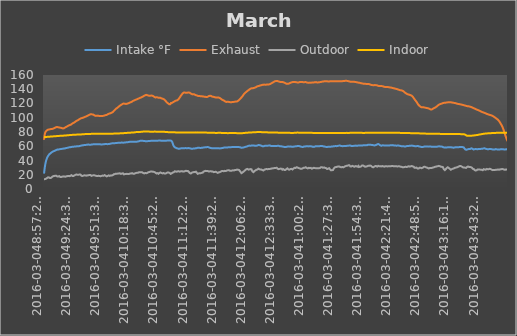
| Category | Intake °F | Exhaust | Outdoor | Indoor |
|---|---|---|---|---|
| 2016-03-048:57:28 AM | 21.65 | 69.125 | 13.775 | 72.838 |
| 2016-03-048:57:32 AM | 22.55 | 70.138 | 13.775 | 72.838 |
| 2016-03-048:57:36 AM | 23.45 | 71.038 | 13.775 | 72.838 |
| 2016-03-048:57:40 AM | 24.238 | 71.938 | 13.775 | 72.838 |
| 2016-03-048:57:44 AM | 25.138 | 72.838 | 13.775 | 72.838 |
| 2016-03-048:57:48 AM | 25.925 | 73.625 | 13.775 | 72.838 |
| 2016-03-048:57:52 AM | 26.825 | 74.3 | 13.888 | 72.838 |
| 2016-03-048:57:56 AM | 27.612 | 74.975 | 13.888 | 72.838 |
| 2016-03-048:58:00 AM | 28.4 | 75.538 | 13.888 | 72.838 |
| 2016-03-048:58:04 AM | 29.188 | 76.1 | 13.775 | 72.838 |
| 2016-03-048:58:08 AM | 29.862 | 76.662 | 13.775 | 72.838 |
| 2016-03-048:58:12 AM | 30.65 | 77.112 | 13.888 | 72.838 |
| 2016-03-048:58:16 AM | 31.325 | 77.562 | 13.888 | 72.838 |
| 2016-03-048:58:21 AM | 32 | 77.9 | 13.888 | 72.838 |
| 2016-03-048:58:25 AM | 32.562 | 78.35 | 13.888 | 72.838 |
| 2016-03-048:58:29 AM | 33.238 | 78.688 | 13.888 | 72.838 |
| 2016-03-048:58:33 AM | 33.8 | 79.025 | 13.888 | 72.95 |
| 2016-03-048:58:37 AM | 34.362 | 79.362 | 13.888 | 72.95 |
| 2016-03-048:58:41 AM | 34.925 | 79.588 | 13.888 | 72.95 |
| 2016-03-048:58:45 AM | 35.488 | 79.812 | 13.888 | 72.95 |
| 2016-03-048:58:49 AM | 36.05 | 80.038 | 14 | 72.95 |
| 2016-03-048:58:53 AM | 36.5 | 80.15 | 14 | 72.95 |
| 2016-03-048:58:57 AM | 36.95 | 80.375 | 14.112 | 72.95 |
| 2016-03-048:59:01 AM | 37.4 | 80.6 | 14.112 | 72.95 |
| 2016-03-048:59:05 AM | 37.85 | 80.712 | 14.225 | 72.95 |
| 2016-03-048:59:09 AM | 38.3 | 80.938 | 14.225 | 72.95 |
| 2016-03-048:59:13 AM | 38.638 | 81.05 | 14.338 | 72.95 |
| 2016-03-048:59:17 AM | 39.088 | 81.162 | 14.45 | 72.95 |
| 2016-03-048:59:21 AM | 39.425 | 81.275 | 14.45 | 72.95 |
| 2016-03-048:59:25 AM | 39.762 | 81.388 | 14.562 | 72.95 |
| 2016-03-048:59:29 AM | 40.1 | 81.5 | 14.675 | 72.95 |
| 2016-03-048:59:33 AM | 40.55 | 81.5 | 14.788 | 72.95 |
| 2016-03-048:59:37 AM | 40.775 | 81.612 | 14.9 | 72.95 |
| 2016-03-048:59:42 AM | 41.112 | 81.725 | 15.012 | 72.95 |
| 2016-03-048:59:46 AM | 41.45 | 81.725 | 15.012 | 72.95 |
| 2016-03-048:59:50 AM | 41.675 | 81.838 | 15.125 | 73.062 |
| 2016-03-048:59:54 AM | 42.012 | 81.95 | 15.237 | 73.062 |
| 2016-03-048:59:58 AM | 42.35 | 82.062 | 15.237 | 73.062 |
| 2016-03-049:00:02 AM | 42.575 | 82.175 | 15.35 | 73.062 |
| 2016-03-049:00:06 AM | 42.912 | 82.288 | 15.237 | 73.062 |
| 2016-03-049:00:10 AM | 43.138 | 82.288 | 15.35 | 73.175 |
| 2016-03-049:00:14 AM | 43.362 | 82.4 | 15.35 | 73.062 |
| 2016-03-049:00:18 AM | 43.588 | 82.512 | 15.462 | 73.175 |
| 2016-03-049:00:22 AM | 43.925 | 82.512 | 15.575 | 73.175 |
| 2016-03-049:00:26 AM | 44.15 | 82.625 | 15.688 | 73.175 |
| 2016-03-049:00:30 AM | 44.375 | 82.625 | 15.8 | 73.175 |
| 2016-03-049:00:34 AM | 44.488 | 82.738 | 15.912 | 73.175 |
| 2016-03-049:00:38 AM | 44.712 | 82.85 | 15.912 | 73.175 |
| 2016-03-049:00:42 AM | 44.938 | 82.85 | 15.912 | 73.175 |
| 2016-03-049:00:46 AM | 45.162 | 82.962 | 16.025 | 73.175 |
| 2016-03-049:00:51 AM | 45.388 | 82.962 | 16.138 | 73.175 |
| 2016-03-049:00:55 AM | 45.5 | 83.075 | 16.25 | 73.175 |
| 2016-03-049:00:59 AM | 45.725 | 83.075 | 16.25 | 73.175 |
| 2016-03-049:01:03 AM | 45.95 | 83.188 | 16.362 | 73.175 |
| 2016-03-049:01:07 AM | 46.062 | 83.188 | 16.475 | 73.175 |
| 2016-03-049:01:11 AM | 46.175 | 83.188 | 16.475 | 73.288 |
| 2016-03-049:01:15 AM | 46.288 | 83.188 | 16.362 | 73.288 |
| 2016-03-049:01:19 AM | 46.512 | 83.188 | 16.25 | 73.288 |
| 2016-03-049:01:23 AM | 46.625 | 83.3 | 16.25 | 73.288 |
| 2016-03-049:01:27 AM | 46.85 | 83.3 | 16.25 | 73.288 |
| 2016-03-049:01:31 AM | 46.962 | 83.3 | 16.25 | 73.288 |
| 2016-03-049:01:35 AM | 47.075 | 83.412 | 16.25 | 73.288 |
| 2016-03-049:01:39 AM | 47.3 | 83.412 | 16.25 | 73.288 |
| 2016-03-049:01:43 AM | 47.412 | 83.412 | 16.362 | 73.288 |
| 2016-03-049:01:47 AM | 47.525 | 83.525 | 16.362 | 73.288 |
| 2016-03-049:01:51 AM | 47.638 | 83.525 | 16.362 | 73.288 |
| 2016-03-049:01:56 AM | 47.862 | 83.525 | 16.362 | 73.288 |
| 2016-03-049:02:00 AM | 47.975 | 83.638 | 16.25 | 73.288 |
| 2016-03-049:02:04 AM | 48.2 | 83.638 | 16.138 | 73.288 |
| 2016-03-049:02:08 AM | 48.2 | 83.638 | 16.025 | 73.4 |
| 2016-03-049:02:12 AM | 48.312 | 83.75 | 16.138 | 73.288 |
| 2016-03-049:02:16 AM | 48.538 | 83.75 | 16.138 | 73.4 |
| 2016-03-049:02:20 AM | 48.538 | 83.75 | 16.138 | 73.4 |
| 2016-03-049:02:24 AM | 48.762 | 83.75 | 16.138 | 73.4 |
| 2016-03-049:02:28 AM | 48.875 | 83.862 | 16.138 | 73.4 |
| 2016-03-049:02:32 AM | 48.875 | 83.862 | 16.25 | 73.4 |
| 2016-03-049:02:36 AM | 48.988 | 83.75 | 16.25 | 73.4 |
| 2016-03-049:02:40 AM | 49.1 | 83.75 | 16.25 | 73.4 |
| 2016-03-049:02:44 AM | 49.1 | 83.75 | 16.138 | 73.4 |
| 2016-03-049:02:48 AM | 49.212 | 83.75 | 16.138 | 73.512 |
| 2016-03-049:02:53 AM | 49.325 | 83.862 | 15.912 | 73.4 |
| 2016-03-049:02:57 AM | 49.438 | 83.862 | 15.8 | 73.512 |
| 2016-03-049:03:01 AM | 49.438 | 83.862 | 15.575 | 73.512 |
| 2016-03-049:03:05 AM | 49.662 | 83.862 | 15.462 | 73.512 |
| 2016-03-049:03:09 AM | 49.662 | 83.975 | 15.35 | 73.512 |
| 2016-03-049:03:13 AM | 49.775 | 83.975 | 15.237 | 73.512 |
| 2016-03-049:03:17 AM | 49.888 | 83.975 | 15.237 | 73.512 |
| 2016-03-049:03:21 AM | 49.888 | 84.088 | 15.125 | 73.512 |
| 2016-03-049:03:25 AM | 50 | 84.088 | 15.237 | 73.512 |
| 2016-03-049:03:29 AM | 50.112 | 84.088 | 15.125 | 73.512 |
| 2016-03-049:03:33 AM | 50.112 | 83.975 | 15.237 | 73.512 |
| 2016-03-049:03:37 AM | 50.225 | 83.975 | 15.35 | 73.512 |
| 2016-03-049:03:41 AM | 50.338 | 84.088 | 15.35 | 73.512 |
| 2016-03-049:03:45 AM | 50.45 | 84.088 | 15.462 | 73.625 |
| 2016-03-049:03:49 AM | 50.562 | 84.088 | 15.462 | 73.512 |
| 2016-03-049:03:54 AM | 50.675 | 83.975 | 15.575 | 73.512 |
| 2016-03-049:03:58 AM | 50.675 | 84.088 | 15.688 | 73.512 |
| 2016-03-049:04:02 AM | 50.9 | 83.975 | 15.688 | 73.512 |
| 2016-03-049:04:06 AM | 51.012 | 84.088 | 15.8 | 73.625 |
| 2016-03-049:04:10 AM | 51.012 | 84.088 | 15.8 | 73.625 |
| 2016-03-049:04:14 AM | 51.125 | 84.088 | 15.912 | 73.625 |
| 2016-03-049:04:18 AM | 51.238 | 84.088 | 16.025 | 73.625 |
| 2016-03-049:04:22 AM | 51.238 | 84.088 | 16.138 | 73.625 |
| 2016-03-049:04:26 AM | 51.35 | 84.2 | 16.25 | 73.625 |
| 2016-03-049:04:30 AM | 51.462 | 84.2 | 16.362 | 73.738 |
| 2016-03-049:04:34 AM | 51.462 | 84.2 | 16.588 | 73.625 |
| 2016-03-049:04:38 AM | 51.575 | 84.2 | 16.7 | 73.738 |
| 2016-03-049:04:42 AM | 51.688 | 84.2 | 16.812 | 73.738 |
| 2016-03-049:04:46 AM | 51.8 | 84.2 | 16.925 | 73.738 |
| 2016-03-049:04:51 AM | 51.8 | 84.2 | 16.925 | 73.738 |
| 2016-03-049:04:55 AM | 51.912 | 84.2 | 17.037 | 73.738 |
| 2016-03-049:04:59 AM | 51.912 | 84.2 | 17.037 | 73.738 |
| 2016-03-049:05:03 AM | 52.025 | 84.312 | 17.037 | 73.738 |
| 2016-03-049:05:07 AM | 52.025 | 84.312 | 17.15 | 73.738 |
| 2016-03-049:05:11 AM | 52.138 | 84.312 | 17.262 | 73.738 |
| 2016-03-049:05:15 AM | 52.25 | 84.312 | 17.375 | 73.738 |
| 2016-03-049:05:19 AM | 52.25 | 84.425 | 17.488 | 73.85 |
| 2016-03-049:05:23 AM | 52.362 | 84.538 | 17.488 | 73.738 |
| 2016-03-049:05:27 AM | 52.362 | 84.538 | 17.6 | 73.738 |
| 2016-03-049:05:31 AM | 52.362 | 84.538 | 17.712 | 73.85 |
| 2016-03-049:05:35 AM | 52.475 | 84.538 | 17.712 | 73.85 |
| 2016-03-049:05:39 AM | 52.588 | 84.538 | 17.712 | 73.85 |
| 2016-03-049:05:43 AM | 52.588 | 84.65 | 17.825 | 73.85 |
| 2016-03-049:05:47 AM | 52.588 | 84.65 | 17.938 | 73.85 |
| 2016-03-049:05:51 AM | 52.7 | 84.65 | 17.938 | 73.85 |
| 2016-03-049:05:55 AM | 52.7 | 84.762 | 17.938 | 73.85 |
| 2016-03-049:05:59 AM | 52.812 | 84.762 | 18.05 | 73.85 |
| 2016-03-049:06:04 AM | 52.812 | 84.762 | 18.05 | 73.85 |
| 2016-03-049:06:08 AM | 52.925 | 84.762 | 18.05 | 73.85 |
| 2016-03-049:06:12 AM | 52.925 | 84.762 | 18.162 | 73.85 |
| 2016-03-049:06:16 AM | 52.925 | 84.875 | 18.162 | 73.962 |
| 2016-03-049:06:20 AM | 53.038 | 84.875 | 18.162 | 73.85 |
| 2016-03-049:06:24 AM | 53.15 | 84.875 | 18.162 | 73.962 |
| 2016-03-049:06:28 AM | 53.15 | 84.988 | 18.275 | 73.962 |
| 2016-03-049:06:32 AM | 53.15 | 84.988 | 18.05 | 73.962 |
| 2016-03-049:06:36 AM | 53.15 | 85.1 | 18.05 | 73.962 |
| 2016-03-049:06:40 AM | 53.15 | 85.1 | 18.05 | 73.962 |
| 2016-03-049:06:44 AM | 53.262 | 85.212 | 18.05 | 73.962 |
| 2016-03-049:06:48 AM | 53.262 | 85.212 | 18.05 | 73.962 |
| 2016-03-049:06:52 AM | 53.262 | 85.325 | 18.05 | 73.962 |
| 2016-03-049:06:56 AM | 53.262 | 85.325 | 18.162 | 73.962 |
| 2016-03-049:07:01 AM | 53.375 | 85.212 | 18.162 | 73.962 |
| 2016-03-049:07:05 AM | 53.375 | 85.212 | 18.275 | 73.962 |
| 2016-03-049:07:09 AM | 53.488 | 85.325 | 18.388 | 74.075 |
| 2016-03-049:07:13 AM | 53.488 | 85.438 | 18.388 | 73.962 |
| 2016-03-049:07:17 AM | 53.488 | 85.55 | 18.388 | 73.962 |
| 2016-03-049:07:21 AM | 53.6 | 85.55 | 18.388 | 73.962 |
| 2016-03-049:07:25 AM | 53.6 | 85.662 | 18.5 | 74.075 |
| 2016-03-049:07:29 AM | 53.6 | 85.662 | 18.388 | 73.962 |
| 2016-03-049:07:33 AM | 53.712 | 85.775 | 18.388 | 74.075 |
| 2016-03-049:07:37 AM | 53.712 | 85.888 | 18.5 | 74.075 |
| 2016-03-049:07:41 AM | 53.825 | 85.888 | 18.612 | 74.075 |
| 2016-03-049:07:45 AM | 53.938 | 86 | 18.725 | 74.075 |
| 2016-03-049:07:49 AM | 53.938 | 86 | 18.725 | 74.075 |
| 2016-03-049:07:53 AM | 53.938 | 86.112 | 18.725 | 74.075 |
| 2016-03-049:07:57 AM | 54.05 | 86.112 | 18.725 | 74.188 |
| 2016-03-049:08:02 AM | 54.05 | 86.225 | 18.838 | 74.075 |
| 2016-03-049:08:06 AM | 54.162 | 86.225 | 18.725 | 74.075 |
| 2016-03-049:08:10 AM | 54.162 | 86.338 | 18.725 | 74.075 |
| 2016-03-049:08:14 AM | 54.275 | 86.45 | 18.725 | 74.188 |
| 2016-03-049:08:18 AM | 54.275 | 86.338 | 18.725 | 74.188 |
| 2016-03-049:08:22 AM | 54.275 | 86.45 | 18.725 | 74.188 |
| 2016-03-049:08:26 AM | 54.388 | 86.562 | 18.838 | 74.188 |
| 2016-03-049:08:30 AM | 54.388 | 86.562 | 18.838 | 74.188 |
| 2016-03-049:08:34 AM | 54.5 | 86.562 | 18.838 | 74.188 |
| 2016-03-049:08:38 AM | 54.612 | 86.675 | 18.838 | 74.188 |
| 2016-03-049:08:42 AM | 54.5 | 86.675 | 18.725 | 74.188 |
| 2016-03-049:08:46 AM | 54.612 | 86.675 | 18.612 | 74.188 |
| 2016-03-049:08:50 AM | 54.612 | 86.788 | 18.612 | 74.188 |
| 2016-03-049:08:54 AM | 54.725 | 86.9 | 18.5 | 74.3 |
| 2016-03-049:08:59 AM | 54.725 | 86.9 | 18.388 | 74.3 |
| 2016-03-049:09:03 AM | 54.838 | 86.9 | 18.275 | 74.3 |
| 2016-03-049:09:07 AM | 54.95 | 87.012 | 18.275 | 74.3 |
| 2016-03-049:09:11 AM | 54.95 | 87.012 | 18.275 | 74.3 |
| 2016-03-049:09:15 AM | 54.95 | 87.012 | 18.275 | 74.3 |
| 2016-03-049:09:19 AM | 55.062 | 87.012 | 18.162 | 74.3 |
| 2016-03-049:09:23 AM | 55.062 | 87.125 | 18.05 | 74.3 |
| 2016-03-049:09:27 AM | 55.175 | 87.012 | 17.938 | 74.3 |
| 2016-03-049:09:31 AM | 55.175 | 87.012 | 17.712 | 74.3 |
| 2016-03-049:09:35 AM | 55.175 | 87.012 | 17.6 | 74.3 |
| 2016-03-049:09:39 AM | 55.288 | 87.012 | 17.6 | 74.3 |
| 2016-03-049:09:43 AM | 55.288 | 87.012 | 17.6 | 74.3 |
| 2016-03-049:09:47 AM | 55.4 | 87.012 | 17.6 | 74.3 |
| 2016-03-049:09:51 AM | 55.4 | 87.012 | 17.6 | 74.3 |
| 2016-03-049:09:55 AM | 55.4 | 87.012 | 17.712 | 74.3 |
| 2016-03-049:09:59 AM | 55.4 | 87.012 | 17.6 | 74.3 |
| 2016-03-049:10:03 AM | 55.4 | 87.012 | 17.375 | 74.3 |
| 2016-03-049:10:07 AM | 55.4 | 86.9 | 17.375 | 74.3 |
| 2016-03-049:10:12 AM | 55.4 | 86.9 | 17.375 | 74.3 |
| 2016-03-049:10:16 AM | 55.512 | 86.788 | 17.488 | 74.3 |
| 2016-03-049:10:20 AM | 55.512 | 86.788 | 17.488 | 74.3 |
| 2016-03-049:10:24 AM | 55.512 | 86.788 | 17.6 | 74.412 |
| 2016-03-049:10:28 AM | 55.512 | 86.675 | 17.6 | 74.412 |
| 2016-03-049:10:32 AM | 55.512 | 86.675 | 17.712 | 74.412 |
| 2016-03-049:10:36 AM | 55.512 | 86.562 | 17.712 | 74.412 |
| 2016-03-049:10:40 AM | 55.625 | 86.562 | 17.712 | 74.412 |
| 2016-03-049:10:44 AM | 55.512 | 86.45 | 17.6 | 74.412 |
| 2016-03-049:10:48 AM | 55.512 | 86.45 | 17.6 | 74.412 |
| 2016-03-049:10:52 AM | 55.512 | 86.45 | 17.488 | 74.412 |
| 2016-03-049:10:56 AM | 55.512 | 86.45 | 17.488 | 74.525 |
| 2016-03-049:11:00 AM | 55.512 | 86.45 | 17.488 | 74.412 |
| 2016-03-049:11:04 AM | 55.512 | 86.338 | 17.488 | 74.412 |
| 2016-03-049:11:08 AM | 55.512 | 86.338 | 17.488 | 74.525 |
| 2016-03-049:11:13 AM | 55.512 | 86.338 | 17.488 | 74.525 |
| 2016-03-049:11:17 AM | 55.512 | 86.338 | 17.488 | 74.525 |
| 2016-03-049:11:21 AM | 55.625 | 86.338 | 17.6 | 74.525 |
| 2016-03-049:11:25 AM | 55.625 | 86.338 | 17.712 | 74.525 |
| 2016-03-049:11:29 AM | 55.625 | 86.338 | 17.712 | 74.525 |
| 2016-03-049:11:33 AM | 55.738 | 86.338 | 17.825 | 74.525 |
| 2016-03-049:11:37 AM | 55.738 | 86.338 | 17.938 | 74.525 |
| 2016-03-049:11:41 AM | 55.738 | 86.338 | 18.05 | 74.525 |
| 2016-03-049:11:45 AM | 55.738 | 86.225 | 17.938 | 74.525 |
| 2016-03-049:11:49 AM | 55.738 | 86.225 | 17.712 | 74.525 |
| 2016-03-049:11:53 AM | 55.738 | 86.225 | 17.6 | 74.525 |
| 2016-03-049:11:57 AM | 55.738 | 86.225 | 17.488 | 74.525 |
| 2016-03-049:12:01 AM | 55.738 | 86.225 | 17.375 | 74.525 |
| 2016-03-049:12:05 AM | 55.85 | 86.225 | 17.375 | 74.525 |
| 2016-03-049:12:09 AM | 55.85 | 86.112 | 17.375 | 74.638 |
| 2016-03-049:12:14 AM | 55.85 | 86.112 | 17.262 | 74.638 |
| 2016-03-049:12:18 AM | 55.85 | 86.112 | 17.15 | 74.638 |
| 2016-03-049:12:22 AM | 55.85 | 86.225 | 17.037 | 74.638 |
| 2016-03-049:12:26 AM | 55.85 | 86.225 | 17.037 | 74.638 |
| 2016-03-049:12:30 AM | 55.85 | 86.112 | 17.037 | 74.638 |
| 2016-03-049:12:34 AM | 55.85 | 86.112 | 16.925 | 74.638 |
| 2016-03-049:12:38 AM | 55.962 | 86.112 | 16.812 | 74.638 |
| 2016-03-049:12:42 AM | 55.962 | 86.112 | 16.7 | 74.638 |
| 2016-03-049:12:46 AM | 55.962 | 86.112 | 16.7 | 74.638 |
| 2016-03-049:12:50 AM | 55.962 | 86.112 | 16.7 | 74.638 |
| 2016-03-049:12:54 AM | 56.075 | 86.112 | 16.7 | 74.638 |
| 2016-03-049:12:58 AM | 56.075 | 86 | 16.7 | 74.638 |
| 2016-03-049:13:02 AM | 56.075 | 86 | 16.812 | 74.638 |
| 2016-03-049:13:06 AM | 56.188 | 86 | 16.812 | 74.638 |
| 2016-03-049:13:11 AM | 56.188 | 86 | 16.812 | 74.75 |
| 2016-03-049:13:15 AM | 56.188 | 85.888 | 16.925 | 74.75 |
| 2016-03-049:13:19 AM | 56.188 | 85.888 | 16.925 | 74.75 |
| 2016-03-049:13:23 AM | 56.188 | 85.888 | 16.925 | 74.75 |
| 2016-03-049:13:27 AM | 56.188 | 85.888 | 17.037 | 74.75 |
| 2016-03-049:13:31 AM | 56.188 | 85.888 | 16.925 | 74.75 |
| 2016-03-049:13:35 AM | 56.3 | 85.775 | 16.925 | 74.75 |
| 2016-03-049:13:39 AM | 56.3 | 85.775 | 16.812 | 74.75 |
| 2016-03-049:13:43 AM | 56.3 | 85.775 | 16.812 | 74.75 |
| 2016-03-049:13:47 AM | 56.3 | 85.662 | 16.7 | 74.75 |
| 2016-03-049:13:51 AM | 56.3 | 85.55 | 16.812 | 74.75 |
| 2016-03-049:13:55 AM | 56.3 | 85.55 | 16.812 | 74.75 |
| 2016-03-049:13:59 AM | 56.3 | 85.55 | 16.925 | 74.862 |
| 2016-03-049:14:03 AM | 56.3 | 85.438 | 17.037 | 74.75 |
| 2016-03-049:14:07 AM | 56.412 | 85.438 | 17.15 | 74.862 |
| 2016-03-049:14:11 AM | 56.412 | 85.438 | 17.262 | 74.862 |
| 2016-03-049:14:16 AM | 56.412 | 85.325 | 17.15 | 74.75 |
| 2016-03-049:14:20 AM | 56.412 | 85.325 | 17.262 | 74.75 |
| 2016-03-049:14:24 AM | 56.412 | 85.325 | 17.262 | 74.75 |
| 2016-03-049:14:28 AM | 56.412 | 85.212 | 17.262 | 74.75 |
| 2016-03-049:14:32 AM | 56.412 | 85.212 | 17.375 | 74.862 |
| 2016-03-049:14:36 AM | 56.412 | 85.1 | 17.488 | 74.75 |
| 2016-03-049:14:40 AM | 56.412 | 85.1 | 17.488 | 74.862 |
| 2016-03-049:14:44 AM | 56.412 | 84.988 | 17.6 | 74.862 |
| 2016-03-049:14:48 AM | 56.412 | 84.988 | 17.6 | 74.862 |
| 2016-03-049:14:52 AM | 56.412 | 84.988 | 17.6 | 74.862 |
| 2016-03-049:14:56 AM | 56.412 | 84.875 | 17.6 | 74.862 |
| 2016-03-049:15:00 AM | 56.525 | 84.988 | 17.6 | 74.862 |
| 2016-03-049:15:04 AM | 56.525 | 84.988 | 17.6 | 74.862 |
| 2016-03-049:15:08 AM | 56.525 | 84.988 | 17.488 | 74.862 |
| 2016-03-049:15:12 AM | 56.525 | 84.988 | 17.6 | 74.862 |
| 2016-03-049:15:16 AM | 56.525 | 84.988 | 17.6 | 74.862 |
| 2016-03-049:15:21 AM | 56.525 | 85.1 | 17.6 | 74.862 |
| 2016-03-049:15:25 AM | 56.638 | 84.988 | 17.6 | 74.862 |
| 2016-03-049:15:29 AM | 56.638 | 84.988 | 17.712 | 74.862 |
| 2016-03-049:15:33 AM | 56.638 | 85.1 | 17.825 | 74.862 |
| 2016-03-049:15:37 AM | 56.638 | 84.988 | 17.825 | 74.862 |
| 2016-03-049:15:41 AM | 56.638 | 85.1 | 17.712 | 74.862 |
| 2016-03-049:15:45 AM | 56.75 | 85.212 | 17.6 | 74.862 |
| 2016-03-049:15:49 AM | 56.75 | 85.1 | 17.712 | 74.862 |
| 2016-03-049:15:53 AM | 56.75 | 85.212 | 17.6 | 74.862 |
| 2016-03-049:15:57 AM | 56.75 | 85.212 | 17.488 | 74.862 |
| 2016-03-049:16:01 AM | 56.75 | 85.325 | 17.375 | 74.975 |
| 2016-03-049:16:05 AM | 56.75 | 85.325 | 17.375 | 74.975 |
| 2016-03-049:16:09 AM | 56.75 | 85.325 | 17.375 | 74.975 |
| 2016-03-049:16:13 AM | 56.75 | 85.438 | 17.488 | 74.975 |
| 2016-03-049:16:17 AM | 56.75 | 85.55 | 17.488 | 74.975 |
| 2016-03-049:16:21 AM | 56.75 | 85.55 | 17.488 | 75.088 |
| 2016-03-049:16:25 AM | 56.862 | 85.662 | 17.488 | 75.088 |
| 2016-03-049:16:29 AM | 56.862 | 85.662 | 17.375 | 75.088 |
| 2016-03-049:16:34 AM | 56.862 | 85.775 | 17.262 | 75.088 |
| 2016-03-049:16:38 AM | 56.862 | 85.775 | 17.15 | 75.088 |
| 2016-03-049:16:42 AM | 56.862 | 85.775 | 17.15 | 75.088 |
| 2016-03-049:16:46 AM | 56.862 | 85.888 | 17.037 | 75.088 |
| 2016-03-049:16:50 AM | 56.975 | 86 | 17.15 | 75.088 |
| 2016-03-049:16:54 AM | 56.975 | 86.112 | 17.037 | 75.088 |
| 2016-03-049:16:58 AM | 57.088 | 86.112 | 16.925 | 75.088 |
| 2016-03-049:17:02 AM | 57.088 | 86.225 | 17.037 | 75.2 |
| 2016-03-049:17:06 AM | 57.088 | 86.225 | 17.037 | 75.2 |
| 2016-03-049:17:10 AM | 57.088 | 86.338 | 17.037 | 75.2 |
| 2016-03-049:17:14 AM | 57.2 | 86.338 | 17.037 | 75.2 |
| 2016-03-049:17:18 AM | 57.2 | 86.338 | 17.15 | 75.2 |
| 2016-03-049:17:22 AM | 57.2 | 86.45 | 17.262 | 75.2 |
| 2016-03-049:17:26 AM | 57.312 | 86.562 | 17.262 | 75.2 |
| 2016-03-049:17:30 AM | 57.312 | 86.562 | 17.262 | 75.2 |
| 2016-03-049:17:34 AM | 57.312 | 86.675 | 17.15 | 75.2 |
| 2016-03-049:17:38 AM | 57.312 | 86.675 | 17.15 | 75.2 |
| 2016-03-049:17:42 AM | 57.312 | 86.788 | 17.15 | 75.2 |
| 2016-03-049:17:47 AM | 57.312 | 86.788 | 17.262 | 75.2 |
| 2016-03-049:17:51 AM | 57.425 | 86.9 | 17.262 | 75.2 |
| 2016-03-049:17:55 AM | 57.312 | 87.012 | 17.262 | 75.2 |
| 2016-03-049:17:59 AM | 57.425 | 87.012 | 17.262 | 75.2 |
| 2016-03-049:18:03 AM | 57.425 | 87.125 | 17.375 | 75.2 |
| 2016-03-049:18:07 AM | 57.425 | 87.125 | 17.488 | 75.2 |
| 2016-03-049:18:11 AM | 57.538 | 87.125 | 17.6 | 75.2 |
| 2016-03-049:18:15 AM | 57.538 | 87.238 | 17.712 | 75.2 |
| 2016-03-049:18:19 AM | 57.538 | 87.238 | 17.825 | 75.2 |
| 2016-03-049:18:23 AM | 57.538 | 87.35 | 17.938 | 75.2 |
| 2016-03-049:18:27 AM | 57.65 | 87.462 | 17.938 | 75.2 |
| 2016-03-049:18:31 AM | 57.65 | 87.575 | 17.938 | 75.2 |
| 2016-03-049:18:35 AM | 57.65 | 87.575 | 18.05 | 75.312 |
| 2016-03-049:18:39 AM | 57.65 | 87.575 | 17.938 | 75.2 |
| 2016-03-049:18:43 AM | 57.65 | 87.575 | 17.938 | 75.2 |
| 2016-03-049:18:47 AM | 57.65 | 87.688 | 17.938 | 75.312 |
| 2016-03-049:18:51 AM | 57.762 | 87.8 | 18.05 | 75.2 |
| 2016-03-049:18:56 AM | 57.762 | 87.8 | 17.938 | 75.312 |
| 2016-03-049:19:00 AM | 57.762 | 87.912 | 17.938 | 75.312 |
| 2016-03-049:19:04 AM | 57.762 | 87.912 | 17.938 | 75.312 |
| 2016-03-049:19:08 AM | 57.762 | 87.912 | 17.938 | 75.312 |
| 2016-03-049:19:12 AM | 57.762 | 88.025 | 17.938 | 75.312 |
| 2016-03-049:19:16 AM | 57.762 | 88.025 | 18.05 | 75.425 |
| 2016-03-049:19:20 AM | 57.875 | 88.138 | 17.938 | 75.425 |
| 2016-03-049:19:24 AM | 57.875 | 88.25 | 18.162 | 75.425 |
| 2016-03-049:19:28 AM | 57.875 | 88.25 | 18.05 | 75.425 |
| 2016-03-049:19:32 AM | 57.875 | 88.362 | 18.05 | 75.425 |
| 2016-03-049:19:36 AM | 57.875 | 88.475 | 17.938 | 75.425 |
| 2016-03-049:19:40 AM | 57.988 | 88.475 | 17.938 | 75.425 |
| 2016-03-049:19:44 AM | 57.988 | 88.475 | 17.938 | 75.425 |
| 2016-03-049:19:48 AM | 57.988 | 88.588 | 17.825 | 75.425 |
| 2016-03-049:19:52 AM | 57.988 | 88.588 | 17.938 | 75.425 |
| 2016-03-049:19:56 AM | 58.1 | 88.7 | 17.938 | 75.425 |
| 2016-03-049:20:00 AM | 58.1 | 88.7 | 18.05 | 75.425 |
| 2016-03-049:20:05 AM | 58.1 | 88.7 | 18.162 | 75.425 |
| 2016-03-049:20:09 AM | 58.1 | 88.7 | 18.275 | 75.425 |
| 2016-03-049:20:13 AM | 58.212 | 88.812 | 18.388 | 75.425 |
| 2016-03-049:20:17 AM | 58.212 | 88.925 | 18.5 | 75.425 |
| 2016-03-049:20:21 AM | 58.212 | 89.038 | 18.612 | 75.425 |
| 2016-03-049:20:25 AM | 58.212 | 89.038 | 18.612 | 75.538 |
| 2016-03-049:20:29 AM | 58.325 | 89.15 | 18.725 | 75.538 |
| 2016-03-049:20:33 AM | 58.325 | 89.15 | 18.838 | 75.538 |
| 2016-03-049:20:37 AM | 58.325 | 89.262 | 18.838 | 75.538 |
| 2016-03-049:20:41 AM | 58.438 | 89.375 | 18.725 | 75.538 |
| 2016-03-049:20:45 AM | 58.438 | 89.375 | 18.612 | 75.538 |
| 2016-03-049:20:49 AM | 58.438 | 89.375 | 18.5 | 75.538 |
| 2016-03-049:20:53 AM | 58.438 | 89.375 | 18.388 | 75.538 |
| 2016-03-049:20:57 AM | 58.55 | 89.488 | 18.275 | 75.65 |
| 2016-03-049:21:01 AM | 58.55 | 89.6 | 18.275 | 75.538 |
| 2016-03-049:21:05 AM | 58.55 | 89.712 | 18.05 | 75.65 |
| 2016-03-049:21:09 AM | 58.55 | 89.712 | 18.05 | 75.65 |
| 2016-03-049:21:13 AM | 58.55 | 89.712 | 17.938 | 75.65 |
| 2016-03-049:21:17 AM | 58.55 | 89.825 | 18.05 | 75.65 |
| 2016-03-049:21:21 AM | 58.55 | 89.825 | 18.05 | 75.65 |
| 2016-03-049:21:25 AM | 58.662 | 89.825 | 18.162 | 75.65 |
| 2016-03-049:21:30 AM | 58.662 | 89.825 | 18.275 | 75.65 |
| 2016-03-049:21:34 AM | 58.662 | 89.825 | 18.275 | 75.65 |
| 2016-03-049:21:38 AM | 58.662 | 89.825 | 18.275 | 75.65 |
| 2016-03-049:21:42 AM | 58.662 | 89.938 | 18.275 | 75.65 |
| 2016-03-049:21:46 AM | 58.662 | 89.938 | 18.388 | 75.65 |
| 2016-03-049:21:50 AM | 58.662 | 89.938 | 18.388 | 75.65 |
| 2016-03-049:21:54 AM | 58.662 | 90.05 | 18.275 | 75.65 |
| 2016-03-049:21:58 AM | 58.662 | 90.05 | 18.388 | 75.762 |
| 2016-03-049:22:02 AM | 58.775 | 90.05 | 18.388 | 75.762 |
| 2016-03-049:22:06 AM | 58.775 | 90.05 | 18.5 | 75.762 |
| 2016-03-049:22:10 AM | 58.775 | 90.05 | 18.5 | 75.762 |
| 2016-03-049:22:14 AM | 58.775 | 90.05 | 18.612 | 75.762 |
| 2016-03-049:22:18 AM | 58.775 | 90.163 | 18.725 | 75.762 |
| 2016-03-049:22:22 AM | 58.775 | 90.163 | 18.838 | 75.875 |
| 2016-03-049:22:26 AM | 58.775 | 90.275 | 18.838 | 75.875 |
| 2016-03-049:22:30 AM | 58.775 | 90.275 | 18.838 | 75.875 |
| 2016-03-049:22:34 AM | 58.775 | 90.5 | 18.95 | 75.762 |
| 2016-03-049:22:39 AM | 58.888 | 90.5 | 19.062 | 75.875 |
| 2016-03-049:22:43 AM | 58.888 | 90.5 | 19.175 | 75.875 |
| 2016-03-049:22:47 AM | 58.888 | 90.5 | 19.175 | 75.875 |
| 2016-03-049:22:51 AM | 58.888 | 90.5 | 19.175 | 75.875 |
| 2016-03-049:22:55 AM | 58.888 | 90.612 | 19.288 | 75.875 |
| 2016-03-049:22:59 AM | 59 | 90.725 | 19.4 | 75.875 |
| 2016-03-049:23:03 AM | 59 | 90.95 | 19.4 | 75.875 |
| 2016-03-049:23:07 AM | 59 | 91.062 | 19.4 | 75.875 |
| 2016-03-049:23:11 AM | 59 | 91.175 | 19.288 | 75.988 |
| 2016-03-049:23:15 AM | 59 | 91.288 | 19.175 | 75.988 |
| 2016-03-049:23:19 AM | 59.112 | 91.4 | 19.062 | 75.988 |
| 2016-03-049:23:23 AM | 59.112 | 91.512 | 18.838 | 75.988 |
| 2016-03-049:23:27 AM | 59.112 | 91.625 | 18.838 | 75.988 |
| 2016-03-049:23:31 AM | 59.112 | 91.738 | 18.725 | 75.988 |
| 2016-03-049:23:35 AM | 59.112 | 91.738 | 18.612 | 75.988 |
| 2016-03-049:23:39 AM | 59.112 | 91.738 | 18.388 | 75.988 |
| 2016-03-049:23:43 AM | 59.112 | 91.85 | 18.388 | 75.988 |
| 2016-03-049:23:48 AM | 59.112 | 91.85 | 18.275 | 75.988 |
| 2016-03-049:23:52 AM | 59.112 | 91.962 | 18.275 | 75.988 |
| 2016-03-049:23:56 AM | 59.112 | 91.962 | 18.275 | 75.988 |
| 2016-03-049:24:00 AM | 59.112 | 91.962 | 18.275 | 75.988 |
| 2016-03-049:24:04 AM | 59.112 | 91.962 | 18.275 | 75.988 |
| 2016-03-049:24:08 AM | 59.112 | 92.075 | 18.388 | 75.988 |
| 2016-03-049:24:12 AM | 59.112 | 92.075 | 18.5 | 75.988 |
| 2016-03-049:24:16 AM | 59.225 | 92.188 | 18.5 | 76.1 |
| 2016-03-049:24:20 AM | 59.225 | 92.3 | 18.5 | 76.1 |
| 2016-03-049:24:24 AM | 59.225 | 92.3 | 18.5 | 75.988 |
| 2016-03-049:24:28 AM | 59.225 | 92.413 | 18.5 | 76.1 |
| 2016-03-049:24:32 AM | 59.225 | 92.413 | 18.5 | 76.1 |
| 2016-03-049:24:36 AM | 59.225 | 92.525 | 18.612 | 76.1 |
| 2016-03-049:24:40 AM | 59.225 | 92.525 | 18.5 | 76.1 |
| 2016-03-049:24:44 AM | 59.338 | 92.638 | 18.5 | 76.1 |
| 2016-03-049:24:48 AM | 59.338 | 92.638 | 18.5 | 76.1 |
| 2016-03-049:24:52 AM | 59.338 | 92.75 | 18.388 | 76.1 |
| 2016-03-049:24:56 AM | 59.338 | 92.75 | 18.275 | 76.1 |
| 2016-03-049:25:01 AM | 59.338 | 92.75 | 18.275 | 76.1 |
| 2016-03-049:25:05 AM | 59.338 | 92.862 | 18.388 | 76.1 |
| 2016-03-049:25:09 AM | 59.338 | 92.862 | 18.388 | 76.1 |
| 2016-03-049:25:13 AM | 59.45 | 92.862 | 18.5 | 76.1 |
| 2016-03-049:25:17 AM | 59.45 | 92.975 | 18.5 | 76.1 |
| 2016-03-049:25:21 AM | 59.45 | 92.975 | 18.5 | 76.212 |
| 2016-03-049:25:25 AM | 59.45 | 93.088 | 18.612 | 76.212 |
| 2016-03-049:25:29 AM | 59.45 | 93.088 | 18.612 | 76.212 |
| 2016-03-049:25:33 AM | 59.45 | 93.2 | 18.725 | 76.212 |
| 2016-03-049:25:37 AM | 59.45 | 93.2 | 18.838 | 76.212 |
| 2016-03-049:25:41 AM | 59.45 | 93.312 | 18.95 | 76.212 |
| 2016-03-049:25:45 AM | 59.562 | 93.425 | 18.95 | 76.212 |
| 2016-03-049:25:49 AM | 59.45 | 93.538 | 19.062 | 76.212 |
| 2016-03-049:25:53 AM | 59.45 | 93.538 | 19.175 | 76.212 |
| 2016-03-049:25:57 AM | 59.562 | 93.65 | 19.175 | 76.212 |
| 2016-03-049:26:01 AM | 59.562 | 93.762 | 19.288 | 76.212 |
| 2016-03-049:26:05 AM | 59.562 | 93.875 | 19.288 | 76.212 |
| 2016-03-049:26:10 AM | 59.562 | 93.875 | 19.288 | 76.212 |
| 2016-03-049:26:14 AM | 59.562 | 93.988 | 19.288 | 76.325 |
| 2016-03-049:26:18 AM | 59.562 | 94.1 | 19.288 | 76.212 |
| 2016-03-049:26:22 AM | 59.562 | 94.1 | 19.4 | 76.212 |
| 2016-03-049:26:26 AM | 59.675 | 94.212 | 19.512 | 76.212 |
| 2016-03-049:26:30 AM | 59.675 | 94.325 | 19.512 | 76.212 |
| 2016-03-049:26:34 AM | 59.562 | 94.438 | 19.625 | 76.212 |
| 2016-03-049:26:38 AM | 59.675 | 94.438 | 19.738 | 76.212 |
| 2016-03-049:26:42 AM | 59.675 | 94.55 | 19.85 | 76.212 |
| 2016-03-049:26:46 AM | 59.675 | 94.55 | 19.85 | 76.325 |
| 2016-03-049:26:50 AM | 59.675 | 94.663 | 19.962 | 76.212 |
| 2016-03-049:26:54 AM | 59.675 | 94.775 | 19.962 | 76.325 |
| 2016-03-049:26:58 AM | 59.675 | 94.775 | 20.075 | 76.325 |
| 2016-03-049:27:02 AM | 59.675 | 95 | 19.962 | 76.325 |
| 2016-03-049:27:06 AM | 59.675 | 95 | 19.962 | 76.325 |
| 2016-03-049:27:11 AM | 59.675 | 95 | 19.962 | 76.325 |
| 2016-03-049:27:15 AM | 59.675 | 95.112 | 20.075 | 76.325 |
| 2016-03-049:27:19 AM | 59.788 | 95.225 | 20.075 | 76.325 |
| 2016-03-049:27:23 AM | 59.788 | 95.338 | 20.075 | 76.325 |
| 2016-03-049:27:27 AM | 59.788 | 95.338 | 20.075 | 76.325 |
| 2016-03-049:27:31 AM | 59.788 | 95.45 | 20.075 | 76.325 |
| 2016-03-049:27:35 AM | 59.788 | 95.562 | 20.075 | 76.325 |
| 2016-03-049:27:39 AM | 59.9 | 95.562 | 20.188 | 76.325 |
| 2016-03-049:27:43 AM | 59.9 | 95.675 | 20.188 | 76.325 |
| 2016-03-049:27:47 AM | 59.9 | 95.788 | 20.3 | 76.325 |
| 2016-03-049:27:51 AM | 59.9 | 95.788 | 20.188 | 76.325 |
| 2016-03-049:27:55 AM | 59.9 | 95.9 | 20.075 | 76.325 |
| 2016-03-049:27:59 AM | 59.9 | 95.9 | 19.962 | 76.438 |
| 2016-03-049:28:03 AM | 60.012 | 96.012 | 19.962 | 76.325 |
| 2016-03-049:28:07 AM | 60.012 | 96.012 | 19.962 | 76.325 |
| 2016-03-049:28:11 AM | 60.012 | 96.012 | 20.075 | 76.325 |
| 2016-03-049:28:15 AM | 60.012 | 96.125 | 20.188 | 76.325 |
| 2016-03-049:28:19 AM | 60.012 | 96.125 | 20.3 | 76.325 |
| 2016-03-049:28:23 AM | 60.012 | 96.125 | 20.412 | 76.325 |
| 2016-03-049:28:27 AM | 60.012 | 96.238 | 20.3 | 76.325 |
| 2016-03-049:28:31 AM | 60.012 | 96.238 | 20.3 | 76.325 |
| 2016-03-049:28:35 AM | 60.012 | 96.35 | 20.075 | 76.325 |
| 2016-03-049:28:39 AM | 60.012 | 96.35 | 19.962 | 76.325 |
| 2016-03-049:28:43 AM | 60.125 | 96.462 | 19.85 | 76.325 |
| 2016-03-049:28:47 AM | 60.012 | 96.462 | 19.85 | 76.325 |
| 2016-03-049:28:51 AM | 60.012 | 96.575 | 19.738 | 76.325 |
| 2016-03-049:28:55 AM | 60.012 | 96.575 | 19.738 | 76.325 |
| 2016-03-049:28:59 AM | 60.012 | 96.575 | 19.738 | 76.325 |
| 2016-03-049:29:03 AM | 60.012 | 96.688 | 19.85 | 76.325 |
| 2016-03-049:29:07 AM | 60.012 | 96.688 | 19.85 | 76.325 |
| 2016-03-049:29:11 AM | 59.9 | 96.8 | 19.85 | 76.325 |
| 2016-03-049:29:16 AM | 59.9 | 96.8 | 19.962 | 76.325 |
| 2016-03-049:29:20 AM | 60.012 | 96.8 | 19.962 | 76.438 |
| 2016-03-049:29:24 AM | 59.9 | 96.913 | 19.962 | 76.325 |
| 2016-03-049:29:28 AM | 59.9 | 96.913 | 19.962 | 76.325 |
| 2016-03-049:29:32 AM | 60.012 | 97.025 | 19.962 | 76.438 |
| 2016-03-049:29:36 AM | 59.9 | 97.025 | 20.075 | 76.438 |
| 2016-03-049:29:40 AM | 59.9 | 97.138 | 20.075 | 76.438 |
| 2016-03-049:29:44 AM | 59.9 | 97.25 | 20.188 | 76.438 |
| 2016-03-049:29:48 AM | 59.9 | 97.362 | 20.188 | 76.438 |
| 2016-03-049:29:52 AM | 60.012 | 97.362 | 20.3 | 76.438 |
| 2016-03-049:29:56 AM | 60.012 | 97.475 | 20.3 | 76.438 |
| 2016-03-049:30:00 AM | 60.012 | 97.588 | 20.3 | 76.438 |
| 2016-03-049:30:04 AM | 60.125 | 97.7 | 20.412 | 76.55 |
| 2016-03-049:30:08 AM | 60.125 | 97.7 | 20.412 | 76.438 |
| 2016-03-049:30:12 AM | 60.125 | 97.812 | 20.412 | 76.55 |
| 2016-03-049:30:16 AM | 60.125 | 97.812 | 20.3 | 76.55 |
| 2016-03-049:30:20 AM | 60.238 | 97.925 | 20.3 | 76.55 |
| 2016-03-049:30:24 AM | 60.238 | 97.925 | 20.412 | 76.438 |
| 2016-03-049:30:28 AM | 60.238 | 98.038 | 20.412 | 76.438 |
| 2016-03-049:30:32 AM | 60.238 | 98.038 | 20.3 | 76.438 |
| 2016-03-049:30:36 AM | 60.238 | 98.15 | 20.3 | 76.438 |
| 2016-03-049:30:40 AM | 60.35 | 98.262 | 20.188 | 76.438 |
| 2016-03-049:30:44 AM | 60.35 | 98.262 | 20.075 | 76.438 |
| 2016-03-049:30:48 AM | 60.35 | 98.375 | 20.075 | 76.438 |
| 2016-03-049:30:52 AM | 60.462 | 98.375 | 20.075 | 76.55 |
| 2016-03-049:30:56 AM | 60.462 | 98.488 | 20.188 | 76.438 |
| 2016-03-049:31:00 AM | 60.462 | 98.6 | 20.188 | 76.438 |
| 2016-03-049:31:04 AM | 60.575 | 98.6 | 20.3 | 76.438 |
| 2016-03-049:31:08 AM | 60.575 | 98.712 | 20.3 | 76.438 |
| 2016-03-049:31:12 AM | 60.575 | 98.712 | 20.3 | 76.55 |
| 2016-03-049:31:16 AM | 60.575 | 98.825 | 20.3 | 76.55 |
| 2016-03-049:31:21 AM | 60.575 | 98.825 | 20.3 | 76.55 |
| 2016-03-049:31:25 AM | 60.688 | 98.938 | 20.3 | 76.55 |
| 2016-03-049:31:29 AM | 60.8 | 99.05 | 20.3 | 76.55 |
| 2016-03-049:31:33 AM | 60.688 | 98.938 | 20.188 | 76.55 |
| 2016-03-049:31:37 AM | 60.8 | 99.05 | 20.3 | 76.55 |
| 2016-03-049:31:41 AM | 60.8 | 99.05 | 20.3 | 76.55 |
| 2016-03-049:31:45 AM | 60.8 | 99.163 | 20.188 | 76.55 |
| 2016-03-049:31:49 AM | 60.8 | 99.163 | 20.075 | 76.55 |
| 2016-03-049:31:53 AM | 60.8 | 99.163 | 19.85 | 76.55 |
| 2016-03-049:31:57 AM | 60.912 | 99.275 | 19.625 | 76.55 |
| 2016-03-049:32:01 AM | 60.912 | 99.388 | 19.4 | 76.55 |
| 2016-03-049:32:05 AM | 60.912 | 99.388 | 19.062 | 76.662 |
| 2016-03-049:32:09 AM | 61.025 | 99.388 | 18.725 | 76.662 |
| 2016-03-049:32:13 AM | 61.025 | 99.5 | 18.5 | 76.662 |
| 2016-03-049:32:17 AM | 61.025 | 99.5 | 18.275 | 76.662 |
| 2016-03-049:32:21 AM | 61.025 | 99.5 | 18.162 | 76.662 |
| 2016-03-049:32:25 AM | 61.138 | 99.5 | 18.05 | 76.662 |
| 2016-03-049:32:29 AM | 61.138 | 99.612 | 18.05 | 76.662 |
| 2016-03-049:32:33 AM | 61.138 | 99.612 | 18.162 | 76.662 |
| 2016-03-049:32:37 AM | 61.138 | 99.612 | 18.162 | 76.662 |
| 2016-03-049:32:41 AM | 61.138 | 99.612 | 18.162 | 76.775 |
| 2016-03-049:32:45 AM | 61.138 | 99.612 | 18.162 | 76.662 |
| 2016-03-049:32:49 AM | 61.138 | 99.725 | 18.05 | 76.662 |
| 2016-03-049:32:53 AM | 61.138 | 99.725 | 18.05 | 76.775 |
| 2016-03-049:32:57 AM | 61.25 | 99.725 | 18.162 | 76.662 |
| 2016-03-049:33:01 AM | 61.25 | 99.725 | 18.162 | 76.662 |
| 2016-03-049:33:05 AM | 61.138 | 99.725 | 18.275 | 76.775 |
| 2016-03-049:33:09 AM | 61.138 | 99.725 | 18.388 | 76.662 |
| 2016-03-049:33:13 AM | 61.25 | 99.725 | 18.5 | 76.775 |
| 2016-03-049:33:17 AM | 61.25 | 99.725 | 18.5 | 76.775 |
| 2016-03-049:33:21 AM | 61.25 | 99.725 | 18.612 | 76.775 |
| 2016-03-049:33:25 AM | 61.25 | 99.725 | 18.5 | 76.775 |
| 2016-03-049:33:29 AM | 61.25 | 99.725 | 18.5 | 76.888 |
| 2016-03-049:33:33 AM | 61.363 | 99.838 | 18.5 | 76.888 |
| 2016-03-049:33:38 AM | 61.363 | 99.838 | 18.5 | 76.888 |
| 2016-03-049:33:42 AM | 61.363 | 99.95 | 18.612 | 76.775 |
| 2016-03-049:33:46 AM | 61.363 | 100.062 | 18.612 | 76.775 |
| 2016-03-049:33:50 AM | 61.475 | 100.062 | 18.725 | 76.775 |
| 2016-03-049:33:54 AM | 61.363 | 100.062 | 18.725 | 76.775 |
| 2016-03-049:33:58 AM | 61.475 | 100.175 | 18.725 | 76.888 |
| 2016-03-049:34:02 AM | 61.475 | 100.175 | 18.725 | 76.888 |
| 2016-03-049:34:06 AM | 61.475 | 100.288 | 18.725 | 76.888 |
| 2016-03-049:34:10 AM | 61.475 | 100.288 | 18.838 | 76.888 |
| 2016-03-049:34:14 AM | 61.475 | 100.288 | 18.838 | 76.888 |
| 2016-03-049:34:18 AM | 61.475 | 100.288 | 19.062 | 76.888 |
| 2016-03-049:34:22 AM | 61.475 | 100.4 | 19.062 | 76.888 |
| 2016-03-049:34:26 AM | 61.475 | 100.4 | 19.062 | 76.888 |
| 2016-03-049:34:30 AM | 61.475 | 100.4 | 19.062 | 76.888 |
| 2016-03-049:34:34 AM | 61.588 | 100.4 | 19.062 | 76.888 |
| 2016-03-049:34:38 AM | 61.588 | 100.512 | 18.95 | 76.888 |
| 2016-03-049:34:42 AM | 61.588 | 100.512 | 18.95 | 77 |
| 2016-03-049:34:46 AM | 61.588 | 100.625 | 19.062 | 77 |
| 2016-03-049:34:50 AM | 61.588 | 100.738 | 19.062 | 77 |
| 2016-03-049:34:54 AM | 61.588 | 100.738 | 19.062 | 77 |
| 2016-03-049:34:58 AM | 61.588 | 100.738 | 19.175 | 77 |
| 2016-03-049:35:02 AM | 61.7 | 100.85 | 19.175 | 77 |
| 2016-03-049:35:06 AM | 61.7 | 100.962 | 19.175 | 77 |
| 2016-03-049:35:10 AM | 61.7 | 100.962 | 19.175 | 77 |
| 2016-03-049:35:14 AM | 61.7 | 100.962 | 19.288 | 77 |
| 2016-03-049:35:18 AM | 61.7 | 100.962 | 19.288 | 77 |
| 2016-03-049:35:22 AM | 61.7 | 101.075 | 19.4 | 77 |
| 2016-03-049:35:26 AM | 61.7 | 101.188 | 19.4 | 77 |
| 2016-03-049:35:30 AM | 61.812 | 101.188 | 19.4 | 77 |
| 2016-03-049:35:34 AM | 61.812 | 101.188 | 19.288 | 77 |
| 2016-03-049:35:38 AM | 61.812 | 101.3 | 19.288 | 77 |
| 2016-03-049:35:42 AM | 61.812 | 101.3 | 19.175 | 77 |
| 2016-03-049:35:46 AM | 61.812 | 101.3 | 19.175 | 77 |
| 2016-03-049:35:50 AM | 61.812 | 101.413 | 19.175 | 77 |
| 2016-03-049:35:54 AM | 61.812 | 101.413 | 19.062 | 77 |
| 2016-03-049:35:59 AM | 61.812 | 101.525 | 18.95 | 77 |
| 2016-03-049:36:03 AM | 61.925 | 101.525 | 18.838 | 77 |
| 2016-03-049:36:07 AM | 61.925 | 101.638 | 18.725 | 77.112 |
| 2016-03-049:36:11 AM | 61.925 | 101.638 | 18.612 | 77 |
| 2016-03-049:36:15 AM | 61.925 | 101.638 | 18.5 | 77.112 |
| 2016-03-049:36:19 AM | 61.925 | 101.75 | 18.5 | 77.112 |
| 2016-03-049:36:23 AM | 61.925 | 101.75 | 18.5 | 77.112 |
| 2016-03-049:36:27 AM | 61.925 | 101.75 | 18.5 | 77.112 |
| 2016-03-049:36:31 AM | 61.925 | 101.862 | 18.5 | 77.112 |
| 2016-03-049:36:35 AM | 61.925 | 101.862 | 18.5 | 77.112 |
| 2016-03-049:36:39 AM | 61.925 | 101.862 | 18.612 | 77.112 |
| 2016-03-049:36:43 AM | 62.038 | 101.975 | 18.612 | 77.112 |
| 2016-03-049:36:47 AM | 61.925 | 101.975 | 18.612 | 77.112 |
| 2016-03-049:36:51 AM | 61.925 | 101.975 | 18.725 | 77.112 |
| 2016-03-049:36:55 AM | 61.925 | 102.088 | 18.725 | 77.112 |
| 2016-03-049:36:59 AM | 62.038 | 102.088 | 18.725 | 77.112 |
| 2016-03-049:37:03 AM | 62.038 | 102.088 | 18.838 | 77.112 |
| 2016-03-049:37:07 AM | 62.038 | 102.2 | 18.838 | 77.112 |
| 2016-03-049:37:11 AM | 62.038 | 102.2 | 18.95 | 77.112 |
| 2016-03-049:37:15 AM | 62.038 | 102.312 | 19.062 | 77.112 |
| 2016-03-049:37:19 AM | 62.038 | 102.425 | 19.062 | 77.112 |
| 2016-03-049:37:23 AM | 62.038 | 102.538 | 19.062 | 77.225 |
| 2016-03-049:37:27 AM | 62.15 | 102.538 | 19.062 | 77.112 |
| 2016-03-049:37:31 AM | 62.15 | 102.65 | 19.062 | 77.225 |
| 2016-03-049:37:35 AM | 62.15 | 102.65 | 18.95 | 77.225 |
| 2016-03-049:37:39 AM | 62.15 | 102.65 | 19.062 | 77.225 |
| 2016-03-049:37:43 AM | 62.15 | 102.762 | 19.062 | 77.225 |
| 2016-03-049:37:47 AM | 62.262 | 102.762 | 19.062 | 77.225 |
| 2016-03-049:37:51 AM | 62.15 | 102.875 | 19.175 | 77.225 |
| 2016-03-049:37:55 AM | 62.262 | 102.875 | 19.175 | 77.225 |
| 2016-03-049:37:59 AM | 62.262 | 102.988 | 19.175 | 77.225 |
| 2016-03-049:38:03 AM | 62.262 | 102.988 | 19.062 | 77.225 |
| 2016-03-049:38:07 AM | 62.262 | 103.1 | 19.062 | 77.225 |
| 2016-03-049:38:11 AM | 62.262 | 103.1 | 19.062 | 77.225 |
| 2016-03-049:38:15 AM | 62.375 | 103.212 | 19.175 | 77.225 |
| 2016-03-049:38:20 AM | 62.262 | 103.212 | 19.175 | 77.225 |
| 2016-03-049:38:24 AM | 62.375 | 103.212 | 19.288 | 77.225 |
| 2016-03-049:38:28 AM | 62.375 | 103.325 | 19.288 | 77.225 |
| 2016-03-049:38:32 AM | 62.375 | 103.438 | 19.4 | 77.225 |
| 2016-03-049:38:36 AM | 62.375 | 103.438 | 19.4 | 77.225 |
| 2016-03-049:38:40 AM | 62.375 | 103.438 | 19.4 | 77.225 |
| 2016-03-049:38:44 AM | 62.375 | 103.438 | 19.288 | 77.225 |
| 2016-03-049:38:48 AM | 62.375 | 103.55 | 19.175 | 77.225 |
| 2016-03-049:38:52 AM | 62.375 | 103.55 | 19.175 | 77.225 |
| 2016-03-049:38:56 AM | 62.375 | 103.55 | 19.175 | 77.225 |
| 2016-03-049:39:00 AM | 62.375 | 103.663 | 19.175 | 77.225 |
| 2016-03-049:39:04 AM | 62.375 | 103.663 | 19.288 | 77.225 |
| 2016-03-049:39:08 AM | 62.375 | 103.775 | 19.288 | 77.338 |
| 2016-03-049:39:12 AM | 62.375 | 103.775 | 19.288 | 77.338 |
| 2016-03-049:39:16 AM | 62.375 | 103.888 | 19.4 | 77.338 |
| 2016-03-049:39:20 AM | 62.262 | 103.888 | 19.512 | 77.338 |
| 2016-03-049:39:24 AM | 62.262 | 104 | 19.512 | 77.338 |
| 2016-03-049:39:28 AM | 62.262 | 104 | 19.625 | 77.338 |
| 2016-03-049:39:32 AM | 62.262 | 104.112 | 19.625 | 77.338 |
| 2016-03-049:39:36 AM | 62.262 | 104.112 | 19.738 | 77.338 |
| 2016-03-049:39:40 AM | 62.262 | 104.225 | 19.625 | 77.338 |
| 2016-03-049:39:44 AM | 62.262 | 104.338 | 19.625 | 77.338 |
| 2016-03-049:39:48 AM | 62.262 | 104.338 | 19.512 | 77.338 |
| 2016-03-049:39:52 AM | 62.262 | 104.338 | 19.625 | 77.338 |
| 2016-03-049:39:56 AM | 62.262 | 104.45 | 19.625 | 77.338 |
| 2016-03-049:40:00 AM | 62.262 | 104.45 | 19.738 | 77.338 |
| 2016-03-049:40:04 AM | 62.262 | 104.562 | 19.738 | 77.338 |
| 2016-03-049:40:08 AM | 62.262 | 104.675 | 19.738 | 77.338 |
| 2016-03-049:40:12 AM | 62.262 | 104.675 | 19.738 | 77.338 |
| 2016-03-049:40:16 AM | 62.262 | 104.562 | 19.738 | 77.338 |
| 2016-03-049:40:20 AM | 62.262 | 104.675 | 19.85 | 77.338 |
| 2016-03-049:40:24 AM | 62.262 | 104.675 | 19.85 | 77.338 |
| 2016-03-049:40:28 AM | 62.262 | 104.675 | 19.962 | 77.338 |
| 2016-03-049:40:32 AM | 62.262 | 104.788 | 19.85 | 77.338 |
| 2016-03-049:40:37 AM | 62.262 | 104.788 | 19.738 | 77.338 |
| 2016-03-049:40:41 AM | 62.262 | 104.9 | 19.625 | 77.338 |
| 2016-03-049:40:45 AM | 62.262 | 104.788 | 19.512 | 77.338 |
| 2016-03-049:40:49 AM | 62.262 | 104.9 | 19.512 | 77.338 |
| 2016-03-049:40:53 AM | 62.262 | 104.9 | 19.512 | 77.338 |
| 2016-03-049:40:57 AM | 62.262 | 104.788 | 19.512 | 77.338 |
| 2016-03-049:41:01 AM | 62.262 | 104.788 | 19.512 | 77.338 |
| 2016-03-049:41:05 AM | 62.262 | 104.788 | 19.4 | 77.338 |
| 2016-03-049:41:09 AM | 62.262 | 104.788 | 19.175 | 77.338 |
| 2016-03-049:41:13 AM | 62.262 | 104.788 | 18.838 | 77.338 |
| 2016-03-049:41:17 AM | 62.262 | 104.788 | 18.725 | 77.338 |
| 2016-03-049:41:21 AM | 62.262 | 104.788 | 18.725 | 77.338 |
| 2016-03-049:41:25 AM | 62.262 | 104.9 | 18.725 | 77.45 |
| 2016-03-049:41:29 AM | 62.262 | 104.788 | 18.612 | 77.338 |
| 2016-03-049:41:33 AM | 62.262 | 104.788 | 18.5 | 77.338 |
| 2016-03-049:41:37 AM | 62.262 | 104.788 | 18.612 | 77.338 |
| 2016-03-049:41:41 AM | 62.262 | 104.788 | 18.5 | 77.45 |
| 2016-03-049:41:45 AM | 62.375 | 104.675 | 18.612 | 77.45 |
| 2016-03-049:41:49 AM | 62.375 | 104.675 | 18.725 | 77.338 |
| 2016-03-049:41:53 AM | 62.375 | 104.675 | 18.725 | 77.45 |
| 2016-03-049:41:57 AM | 62.375 | 104.675 | 18.838 | 77.45 |
| 2016-03-049:42:01 AM | 62.375 | 104.675 | 18.838 | 77.338 |
| 2016-03-049:42:05 AM | 62.375 | 104.675 | 18.838 | 77.45 |
| 2016-03-049:42:09 AM | 62.488 | 104.675 | 18.725 | 77.45 |
| 2016-03-049:42:13 AM | 62.488 | 104.675 | 18.838 | 77.45 |
| 2016-03-049:42:17 AM | 62.488 | 104.675 | 18.838 | 77.45 |
| 2016-03-049:42:21 AM | 62.488 | 104.675 | 18.95 | 77.45 |
| 2016-03-049:42:25 AM | 62.6 | 104.675 | 18.95 | 77.45 |
| 2016-03-049:42:29 AM | 62.6 | 104.675 | 19.062 | 77.45 |
| 2016-03-049:42:33 AM | 62.6 | 104.675 | 19.175 | 77.45 |
| 2016-03-049:42:37 AM | 62.6 | 104.562 | 19.175 | 77.45 |
| 2016-03-049:42:41 AM | 62.6 | 104.562 | 19.288 | 77.45 |
| 2016-03-049:42:45 AM | 62.712 | 104.562 | 19.288 | 77.45 |
| 2016-03-049:42:49 AM | 62.712 | 104.562 | 19.288 | 77.45 |
| 2016-03-049:42:53 AM | 62.712 | 104.562 | 19.4 | 77.45 |
| 2016-03-049:42:57 AM | 62.712 | 104.562 | 19.288 | 77.45 |
| 2016-03-049:43:01 AM | 62.712 | 104.562 | 19.288 | 77.45 |
| 2016-03-049:43:06 AM | 62.712 | 104.45 | 19.175 | 77.45 |
| 2016-03-049:43:10 AM | 62.712 | 104.45 | 19.175 | 77.45 |
| 2016-03-049:43:14 AM | 62.712 | 104.45 | 19.062 | 77.45 |
| 2016-03-049:43:18 AM | 62.825 | 104.338 | 19.175 | 77.45 |
| 2016-03-049:43:22 AM | 62.712 | 104.338 | 19.175 | 77.45 |
| 2016-03-049:43:26 AM | 62.712 | 104.338 | 19.175 | 77.45 |
| 2016-03-049:43:30 AM | 62.825 | 104.225 | 19.175 | 77.45 |
| 2016-03-049:43:34 AM | 62.712 | 104.112 | 19.175 | 77.45 |
| 2016-03-049:43:38 AM | 62.825 | 104.112 | 19.175 | 77.45 |
| 2016-03-049:43:42 AM | 62.825 | 104.112 | 19.062 | 77.45 |
| 2016-03-049:43:46 AM | 62.825 | 104 | 18.95 | 77.45 |
| 2016-03-049:43:50 AM | 62.825 | 104 | 19.062 | 77.45 |
| 2016-03-049:43:54 AM | 62.825 | 103.888 | 18.95 | 77.45 |
| 2016-03-049:43:58 AM | 62.825 | 103.888 | 18.838 | 77.45 |
| 2016-03-049:44:02 AM | 62.825 | 103.775 | 18.95 | 77.45 |
| 2016-03-049:44:06 AM | 62.825 | 103.663 | 18.95 | 77.45 |
| 2016-03-049:44:10 AM | 62.938 | 103.55 | 18.95 | 77.45 |
| 2016-03-049:44:14 AM | 62.938 | 103.55 | 19.062 | 77.45 |
| 2016-03-049:44:18 AM | 62.938 | 103.438 | 19.062 | 77.45 |
| 2016-03-049:44:22 AM | 62.938 | 103.325 | 19.175 | 77.45 |
| 2016-03-049:44:26 AM | 62.938 | 103.325 | 19.175 | 77.45 |
| 2016-03-049:44:30 AM | 62.938 | 103.212 | 19.062 | 77.45 |
| 2016-03-049:44:34 AM | 63.05 | 103.1 | 19.062 | 77.45 |
| 2016-03-049:44:38 AM | 62.938 | 102.988 | 19.175 | 77.45 |
| 2016-03-049:44:42 AM | 62.938 | 102.988 | 19.175 | 77.45 |
| 2016-03-049:44:46 AM | 62.938 | 102.875 | 19.062 | 77.45 |
| 2016-03-049:44:50 AM | 62.938 | 102.875 | 18.95 | 77.45 |
| 2016-03-049:44:54 AM | 62.938 | 102.762 | 18.95 | 77.45 |
| 2016-03-049:44:58 AM | 62.938 | 102.762 | 18.95 | 77.45 |
| 2016-03-049:45:02 AM | 62.938 | 102.762 | 18.95 | 77.45 |
| 2016-03-049:45:06 AM | 62.938 | 102.762 | 18.95 | 77.45 |
| 2016-03-049:45:10 AM | 62.938 | 102.65 | 18.838 | 77.45 |
| 2016-03-049:45:14 AM | 62.938 | 102.65 | 18.725 | 77.45 |
| 2016-03-049:45:18 AM | 62.938 | 102.65 | 18.725 | 77.45 |
| 2016-03-049:45:22 AM | 62.938 | 102.65 | 18.612 | 77.45 |
| 2016-03-049:45:26 AM | 62.938 | 102.65 | 18.725 | 77.45 |
| 2016-03-049:45:31 AM | 62.938 | 102.65 | 18.725 | 77.45 |
| 2016-03-049:45:35 AM | 62.938 | 102.65 | 18.725 | 77.45 |
| 2016-03-049:45:39 AM | 62.938 | 102.65 | 18.838 | 77.45 |
| 2016-03-049:45:43 AM | 62.938 | 102.65 | 18.725 | 77.45 |
| 2016-03-049:45:47 AM | 62.938 | 102.762 | 18.725 | 77.45 |
| 2016-03-049:45:51 AM | 62.938 | 102.762 | 18.612 | 77.45 |
| 2016-03-049:45:55 AM | 62.938 | 102.762 | 18.5 | 77.45 |
| 2016-03-049:45:59 AM | 62.938 | 102.762 | 18.5 | 77.45 |
| 2016-03-049:46:03 AM | 62.938 | 102.762 | 18.388 | 77.45 |
| 2016-03-049:46:07 AM | 62.938 | 102.762 | 18.388 | 77.45 |
| 2016-03-049:46:11 AM | 62.938 | 102.875 | 18.275 | 77.45 |
| 2016-03-049:46:15 AM | 62.938 | 102.875 | 18.388 | 77.45 |
| 2016-03-049:46:19 AM | 62.938 | 102.875 | 18.388 | 77.45 |
| 2016-03-049:46:23 AM | 63.05 | 102.988 | 18.5 | 77.45 |
| 2016-03-049:46:27 AM | 62.938 | 102.988 | 18.5 | 77.45 |
| 2016-03-049:46:31 AM | 62.938 | 102.988 | 18.5 | 77.45 |
| 2016-03-049:46:35 AM | 62.938 | 103.1 | 18.5 | 77.45 |
| 2016-03-049:46:39 AM | 62.938 | 103.1 | 18.388 | 77.45 |
| 2016-03-049:46:43 AM | 62.938 | 103.1 | 18.5 | 77.45 |
| 2016-03-049:46:47 AM | 62.938 | 103.1 | 18.5 | 77.45 |
| 2016-03-049:46:51 AM | 62.938 | 102.988 | 18.5 | 77.45 |
| 2016-03-049:46:55 AM | 62.938 | 103.1 | 18.275 | 77.45 |
| 2016-03-049:46:59 AM | 62.938 | 103.1 | 18.162 | 77.45 |
| 2016-03-049:47:03 AM | 62.938 | 102.988 | 18.162 | 77.45 |
| 2016-03-049:47:07 AM | 62.825 | 102.988 | 18.162 | 77.45 |
| 2016-03-049:47:11 AM | 62.938 | 102.988 | 18.275 | 77.562 |
| 2016-03-049:47:15 AM | 62.938 | 102.988 | 18.275 | 77.45 |
| 2016-03-049:47:19 AM | 62.825 | 102.988 | 18.275 | 77.45 |
| 2016-03-049:47:23 AM | 62.825 | 102.988 | 18.388 | 77.45 |
| 2016-03-049:47:27 AM | 62.825 | 102.988 | 18.388 | 77.45 |
| 2016-03-049:47:31 AM | 62.825 | 102.988 | 18.388 | 77.562 |
| 2016-03-049:47:35 AM | 62.938 | 102.988 | 18.388 | 77.562 |
| 2016-03-049:47:39 AM | 62.825 | 102.988 | 18.388 | 77.45 |
| 2016-03-049:47:43 AM | 62.938 | 102.875 | 18.388 | 77.45 |
| 2016-03-049:47:47 AM | 62.825 | 102.875 | 18.388 | 77.45 |
| 2016-03-049:47:51 AM | 62.825 | 102.875 | 18.388 | 77.45 |
| 2016-03-049:47:55 AM | 62.825 | 102.875 | 18.388 | 77.562 |
| 2016-03-049:47:59 AM | 62.825 | 102.875 | 18.388 | 77.562 |
| 2016-03-049:48:04 AM | 62.825 | 102.762 | 18.5 | 77.562 |
| 2016-03-049:48:08 AM | 62.825 | 102.762 | 18.5 | 77.562 |
| 2016-03-049:48:12 AM | 62.825 | 102.65 | 18.5 | 77.562 |
| 2016-03-049:48:16 AM | 62.825 | 102.65 | 18.612 | 77.562 |
| 2016-03-049:48:20 AM | 62.825 | 102.65 | 18.612 | 77.562 |
| 2016-03-049:48:24 AM | 62.825 | 102.65 | 18.612 | 77.562 |
| 2016-03-049:48:28 AM | 62.825 | 102.538 | 18.725 | 77.562 |
| 2016-03-049:48:32 AM | 62.825 | 102.65 | 18.725 | 77.562 |
| 2016-03-049:48:36 AM | 62.825 | 102.538 | 18.725 | 77.562 |
| 2016-03-049:48:40 AM | 62.825 | 102.538 | 18.725 | 77.562 |
| 2016-03-049:48:44 AM | 62.825 | 102.538 | 18.725 | 77.562 |
| 2016-03-049:48:48 AM | 62.712 | 102.538 | 18.612 | 77.562 |
| 2016-03-049:48:52 AM | 62.825 | 102.538 | 18.5 | 77.562 |
| 2016-03-049:48:56 AM | 62.712 | 102.538 | 18.5 | 77.562 |
| 2016-03-049:49:00 AM | 62.712 | 102.425 | 18.388 | 77.562 |
| 2016-03-049:49:04 AM | 62.712 | 102.425 | 18.275 | 77.562 |
| 2016-03-049:49:08 AM | 62.712 | 102.425 | 18.162 | 77.562 |
| 2016-03-049:49:12 AM | 62.712 | 102.425 | 17.938 | 77.562 |
| 2016-03-049:49:16 AM | 62.712 | 102.425 | 17.825 | 77.562 |
| 2016-03-049:49:20 AM | 62.712 | 102.425 | 17.712 | 77.562 |
| 2016-03-049:49:24 AM | 62.712 | 102.312 | 17.712 | 77.562 |
| 2016-03-049:49:28 AM | 62.712 | 102.312 | 17.6 | 77.562 |
| 2016-03-049:49:32 AM | 62.712 | 102.312 | 17.6 | 77.562 |
| 2016-03-049:49:36 AM | 62.712 | 102.312 | 17.6 | 77.562 |
| 2016-03-049:49:40 AM | 62.712 | 102.312 | 17.6 | 77.562 |
| 2016-03-049:49:44 AM | 62.712 | 102.312 | 17.712 | 77.562 |
| 2016-03-049:49:48 AM | 62.712 | 102.312 | 17.712 | 77.562 |
| 2016-03-049:49:52 AM | 62.712 | 102.312 | 17.825 | 77.562 |
| 2016-03-049:49:56 AM | 62.712 | 102.2 | 17.825 | 77.562 |
| 2016-03-049:50:00 AM | 62.6 | 102.312 | 17.938 | 77.562 |
| 2016-03-049:50:04 AM | 62.712 | 102.312 | 18.05 | 77.562 |
| 2016-03-049:50:08 AM | 62.6 | 102.312 | 18.05 | 77.562 |
| 2016-03-049:50:12 AM | 62.6 | 102.312 | 18.162 | 77.562 |
| 2016-03-049:50:16 AM | 62.6 | 102.312 | 18.162 | 77.562 |
| 2016-03-049:50:20 AM | 62.6 | 102.312 | 18.05 | 77.675 |
| 2016-03-049:50:24 AM | 62.488 | 102.312 | 18.162 | 77.562 |
| 2016-03-049:50:29 AM | 62.488 | 102.312 | 18.05 | 77.562 |
| 2016-03-049:50:33 AM | 62.6 | 102.312 | 18.05 | 77.562 |
| 2016-03-049:50:37 AM | 62.488 | 102.312 | 18.05 | 77.562 |
| 2016-03-049:50:41 AM | 62.488 | 102.312 | 18.162 | 77.562 |
| 2016-03-049:50:45 AM | 62.488 | 102.312 | 18.162 | 77.562 |
| 2016-03-049:50:49 AM | 62.6 | 102.312 | 18.162 | 77.562 |
| 2016-03-049:50:53 AM | 62.488 | 102.312 | 18.275 | 77.562 |
| 2016-03-049:50:57 AM | 62.488 | 102.312 | 18.388 | 77.562 |
| 2016-03-049:51:01 AM | 62.488 | 102.312 | 18.388 | 77.562 |
| 2016-03-049:51:05 AM | 62.488 | 102.312 | 18.5 | 77.562 |
| 2016-03-049:51:09 AM | 62.488 | 102.312 | 18.612 | 77.562 |
| 2016-03-049:51:13 AM | 62.6 | 102.312 | 18.725 | 77.562 |
| 2016-03-049:51:17 AM | 62.488 | 102.312 | 18.725 | 77.562 |
| 2016-03-049:51:21 AM | 62.6 | 102.312 | 18.838 | 77.562 |
| 2016-03-049:51:25 AM | 62.6 | 102.312 | 18.725 | 77.562 |
| 2016-03-049:51:29 AM | 62.6 | 102.312 | 18.612 | 77.562 |
| 2016-03-049:51:33 AM | 62.6 | 102.425 | 18.5 | 77.562 |
| 2016-03-049:51:37 AM | 62.6 | 102.312 | 18.612 | 77.562 |
| 2016-03-049:51:41 AM | 62.6 | 102.425 | 18.612 | 77.562 |
| 2016-03-049:51:45 AM | 62.6 | 102.425 | 18.725 | 77.562 |
| 2016-03-049:51:49 AM | 62.6 | 102.425 | 18.838 | 77.562 |
| 2016-03-049:51:53 AM | 62.712 | 102.538 | 18.838 | 77.562 |
| 2016-03-049:51:57 AM | 62.6 | 102.538 | 18.95 | 77.45 |
| 2016-03-049:52:01 AM | 62.712 | 102.538 | 18.95 | 77.45 |
| 2016-03-049:52:05 AM | 62.712 | 102.425 | 18.725 | 77.45 |
| 2016-03-049:52:09 AM | 62.712 | 102.538 | 18.725 | 77.562 |
| 2016-03-049:52:13 AM | 62.712 | 102.538 | 18.612 | 77.562 |
| 2016-03-049:52:17 AM | 62.712 | 102.538 | 18.725 | 77.562 |
| 2016-03-049:52:21 AM | 62.712 | 102.538 | 18.612 | 77.45 |
| 2016-03-049:52:25 AM | 62.825 | 102.538 | 18.612 | 77.45 |
| 2016-03-049:52:29 AM | 62.712 | 102.65 | 18.612 | 77.562 |
| 2016-03-049:52:33 AM | 62.825 | 102.65 | 18.612 | 77.45 |
| 2016-03-049:52:37 AM | 62.825 | 102.65 | 18.612 | 77.562 |
| 2016-03-049:52:41 AM | 62.825 | 102.65 | 18.612 | 77.562 |
| 2016-03-049:52:46 AM | 62.825 | 102.65 | 18.612 | 77.562 |
| 2016-03-049:52:50 AM | 62.825 | 102.762 | 18.612 | 77.562 |
| 2016-03-049:52:54 AM | 62.938 | 102.875 | 18.725 | 77.562 |
| 2016-03-049:52:58 AM | 62.938 | 102.875 | 18.612 | 77.562 |
| 2016-03-049:53:02 AM | 62.825 | 102.875 | 18.612 | 77.562 |
| 2016-03-049:53:06 AM | 62.938 | 102.875 | 18.612 | 77.562 |
| 2016-03-049:53:10 AM | 62.938 | 102.875 | 18.612 | 77.562 |
| 2016-03-049:53:14 AM | 62.938 | 102.988 | 18.725 | 77.562 |
| 2016-03-049:53:18 AM | 62.938 | 102.988 | 18.725 | 77.562 |
| 2016-03-049:53:22 AM | 62.938 | 102.988 | 18.95 | 77.562 |
| 2016-03-049:53:26 AM | 62.938 | 103.1 | 18.95 | 77.562 |
| 2016-03-049:53:30 AM | 62.938 | 103.1 | 19.062 | 77.562 |
| 2016-03-049:53:34 AM | 63.05 | 103.1 | 19.175 | 77.562 |
| 2016-03-049:53:38 AM | 63.05 | 103.1 | 19.288 | 77.562 |
| 2016-03-049:53:42 AM | 63.05 | 103.212 | 19.4 | 77.562 |
| 2016-03-049:53:46 AM | 63.05 | 103.212 | 19.512 | 77.562 |
| 2016-03-049:53:50 AM | 63.05 | 103.212 | 19.512 | 77.562 |
| 2016-03-049:53:54 AM | 63.05 | 103.325 | 19.625 | 77.562 |
| 2016-03-049:53:58 AM | 63.05 | 103.325 | 19.625 | 77.562 |
| 2016-03-049:54:02 AM | 63.05 | 103.438 | 19.512 | 77.562 |
| 2016-03-049:54:06 AM | 63.05 | 103.438 | 19.512 | 77.562 |
| 2016-03-049:54:10 AM | 63.05 | 103.55 | 19.4 | 77.562 |
| 2016-03-049:54:14 AM | 63.162 | 103.55 | 19.288 | 77.562 |
| 2016-03-049:54:18 AM | 63.05 | 103.55 | 19.175 | 77.562 |
| 2016-03-049:54:22 AM | 63.05 | 103.55 | 18.95 | 77.562 |
| 2016-03-049:54:26 AM | 63.05 | 103.55 | 18.838 | 77.562 |
| 2016-03-049:54:30 AM | 63.05 | 103.55 | 18.838 | 77.562 |
| 2016-03-049:54:34 AM | 63.05 | 103.663 | 18.612 | 77.562 |
| 2016-03-049:54:38 AM | 63.05 | 103.663 | 18.612 | 77.562 |
| 2016-03-049:54:42 AM | 63.05 | 103.663 | 18.612 | 77.562 |
| 2016-03-049:54:46 AM | 63.05 | 103.775 | 18.612 | 77.562 |
| 2016-03-049:54:50 AM | 63.05 | 103.663 | 18.5 | 77.562 |
| 2016-03-049:54:54 AM | 63.162 | 103.775 | 18.5 | 77.562 |
| 2016-03-049:54:58 AM | 63.05 | 103.663 | 18.612 | 77.562 |
| 2016-03-049:55:02 AM | 63.05 | 103.775 | 18.5 | 77.562 |
| 2016-03-049:55:07 AM | 63.05 | 103.775 | 18.388 | 77.562 |
| 2016-03-049:55:11 AM | 63.162 | 103.775 | 18.388 | 77.562 |
| 2016-03-049:55:15 AM | 63.05 | 103.888 | 18.275 | 77.562 |
| 2016-03-049:55:19 AM | 63.05 | 103.775 | 18.162 | 77.562 |
| 2016-03-049:55:23 AM | 63.05 | 103.888 | 17.938 | 77.675 |
| 2016-03-049:55:27 AM | 63.05 | 103.888 | 17.938 | 77.562 |
| 2016-03-049:55:31 AM | 63.05 | 103.888 | 17.825 | 77.562 |
| 2016-03-049:55:35 AM | 63.05 | 104 | 17.712 | 77.675 |
| 2016-03-049:55:39 AM | 63.05 | 104 | 17.712 | 77.675 |
| 2016-03-049:55:43 AM | 62.938 | 104 | 17.825 | 77.675 |
| 2016-03-049:55:47 AM | 62.938 | 104 | 17.938 | 77.675 |
| 2016-03-049:55:51 AM | 62.938 | 104.112 | 18.05 | 77.562 |
| 2016-03-049:55:55 AM | 62.938 | 104.112 | 18.162 | 77.562 |
| 2016-03-049:55:59 AM | 62.938 | 104.112 | 18.162 | 77.562 |
| 2016-03-049:56:03 AM | 62.938 | 104.225 | 18.275 | 77.562 |
| 2016-03-049:56:07 AM | 62.938 | 104.338 | 18.275 | 77.562 |
| 2016-03-049:56:11 AM | 62.938 | 104.338 | 18.275 | 77.675 |
| 2016-03-049:56:15 AM | 62.938 | 104.338 | 18.275 | 77.562 |
| 2016-03-049:56:19 AM | 62.938 | 104.45 | 18.275 | 77.675 |
| 2016-03-049:56:23 AM | 62.938 | 104.562 | 18.275 | 77.675 |
| 2016-03-049:56:27 AM | 62.938 | 104.562 | 18.388 | 77.675 |
| 2016-03-049:56:31 AM | 62.938 | 104.675 | 18.388 | 77.562 |
| 2016-03-049:56:35 AM | 62.938 | 104.788 | 18.388 | 77.675 |
| 2016-03-049:56:39 AM | 62.938 | 104.788 | 18.5 | 77.675 |
| 2016-03-049:56:43 AM | 62.938 | 104.788 | 18.612 | 77.675 |
| 2016-03-049:56:47 AM | 63.05 | 104.9 | 18.5 | 77.675 |
| 2016-03-049:56:51 AM | 63.05 | 105.012 | 18.612 | 77.675 |
| 2016-03-049:56:55 AM | 63.05 | 105.012 | 18.612 | 77.675 |
| 2016-03-049:56:59 AM | 62.938 | 105.125 | 18.725 | 77.675 |
| 2016-03-049:57:03 AM | 63.05 | 105.125 | 18.725 | 77.675 |
| 2016-03-049:57:08 AM | 63.05 | 105.238 | 18.725 | 77.675 |
| 2016-03-049:57:12 AM | 63.05 | 105.238 | 18.838 | 77.675 |
| 2016-03-049:57:16 AM | 63.05 | 105.462 | 18.838 | 77.675 |
| 2016-03-049:57:20 AM | 63.05 | 105.462 | 18.95 | 77.675 |
| 2016-03-049:57:24 AM | 63.162 | 105.462 | 19.062 | 77.675 |
| 2016-03-049:57:28 AM | 63.162 | 105.575 | 19.062 | 77.675 |
| 2016-03-049:57:32 AM | 63.162 | 105.575 | 19.175 | 77.675 |
| 2016-03-049:57:36 AM | 63.162 | 105.575 | 19.175 | 77.675 |
| 2016-03-049:57:40 AM | 63.162 | 105.688 | 19.175 | 77.675 |
| 2016-03-049:57:44 AM | 63.162 | 105.8 | 19.062 | 77.675 |
| 2016-03-049:57:48 AM | 63.275 | 105.8 | 19.175 | 77.675 |
| 2016-03-049:57:52 AM | 63.275 | 105.8 | 19.062 | 77.675 |
| 2016-03-049:57:56 AM | 63.275 | 105.913 | 19.062 | 77.675 |
| 2016-03-049:58:00 AM | 63.275 | 105.913 | 19.062 | 77.675 |
| 2016-03-049:58:04 AM | 63.275 | 105.913 | 18.838 | 77.675 |
| 2016-03-049:58:08 AM | 63.275 | 105.913 | 18.612 | 77.675 |
| 2016-03-049:58:12 AM | 63.275 | 105.913 | 18.388 | 77.675 |
| 2016-03-049:58:16 AM | 63.275 | 106.025 | 18.275 | 77.675 |
| 2016-03-049:58:20 AM | 63.388 | 106.025 | 18.388 | 77.675 |
| 2016-03-049:58:24 AM | 63.388 | 106.025 | 18.388 | 77.675 |
| 2016-03-049:58:28 AM | 63.388 | 106.025 | 18.388 | 77.675 |
| 2016-03-049:58:32 AM | 63.388 | 106.138 | 18.388 | 77.675 |
| 2016-03-049:58:36 AM | 63.388 | 106.138 | 18.5 | 77.675 |
| 2016-03-049:58:40 AM | 63.388 | 106.138 | 18.612 | 77.675 |
| 2016-03-049:58:44 AM | 63.5 | 106.138 | 18.612 | 77.675 |
| 2016-03-049:58:48 AM | 63.5 | 106.138 | 18.5 | 77.675 |
| 2016-03-049:58:52 AM | 63.5 | 106.138 | 18.5 | 77.675 |
| 2016-03-049:58:56 AM | 63.5 | 106.25 | 18.5 | 77.675 |
| 2016-03-049:59:00 AM | 63.613 | 106.25 | 18.612 | 77.675 |
| 2016-03-049:59:04 AM | 63.613 | 106.362 | 18.725 | 77.675 |
| 2016-03-049:59:08 AM | 63.613 | 106.25 | 18.838 | 77.675 |
| 2016-03-049:59:12 AM | 63.613 | 106.362 | 18.725 | 77.675 |
| 2016-03-049:59:16 AM | 63.725 | 106.475 | 18.838 | 77.675 |
| 2016-03-049:59:20 AM | 63.725 | 106.475 | 18.95 | 77.675 |
| 2016-03-049:59:24 AM | 63.725 | 106.475 | 19.062 | 77.675 |
| 2016-03-049:59:28 AM | 63.725 | 106.588 | 19.175 | 77.675 |
| 2016-03-049:59:32 AM | 63.838 | 106.588 | 19.175 | 77.675 |
| 2016-03-049:59:37 AM | 63.838 | 106.7 | 19.062 | 77.675 |
| 2016-03-049:59:41 AM | 63.838 | 106.7 | 18.95 | 77.675 |
| 2016-03-049:59:45 AM | 63.838 | 106.812 | 18.725 | 77.562 |
| 2016-03-049:59:49 AM | 63.838 | 106.7 | 18.612 | 77.675 |
| 2016-03-049:59:53 AM | 63.838 | 106.812 | 18.612 | 77.675 |
| 2016-03-049:59:57 AM | 63.95 | 106.925 | 18.612 | 77.675 |
| 2016-03-0410:00:01 AM | 63.95 | 106.925 | 18.612 | 77.675 |
| 2016-03-0410:00:05 AM | 63.95 | 106.925 | 18.725 | 77.675 |
| 2016-03-0410:00:09 AM | 63.95 | 107.038 | 18.725 | 77.675 |
| 2016-03-0410:00:13 AM | 63.95 | 107.038 | 18.838 | 77.675 |
| 2016-03-0410:00:17 AM | 64.062 | 107.038 | 18.95 | 77.675 |
| 2016-03-0410:00:21 AM | 64.062 | 107.15 | 18.95 | 77.675 |
| 2016-03-0410:00:25 AM | 64.062 | 107.15 | 19.062 | 77.675 |
| 2016-03-0410:00:29 AM | 64.062 | 107.262 | 19.062 | 77.675 |
| 2016-03-0410:00:33 AM | 64.062 | 107.262 | 19.062 | 77.675 |
| 2016-03-0410:00:37 AM | 64.175 | 107.375 | 19.175 | 77.675 |
| 2016-03-0410:00:41 AM | 64.062 | 107.375 | 19.288 | 77.675 |
| 2016-03-0410:00:45 AM | 64.175 | 107.375 | 19.175 | 77.675 |
| 2016-03-0410:00:49 AM | 64.175 | 107.488 | 19.288 | 77.675 |
| 2016-03-0410:00:53 AM | 64.175 | 107.6 | 19.288 | 77.675 |
| 2016-03-0410:00:57 AM | 64.175 | 107.6 | 19.4 | 77.675 |
| 2016-03-0410:01:01 AM | 64.175 | 107.712 | 19.4 | 77.675 |
| 2016-03-0410:01:05 AM | 64.175 | 107.825 | 19.4 | 77.675 |
| 2016-03-0410:01:09 AM | 64.175 | 107.825 | 19.4 | 77.675 |
| 2016-03-0410:01:13 AM | 64.175 | 107.825 | 19.512 | 77.675 |
| 2016-03-0410:01:17 AM | 64.175 | 107.938 | 19.512 | 77.788 |
| 2016-03-0410:01:21 AM | 64.175 | 108.05 | 19.625 | 77.675 |
| 2016-03-0410:01:25 AM | 64.287 | 108.163 | 19.625 | 77.675 |
| 2016-03-0410:01:29 AM | 64.175 | 108.163 | 19.738 | 77.675 |
| 2016-03-0410:01:33 AM | 64.287 | 108.388 | 19.85 | 77.675 |
| 2016-03-0410:01:37 AM | 64.287 | 108.388 | 20.075 | 77.675 |
| 2016-03-0410:01:41 AM | 64.287 | 108.5 | 20.188 | 77.788 |
| 2016-03-0410:01:45 AM | 64.287 | 108.612 | 20.188 | 77.788 |
| 2016-03-0410:01:49 AM | 64.287 | 108.838 | 20.188 | 77.788 |
| 2016-03-0410:01:53 AM | 64.287 | 108.95 | 20.3 | 77.675 |
| 2016-03-0410:01:57 AM | 64.287 | 109.062 | 20.3 | 77.788 |
| 2016-03-0410:02:01 AM | 64.287 | 109.175 | 20.412 | 77.788 |
| 2016-03-0410:02:06 AM | 64.287 | 109.288 | 20.525 | 77.788 |
| 2016-03-0410:02:10 AM | 64.287 | 109.4 | 20.638 | 77.788 |
| 2016-03-0410:02:14 AM | 64.287 | 109.512 | 20.638 | 77.788 |
| 2016-03-0410:02:18 AM | 64.287 | 109.625 | 20.75 | 77.788 |
| 2016-03-0410:02:22 AM | 64.287 | 109.85 | 20.862 | 77.788 |
| 2016-03-0410:02:26 AM | 64.287 | 109.85 | 20.862 | 77.788 |
| 2016-03-0410:02:30 AM | 64.287 | 110.075 | 20.638 | 77.675 |
| 2016-03-0410:02:34 AM | 64.287 | 110.188 | 20.525 | 77.788 |
| 2016-03-0410:02:38 AM | 64.287 | 110.3 | 20.525 | 77.675 |
| 2016-03-0410:02:42 AM | 64.287 | 110.413 | 20.525 | 77.788 |
| 2016-03-0410:02:46 AM | 64.287 | 110.413 | 20.525 | 77.788 |
| 2016-03-0410:02:50 AM | 64.287 | 110.638 | 20.638 | 77.788 |
| 2016-03-0410:02:54 AM | 64.287 | 110.638 | 20.75 | 77.788 |
| 2016-03-0410:02:58 AM | 64.287 | 110.75 | 20.75 | 77.675 |
| 2016-03-0410:03:02 AM | 64.287 | 110.862 | 20.75 | 77.788 |
| 2016-03-0410:03:06 AM | 64.287 | 110.975 | 20.862 | 77.788 |
| 2016-03-0410:03:10 AM | 64.287 | 111.088 | 20.862 | 77.788 |
| 2016-03-0410:03:14 AM | 64.287 | 111.2 | 20.862 | 77.788 |
| 2016-03-0410:03:18 AM | 64.287 | 111.312 | 20.862 | 77.788 |
| 2016-03-0410:03:22 AM | 64.287 | 111.312 | 20.862 | 77.788 |
| 2016-03-0410:03:26 AM | 64.287 | 111.425 | 20.975 | 77.788 |
| 2016-03-0410:03:30 AM | 64.287 | 111.538 | 20.975 | 77.788 |
| 2016-03-0410:03:34 AM | 64.287 | 111.65 | 21.088 | 77.788 |
| 2016-03-0410:03:38 AM | 64.4 | 111.762 | 21.088 | 77.788 |
| 2016-03-0410:03:42 AM | 64.4 | 111.875 | 21.2 | 77.788 |
| 2016-03-0410:03:46 AM | 64.4 | 111.875 | 21.2 | 77.788 |
| 2016-03-0410:03:50 AM | 64.4 | 111.988 | 21.312 | 77.788 |
| 2016-03-0410:03:54 AM | 64.4 | 112.1 | 21.312 | 77.788 |
| 2016-03-0410:03:58 AM | 64.4 | 112.212 | 21.425 | 77.788 |
| 2016-03-0410:04:02 AM | 64.4 | 112.212 | 21.538 | 77.788 |
| 2016-03-0410:04:06 AM | 64.4 | 112.325 | 21.538 | 77.788 |
| 2016-03-0410:04:10 AM | 64.4 | 112.438 | 21.538 | 77.788 |
| 2016-03-0410:04:14 AM | 64.4 | 112.55 | 21.425 | 77.788 |
| 2016-03-0410:04:18 AM | 64.4 | 112.663 | 21.312 | 77.788 |
| 2016-03-0410:04:22 AM | 64.512 | 112.775 | 21.312 | 77.788 |
| 2016-03-0410:04:26 AM | 64.4 | 112.888 | 21.312 | 77.788 |
| 2016-03-0410:04:30 AM | 64.512 | 112.888 | 21.2 | 77.788 |
| 2016-03-0410:04:35 AM | 64.4 | 113 | 21.2 | 77.9 |
| 2016-03-0410:04:39 AM | 64.512 | 113 | 21.312 | 77.9 |
| 2016-03-0410:04:43 AM | 64.512 | 113 | 21.312 | 77.9 |
| 2016-03-0410:04:47 AM | 64.512 | 113.112 | 21.312 | 77.9 |
| 2016-03-0410:04:51 AM | 64.512 | 113.225 | 21.312 | 77.9 |
| 2016-03-0410:04:55 AM | 64.512 | 113.338 | 21.425 | 77.9 |
| 2016-03-0410:04:59 AM | 64.512 | 113.338 | 21.425 | 77.9 |
| 2016-03-0410:05:03 AM | 64.512 | 113.45 | 21.425 | 77.9 |
| 2016-03-0410:05:07 AM | 64.512 | 113.562 | 21.538 | 77.788 |
| 2016-03-0410:05:11 AM | 64.512 | 113.562 | 21.538 | 77.9 |
| 2016-03-0410:05:15 AM | 64.512 | 113.675 | 21.65 | 77.9 |
| 2016-03-0410:05:19 AM | 64.512 | 113.788 | 21.538 | 77.9 |
| 2016-03-0410:05:23 AM | 64.625 | 113.9 | 21.538 | 77.9 |
| 2016-03-0410:05:27 AM | 64.625 | 113.9 | 21.425 | 77.9 |
| 2016-03-0410:05:31 AM | 64.738 | 114.012 | 21.425 | 77.9 |
| 2016-03-0410:05:35 AM | 64.738 | 114.125 | 21.538 | 77.9 |
| 2016-03-0410:05:39 AM | 64.738 | 114.125 | 21.538 | 77.9 |
| 2016-03-0410:05:43 AM | 64.738 | 114.238 | 21.65 | 77.9 |
| 2016-03-0410:05:47 AM | 64.738 | 114.35 | 21.65 | 77.9 |
| 2016-03-0410:05:51 AM | 64.738 | 114.35 | 21.538 | 77.9 |
| 2016-03-0410:05:55 AM | 64.738 | 114.462 | 21.65 | 77.9 |
| 2016-03-0410:05:59 AM | 64.738 | 114.575 | 21.65 | 77.9 |
| 2016-03-0410:06:03 AM | 64.738 | 114.688 | 21.65 | 78.012 |
| 2016-03-0410:06:07 AM | 64.738 | 114.8 | 21.65 | 77.9 |
| 2016-03-0410:06:11 AM | 64.738 | 114.8 | 21.65 | 78.012 |
| 2016-03-0410:06:15 AM | 64.738 | 114.913 | 21.762 | 78.012 |
| 2016-03-0410:06:19 AM | 64.738 | 115.025 | 21.762 | 77.9 |
| 2016-03-0410:06:23 AM | 64.85 | 115.025 | 21.762 | 78.012 |
| 2016-03-0410:06:27 AM | 64.738 | 115.138 | 21.762 | 77.9 |
| 2016-03-0410:06:31 AM | 64.85 | 115.25 | 21.762 | 78.012 |
| 2016-03-0410:06:35 AM | 64.85 | 115.25 | 21.762 | 78.012 |
| 2016-03-0410:06:39 AM | 64.738 | 115.475 | 21.762 | 78.012 |
| 2016-03-0410:06:43 AM | 64.738 | 115.475 | 21.875 | 78.012 |
| 2016-03-0410:06:47 AM | 64.85 | 115.588 | 21.875 | 78.012 |
| 2016-03-0410:06:51 AM | 64.738 | 115.7 | 21.875 | 78.012 |
| 2016-03-0410:06:55 AM | 64.85 | 115.812 | 21.875 | 78.012 |
| 2016-03-0410:06:59 AM | 64.85 | 115.925 | 21.875 | 78.012 |
| 2016-03-0410:07:04 AM | 64.85 | 116.038 | 21.988 | 78.012 |
| 2016-03-0410:07:08 AM | 64.85 | 116.038 | 21.988 | 78.012 |
| 2016-03-0410:07:12 AM | 64.85 | 116.15 | 21.988 | 78.012 |
| 2016-03-0410:07:16 AM | 64.85 | 116.262 | 21.988 | 78.012 |
| 2016-03-0410:07:20 AM | 64.85 | 116.375 | 21.875 | 78.012 |
| 2016-03-0410:07:24 AM | 64.85 | 116.488 | 21.762 | 78.012 |
| 2016-03-0410:07:28 AM | 64.85 | 116.6 | 21.65 | 78.012 |
| 2016-03-0410:07:32 AM | 64.85 | 116.712 | 21.762 | 78.012 |
| 2016-03-0410:07:36 AM | 64.963 | 116.712 | 21.762 | 78.125 |
| 2016-03-0410:07:40 AM | 64.85 | 116.712 | 21.875 | 78.012 |
| 2016-03-0410:07:44 AM | 64.963 | 116.825 | 21.875 | 78.125 |
| 2016-03-0410:07:48 AM | 64.963 | 116.938 | 21.875 | 78.125 |
| 2016-03-0410:07:52 AM | 64.963 | 116.938 | 21.988 | 78.125 |
| 2016-03-0410:07:56 AM | 64.963 | 117.05 | 21.988 | 78.125 |
| 2016-03-0410:08:00 AM | 64.963 | 117.163 | 21.875 | 78.125 |
| 2016-03-0410:08:04 AM | 64.963 | 117.163 | 21.538 | 78.125 |
| 2016-03-0410:08:08 AM | 64.963 | 117.275 | 21.425 | 78.125 |
| 2016-03-0410:08:12 AM | 64.963 | 117.275 | 21.2 | 78.125 |
| 2016-03-0410:08:16 AM | 64.963 | 117.275 | 21.312 | 78.125 |
| 2016-03-0410:08:20 AM | 64.963 | 117.388 | 21.312 | 78.125 |
| 2016-03-0410:08:24 AM | 64.963 | 117.5 | 21.312 | 78.125 |
| 2016-03-0410:08:28 AM | 64.963 | 117.612 | 21.312 | 78.125 |
| 2016-03-0410:08:32 AM | 65.075 | 117.612 | 21.312 | 78.125 |
| 2016-03-0410:08:36 AM | 65.075 | 117.725 | 21.2 | 78.125 |
| 2016-03-0410:08:40 AM | 65.075 | 117.725 | 21.2 | 78.125 |
| 2016-03-0410:08:44 AM | 65.075 | 117.838 | 21.2 | 78.125 |
| 2016-03-0410:08:48 AM | 65.075 | 117.95 | 21.2 | 78.238 |
| 2016-03-0410:08:52 AM | 65.075 | 117.95 | 21.312 | 78.238 |
| 2016-03-0410:08:56 AM | 65.075 | 117.95 | 21.312 | 78.125 |
| 2016-03-0410:09:00 AM | 65.075 | 118.062 | 21.425 | 78.125 |
| 2016-03-0410:09:04 AM | 65.075 | 118.175 | 21.425 | 78.238 |
| 2016-03-0410:09:08 AM | 65.188 | 118.288 | 21.425 | 78.238 |
| 2016-03-0410:09:12 AM | 65.188 | 118.288 | 21.425 | 78.238 |
| 2016-03-0410:09:16 AM | 65.188 | 118.288 | 21.538 | 78.238 |
| 2016-03-0410:09:20 AM | 65.188 | 118.4 | 21.538 | 78.238 |
| 2016-03-0410:09:24 AM | 65.188 | 118.4 | 21.538 | 78.238 |
| 2016-03-0410:09:28 AM | 65.188 | 118.512 | 21.65 | 78.238 |
| 2016-03-0410:09:32 AM | 65.188 | 118.512 | 21.65 | 78.238 |
| 2016-03-0410:09:36 AM | 65.188 | 118.625 | 21.762 | 78.238 |
| 2016-03-0410:09:40 AM | 65.188 | 118.738 | 21.875 | 78.238 |
| 2016-03-0410:09:45 AM | 65.075 | 118.85 | 21.762 | 78.238 |
| 2016-03-0410:09:49 AM | 65.188 | 118.85 | 21.762 | 78.35 |
| 2016-03-0410:09:53 AM | 65.075 | 118.962 | 21.875 | 78.35 |
| 2016-03-0410:09:57 AM | 65.075 | 118.962 | 21.988 | 78.35 |
| 2016-03-0410:10:01 AM | 65.188 | 119.075 | 21.988 | 78.35 |
| 2016-03-0410:10:05 AM | 65.075 | 119.075 | 21.988 | 78.35 |
| 2016-03-0410:10:09 AM | 65.188 | 119.188 | 22.1 | 78.35 |
| 2016-03-0410:10:13 AM | 65.075 | 119.188 | 22.325 | 78.35 |
| 2016-03-0410:10:17 AM | 65.075 | 119.3 | 22.325 | 78.238 |
| 2016-03-0410:10:21 AM | 65.075 | 119.413 | 22.325 | 78.35 |
| 2016-03-0410:10:25 AM | 65.075 | 119.413 | 22.325 | 78.35 |
| 2016-03-0410:10:29 AM | 65.075 | 119.525 | 22.325 | 78.35 |
| 2016-03-0410:10:33 AM | 65.075 | 119.525 | 22.212 | 78.35 |
| 2016-03-0410:10:37 AM | 65.075 | 119.638 | 22.212 | 78.35 |
| 2016-03-0410:10:41 AM | 65.075 | 119.638 | 21.988 | 78.35 |
| 2016-03-0410:10:45 AM | 65.075 | 119.75 | 21.875 | 78.35 |
| 2016-03-0410:10:49 AM | 65.075 | 119.75 | 21.762 | 78.35 |
| 2016-03-0410:10:53 AM | 65.075 | 119.862 | 21.762 | 78.35 |
| 2016-03-0410:10:57 AM | 65.075 | 119.862 | 21.875 | 78.35 |
| 2016-03-0410:11:01 AM | 65.075 | 119.862 | 21.875 | 78.35 |
| 2016-03-0410:11:05 AM | 65.075 | 119.862 | 21.988 | 78.35 |
| 2016-03-0410:11:09 AM | 65.075 | 119.975 | 21.875 | 78.462 |
| 2016-03-0410:11:13 AM | 65.075 | 119.975 | 21.875 | 78.35 |
| 2016-03-0410:11:17 AM | 65.075 | 119.975 | 21.762 | 78.35 |
| 2016-03-0410:11:21 AM | 65.188 | 119.862 | 21.538 | 78.462 |
| 2016-03-0410:11:25 AM | 65.188 | 119.862 | 21.2 | 78.462 |
| 2016-03-0410:11:29 AM | 65.188 | 119.975 | 20.975 | 78.35 |
| 2016-03-0410:11:33 AM | 65.188 | 119.975 | 20.862 | 78.462 |
| 2016-03-0410:11:37 AM | 65.188 | 119.975 | 20.525 | 78.462 |
| 2016-03-0410:11:41 AM | 65.188 | 119.862 | 20.525 | 78.462 |
| 2016-03-0410:11:45 AM | 65.188 | 119.862 | 20.412 | 78.462 |
| 2016-03-0410:11:49 AM | 65.188 | 119.862 | 20.412 | 78.462 |
| 2016-03-0410:11:53 AM | 65.188 | 119.862 | 20.412 | 78.462 |
| 2016-03-0410:11:57 AM | 65.188 | 119.862 | 20.412 | 78.462 |
| 2016-03-0410:12:01 AM | 65.188 | 119.862 | 20.412 | 78.462 |
| 2016-03-0410:12:05 AM | 65.3 | 119.862 | 20.525 | 78.462 |
| 2016-03-0410:12:09 AM | 65.188 | 119.75 | 20.525 | 78.462 |
| 2016-03-0410:12:13 AM | 65.188 | 119.75 | 20.638 | 78.462 |
| 2016-03-0410:12:17 AM | 65.188 | 119.75 | 20.638 | 78.462 |
| 2016-03-0410:12:21 AM | 65.3 | 119.75 | 20.75 | 78.462 |
| 2016-03-0410:12:26 AM | 65.3 | 119.638 | 20.862 | 78.575 |
| 2016-03-0410:12:30 AM | 65.3 | 119.638 | 20.975 | 78.575 |
| 2016-03-0410:12:34 AM | 65.3 | 119.638 | 20.975 | 78.575 |
| 2016-03-0410:12:38 AM | 65.3 | 119.638 | 21.088 | 78.575 |
| 2016-03-0410:12:42 AM | 65.412 | 119.525 | 21.088 | 78.575 |
| 2016-03-0410:12:46 AM | 65.412 | 119.525 | 21.088 | 78.575 |
| 2016-03-0410:12:50 AM | 65.412 | 119.525 | 20.975 | 78.575 |
| 2016-03-0410:12:54 AM | 65.3 | 119.525 | 20.862 | 78.575 |
| 2016-03-0410:12:58 AM | 65.412 | 119.525 | 20.75 | 78.575 |
| 2016-03-0410:13:02 AM | 65.412 | 119.525 | 20.75 | 78.575 |
| 2016-03-0410:13:06 AM | 65.412 | 119.525 | 20.75 | 78.575 |
| 2016-03-0410:13:10 AM | 65.412 | 119.525 | 20.638 | 78.575 |
| 2016-03-0410:13:14 AM | 65.412 | 119.525 | 20.75 | 78.575 |
| 2016-03-0410:13:18 AM | 65.412 | 119.413 | 20.75 | 78.575 |
| 2016-03-0410:13:22 AM | 65.412 | 119.413 | 20.862 | 78.575 |
| 2016-03-0410:13:26 AM | 65.412 | 119.525 | 20.975 | 78.575 |
| 2016-03-0410:13:30 AM | 65.412 | 119.413 | 20.975 | 78.688 |
| 2016-03-0410:13:34 AM | 65.412 | 119.413 | 20.975 | 78.688 |
| 2016-03-0410:13:38 AM | 65.412 | 119.413 | 20.975 | 78.688 |
| 2016-03-0410:13:42 AM | 65.412 | 119.525 | 21.088 | 78.688 |
| 2016-03-0410:13:46 AM | 65.412 | 119.525 | 21.088 | 78.688 |
| 2016-03-0410:13:50 AM | 65.525 | 119.525 | 21.2 | 78.688 |
| 2016-03-0410:13:54 AM | 65.525 | 119.525 | 21.088 | 78.688 |
| 2016-03-0410:13:58 AM | 65.525 | 119.525 | 21.088 | 78.688 |
| 2016-03-0410:14:02 AM | 65.525 | 119.525 | 21.088 | 78.688 |
| 2016-03-0410:14:06 AM | 65.525 | 119.525 | 21.088 | 78.688 |
| 2016-03-0410:14:10 AM | 65.525 | 119.525 | 21.088 | 78.688 |
| 2016-03-0410:14:14 AM | 65.638 | 119.525 | 21.2 | 78.688 |
| 2016-03-0410:14:19 AM | 65.638 | 119.525 | 21.312 | 78.688 |
| 2016-03-0410:14:23 AM | 65.638 | 119.525 | 21.312 | 78.688 |
| 2016-03-0410:14:27 AM | 65.638 | 119.638 | 21.312 | 78.8 |
| 2016-03-0410:14:31 AM | 65.525 | 119.638 | 21.312 | 78.8 |
| 2016-03-0410:14:35 AM | 65.638 | 119.638 | 21.312 | 78.688 |
| 2016-03-0410:14:39 AM | 65.525 | 119.75 | 21.312 | 78.8 |
| 2016-03-0410:14:43 AM | 65.638 | 119.75 | 21.312 | 78.8 |
| 2016-03-0410:14:47 AM | 65.638 | 119.75 | 21.425 | 78.8 |
| 2016-03-0410:14:51 AM | 65.525 | 119.75 | 21.425 | 78.688 |
| 2016-03-0410:14:55 AM | 65.525 | 119.862 | 21.538 | 78.8 |
| 2016-03-0410:14:59 AM | 65.638 | 119.862 | 21.538 | 78.8 |
| 2016-03-0410:15:03 AM | 65.638 | 119.975 | 21.425 | 78.8 |
| 2016-03-0410:15:07 AM | 65.638 | 119.975 | 21.312 | 78.8 |
| 2016-03-0410:15:11 AM | 65.638 | 119.975 | 21.2 | 78.8 |
| 2016-03-0410:15:15 AM | 65.75 | 120.088 | 21.088 | 78.8 |
| 2016-03-0410:15:19 AM | 65.75 | 120.088 | 20.975 | 78.8 |
| 2016-03-0410:15:23 AM | 65.75 | 120.088 | 20.975 | 78.8 |
| 2016-03-0410:15:31 AM | 65.862 | 120.088 | 21.088 | 78.8 |
| 2016-03-0410:15:35 AM | 65.862 | 120.2 | 21.088 | 78.8 |
| 2016-03-0410:15:39 AM | 65.862 | 120.2 | 21.2 | 78.8 |
| 2016-03-0410:15:43 AM | 65.975 | 120.2 | 21.312 | 78.8 |
| 2016-03-0410:15:47 AM | 65.975 | 120.312 | 21.312 | 78.8 |
| 2016-03-0410:15:51 AM | 65.975 | 120.312 | 21.312 | 78.8 |
| 2016-03-0410:15:56 AM | 65.975 | 120.425 | 21.2 | 78.8 |
| 2016-03-0410:16:00 AM | 66.088 | 120.425 | 21.2 | 78.8 |
| 2016-03-0410:16:04 AM | 65.975 | 120.538 | 21.2 | 78.8 |
| 2016-03-0410:16:08 AM | 66.088 | 120.538 | 21.2 | 78.8 |
| 2016-03-0410:16:12 AM | 66.088 | 120.538 | 21.2 | 78.8 |
| 2016-03-0410:16:16 AM | 66.088 | 120.65 | 21.2 | 78.8 |
| 2016-03-0410:16:20 AM | 66.088 | 120.65 | 21.2 | 78.8 |
| 2016-03-0410:16:24 AM | 66.088 | 120.762 | 21.2 | 78.8 |
| 2016-03-0410:16:28 AM | 66.088 | 120.762 | 21.088 | 78.8 |
| 2016-03-0410:16:32 AM | 66.088 | 120.875 | 21.2 | 78.8 |
| 2016-03-0410:16:36 AM | 66.088 | 120.875 | 21.2 | 78.912 |
| 2016-03-0410:16:40 AM | 66.2 | 120.988 | 21.2 | 78.912 |
| 2016-03-0410:16:44 AM | 66.088 | 121.1 | 21.2 | 78.912 |
| 2016-03-0410:16:48 AM | 66.2 | 121.1 | 21.2 | 78.912 |
| 2016-03-0410:16:52 AM | 66.2 | 121.1 | 21.312 | 78.912 |
| 2016-03-0410:16:56 AM | 66.088 | 121.1 | 21.2 | 78.912 |
| 2016-03-0410:17:00 AM | 66.2 | 121.212 | 21.2 | 78.912 |
| 2016-03-0410:17:04 AM | 66.2 | 121.212 | 21.2 | 78.912 |
| 2016-03-0410:17:08 AM | 66.2 | 121.212 | 21.312 | 78.912 |
| 2016-03-0410:17:12 AM | 66.2 | 121.325 | 21.425 | 78.912 |
| 2016-03-0410:17:16 AM | 66.2 | 121.325 | 21.425 | 78.912 |
| 2016-03-0410:17:20 AM | 66.2 | 121.325 | 21.65 | 78.912 |
| 2016-03-0410:17:24 AM | 66.312 | 121.438 | 21.65 | 79.025 |
| 2016-03-0410:17:28 AM | 66.312 | 121.438 | 21.65 | 78.912 |
| 2016-03-0410:17:32 AM | 66.2 | 121.438 | 21.762 | 79.025 |
| 2016-03-0410:17:36 AM | 66.312 | 121.55 | 21.875 | 79.025 |
| 2016-03-0410:17:40 AM | 66.312 | 121.55 | 21.875 | 79.025 |
| 2016-03-0410:17:44 AM | 66.312 | 121.55 | 21.875 | 79.025 |
| 2016-03-0410:17:48 AM | 66.312 | 121.55 | 21.875 | 79.138 |
| 2016-03-0410:17:52 AM | 66.312 | 121.663 | 21.762 | 79.138 |
| 2016-03-0410:17:56 AM | 66.312 | 121.663 | 21.875 | 79.025 |
| 2016-03-0410:18:00 AM | 66.312 | 121.663 | 21.988 | 79.138 |
| 2016-03-0410:18:04 AM | 66.312 | 121.775 | 21.875 | 79.138 |
| 2016-03-0410:18:08 AM | 66.312 | 121.775 | 21.762 | 79.138 |
| 2016-03-0410:18:12 AM | 66.312 | 121.775 | 21.65 | 79.138 |
| 2016-03-0410:18:16 AM | 66.312 | 121.888 | 21.65 | 79.138 |
| 2016-03-0410:18:21 AM | 66.312 | 122 | 21.538 | 79.138 |
| 2016-03-0410:18:25 AM | 66.312 | 122 | 21.538 | 79.138 |
| 2016-03-0410:18:29 AM | 66.312 | 122 | 21.538 | 79.138 |
| 2016-03-0410:18:33 AM | 66.425 | 122 | 21.538 | 79.138 |
| 2016-03-0410:18:37 AM | 66.312 | 122.112 | 21.538 | 79.25 |
| 2016-03-0410:18:41 AM | 66.425 | 122.225 | 21.65 | 79.25 |
| 2016-03-0410:18:45 AM | 66.425 | 122.225 | 21.762 | 79.25 |
| 2016-03-0410:18:49 AM | 66.425 | 122.338 | 21.762 | 79.25 |
| 2016-03-0410:18:53 AM | 66.425 | 122.338 | 21.875 | 79.25 |
| 2016-03-0410:18:57 AM | 66.425 | 122.45 | 21.988 | 79.25 |
| 2016-03-0410:19:01 AM | 66.425 | 122.45 | 22.1 | 79.25 |
| 2016-03-0410:19:05 AM | 66.425 | 122.562 | 22.212 | 79.362 |
| 2016-03-0410:19:09 AM | 66.425 | 122.562 | 22.212 | 79.25 |
| 2016-03-0410:19:13 AM | 66.312 | 122.675 | 22.212 | 79.25 |
| 2016-03-0410:19:17 AM | 66.425 | 122.675 | 22.325 | 79.25 |
| 2016-03-0410:19:21 AM | 66.425 | 122.788 | 22.212 | 79.25 |
| 2016-03-0410:19:25 AM | 66.425 | 122.788 | 22.212 | 79.25 |
| 2016-03-0410:19:29 AM | 66.425 | 122.9 | 22.212 | 79.25 |
| 2016-03-0410:19:33 AM | 66.312 | 123.012 | 22.212 | 79.362 |
| 2016-03-0410:19:37 AM | 66.425 | 123.012 | 22.212 | 79.25 |
| 2016-03-0410:19:41 AM | 66.425 | 123.125 | 22.1 | 79.25 |
| 2016-03-0410:19:45 AM | 66.425 | 123.238 | 22.1 | 79.362 |
| 2016-03-0410:19:49 AM | 66.425 | 123.35 | 22.1 | 79.362 |
| 2016-03-0410:19:53 AM | 66.425 | 123.35 | 21.988 | 79.362 |
| 2016-03-0410:19:57 AM | 66.425 | 123.462 | 21.875 | 79.362 |
| 2016-03-0410:20:01 AM | 66.425 | 123.575 | 21.65 | 79.25 |
| 2016-03-0410:20:05 AM | 66.425 | 123.575 | 21.65 | 79.362 |
| 2016-03-0410:20:09 AM | 66.312 | 123.575 | 21.538 | 79.362 |
| 2016-03-0410:20:13 AM | 66.425 | 123.688 | 21.538 | 79.362 |
| 2016-03-0410:20:17 AM | 66.312 | 123.8 | 21.425 | 79.362 |
| 2016-03-0410:20:21 AM | 66.312 | 123.8 | 21.312 | 79.362 |
| 2016-03-0410:20:25 AM | 66.312 | 123.913 | 21.2 | 79.362 |
| 2016-03-0410:20:29 AM | 66.312 | 123.913 | 21.088 | 79.362 |
| 2016-03-0410:20:33 AM | 66.312 | 123.913 | 20.975 | 79.475 |
| 2016-03-0410:20:38 AM | 66.312 | 124.025 | 20.862 | 79.475 |
| 2016-03-0410:20:42 AM | 66.312 | 124.025 | 20.862 | 79.475 |
| 2016-03-0410:20:46 AM | 66.312 | 124.138 | 20.862 | 79.475 |
| 2016-03-0410:20:50 AM | 66.425 | 124.25 | 20.975 | 79.475 |
| 2016-03-0410:20:54 AM | 66.425 | 124.138 | 21.088 | 79.475 |
| 2016-03-0410:20:58 AM | 66.425 | 124.25 | 21.2 | 79.475 |
| 2016-03-0410:21:02 AM | 66.425 | 124.25 | 21.312 | 79.475 |
| 2016-03-0410:21:06 AM | 66.425 | 124.362 | 21.312 | 79.475 |
| 2016-03-0410:21:09 AM | 66.425 | 124.362 | 21.425 | 79.588 |
| 2016-03-0410:21:13 AM | 66.425 | 124.362 | 21.538 | 79.588 |
| 2016-03-0410:21:17 AM | 66.425 | 124.475 | 21.538 | 79.588 |
| 2016-03-0410:21:21 AM | 66.425 | 124.475 | 21.65 | 79.475 |
| 2016-03-0410:21:25 AM | 66.425 | 124.475 | 21.762 | 79.475 |
| 2016-03-0410:21:29 AM | 66.425 | 124.475 | 21.65 | 79.475 |
| 2016-03-0410:21:33 AM | 66.425 | 124.588 | 21.65 | 79.475 |
| 2016-03-0410:21:37 AM | 66.425 | 124.588 | 21.538 | 79.475 |
| 2016-03-0410:21:41 AM | 66.312 | 124.7 | 21.65 | 79.475 |
| 2016-03-0410:21:45 AM | 66.312 | 124.812 | 21.762 | 79.475 |
| 2016-03-0410:21:49 AM | 66.312 | 124.812 | 21.875 | 79.588 |
| 2016-03-0410:21:53 AM | 66.312 | 124.812 | 21.988 | 79.588 |
| 2016-03-0410:21:57 AM | 66.312 | 124.925 | 21.988 | 79.588 |
| 2016-03-0410:22:02 AM | 66.312 | 124.925 | 21.988 | 79.588 |
| 2016-03-0410:22:06 AM | 66.312 | 125.038 | 21.988 | 79.588 |
| 2016-03-0410:22:10 AM | 66.312 | 125.038 | 21.988 | 79.7 |
| 2016-03-0410:22:14 AM | 66.312 | 125.15 | 21.988 | 79.7 |
| 2016-03-0410:22:18 AM | 66.312 | 125.262 | 21.988 | 79.7 |
| 2016-03-0410:22:22 AM | 66.312 | 125.262 | 21.988 | 79.7 |
| 2016-03-0410:22:26 AM | 66.312 | 125.375 | 22.1 | 79.7 |
| 2016-03-0410:22:30 AM | 66.312 | 125.375 | 22.1 | 79.7 |
| 2016-03-0410:22:34 AM | 66.312 | 125.488 | 22.212 | 79.812 |
| 2016-03-0410:22:38 AM | 66.312 | 125.488 | 22.325 | 79.812 |
| 2016-03-0410:22:42 AM | 66.312 | 125.488 | 22.325 | 79.812 |
| 2016-03-0410:22:46 AM | 66.312 | 125.488 | 22.438 | 79.812 |
| 2016-03-0410:22:50 AM | 66.312 | 125.488 | 22.438 | 79.812 |
| 2016-03-0410:22:54 AM | 66.312 | 125.6 | 22.55 | 79.812 |
| 2016-03-0410:22:58 AM | 66.312 | 125.6 | 22.55 | 79.812 |
| 2016-03-0410:23:02 AM | 66.312 | 125.6 | 22.662 | 79.812 |
| 2016-03-0410:23:06 AM | 66.312 | 125.712 | 22.662 | 79.925 |
| 2016-03-0410:23:10 AM | 66.312 | 125.712 | 22.775 | 79.925 |
| 2016-03-0410:23:14 AM | 66.425 | 125.712 | 22.662 | 79.925 |
| 2016-03-0410:23:18 AM | 66.425 | 125.712 | 22.662 | 79.925 |
| 2016-03-0410:23:22 AM | 66.312 | 125.712 | 22.662 | 79.925 |
| 2016-03-0410:23:26 AM | 66.425 | 125.712 | 22.55 | 79.925 |
| 2016-03-0410:23:30 AM | 66.425 | 125.825 | 22.662 | 79.925 |
| 2016-03-0410:23:34 AM | 66.425 | 125.825 | 22.662 | 79.925 |
| 2016-03-0410:23:38 AM | 66.425 | 125.825 | 22.662 | 79.925 |
| 2016-03-0410:23:42 AM | 66.425 | 125.938 | 22.662 | 79.812 |
| 2016-03-0410:23:46 AM | 66.425 | 125.938 | 22.662 | 79.925 |
| 2016-03-0410:23:50 AM | 66.425 | 125.938 | 22.775 | 79.925 |
| 2016-03-0410:23:54 AM | 66.425 | 125.938 | 22.775 | 79.925 |
| 2016-03-0410:23:58 AM | 66.538 | 126.05 | 22.775 | 79.925 |
| 2016-03-0410:24:02 AM | 66.538 | 126.05 | 22.775 | 79.925 |
| 2016-03-0410:24:06 AM | 66.538 | 126.163 | 22.662 | 79.925 |
| 2016-03-0410:24:10 AM | 66.425 | 126.163 | 22.662 | 79.925 |
| 2016-03-0410:24:14 AM | 66.538 | 126.275 | 22.775 | 79.925 |
| 2016-03-0410:24:18 AM | 66.538 | 126.275 | 22.775 | 79.925 |
| 2016-03-0410:24:23 AM | 66.538 | 126.388 | 22.662 | 79.812 |
| 2016-03-0410:24:27 AM | 66.65 | 126.388 | 22.775 | 79.925 |
| 2016-03-0410:24:31 AM | 66.65 | 126.388 | 22.888 | 79.812 |
| 2016-03-0410:24:35 AM | 66.65 | 126.5 | 22.888 | 79.925 |
| 2016-03-0410:24:39 AM | 66.65 | 126.612 | 23 | 79.812 |
| 2016-03-0410:24:43 AM | 66.65 | 126.612 | 22.888 | 79.812 |
| 2016-03-0410:24:47 AM | 66.65 | 126.612 | 22.888 | 79.812 |
| 2016-03-0410:24:51 AM | 66.762 | 126.725 | 22.888 | 79.812 |
| 2016-03-0410:24:55 AM | 66.762 | 126.725 | 22.888 | 79.812 |
| 2016-03-0410:24:59 AM | 66.762 | 126.725 | 22.888 | 79.812 |
| 2016-03-0410:25:03 AM | 66.762 | 126.838 | 22.888 | 79.925 |
| 2016-03-0410:25:07 AM | 66.875 | 126.838 | 22.888 | 79.812 |
| 2016-03-0410:25:11 AM | 66.875 | 126.95 | 23 | 79.812 |
| 2016-03-0410:25:15 AM | 66.875 | 126.95 | 23.225 | 79.812 |
| 2016-03-0410:25:19 AM | 66.988 | 126.95 | 23.338 | 79.925 |
| 2016-03-0410:25:23 AM | 66.988 | 127.062 | 23.45 | 79.925 |
| 2016-03-0410:25:27 AM | 66.988 | 127.062 | 23.562 | 79.925 |
| 2016-03-0410:25:31 AM | 66.988 | 127.175 | 23.562 | 79.925 |
| 2016-03-0410:25:35 AM | 67.1 | 127.175 | 23.675 | 79.925 |
| 2016-03-0410:25:39 AM | 67.1 | 127.288 | 23.675 | 79.925 |
| 2016-03-0410:25:43 AM | 67.212 | 127.4 | 23.562 | 79.925 |
| 2016-03-0410:25:47 AM | 67.212 | 127.512 | 23.562 | 79.925 |
| 2016-03-0410:25:51 AM | 67.212 | 127.512 | 23.675 | 79.925 |
| 2016-03-0410:25:55 AM | 67.212 | 127.512 | 23.675 | 79.925 |
| 2016-03-0410:25:59 AM | 67.325 | 127.625 | 23.675 | 80.038 |
| 2016-03-0410:26:03 AM | 67.325 | 127.625 | 23.675 | 80.038 |
| 2016-03-0410:26:07 AM | 67.438 | 127.738 | 23.788 | 80.038 |
| 2016-03-0410:26:11 AM | 67.438 | 127.85 | 23.675 | 80.038 |
| 2016-03-0410:26:15 AM | 67.438 | 127.85 | 23.675 | 80.038 |
| 2016-03-0410:26:19 AM | 67.55 | 127.85 | 23.675 | 80.038 |
| 2016-03-0410:26:23 AM | 67.55 | 127.85 | 23.675 | 80.038 |
| 2016-03-0410:26:27 AM | 67.55 | 127.962 | 23.675 | 80.15 |
| 2016-03-0410:26:32 AM | 67.55 | 127.962 | 23.675 | 80.15 |
| 2016-03-0410:26:36 AM | 67.55 | 127.962 | 23.788 | 80.038 |
| 2016-03-0410:26:40 AM | 67.55 | 127.962 | 23.788 | 80.038 |
| 2016-03-0410:26:44 AM | 67.55 | 127.962 | 23.562 | 80.15 |
| 2016-03-0410:26:48 AM | 67.55 | 128.075 | 23.45 | 80.15 |
| 2016-03-0410:26:52 AM | 67.662 | 128.075 | 23.45 | 80.15 |
| 2016-03-0410:26:56 AM | 67.55 | 128.075 | 23.562 | 80.15 |
| 2016-03-0410:27:00 AM | 67.662 | 128.188 | 23.562 | 80.15 |
| 2016-03-0410:27:04 AM | 67.662 | 128.188 | 23.675 | 80.15 |
| 2016-03-0410:27:08 AM | 67.662 | 128.188 | 23.788 | 80.15 |
| 2016-03-0410:27:12 AM | 67.662 | 128.188 | 23.788 | 80.262 |
| 2016-03-0410:27:16 AM | 67.662 | 128.3 | 23.675 | 80.15 |
| 2016-03-0410:27:20 AM | 67.662 | 128.412 | 23.562 | 80.15 |
| 2016-03-0410:27:24 AM | 67.662 | 128.412 | 23.562 | 80.262 |
| 2016-03-0410:27:28 AM | 67.662 | 128.412 | 23.562 | 80.262 |
| 2016-03-0410:27:32 AM | 67.662 | 128.412 | 23.562 | 80.262 |
| 2016-03-0410:27:36 AM | 67.662 | 128.525 | 23.675 | 80.262 |
| 2016-03-0410:27:40 AM | 67.662 | 128.525 | 23.675 | 80.262 |
| 2016-03-0410:27:44 AM | 67.775 | 128.637 | 23.675 | 80.262 |
| 2016-03-0410:27:48 AM | 67.775 | 128.637 | 23.788 | 80.262 |
| 2016-03-0410:27:52 AM | 67.662 | 128.637 | 23.9 | 80.262 |
| 2016-03-0410:27:56 AM | 67.662 | 128.637 | 23.9 | 80.375 |
| 2016-03-0410:28:00 AM | 67.662 | 128.75 | 23.9 | 80.375 |
| 2016-03-0410:28:04 AM | 67.662 | 128.75 | 23.788 | 80.262 |
| 2016-03-0410:28:08 AM | 67.662 | 128.863 | 23.562 | 80.375 |
| 2016-03-0410:28:12 AM | 67.662 | 128.863 | 23.45 | 80.375 |
| 2016-03-0410:28:16 AM | 67.662 | 128.975 | 23.338 | 80.262 |
| 2016-03-0410:28:20 AM | 67.662 | 129.088 | 23.45 | 80.375 |
| 2016-03-0410:28:24 AM | 67.662 | 129.088 | 23.338 | 80.375 |
| 2016-03-0410:28:28 AM | 67.662 | 129.2 | 23.45 | 80.375 |
| 2016-03-0410:28:32 AM | 67.662 | 129.2 | 23.338 | 80.375 |
| 2016-03-0410:28:36 AM | 67.662 | 129.2 | 23.338 | 80.375 |
| 2016-03-0410:28:40 AM | 67.662 | 129.312 | 23.338 | 80.375 |
| 2016-03-0410:28:44 AM | 67.662 | 129.312 | 23.338 | 80.375 |
| 2016-03-0410:28:48 AM | 67.662 | 129.425 | 23.338 | 80.375 |
| 2016-03-0410:28:53 AM | 67.662 | 129.425 | 23.112 | 80.488 |
| 2016-03-0410:28:57 AM | 67.662 | 129.538 | 22.888 | 80.488 |
| 2016-03-0410:29:01 AM | 67.55 | 129.538 | 22.775 | 80.488 |
| 2016-03-0410:29:05 AM | 67.55 | 129.538 | 22.662 | 80.488 |
| 2016-03-0410:29:09 AM | 67.55 | 129.65 | 22.55 | 80.488 |
| 2016-03-0410:29:13 AM | 67.662 | 129.762 | 22.55 | 80.488 |
| 2016-03-0410:29:17 AM | 67.662 | 129.875 | 22.662 | 80.488 |
| 2016-03-0410:29:21 AM | 67.55 | 129.875 | 22.662 | 80.488 |
| 2016-03-0410:29:25 AM | 67.55 | 129.875 | 22.55 | 80.488 |
| 2016-03-0410:29:29 AM | 67.55 | 129.988 | 22.55 | 80.488 |
| 2016-03-0410:29:33 AM | 67.55 | 129.988 | 22.438 | 80.488 |
| 2016-03-0410:29:37 AM | 67.438 | 130.1 | 22.325 | 80.6 |
| 2016-03-0410:29:41 AM | 67.438 | 130.1 | 22.325 | 80.6 |
| 2016-03-0410:29:45 AM | 67.438 | 130.212 | 22.325 | 80.6 |
| 2016-03-0410:29:49 AM | 67.438 | 130.325 | 22.438 | 80.6 |
| 2016-03-0410:29:53 AM | 67.438 | 130.325 | 22.325 | 80.6 |
| 2016-03-0410:29:57 AM | 67.438 | 130.438 | 22.212 | 80.6 |
| 2016-03-0410:30:01 AM | 67.438 | 130.438 | 22.1 | 80.6 |
| 2016-03-0410:30:05 AM | 67.325 | 130.55 | 22.1 | 80.6 |
| 2016-03-0410:30:09 AM | 67.325 | 130.55 | 21.988 | 80.6 |
| 2016-03-0410:30:13 AM | 67.325 | 130.662 | 21.988 | 80.6 |
| 2016-03-0410:30:17 AM | 67.325 | 130.662 | 21.762 | 80.6 |
| 2016-03-0410:30:21 AM | 67.325 | 130.775 | 21.65 | 80.6 |
| 2016-03-0410:30:25 AM | 67.325 | 130.887 | 21.762 | 80.6 |
| 2016-03-0410:30:29 AM | 67.325 | 130.887 | 21.875 | 80.6 |
| 2016-03-0410:30:33 AM | 67.325 | 131 | 21.762 | 80.6 |
| 2016-03-0410:30:37 AM | 67.325 | 131 | 21.762 | 80.6 |
| 2016-03-0410:30:41 AM | 67.212 | 131.112 | 21.762 | 80.6 |
| 2016-03-0410:30:45 AM | 67.212 | 131.112 | 21.762 | 80.6 |
| 2016-03-0410:30:49 AM | 67.212 | 131.225 | 21.65 | 80.6 |
| 2016-03-0410:30:53 AM | 67.212 | 131.338 | 21.65 | 80.6 |
| 2016-03-0410:30:57 AM | 67.212 | 131.338 | 21.65 | 80.712 |
| 2016-03-0410:31:01 AM | 67.212 | 131.45 | 21.875 | 80.712 |
| 2016-03-0410:31:06 AM | 67.212 | 131.45 | 22.1 | 80.6 |
| 2016-03-0410:31:10 AM | 67.212 | 131.562 | 22.212 | 80.712 |
| 2016-03-0410:31:14 AM | 67.212 | 131.562 | 22.325 | 80.712 |
| 2016-03-0410:31:18 AM | 67.1 | 131.562 | 22.438 | 80.6 |
| 2016-03-0410:31:22 AM | 67.1 | 131.675 | 22.55 | 80.6 |
| 2016-03-0410:31:26 AM | 67.1 | 131.675 | 22.55 | 80.6 |
| 2016-03-0410:31:30 AM | 67.1 | 131.788 | 22.438 | 80.712 |
| 2016-03-0410:31:34 AM | 67.1 | 131.788 | 22.438 | 80.6 |
| 2016-03-0410:31:38 AM | 67.1 | 131.788 | 22.438 | 80.712 |
| 2016-03-0410:31:42 AM | 67.1 | 131.9 | 22.438 | 80.712 |
| 2016-03-0410:31:46 AM | 67.1 | 131.9 | 22.438 | 80.6 |
| 2016-03-0410:31:50 AM | 67.1 | 131.9 | 22.438 | 80.6 |
| 2016-03-0410:31:54 AM | 67.1 | 131.9 | 22.438 | 80.6 |
| 2016-03-0410:31:58 AM | 67.1 | 132.012 | 22.438 | 80.6 |
| 2016-03-0410:32:02 AM | 67.1 | 132.012 | 22.438 | 80.6 |
| 2016-03-0410:32:06 AM | 67.1 | 132.012 | 22.212 | 80.6 |
| 2016-03-0410:32:10 AM | 67.1 | 132.012 | 22.212 | 80.6 |
| 2016-03-0410:32:14 AM | 67.1 | 132.125 | 22.1 | 80.6 |
| 2016-03-0410:32:18 AM | 66.988 | 132.012 | 21.988 | 80.6 |
| 2016-03-0410:32:22 AM | 67.1 | 132.012 | 22.1 | 80.6 |
| 2016-03-0410:32:26 AM | 67.1 | 132.012 | 22.1 | 80.6 |
| 2016-03-0410:32:30 AM | 67.1 | 132.012 | 22.212 | 80.6 |
| 2016-03-0410:32:34 AM | 67.1 | 132.012 | 22.212 | 80.6 |
| 2016-03-0410:32:38 AM | 67.1 | 132.012 | 22.1 | 80.6 |
| 2016-03-0410:32:42 AM | 67.1 | 132.012 | 22.1 | 80.6 |
| 2016-03-0410:32:46 AM | 67.1 | 131.9 | 21.988 | 80.6 |
| 2016-03-0410:32:50 AM | 67.1 | 131.9 | 21.988 | 80.6 |
| 2016-03-0410:32:54 AM | 67.1 | 131.9 | 22.1 | 80.6 |
| 2016-03-0410:32:58 AM | 67.1 | 131.788 | 22.325 | 80.6 |
| 2016-03-0410:33:02 AM | 67.1 | 131.788 | 22.325 | 80.6 |
| 2016-03-0410:33:06 AM | 67.1 | 131.788 | 22.438 | 80.6 |
| 2016-03-0410:33:10 AM | 67.1 | 131.675 | 22.55 | 80.6 |
| 2016-03-0410:33:14 AM | 67.1 | 131.675 | 22.55 | 80.6 |
| 2016-03-0410:33:18 AM | 66.988 | 131.562 | 22.662 | 80.6 |
| 2016-03-0410:33:22 AM | 67.1 | 131.562 | 22.775 | 80.6 |
| 2016-03-0410:33:26 AM | 67.1 | 131.45 | 22.775 | 80.6 |
| 2016-03-0410:33:31 AM | 67.1 | 131.45 | 22.888 | 80.6 |
| 2016-03-0410:33:35 AM | 67.1 | 131.45 | 22.888 | 80.6 |
| 2016-03-0410:33:39 AM | 67.1 | 131.338 | 23 | 80.6 |
| 2016-03-0410:33:43 AM | 67.1 | 131.338 | 23.112 | 80.6 |
| 2016-03-0410:33:47 AM | 67.1 | 131.338 | 23.112 | 80.6 |
| 2016-03-0410:33:51 AM | 67.212 | 131.225 | 23.112 | 80.6 |
| 2016-03-0410:33:55 AM | 67.212 | 131.225 | 23.112 | 80.6 |
| 2016-03-0410:33:59 AM | 67.212 | 131.225 | 23.225 | 80.6 |
| 2016-03-0410:34:03 AM | 67.212 | 131.225 | 23.338 | 80.6 |
| 2016-03-0410:34:07 AM | 67.212 | 131.225 | 23.338 | 80.6 |
| 2016-03-0410:34:11 AM | 67.212 | 131.112 | 23.45 | 80.6 |
| 2016-03-0410:34:15 AM | 67.212 | 131.112 | 23.562 | 80.6 |
| 2016-03-0410:34:19 AM | 67.212 | 131.112 | 23.562 | 80.6 |
| 2016-03-0410:34:23 AM | 67.212 | 131 | 23.675 | 80.6 |
| 2016-03-0410:34:27 AM | 67.212 | 131 | 23.562 | 80.6 |
| 2016-03-0410:34:31 AM | 67.325 | 131 | 23.562 | 80.6 |
| 2016-03-0410:34:35 AM | 67.325 | 131 | 23.562 | 80.6 |
| 2016-03-0410:34:39 AM | 67.325 | 131 | 23.562 | 80.488 |
| 2016-03-0410:34:43 AM | 67.325 | 130.887 | 23.562 | 80.488 |
| 2016-03-0410:34:47 AM | 67.325 | 130.887 | 23.562 | 80.6 |
| 2016-03-0410:34:51 AM | 67.325 | 130.887 | 23.562 | 80.6 |
| 2016-03-0410:34:55 AM | 67.438 | 130.887 | 23.562 | 80.488 |
| 2016-03-0410:34:59 AM | 67.438 | 130.887 | 23.562 | 80.488 |
| 2016-03-0410:35:03 AM | 67.325 | 130.887 | 23.562 | 80.488 |
| 2016-03-0410:35:07 AM | 67.325 | 130.887 | 23.675 | 80.488 |
| 2016-03-0410:35:11 AM | 67.438 | 131 | 23.788 | 80.488 |
| 2016-03-0410:35:15 AM | 67.438 | 130.887 | 23.9 | 80.488 |
| 2016-03-0410:35:19 AM | 67.438 | 131 | 24.012 | 80.488 |
| 2016-03-0410:35:23 AM | 67.438 | 131 | 24.012 | 80.488 |
| 2016-03-0410:35:27 AM | 67.438 | 131 | 24.125 | 80.488 |
| 2016-03-0410:35:31 AM | 67.438 | 131 | 24.238 | 80.488 |
| 2016-03-0410:35:35 AM | 67.438 | 131 | 24.238 | 80.488 |
| 2016-03-0410:35:39 AM | 67.55 | 131 | 24.238 | 80.488 |
| 2016-03-0410:35:43 AM | 67.55 | 130.887 | 24.238 | 80.488 |
| 2016-03-0410:35:47 AM | 67.438 | 131 | 24.35 | 80.488 |
| 2016-03-0410:35:51 AM | 67.55 | 130.887 | 24.35 | 80.488 |
| 2016-03-0410:35:56 AM | 67.55 | 131 | 24.35 | 80.488 |
| 2016-03-0410:36:00 AM | 67.438 | 131 | 24.462 | 80.488 |
| 2016-03-0410:36:04 AM | 67.438 | 131 | 24.35 | 80.488 |
| 2016-03-0410:36:08 AM | 67.55 | 131 | 24.35 | 80.488 |
| 2016-03-0410:36:12 AM | 67.438 | 131 | 24.35 | 80.488 |
| 2016-03-0410:36:16 AM | 67.55 | 131 | 24.238 | 80.488 |
| 2016-03-0410:36:20 AM | 67.55 | 131 | 24.125 | 80.488 |
| 2016-03-0410:36:24 AM | 67.662 | 131 | 24.238 | 80.375 |
| 2016-03-0410:36:28 AM | 67.662 | 131 | 24.238 | 80.375 |
| 2016-03-0410:36:32 AM | 67.662 | 131.112 | 24.238 | 80.375 |
| 2016-03-0410:36:36 AM | 67.662 | 131 | 24.35 | 80.375 |
| 2016-03-0410:36:40 AM | 67.662 | 131.112 | 24.35 | 80.375 |
| 2016-03-0410:36:44 AM | 67.662 | 131.112 | 24.575 | 80.375 |
| 2016-03-0410:36:48 AM | 67.775 | 131.112 | 24.575 | 80.488 |
| 2016-03-0410:36:52 AM | 67.662 | 131.112 | 24.575 | 80.488 |
| 2016-03-0410:36:56 AM | 67.775 | 131.112 | 24.688 | 80.488 |
| 2016-03-0410:37:00 AM | 67.775 | 131.112 | 24.688 | 80.375 |
| 2016-03-0410:37:04 AM | 67.662 | 131.112 | 24.688 | 80.488 |
| 2016-03-0410:37:08 AM | 67.662 | 131.225 | 24.688 | 80.375 |
| 2016-03-0410:37:12 AM | 67.775 | 131.112 | 24.462 | 80.488 |
| 2016-03-0410:37:16 AM | 67.775 | 131.112 | 24.35 | 80.488 |
| 2016-03-0410:37:20 AM | 67.775 | 131.225 | 24.35 | 80.375 |
| 2016-03-0410:37:24 AM | 67.775 | 131.225 | 24.35 | 80.488 |
| 2016-03-0410:37:28 AM | 67.775 | 131.112 | 24.462 | 80.488 |
| 2016-03-0410:37:32 AM | 67.775 | 131.225 | 24.462 | 80.488 |
| 2016-03-0410:37:36 AM | 67.775 | 131.112 | 24.462 | 80.488 |
| 2016-03-0410:37:40 AM | 67.775 | 131.112 | 24.462 | 80.488 |
| 2016-03-0410:37:44 AM | 67.775 | 131.112 | 24.35 | 80.488 |
| 2016-03-0410:37:48 AM | 67.888 | 131 | 24.462 | 80.488 |
| 2016-03-0410:37:52 AM | 67.775 | 131 | 24.35 | 80.488 |
| 2016-03-0410:37:56 AM | 67.888 | 130.887 | 24.35 | 80.488 |
| 2016-03-0410:38:00 AM | 67.775 | 130.887 | 24.35 | 80.488 |
| 2016-03-0410:38:04 AM | 67.775 | 130.887 | 24.35 | 80.488 |
| 2016-03-0410:38:09 AM | 67.775 | 130.775 | 24.462 | 80.488 |
| 2016-03-0410:38:13 AM | 67.775 | 130.775 | 24.35 | 80.375 |
| 2016-03-0410:38:17 AM | 67.775 | 130.775 | 24.35 | 80.375 |
| 2016-03-0410:38:21 AM | 67.888 | 130.55 | 24.35 | 80.488 |
| 2016-03-0410:38:25 AM | 67.775 | 130.55 | 24.35 | 80.488 |
| 2016-03-0410:38:29 AM | 67.775 | 130.55 | 24.35 | 80.375 |
| 2016-03-0410:38:33 AM | 67.888 | 130.55 | 24.238 | 80.375 |
| 2016-03-0410:38:37 AM | 67.775 | 130.438 | 24.238 | 80.375 |
| 2016-03-0410:38:41 AM | 67.888 | 130.438 | 24.238 | 80.488 |
| 2016-03-0410:38:45 AM | 67.888 | 130.438 | 24.238 | 80.488 |
| 2016-03-0410:38:49 AM | 67.888 | 130.325 | 24.35 | 80.488 |
| 2016-03-0410:38:53 AM | 67.888 | 130.325 | 24.35 | 80.488 |
| 2016-03-0410:38:57 AM | 67.888 | 130.325 | 24.238 | 80.488 |
| 2016-03-0410:39:01 AM | 67.888 | 130.212 | 24.238 | 80.488 |
| 2016-03-0410:39:05 AM | 67.888 | 130.1 | 24.238 | 80.488 |
| 2016-03-0410:39:09 AM | 67.888 | 130.1 | 24.35 | 80.488 |
| 2016-03-0410:39:13 AM | 67.888 | 129.988 | 24.35 | 80.488 |
| 2016-03-0410:39:17 AM | 67.888 | 129.875 | 24.35 | 80.488 |
| 2016-03-0410:39:21 AM | 67.888 | 129.762 | 24.35 | 80.488 |
| 2016-03-0410:39:25 AM | 67.888 | 129.762 | 24.238 | 80.488 |
| 2016-03-0410:39:29 AM | 67.888 | 129.65 | 24.238 | 80.488 |
| 2016-03-0410:39:33 AM | 67.888 | 129.538 | 24.238 | 80.488 |
| 2016-03-0410:39:37 AM | 67.888 | 129.425 | 24.238 | 80.488 |
| 2016-03-0410:39:41 AM | 67.888 | 129.425 | 24.012 | 80.488 |
| 2016-03-0410:39:45 AM | 67.888 | 129.312 | 23.9 | 80.488 |
| 2016-03-0410:39:49 AM | 67.888 | 129.2 | 23.9 | 80.488 |
| 2016-03-0410:39:53 AM | 67.888 | 129.2 | 23.788 | 80.488 |
| 2016-03-0410:39:57 AM | 67.775 | 129.088 | 23.675 | 80.488 |
| 2016-03-0410:40:01 AM | 67.775 | 128.975 | 23.562 | 80.488 |
| 2016-03-0410:40:05 AM | 67.888 | 128.975 | 23.562 | 80.488 |
| 2016-03-0410:40:09 AM | 67.775 | 128.863 | 23.562 | 80.488 |
| 2016-03-0410:40:13 AM | 67.775 | 128.863 | 23.562 | 80.6 |
| 2016-03-0410:40:17 AM | 67.775 | 128.75 | 23.562 | 80.488 |
| 2016-03-0410:40:21 AM | 67.775 | 128.75 | 23.675 | 80.488 |
| 2016-03-0410:40:25 AM | 67.775 | 128.637 | 23.788 | 80.488 |
| 2016-03-0410:40:30 AM | 67.888 | 128.637 | 23.788 | 80.488 |
| 2016-03-0410:40:34 AM | 67.888 | 128.637 | 23.675 | 80.488 |
| 2016-03-0410:40:38 AM | 67.888 | 128.525 | 23.45 | 80.488 |
| 2016-03-0410:40:42 AM | 67.888 | 128.525 | 23.225 | 80.488 |
| 2016-03-0410:40:46 AM | 67.888 | 128.412 | 23.112 | 80.488 |
| 2016-03-0410:40:50 AM | 67.888 | 128.412 | 23 | 80.488 |
| 2016-03-0410:40:54 AM | 67.888 | 128.3 | 22.888 | 80.488 |
| 2016-03-0410:40:57 AM | 67.888 | 128.3 | 22.888 | 80.488 |
| 2016-03-0410:41:01 AM | 67.888 | 128.412 | 23 | 80.488 |
| 2016-03-0410:41:05 AM | 67.888 | 128.412 | 23 | 80.488 |
| 2016-03-0410:41:09 AM | 67.888 | 128.412 | 22.888 | 80.488 |
| 2016-03-0410:41:13 AM | 67.888 | 128.412 | 22.662 | 80.488 |
| 2016-03-0410:41:17 AM | 67.888 | 128.412 | 22.438 | 80.488 |
| 2016-03-0410:41:21 AM | 67.775 | 128.525 | 22.325 | 80.488 |
| 2016-03-0410:41:25 AM | 67.888 | 128.525 | 22.212 | 80.488 |
| 2016-03-0410:41:29 AM | 67.888 | 128.525 | 22.1 | 80.488 |
| 2016-03-0410:41:33 AM | 67.888 | 128.637 | 21.988 | 80.488 |
| 2016-03-0410:41:37 AM | 67.775 | 128.637 | 21.875 | 80.488 |
| 2016-03-0410:41:41 AM | 67.888 | 128.637 | 21.875 | 80.488 |
| 2016-03-0410:41:45 AM | 67.888 | 128.637 | 21.762 | 80.488 |
| 2016-03-0410:41:50 AM | 67.888 | 128.637 | 21.762 | 80.488 |
| 2016-03-0410:41:54 AM | 67.888 | 128.75 | 21.875 | 80.488 |
| 2016-03-0410:41:58 AM | 67.888 | 128.75 | 21.875 | 80.488 |
| 2016-03-0410:42:02 AM | 67.888 | 128.863 | 21.988 | 80.488 |
| 2016-03-0410:42:06 AM | 67.888 | 128.75 | 22.1 | 80.375 |
| 2016-03-0410:42:10 AM | 67.888 | 128.863 | 22.212 | 80.375 |
| 2016-03-0410:42:14 AM | 67.888 | 128.863 | 22.325 | 80.488 |
| 2016-03-0410:42:18 AM | 67.888 | 128.75 | 22.325 | 80.488 |
| 2016-03-0410:42:22 AM | 67.888 | 128.75 | 22.212 | 80.488 |
| 2016-03-0410:42:26 AM | 67.888 | 128.75 | 22.325 | 80.375 |
| 2016-03-0410:42:30 AM | 67.888 | 128.637 | 22.212 | 80.488 |
| 2016-03-0410:42:34 AM | 68 | 128.637 | 22.212 | 80.488 |
| 2016-03-0410:42:38 AM | 67.888 | 128.637 | 22.325 | 80.488 |
| 2016-03-0410:42:42 AM | 67.888 | 128.525 | 22.325 | 80.488 |
| 2016-03-0410:42:46 AM | 68 | 128.525 | 22.438 | 80.375 |
| 2016-03-0410:42:50 AM | 67.888 | 128.525 | 22.438 | 80.488 |
| 2016-03-0410:42:54 AM | 68 | 128.412 | 22.325 | 80.375 |
| 2016-03-0410:42:58 AM | 67.888 | 128.412 | 22.325 | 80.488 |
| 2016-03-0410:43:02 AM | 68 | 128.412 | 22.438 | 80.488 |
| 2016-03-0410:43:06 AM | 67.888 | 128.3 | 22.325 | 80.488 |
| 2016-03-0410:43:10 AM | 67.888 | 128.3 | 22.212 | 80.488 |
| 2016-03-0410:43:14 AM | 67.888 | 128.3 | 22.1 | 80.488 |
| 2016-03-0410:43:18 AM | 67.888 | 128.3 | 22.1 | 80.488 |
| 2016-03-0410:43:22 AM | 67.888 | 128.3 | 21.875 | 80.375 |
| 2016-03-0410:43:26 AM | 68 | 128.188 | 21.762 | 80.488 |
| 2016-03-0410:43:30 AM | 67.888 | 128.188 | 21.65 | 80.488 |
| 2016-03-0410:43:34 AM | 67.888 | 128.188 | 21.538 | 80.488 |
| 2016-03-0410:43:38 AM | 67.888 | 128.188 | 21.312 | 80.488 |
| 2016-03-0410:43:42 AM | 67.888 | 128.188 | 21.425 | 80.488 |
| 2016-03-0410:43:46 AM | 67.888 | 128.075 | 21.538 | 80.488 |
| 2016-03-0410:43:50 AM | 67.888 | 128.075 | 21.762 | 80.488 |
| 2016-03-0410:43:54 AM | 67.888 | 128.075 | 21.762 | 80.375 |
| 2016-03-0410:43:58 AM | 67.888 | 128.075 | 21.988 | 80.488 |
| 2016-03-0410:44:02 AM | 68 | 128.075 | 22.1 | 80.375 |
| 2016-03-0410:44:07 AM | 67.888 | 128.075 | 22.212 | 80.488 |
| 2016-03-0410:44:11 AM | 67.888 | 128.075 | 22.325 | 80.488 |
| 2016-03-0410:44:15 AM | 68 | 128.075 | 22.438 | 80.488 |
| 2016-03-0410:44:19 AM | 68 | 128.075 | 22.55 | 80.488 |
| 2016-03-0410:44:23 AM | 68 | 128.075 | 22.55 | 80.375 |
| 2016-03-0410:44:27 AM | 68 | 128.188 | 22.662 | 80.488 |
| 2016-03-0410:44:31 AM | 68 | 128.188 | 22.662 | 80.488 |
| 2016-03-0410:44:35 AM | 68 | 128.188 | 22.662 | 80.488 |
| 2016-03-0410:44:39 AM | 68 | 128.188 | 22.775 | 80.488 |
| 2016-03-0410:44:43 AM | 68 | 128.075 | 22.775 | 80.488 |
| 2016-03-0410:44:47 AM | 68 | 128.075 | 22.775 | 80.488 |
| 2016-03-0410:44:51 AM | 68 | 128.188 | 22.662 | 80.488 |
| 2016-03-0410:44:55 AM | 68 | 128.188 | 22.888 | 80.488 |
| 2016-03-0410:44:59 AM | 68 | 128.075 | 22.888 | 80.488 |
| 2016-03-0410:45:03 AM | 67.888 | 128.075 | 23 | 80.488 |
| 2016-03-0410:45:07 AM | 67.888 | 128.075 | 23.112 | 80.488 |
| 2016-03-0410:45:11 AM | 68 | 128.075 | 23.225 | 80.488 |
| 2016-03-0410:45:15 AM | 68 | 128.075 | 23.225 | 80.488 |
| 2016-03-0410:45:19 AM | 67.888 | 127.962 | 23.225 | 80.488 |
| 2016-03-0410:45:23 AM | 67.888 | 127.962 | 23.338 | 80.488 |
| 2016-03-0410:45:27 AM | 67.888 | 127.85 | 23.338 | 80.488 |
| 2016-03-0410:45:31 AM | 67.888 | 127.85 | 23.225 | 80.375 |
| 2016-03-0410:45:35 AM | 67.888 | 127.85 | 23.225 | 80.375 |
| 2016-03-0410:45:39 AM | 67.888 | 127.738 | 23.338 | 80.375 |
| 2016-03-0410:45:43 AM | 67.888 | 127.625 | 23.225 | 80.375 |
| 2016-03-0410:45:47 AM | 67.888 | 127.625 | 23.225 | 80.488 |
| 2016-03-0410:45:51 AM | 67.888 | 127.512 | 23.225 | 80.488 |
| 2016-03-0410:45:55 AM | 67.888 | 127.512 | 23.225 | 80.488 |
| 2016-03-0410:45:59 AM | 67.888 | 127.4 | 23.225 | 80.488 |
| 2016-03-0410:46:03 AM | 67.888 | 127.288 | 23.225 | 80.488 |
| 2016-03-0410:46:07 AM | 67.775 | 127.288 | 23.225 | 80.488 |
| 2016-03-0410:46:11 AM | 67.888 | 127.288 | 23.112 | 80.375 |
| 2016-03-0410:46:15 AM | 67.888 | 127.288 | 23 | 80.375 |
| 2016-03-0410:46:19 AM | 67.888 | 127.175 | 22.775 | 80.375 |
| 2016-03-0410:46:23 AM | 67.775 | 127.175 | 22.662 | 80.375 |
| 2016-03-0410:46:27 AM | 67.775 | 127.062 | 22.438 | 80.375 |
| 2016-03-0410:46:32 AM | 67.775 | 127.062 | 22.325 | 80.375 |
| 2016-03-0410:46:36 AM | 67.775 | 127.062 | 22.325 | 80.375 |
| 2016-03-0410:46:40 AM | 67.775 | 127.062 | 22.212 | 80.375 |
| 2016-03-0410:46:44 AM | 67.775 | 127.062 | 22.1 | 80.375 |
| 2016-03-0410:46:48 AM | 67.775 | 126.95 | 22.1 | 80.375 |
| 2016-03-0410:46:52 AM | 67.775 | 126.838 | 22.1 | 80.375 |
| 2016-03-0410:46:56 AM | 67.775 | 126.838 | 22.1 | 80.375 |
| 2016-03-0410:47:00 AM | 67.662 | 126.838 | 22.1 | 80.375 |
| 2016-03-0410:47:04 AM | 67.775 | 126.838 | 22.1 | 80.375 |
| 2016-03-0410:47:08 AM | 67.662 | 126.838 | 22.1 | 80.375 |
| 2016-03-0410:47:12 AM | 67.775 | 126.838 | 21.988 | 80.375 |
| 2016-03-0410:47:16 AM | 67.775 | 126.838 | 21.875 | 80.375 |
| 2016-03-0410:47:19 AM | 67.775 | 126.838 | 21.762 | 80.375 |
| 2016-03-0410:47:23 AM | 67.662 | 126.838 | 21.875 | 80.375 |
| 2016-03-0410:47:27 AM | 67.662 | 126.725 | 21.875 | 80.375 |
| 2016-03-0410:47:31 AM | 67.662 | 126.725 | 21.988 | 80.375 |
| 2016-03-0410:47:35 AM | 67.662 | 126.725 | 21.988 | 80.375 |
| 2016-03-0410:47:39 AM | 67.775 | 126.612 | 22.212 | 80.375 |
| 2016-03-0410:47:43 AM | 67.662 | 126.612 | 22.325 | 80.375 |
| 2016-03-0410:47:47 AM | 67.662 | 126.612 | 22.438 | 80.375 |
| 2016-03-0410:47:51 AM | 67.662 | 126.5 | 22.55 | 80.375 |
| 2016-03-0410:47:55 AM | 67.662 | 126.5 | 22.55 | 80.375 |
| 2016-03-0410:47:59 AM | 67.662 | 126.5 | 22.775 | 80.375 |
| 2016-03-0410:48:03 AM | 67.662 | 126.388 | 22.888 | 80.375 |
| 2016-03-0410:48:08 AM | 67.662 | 126.388 | 22.888 | 80.375 |
| 2016-03-0410:48:12 AM | 67.662 | 126.275 | 22.775 | 80.375 |
| 2016-03-0410:48:16 AM | 67.662 | 126.275 | 22.662 | 80.375 |
| 2016-03-0410:48:20 AM | 67.662 | 126.163 | 22.438 | 80.375 |
| 2016-03-0410:48:24 AM | 67.662 | 126.163 | 22.212 | 80.375 |
| 2016-03-0410:48:28 AM | 67.662 | 126.05 | 22.212 | 80.375 |
| 2016-03-0410:48:32 AM | 67.662 | 125.938 | 22.1 | 80.375 |
| 2016-03-0410:48:36 AM | 67.55 | 125.938 | 21.988 | 80.375 |
| 2016-03-0410:48:40 AM | 67.662 | 125.825 | 21.875 | 80.375 |
| 2016-03-0410:48:44 AM | 67.55 | 125.825 | 21.875 | 80.375 |
| 2016-03-0410:48:48 AM | 67.55 | 125.712 | 21.762 | 80.375 |
| 2016-03-0410:48:52 AM | 67.662 | 125.6 | 21.762 | 80.375 |
| 2016-03-0410:48:56 AM | 67.662 | 125.488 | 21.65 | 80.375 |
| 2016-03-0410:49:00 AM | 67.662 | 125.488 | 21.65 | 80.262 |
| 2016-03-0410:49:04 AM | 67.662 | 125.375 | 21.65 | 80.262 |
| 2016-03-0410:49:08 AM | 67.775 | 125.375 | 21.65 | 80.262 |
| 2016-03-0410:49:12 AM | 67.662 | 125.262 | 21.65 | 80.262 |
| 2016-03-0410:49:16 AM | 67.775 | 125.15 | 21.65 | 80.262 |
| 2016-03-0410:49:20 AM | 67.662 | 125.038 | 21.65 | 80.15 |
| 2016-03-0410:49:24 AM | 67.662 | 124.925 | 21.762 | 80.15 |
| 2016-03-0410:49:28 AM | 67.662 | 124.812 | 21.875 | 80.15 |
| 2016-03-0410:49:32 AM | 67.662 | 124.7 | 21.988 | 80.15 |
| 2016-03-0410:49:36 AM | 67.662 | 124.588 | 21.988 | 80.15 |
| 2016-03-0410:49:40 AM | 67.662 | 124.475 | 22.1 | 80.15 |
| 2016-03-0410:49:44 AM | 67.775 | 124.362 | 22.1 | 80.262 |
| 2016-03-0410:49:48 AM | 67.662 | 124.25 | 21.988 | 80.262 |
| 2016-03-0410:49:52 AM | 67.775 | 124.138 | 21.762 | 80.262 |
| 2016-03-0410:49:56 AM | 67.662 | 124.025 | 21.762 | 80.262 |
| 2016-03-0410:50:00 AM | 67.662 | 123.913 | 21.762 | 80.262 |
| 2016-03-0410:50:04 AM | 67.662 | 123.8 | 21.762 | 80.262 |
| 2016-03-0410:50:08 AM | 67.55 | 123.688 | 21.65 | 80.262 |
| 2016-03-0410:50:12 AM | 67.662 | 123.575 | 21.65 | 80.15 |
| 2016-03-0410:50:16 AM | 67.55 | 123.462 | 21.538 | 80.262 |
| 2016-03-0410:50:20 AM | 67.662 | 123.35 | 21.425 | 80.262 |
| 2016-03-0410:50:24 AM | 67.662 | 123.125 | 21.538 | 80.262 |
| 2016-03-0410:50:29 AM | 67.662 | 123.012 | 21.538 | 80.262 |
| 2016-03-0410:50:33 AM | 67.662 | 122.9 | 21.65 | 80.15 |
| 2016-03-0410:50:37 AM | 67.662 | 122.788 | 21.762 | 80.038 |
| 2016-03-0410:50:41 AM | 67.662 | 122.675 | 21.875 | 80.038 |
| 2016-03-0410:50:45 AM | 67.662 | 122.562 | 21.988 | 80.038 |
| 2016-03-0410:50:49 AM | 67.775 | 122.562 | 22.1 | 80.038 |
| 2016-03-0410:50:53 AM | 67.662 | 122.45 | 22.212 | 80.038 |
| 2016-03-0410:50:57 AM | 67.775 | 122.225 | 22.212 | 80.038 |
| 2016-03-0410:51:01 AM | 67.775 | 122.112 | 22.325 | 79.925 |
| 2016-03-0410:51:05 AM | 67.775 | 122 | 22.438 | 79.925 |
| 2016-03-0410:51:09 AM | 67.775 | 121.888 | 22.55 | 79.925 |
| 2016-03-0410:51:13 AM | 67.888 | 121.775 | 22.55 | 79.925 |
| 2016-03-0410:51:17 AM | 67.888 | 121.55 | 22.662 | 79.925 |
| 2016-03-0410:51:21 AM | 67.888 | 121.438 | 22.775 | 79.925 |
| 2016-03-0410:51:25 AM | 67.888 | 121.438 | 22.775 | 79.925 |
| 2016-03-0410:51:29 AM | 67.888 | 121.325 | 22.888 | 79.925 |
| 2016-03-0410:51:33 AM | 67.888 | 121.212 | 22.888 | 79.925 |
| 2016-03-0410:51:37 AM | 68 | 121.1 | 23 | 79.925 |
| 2016-03-0410:51:41 AM | 68 | 120.988 | 23 | 79.925 |
| 2016-03-0410:51:45 AM | 68 | 120.988 | 23 | 79.925 |
| 2016-03-0410:51:49 AM | 68 | 120.875 | 23 | 79.925 |
| 2016-03-0410:51:53 AM | 68 | 120.762 | 23.112 | 79.925 |
| 2016-03-0410:51:57 AM | 68 | 120.762 | 23.112 | 79.812 |
| 2016-03-0410:52:01 AM | 68 | 120.65 | 23.225 | 79.812 |
| 2016-03-0410:52:05 AM | 68 | 120.65 | 23.225 | 79.812 |
| 2016-03-0410:52:09 AM | 68 | 120.538 | 23.338 | 79.925 |
| 2016-03-0410:52:13 AM | 67.888 | 120.425 | 23.45 | 79.812 |
| 2016-03-0410:52:17 AM | 67.888 | 120.425 | 23.562 | 79.812 |
| 2016-03-0410:52:21 AM | 68 | 120.312 | 23.562 | 79.812 |
| 2016-03-0410:52:25 AM | 67.888 | 120.2 | 23.675 | 79.812 |
| 2016-03-0410:52:29 AM | 68 | 120.2 | 23.675 | 79.812 |
| 2016-03-0410:52:33 AM | 68 | 120.088 | 23.675 | 79.812 |
| 2016-03-0410:52:37 AM | 68 | 120.088 | 23.562 | 79.812 |
| 2016-03-0410:52:41 AM | 68 | 119.975 | 23.45 | 79.812 |
| 2016-03-0410:52:45 AM | 68 | 119.862 | 23.45 | 79.812 |
| 2016-03-0410:52:49 AM | 68 | 119.862 | 23.338 | 79.812 |
| 2016-03-0410:52:53 AM | 68 | 119.75 | 23.338 | 79.7 |
| 2016-03-0410:52:58 AM | 68 | 119.638 | 23.338 | 79.7 |
| 2016-03-0410:53:02 AM | 68.112 | 119.638 | 23.112 | 79.7 |
| 2016-03-0410:53:06 AM | 68.112 | 119.525 | 23 | 79.588 |
| 2016-03-0410:53:10 AM | 68 | 119.413 | 22.888 | 79.588 |
| 2016-03-0410:53:14 AM | 68.112 | 119.3 | 22.775 | 79.7 |
| 2016-03-0410:53:18 AM | 68.112 | 119.3 | 22.775 | 79.588 |
| 2016-03-0410:53:22 AM | 68.112 | 119.188 | 22.888 | 79.588 |
| 2016-03-0410:53:26 AM | 68.112 | 119.075 | 22.888 | 79.588 |
| 2016-03-0410:53:30 AM | 68.112 | 119.075 | 22.888 | 79.7 |
| 2016-03-0410:53:34 AM | 68.112 | 118.962 | 23 | 79.588 |
| 2016-03-0410:53:38 AM | 68.112 | 118.962 | 23 | 79.588 |
| 2016-03-0410:53:42 AM | 68.112 | 118.85 | 23 | 79.588 |
| 2016-03-0410:53:46 AM | 68.112 | 118.85 | 23.112 | 79.588 |
| 2016-03-0410:53:50 AM | 68.112 | 118.85 | 23.112 | 79.588 |
| 2016-03-0410:53:54 AM | 68.112 | 118.85 | 22.888 | 79.588 |
| 2016-03-0410:53:58 AM | 68.112 | 118.85 | 22.55 | 79.588 |
| 2016-03-0410:54:02 AM | 68.112 | 118.85 | 22.325 | 79.588 |
| 2016-03-0410:54:06 AM | 68.112 | 118.85 | 22.1 | 79.588 |
| 2016-03-0410:54:10 AM | 68.112 | 118.85 | 21.988 | 79.588 |
| 2016-03-0410:54:14 AM | 68.112 | 118.85 | 21.875 | 79.588 |
| 2016-03-0410:54:18 AM | 68 | 118.85 | 21.762 | 79.588 |
| 2016-03-0410:54:22 AM | 68 | 118.85 | 21.65 | 79.588 |
| 2016-03-0410:54:26 AM | 68 | 118.962 | 21.65 | 79.7 |
| 2016-03-0410:54:30 AM | 68 | 119.075 | 21.65 | 79.7 |
| 2016-03-0410:54:34 AM | 68 | 119.3 | 21.65 | 79.588 |
| 2016-03-0410:54:38 AM | 68 | 119.413 | 21.538 | 79.7 |
| 2016-03-0410:54:42 AM | 67.888 | 119.525 | 21.425 | 79.588 |
| 2016-03-0410:54:46 AM | 67.888 | 119.75 | 21.312 | 79.588 |
| 2016-03-0410:54:50 AM | 67.888 | 119.862 | 21.312 | 79.588 |
| 2016-03-0410:54:54 AM | 67.888 | 120.088 | 21.2 | 79.588 |
| 2016-03-0410:54:58 AM | 67.888 | 120.2 | 21.2 | 79.7 |
| 2016-03-0410:55:02 AM | 67.888 | 120.312 | 21.312 | 79.588 |
| 2016-03-0410:55:06 AM | 67.775 | 120.425 | 21.425 | 79.588 |
| 2016-03-0410:55:10 AM | 67.888 | 120.65 | 21.538 | 79.7 |
| 2016-03-0410:55:14 AM | 67.775 | 120.762 | 21.538 | 79.7 |
| 2016-03-0410:55:18 AM | 67.775 | 120.762 | 21.65 | 79.7 |
| 2016-03-0410:55:22 AM | 67.775 | 120.762 | 21.65 | 79.7 |
| 2016-03-0410:55:26 AM | 67.775 | 120.65 | 21.65 | 79.7 |
| 2016-03-0410:55:30 AM | 67.662 | 120.65 | 21.65 | 79.7 |
| 2016-03-0410:55:34 AM | 67.662 | 120.65 | 21.762 | 79.7 |
| 2016-03-0410:55:39 AM | 67.662 | 120.65 | 21.762 | 79.7 |
| 2016-03-0410:55:43 AM | 67.662 | 120.65 | 21.762 | 79.7 |
| 2016-03-0410:55:47 AM | 67.55 | 120.762 | 21.988 | 79.7 |
| 2016-03-0410:55:51 AM | 67.55 | 120.762 | 22.1 | 79.7 |
| 2016-03-0410:55:55 AM | 67.438 | 120.762 | 22.212 | 79.7 |
| 2016-03-0410:55:59 AM | 67.325 | 120.762 | 22.325 | 79.7 |
| 2016-03-0410:56:03 AM | 67.1 | 120.875 | 22.438 | 79.7 |
| 2016-03-0410:56:07 AM | 66.875 | 120.875 | 22.55 | 79.7 |
| 2016-03-0410:56:11 AM | 66.65 | 120.988 | 22.662 | 79.7 |
| 2016-03-0410:56:15 AM | 66.425 | 120.988 | 22.775 | 79.7 |
| 2016-03-0410:56:19 AM | 66.088 | 121.1 | 22.888 | 79.7 |
| 2016-03-0410:56:23 AM | 65.862 | 121.1 | 23 | 79.7 |
| 2016-03-0410:56:27 AM | 65.638 | 121.212 | 23.112 | 79.7 |
| 2016-03-0410:56:31 AM | 65.3 | 121.212 | 23.225 | 79.7 |
| 2016-03-0410:56:35 AM | 64.963 | 121.325 | 23.112 | 79.7 |
| 2016-03-0410:56:39 AM | 64.738 | 121.325 | 23.225 | 79.7 |
| 2016-03-0410:56:43 AM | 64.287 | 121.438 | 23.112 | 79.7 |
| 2016-03-0410:56:47 AM | 64.062 | 121.438 | 23.112 | 79.7 |
| 2016-03-0410:56:51 AM | 63.725 | 121.55 | 23 | 79.7 |
| 2016-03-0410:56:55 AM | 63.388 | 121.663 | 23.112 | 79.7 |
| 2016-03-0410:56:59 AM | 63.05 | 121.663 | 23.112 | 79.7 |
| 2016-03-0410:57:03 AM | 62.712 | 121.775 | 23.112 | 79.7 |
| 2016-03-0410:57:07 AM | 62.488 | 121.888 | 23.112 | 79.7 |
| 2016-03-0410:57:11 AM | 62.15 | 121.888 | 23 | 79.7 |
| 2016-03-0410:57:15 AM | 61.812 | 122 | 23 | 79.7 |
| 2016-03-0410:57:19 AM | 61.588 | 122.112 | 23.112 | 79.7 |
| 2016-03-0410:57:23 AM | 61.363 | 122.112 | 23.225 | 79.7 |
| 2016-03-0410:57:27 AM | 61.025 | 122.225 | 23.225 | 79.7 |
| 2016-03-0410:57:31 AM | 60.8 | 122.225 | 23.338 | 79.588 |
| 2016-03-0410:57:35 AM | 60.575 | 122.338 | 23.45 | 79.588 |
| 2016-03-0410:57:39 AM | 60.35 | 122.338 | 23.45 | 79.588 |
| 2016-03-0410:57:44 AM | 60.238 | 122.45 | 23.45 | 79.588 |
| 2016-03-0410:57:48 AM | 60.125 | 122.45 | 23.45 | 79.588 |
| 2016-03-0410:57:52 AM | 60.012 | 122.562 | 23.562 | 79.588 |
| 2016-03-0410:57:56 AM | 59.9 | 122.562 | 23.675 | 79.588 |
| 2016-03-0410:58:00 AM | 59.675 | 122.562 | 23.675 | 79.588 |
| 2016-03-0410:58:04 AM | 59.562 | 122.675 | 23.788 | 79.588 |
| 2016-03-0410:58:08 AM | 59.45 | 122.675 | 23.9 | 79.588 |
| 2016-03-0410:58:12 AM | 59.338 | 122.675 | 24.012 | 79.588 |
| 2016-03-0410:58:16 AM | 59.112 | 122.788 | 24.125 | 79.7 |
| 2016-03-0410:58:20 AM | 59 | 122.9 | 24.238 | 79.588 |
| 2016-03-0410:58:24 AM | 58.888 | 122.9 | 24.35 | 79.588 |
| 2016-03-0410:58:28 AM | 58.775 | 123.012 | 24.462 | 79.588 |
| 2016-03-0410:58:32 AM | 58.775 | 123.012 | 24.575 | 79.588 |
| 2016-03-0410:58:36 AM | 58.662 | 123.125 | 24.8 | 79.588 |
| 2016-03-0410:58:40 AM | 58.55 | 123.238 | 24.8 | 79.588 |
| 2016-03-0410:58:44 AM | 58.55 | 123.238 | 24.912 | 79.588 |
| 2016-03-0410:58:48 AM | 58.438 | 123.35 | 25.025 | 79.588 |
| 2016-03-0410:58:52 AM | 58.325 | 123.462 | 25.025 | 79.588 |
| 2016-03-0410:58:56 AM | 58.325 | 123.462 | 25.025 | 79.588 |
| 2016-03-0410:59:00 AM | 58.325 | 123.575 | 24.912 | 79.588 |
| 2016-03-0410:59:04 AM | 58.212 | 123.688 | 24.688 | 79.588 |
| 2016-03-0410:59:08 AM | 58.212 | 123.688 | 24.575 | 79.588 |
| 2016-03-0410:59:12 AM | 58.1 | 123.8 | 24.462 | 79.588 |
| 2016-03-0410:59:16 AM | 58.1 | 123.8 | 24.462 | 79.588 |
| 2016-03-0410:59:20 AM | 57.988 | 123.913 | 24.35 | 79.588 |
| 2016-03-0410:59:24 AM | 57.988 | 124.025 | 24.462 | 79.588 |
| 2016-03-0410:59:28 AM | 57.875 | 124.025 | 24.462 | 79.588 |
| 2016-03-0410:59:33 AM | 57.875 | 124.025 | 24.575 | 79.588 |
| 2016-03-0410:59:37 AM | 57.875 | 124.025 | 24.575 | 79.475 |
| 2016-03-0410:59:41 AM | 57.762 | 124.025 | 24.462 | 79.475 |
| 2016-03-0410:59:45 AM | 57.762 | 124.138 | 24.238 | 79.362 |
| 2016-03-0410:59:49 AM | 57.65 | 124.138 | 24.238 | 79.362 |
| 2016-03-0410:59:53 AM | 57.65 | 124.138 | 24.238 | 79.362 |
| 2016-03-0410:59:57 AM | 57.538 | 124.25 | 24.238 | 79.25 |
| 2016-03-0411:00:01 AM | 57.538 | 124.25 | 24.35 | 79.25 |
| 2016-03-0411:00:05 AM | 57.425 | 124.25 | 24.35 | 79.25 |
| 2016-03-0411:00:09 AM | 57.425 | 124.25 | 24.35 | 79.25 |
| 2016-03-0411:00:13 AM | 57.312 | 124.25 | 24.238 | 79.25 |
| 2016-03-0411:00:17 AM | 57.312 | 124.362 | 24.35 | 79.25 |
| 2016-03-0411:00:21 AM | 57.312 | 124.25 | 24.238 | 79.362 |
| 2016-03-0411:00:25 AM | 57.312 | 124.25 | 24.238 | 79.362 |
| 2016-03-0411:00:29 AM | 57.2 | 124.25 | 24.238 | 79.25 |
| 2016-03-0411:00:33 AM | 57.2 | 124.362 | 24.238 | 79.25 |
| 2016-03-0411:00:38 AM | 57.2 | 124.362 | 24.238 | 79.25 |
| 2016-03-0411:00:42 AM | 57.2 | 124.362 | 24.35 | 79.25 |
| 2016-03-0411:00:46 AM | 57.2 | 124.362 | 24.35 | 79.25 |
| 2016-03-0411:00:50 AM | 57.088 | 124.362 | 24.462 | 79.25 |
| 2016-03-0411:00:54 AM | 57.088 | 124.362 | 24.462 | 79.25 |
| 2016-03-0411:00:58 AM | 57.088 | 124.362 | 24.462 | 79.25 |
| 2016-03-0411:01:02 AM | 56.975 | 124.475 | 24.462 | 79.25 |
| 2016-03-0411:01:06 AM | 56.975 | 124.475 | 24.575 | 79.25 |
| 2016-03-0411:01:10 AM | 56.975 | 124.588 | 24.575 | 79.25 |
| 2016-03-0411:01:14 AM | 56.862 | 124.588 | 24.688 | 79.25 |
| 2016-03-0411:01:18 AM | 56.862 | 124.7 | 24.688 | 79.25 |
| 2016-03-0411:01:22 AM | 56.862 | 124.812 | 24.8 | 79.138 |
| 2016-03-0411:01:26 AM | 56.862 | 124.925 | 24.8 | 79.25 |
| 2016-03-0411:01:30 AM | 56.862 | 124.925 | 24.8 | 79.25 |
| 2016-03-0411:01:34 AM | 56.862 | 125.038 | 24.8 | 79.25 |
| 2016-03-0411:01:38 AM | 56.75 | 125.15 | 24.912 | 79.25 |
| 2016-03-0411:01:42 AM | 56.75 | 125.262 | 24.912 | 79.25 |
| 2016-03-0411:01:46 AM | 56.75 | 125.375 | 24.912 | 79.25 |
| 2016-03-0411:01:50 AM | 56.638 | 125.488 | 25.025 | 79.25 |
| 2016-03-0411:01:54 AM | 56.638 | 125.6 | 25.025 | 79.25 |
| 2016-03-0411:01:58 AM | 56.638 | 125.712 | 25.138 | 79.25 |
| 2016-03-0411:02:02 AM | 56.638 | 125.825 | 25.025 | 79.25 |
| 2016-03-0411:02:06 AM | 56.638 | 125.938 | 25.025 | 79.138 |
| 2016-03-0411:02:10 AM | 56.638 | 126.05 | 24.912 | 79.25 |
| 2016-03-0411:02:14 AM | 56.638 | 126.163 | 24.8 | 79.138 |
| 2016-03-0411:02:18 AM | 56.525 | 126.388 | 24.8 | 79.25 |
| 2016-03-0411:02:22 AM | 56.525 | 126.388 | 24.8 | 79.25 |
| 2016-03-0411:02:26 AM | 56.525 | 126.612 | 24.8 | 79.25 |
| 2016-03-0411:02:30 AM | 56.525 | 126.725 | 24.912 | 79.25 |
| 2016-03-0411:02:34 AM | 56.525 | 126.838 | 24.912 | 79.25 |
| 2016-03-0411:02:38 AM | 56.525 | 126.95 | 25.025 | 79.25 |
| 2016-03-0411:02:42 AM | 56.525 | 127.175 | 25.138 | 79.25 |
| 2016-03-0411:02:46 AM | 56.525 | 127.288 | 25.25 | 79.25 |
| 2016-03-0411:02:50 AM | 56.525 | 127.512 | 25.25 | 79.25 |
| 2016-03-0411:02:54 AM | 56.525 | 127.625 | 25.362 | 79.25 |
| 2016-03-0411:02:58 AM | 56.525 | 127.738 | 25.362 | 79.25 |
| 2016-03-0411:03:02 AM | 56.638 | 127.962 | 25.25 | 79.25 |
| 2016-03-0411:03:06 AM | 56.525 | 128.075 | 25.25 | 79.25 |
| 2016-03-0411:03:10 AM | 56.638 | 128.3 | 25.138 | 79.25 |
| 2016-03-0411:03:14 AM | 56.638 | 128.412 | 25.025 | 79.25 |
| 2016-03-0411:03:19 AM | 56.638 | 128.525 | 24.688 | 79.25 |
| 2016-03-0411:03:23 AM | 56.75 | 128.75 | 24.35 | 79.25 |
| 2016-03-0411:03:27 AM | 56.75 | 128.863 | 24.125 | 79.25 |
| 2016-03-0411:03:31 AM | 56.75 | 128.975 | 24.012 | 79.25 |
| 2016-03-0411:03:35 AM | 56.862 | 129.088 | 23.9 | 79.25 |
| 2016-03-0411:03:39 AM | 56.862 | 129.312 | 23.9 | 79.25 |
| 2016-03-0411:03:43 AM | 56.862 | 129.425 | 24.012 | 79.25 |
| 2016-03-0411:03:47 AM | 56.975 | 129.538 | 24.125 | 79.25 |
| 2016-03-0411:03:51 AM | 56.862 | 129.762 | 24.238 | 79.25 |
| 2016-03-0411:03:55 AM | 56.975 | 129.875 | 24.35 | 79.25 |
| 2016-03-0411:03:59 AM | 56.975 | 130.1 | 24.462 | 79.25 |
| 2016-03-0411:04:03 AM | 56.975 | 130.212 | 24.462 | 79.25 |
| 2016-03-0411:04:07 AM | 56.975 | 130.325 | 24.575 | 79.25 |
| 2016-03-0411:04:11 AM | 56.975 | 130.438 | 24.688 | 79.25 |
| 2016-03-0411:04:15 AM | 56.975 | 130.55 | 24.688 | 79.25 |
| 2016-03-0411:04:19 AM | 56.975 | 130.775 | 24.8 | 79.25 |
| 2016-03-0411:04:23 AM | 56.975 | 130.887 | 24.8 | 79.25 |
| 2016-03-0411:04:27 AM | 56.975 | 131 | 24.912 | 79.25 |
| 2016-03-0411:04:31 AM | 57.088 | 131.112 | 25.025 | 79.25 |
| 2016-03-0411:04:36 AM | 57.088 | 131.338 | 25.25 | 79.25 |
| 2016-03-0411:04:40 AM | 57.088 | 131.45 | 25.25 | 79.25 |
| 2016-03-0411:04:44 AM | 57.088 | 131.562 | 25.362 | 79.25 |
| 2016-03-0411:04:48 AM | 57.088 | 131.675 | 25.362 | 79.25 |
| 2016-03-0411:04:52 AM | 57.088 | 131.788 | 25.25 | 79.25 |
| 2016-03-0411:04:56 AM | 57.2 | 132.012 | 25.138 | 79.25 |
| 2016-03-0411:05:00 AM | 57.2 | 132.125 | 25.138 | 79.25 |
| 2016-03-0411:05:04 AM | 57.2 | 132.238 | 25.025 | 79.25 |
| 2016-03-0411:05:08 AM | 57.2 | 132.462 | 25.025 | 79.25 |
| 2016-03-0411:05:12 AM | 57.2 | 132.462 | 25.025 | 79.25 |
| 2016-03-0411:05:16 AM | 57.088 | 132.688 | 25.025 | 79.362 |
| 2016-03-0411:05:20 AM | 57.088 | 132.8 | 25.025 | 79.362 |
| 2016-03-0411:05:24 AM | 57.088 | 132.912 | 25.025 | 79.362 |
| 2016-03-0411:05:28 AM | 57.088 | 133.138 | 24.912 | 79.362 |
| 2016-03-0411:05:32 AM | 57.088 | 133.25 | 24.912 | 79.362 |
| 2016-03-0411:05:36 AM | 57.088 | 133.475 | 24.912 | 79.362 |
| 2016-03-0411:05:40 AM | 57.088 | 133.588 | 24.912 | 79.362 |
| 2016-03-0411:05:44 AM | 57.088 | 133.7 | 25.025 | 79.25 |
| 2016-03-0411:05:48 AM | 57.088 | 133.925 | 25.138 | 79.25 |
| 2016-03-0411:05:52 AM | 57.088 | 134.038 | 25.138 | 79.25 |
| 2016-03-0411:05:56 AM | 57.088 | 134.15 | 25.138 | 79.25 |
| 2016-03-0411:06:00 AM | 57.088 | 134.262 | 25.138 | 79.25 |
| 2016-03-0411:06:04 AM | 56.975 | 134.375 | 25.025 | 79.25 |
| 2016-03-0411:06:09 AM | 57.088 | 134.488 | 24.8 | 79.25 |
| 2016-03-0411:06:13 AM | 57.088 | 134.6 | 24.575 | 79.25 |
| 2016-03-0411:06:17 AM | 57.088 | 134.712 | 24.35 | 79.25 |
| 2016-03-0411:06:21 AM | 57.2 | 134.712 | 24.238 | 79.25 |
| 2016-03-0411:06:25 AM | 57.2 | 134.825 | 24.125 | 79.25 |
| 2016-03-0411:06:29 AM | 57.2 | 134.938 | 24.125 | 79.25 |
| 2016-03-0411:06:33 AM | 57.2 | 134.938 | 24.012 | 79.25 |
| 2016-03-0411:06:37 AM | 57.2 | 134.938 | 24.125 | 79.25 |
| 2016-03-0411:06:41 AM | 57.2 | 135.05 | 24.125 | 79.25 |
| 2016-03-0411:06:45 AM | 57.2 | 135.05 | 24.125 | 79.25 |
| 2016-03-0411:06:49 AM | 57.2 | 135.162 | 24.125 | 79.362 |
| 2016-03-0411:06:53 AM | 57.2 | 135.162 | 24.125 | 79.362 |
| 2016-03-0411:06:58 AM | 57.2 | 135.275 | 24.238 | 79.25 |
| 2016-03-0411:07:02 AM | 57.2 | 135.275 | 24.238 | 79.362 |
| 2016-03-0411:07:06 AM | 57.2 | 135.275 | 24.35 | 79.25 |
| 2016-03-0411:07:10 AM | 57.2 | 135.275 | 24.462 | 79.25 |
| 2016-03-0411:07:14 AM | 57.2 | 135.275 | 24.575 | 79.362 |
| 2016-03-0411:07:18 AM | 57.2 | 135.275 | 24.575 | 79.362 |
| 2016-03-0411:07:22 AM | 57.2 | 135.275 | 24.688 | 79.362 |
| 2016-03-0411:07:26 AM | 57.2 | 135.275 | 24.688 | 79.25 |
| 2016-03-0411:07:30 AM | 57.2 | 135.388 | 24.8 | 79.25 |
| 2016-03-0411:07:34 AM | 57.2 | 135.388 | 24.912 | 79.25 |
| 2016-03-0411:07:38 AM | 57.2 | 135.388 | 25.025 | 79.25 |
| 2016-03-0411:07:42 AM | 57.312 | 135.275 | 25.138 | 79.25 |
| 2016-03-0411:07:46 AM | 57.312 | 135.388 | 25.25 | 79.362 |
| 2016-03-0411:07:51 AM | 57.2 | 135.388 | 25.25 | 79.362 |
| 2016-03-0411:07:55 AM | 57.2 | 135.388 | 25.362 | 79.362 |
| 2016-03-0411:07:59 AM | 57.312 | 135.388 | 25.138 | 79.362 |
| 2016-03-0411:08:03 AM | 57.312 | 135.388 | 25.025 | 79.362 |
| 2016-03-0411:08:07 AM | 57.312 | 135.388 | 25.025 | 79.362 |
| 2016-03-0411:08:11 AM | 57.425 | 135.388 | 25.025 | 79.362 |
| 2016-03-0411:08:15 AM | 57.312 | 135.388 | 25.025 | 79.25 |
| 2016-03-0411:08:19 AM | 57.425 | 135.275 | 25.138 | 79.362 |
| 2016-03-0411:08:23 AM | 57.312 | 135.275 | 25.25 | 79.25 |
| 2016-03-0411:08:27 AM | 57.425 | 135.275 | 25.25 | 79.25 |
| 2016-03-0411:08:31 AM | 57.312 | 135.162 | 25.25 | 79.362 |
| 2016-03-0411:08:35 AM | 57.312 | 135.162 | 25.362 | 79.362 |
| 2016-03-0411:08:39 AM | 57.425 | 135.162 | 25.362 | 79.362 |
| 2016-03-0411:08:43 AM | 57.312 | 135.162 | 25.475 | 79.362 |
| 2016-03-0411:08:47 AM | 57.312 | 135.162 | 25.475 | 79.362 |
| 2016-03-0411:08:51 AM | 57.312 | 135.05 | 25.475 | 79.25 |
| 2016-03-0411:08:56 AM | 57.312 | 135.162 | 25.362 | 79.362 |
| 2016-03-0411:09:00 AM | 57.312 | 135.05 | 25.475 | 79.362 |
| 2016-03-0411:09:04 AM | 57.312 | 135.05 | 25.588 | 79.362 |
| 2016-03-0411:09:08 AM | 57.312 | 135.05 | 25.7 | 79.362 |
| 2016-03-0411:09:12 AM | 57.312 | 135.05 | 25.812 | 79.362 |
| 2016-03-0411:09:16 AM | 57.312 | 135.05 | 25.925 | 79.362 |
| 2016-03-0411:09:20 AM | 57.312 | 135.05 | 25.925 | 79.362 |
| 2016-03-0411:09:24 AM | 57.312 | 135.05 | 26.038 | 79.362 |
| 2016-03-0411:09:28 AM | 57.312 | 135.05 | 26.038 | 79.362 |
| 2016-03-0411:09:32 AM | 57.312 | 135.05 | 26.15 | 79.362 |
| 2016-03-0411:09:36 AM | 57.2 | 135.162 | 26.15 | 79.362 |
| 2016-03-0411:09:40 AM | 57.2 | 135.162 | 26.038 | 79.362 |
| 2016-03-0411:09:44 AM | 57.312 | 135.162 | 26.038 | 79.362 |
| 2016-03-0411:09:48 AM | 57.312 | 135.162 | 25.925 | 79.362 |
| 2016-03-0411:09:52 AM | 57.312 | 135.275 | 25.812 | 79.362 |
| 2016-03-0411:09:56 AM | 57.312 | 135.162 | 25.588 | 79.362 |
| 2016-03-0411:10:01 AM | 57.312 | 135.275 | 25.25 | 79.362 |
| 2016-03-0411:10:05 AM | 57.2 | 135.275 | 25.138 | 79.362 |
| 2016-03-0411:10:09 AM | 57.2 | 135.275 | 24.912 | 79.25 |
| 2016-03-0411:10:13 AM | 57.2 | 135.275 | 24.8 | 79.25 |
| 2016-03-0411:10:17 AM | 57.2 | 135.275 | 24.688 | 79.25 |
| 2016-03-0411:10:21 AM | 57.312 | 135.275 | 24.688 | 79.25 |
| 2016-03-0411:10:25 AM | 57.2 | 135.275 | 24.688 | 79.25 |
| 2016-03-0411:10:29 AM | 57.2 | 135.275 | 24.688 | 79.25 |
| 2016-03-0411:10:33 AM | 57.2 | 135.388 | 24.8 | 79.25 |
| 2016-03-0411:10:37 AM | 57.2 | 135.275 | 24.8 | 79.25 |
| 2016-03-0411:10:41 AM | 57.2 | 135.275 | 24.8 | 79.25 |
| 2016-03-0411:10:45 AM | 57.2 | 135.275 | 24.912 | 79.25 |
| 2016-03-0411:10:49 AM | 57.312 | 135.275 | 25.025 | 79.25 |
| 2016-03-0411:10:53 AM | 57.2 | 135.388 | 25.138 | 79.25 |
| 2016-03-0411:10:57 AM | 57.2 | 135.388 | 25.138 | 79.138 |
| 2016-03-0411:11:01 AM | 57.2 | 135.388 | 25.138 | 79.138 |
| 2016-03-0411:11:05 AM | 57.312 | 135.388 | 25.138 | 79.138 |
| 2016-03-0411:11:10 AM | 57.312 | 135.388 | 25.025 | 79.138 |
| 2016-03-0411:11:14 AM | 57.312 | 135.388 | 24.912 | 79.138 |
| 2016-03-0411:11:18 AM | 57.425 | 135.388 | 24.8 | 79.138 |
| 2016-03-0411:11:22 AM | 57.425 | 135.5 | 24.688 | 79.138 |
| 2016-03-0411:11:26 AM | 57.425 | 135.5 | 24.462 | 79.138 |
| 2016-03-0411:11:30 AM | 57.425 | 135.5 | 24.35 | 79.25 |
| 2016-03-0411:11:34 AM | 57.425 | 135.5 | 24.35 | 79.138 |
| 2016-03-0411:11:38 AM | 57.425 | 135.5 | 24.35 | 79.25 |
| 2016-03-0411:11:42 AM | 57.425 | 135.5 | 24.238 | 79.138 |
| 2016-03-0411:11:46 AM | 57.312 | 135.5 | 24.125 | 79.138 |
| 2016-03-0411:11:50 AM | 57.312 | 135.5 | 23.9 | 79.25 |
| 2016-03-0411:11:54 AM | 57.312 | 135.388 | 23.788 | 79.25 |
| 2016-03-0411:11:58 AM | 57.312 | 135.388 | 23.675 | 79.25 |
| 2016-03-0411:12:02 AM | 57.312 | 135.388 | 23.562 | 79.25 |
| 2016-03-0411:12:06 AM | 57.312 | 135.388 | 23.338 | 79.138 |
| 2016-03-0411:12:10 AM | 57.312 | 135.388 | 23 | 79.138 |
| 2016-03-0411:12:14 AM | 57.2 | 135.275 | 22.888 | 79.138 |
| 2016-03-0411:12:18 AM | 57.312 | 135.275 | 22.888 | 79.138 |
| 2016-03-0411:12:22 AM | 57.2 | 135.162 | 22.775 | 79.138 |
| 2016-03-0411:12:27 AM | 57.2 | 135.162 | 22.775 | 79.25 |
| 2016-03-0411:12:31 AM | 57.088 | 135.162 | 22.662 | 79.138 |
| 2016-03-0411:12:35 AM | 57.088 | 135.05 | 22.662 | 79.25 |
| 2016-03-0411:12:39 AM | 57.088 | 135.05 | 22.55 | 79.25 |
| 2016-03-0411:12:43 AM | 56.975 | 134.938 | 22.325 | 79.25 |
| 2016-03-0411:12:47 AM | 56.975 | 134.825 | 22.212 | 79.25 |
| 2016-03-0411:12:51 AM | 56.975 | 134.825 | 22.212 | 79.138 |
| 2016-03-0411:12:55 AM | 56.975 | 134.712 | 22.1 | 79.25 |
| 2016-03-0411:12:59 AM | 56.975 | 134.6 | 22.1 | 79.25 |
| 2016-03-0411:13:03 AM | 56.975 | 134.6 | 21.988 | 79.25 |
| 2016-03-0411:13:07 AM | 56.975 | 134.488 | 21.988 | 79.25 |
| 2016-03-0411:13:11 AM | 56.975 | 134.488 | 21.988 | 79.25 |
| 2016-03-0411:13:15 AM | 56.975 | 134.375 | 21.988 | 79.25 |
| 2016-03-0411:13:19 AM | 56.862 | 134.262 | 21.988 | 79.25 |
| 2016-03-0411:13:23 AM | 56.975 | 134.262 | 22.1 | 79.25 |
| 2016-03-0411:13:27 AM | 56.862 | 134.15 | 21.988 | 79.362 |
| 2016-03-0411:13:31 AM | 56.862 | 134.15 | 21.875 | 79.25 |
| 2016-03-0411:13:35 AM | 56.75 | 134.038 | 21.875 | 79.362 |
| 2016-03-0411:13:39 AM | 56.75 | 134.038 | 21.762 | 79.362 |
| 2016-03-0411:13:43 AM | 56.75 | 133.925 | 21.762 | 79.362 |
| 2016-03-0411:13:47 AM | 56.638 | 133.925 | 21.65 | 79.25 |
| 2016-03-0411:13:51 AM | 56.638 | 133.812 | 21.762 | 79.362 |
| 2016-03-0411:13:55 AM | 56.638 | 133.812 | 21.875 | 79.362 |
| 2016-03-0411:13:59 AM | 56.525 | 133.7 | 21.988 | 79.362 |
| 2016-03-0411:14:03 AM | 56.525 | 133.7 | 21.988 | 79.362 |
| 2016-03-0411:14:07 AM | 56.525 | 133.588 | 22.212 | 79.362 |
| 2016-03-0411:14:11 AM | 56.525 | 133.588 | 22.325 | 79.25 |
| 2016-03-0411:14:15 AM | 56.525 | 133.588 | 22.438 | 79.362 |
| 2016-03-0411:14:19 AM | 56.412 | 133.475 | 22.438 | 79.362 |
| 2016-03-0411:14:23 AM | 56.412 | 133.362 | 22.55 | 79.362 |
| 2016-03-0411:14:27 AM | 56.412 | 133.362 | 22.662 | 79.362 |
| 2016-03-0411:14:32 AM | 56.412 | 133.25 | 22.775 | 79.25 |
| 2016-03-0411:14:36 AM | 56.412 | 133.25 | 22.888 | 79.362 |
| 2016-03-0411:14:40 AM | 56.412 | 133.138 | 22.888 | 79.362 |
| 2016-03-0411:14:44 AM | 56.412 | 133.138 | 23.112 | 79.362 |
| 2016-03-0411:14:48 AM | 56.412 | 133.025 | 23.225 | 79.362 |
| 2016-03-0411:14:52 AM | 56.412 | 133.025 | 23.338 | 79.362 |
| 2016-03-0411:14:56 AM | 56.525 | 132.912 | 23.45 | 79.362 |
| 2016-03-0411:15:00 AM | 56.412 | 132.912 | 23.338 | 79.362 |
| 2016-03-0411:15:04 AM | 56.525 | 132.912 | 23.338 | 79.362 |
| 2016-03-0411:15:08 AM | 56.525 | 132.912 | 23.225 | 79.362 |
| 2016-03-0411:15:12 AM | 56.525 | 132.912 | 23.225 | 79.362 |
| 2016-03-0411:15:16 AM | 56.525 | 132.912 | 23.112 | 79.362 |
| 2016-03-0411:15:20 AM | 56.525 | 132.8 | 23.225 | 79.362 |
| 2016-03-0411:15:24 AM | 56.525 | 132.912 | 23.225 | 79.362 |
| 2016-03-0411:15:28 AM | 56.525 | 132.8 | 23.338 | 79.362 |
| 2016-03-0411:15:32 AM | 56.525 | 132.8 | 23.45 | 79.362 |
| 2016-03-0411:15:36 AM | 56.525 | 132.912 | 23.45 | 79.362 |
| 2016-03-0411:15:40 AM | 56.638 | 132.8 | 23.562 | 79.362 |
| 2016-03-0411:15:44 AM | 56.638 | 132.8 | 23.562 | 79.362 |
| 2016-03-0411:15:48 AM | 56.638 | 132.8 | 23.562 | 79.362 |
| 2016-03-0411:15:52 AM | 56.638 | 132.8 | 23.562 | 79.362 |
| 2016-03-0411:15:56 AM | 56.638 | 132.8 | 23.45 | 79.362 |
| 2016-03-0411:16:00 AM | 56.75 | 132.8 | 23.562 | 79.362 |
| 2016-03-0411:16:04 AM | 56.75 | 132.8 | 23.562 | 79.362 |
| 2016-03-0411:16:08 AM | 56.75 | 132.8 | 23.562 | 79.475 |
| 2016-03-0411:16:12 AM | 56.75 | 132.912 | 23.562 | 79.362 |
| 2016-03-0411:16:16 AM | 56.862 | 132.912 | 23.562 | 79.362 |
| 2016-03-0411:16:20 AM | 56.862 | 132.912 | 23.675 | 79.475 |
| 2016-03-0411:16:24 AM | 56.75 | 133.025 | 23.788 | 79.362 |
| 2016-03-0411:16:28 AM | 56.75 | 133.025 | 23.788 | 79.362 |
| 2016-03-0411:16:32 AM | 56.862 | 133.025 | 23.9 | 79.362 |
| 2016-03-0411:16:37 AM | 56.75 | 132.912 | 24.125 | 79.362 |
| 2016-03-0411:16:41 AM | 56.75 | 132.8 | 24.125 | 79.362 |
| 2016-03-0411:16:45 AM | 56.75 | 132.912 | 24.238 | 79.362 |
| 2016-03-0411:16:49 AM | 56.75 | 132.8 | 24.238 | 79.475 |
| 2016-03-0411:16:53 AM | 56.75 | 132.8 | 24.238 | 79.475 |
| 2016-03-0411:16:57 AM | 56.862 | 132.688 | 24.238 | 79.362 |
| 2016-03-0411:17:01 AM | 56.975 | 132.688 | 24.125 | 79.475 |
| 2016-03-0411:17:05 AM | 56.975 | 132.575 | 24.012 | 79.475 |
| 2016-03-0411:17:09 AM | 56.975 | 132.462 | 23.9 | 79.362 |
| 2016-03-0411:17:13 AM | 57.088 | 132.462 | 23.788 | 79.362 |
| 2016-03-0411:17:17 AM | 56.975 | 132.462 | 23.788 | 79.475 |
| 2016-03-0411:17:21 AM | 57.088 | 132.35 | 23.675 | 79.475 |
| 2016-03-0411:17:25 AM | 57.088 | 132.238 | 23.675 | 79.475 |
| 2016-03-0411:17:29 AM | 57.088 | 132.238 | 23.675 | 79.475 |
| 2016-03-0411:17:33 AM | 56.975 | 132.238 | 23.675 | 79.362 |
| 2016-03-0411:17:37 AM | 57.088 | 132.125 | 23.788 | 79.475 |
| 2016-03-0411:17:41 AM | 57.088 | 132.125 | 23.9 | 79.475 |
| 2016-03-0411:17:45 AM | 56.975 | 132.012 | 23.9 | 79.475 |
| 2016-03-0411:17:49 AM | 57.088 | 132.012 | 24.012 | 79.475 |
| 2016-03-0411:17:53 AM | 57.088 | 131.9 | 24.012 | 79.475 |
| 2016-03-0411:17:57 AM | 57.088 | 131.9 | 24.125 | 79.475 |
| 2016-03-0411:18:01 AM | 57.088 | 131.9 | 24.125 | 79.475 |
| 2016-03-0411:18:05 AM | 56.975 | 131.788 | 24.238 | 79.475 |
| 2016-03-0411:18:09 AM | 57.088 | 131.788 | 24.238 | 79.475 |
| 2016-03-0411:18:13 AM | 56.975 | 131.788 | 24.35 | 79.475 |
| 2016-03-0411:18:17 AM | 56.975 | 131.675 | 24.35 | 79.362 |
| 2016-03-0411:18:21 AM | 57.088 | 131.675 | 24.35 | 79.362 |
| 2016-03-0411:18:25 AM | 57.088 | 131.675 | 24.35 | 79.362 |
| 2016-03-0411:18:30 AM | 57.088 | 131.562 | 24.238 | 79.362 |
| 2016-03-0411:18:34 AM | 57.088 | 131.562 | 24.125 | 79.362 |
| 2016-03-0411:18:38 AM | 57.2 | 131.562 | 23.9 | 79.362 |
| 2016-03-0411:18:42 AM | 57.2 | 131.562 | 23.675 | 79.475 |
| 2016-03-0411:18:46 AM | 57.2 | 131.562 | 23.45 | 79.362 |
| 2016-03-0411:18:50 AM | 57.312 | 131.562 | 23.338 | 79.362 |
| 2016-03-0411:18:54 AM | 57.312 | 131.45 | 23.338 | 79.362 |
| 2016-03-0411:18:58 AM | 57.312 | 131.45 | 23.225 | 79.362 |
| 2016-03-0411:19:02 AM | 57.312 | 131.45 | 23.112 | 79.475 |
| 2016-03-0411:19:06 AM | 57.425 | 131.45 | 22.888 | 79.362 |
| 2016-03-0411:19:10 AM | 57.538 | 131.338 | 22.888 | 79.362 |
| 2016-03-0411:19:14 AM | 57.538 | 131.338 | 22.888 | 79.475 |
| 2016-03-0411:19:18 AM | 57.538 | 131.338 | 22.888 | 79.475 |
| 2016-03-0411:19:22 AM | 57.538 | 131.338 | 22.775 | 79.475 |
| 2016-03-0411:19:26 AM | 57.65 | 131.225 | 22.775 | 79.362 |
| 2016-03-0411:19:30 AM | 57.65 | 131.225 | 22.662 | 79.362 |
| 2016-03-0411:19:34 AM | 57.65 | 131.112 | 22.438 | 79.475 |
| 2016-03-0411:19:38 AM | 57.65 | 131.112 | 22.325 | 79.475 |
| 2016-03-0411:19:42 AM | 57.762 | 131.112 | 22.212 | 79.362 |
| 2016-03-0411:19:46 AM | 57.762 | 131 | 21.988 | 79.475 |
| 2016-03-0411:19:50 AM | 57.875 | 130.887 | 21.65 | 79.475 |
| 2016-03-0411:19:54 AM | 57.875 | 130.887 | 21.538 | 79.475 |
| 2016-03-0411:19:58 AM | 57.875 | 130.775 | 21.312 | 79.362 |
| 2016-03-0411:20:02 AM | 57.988 | 130.775 | 21.2 | 79.362 |
| 2016-03-0411:20:06 AM | 57.988 | 130.775 | 21.088 | 79.362 |
| 2016-03-0411:20:10 AM | 57.875 | 130.662 | 21.088 | 79.362 |
| 2016-03-0411:20:14 AM | 57.875 | 130.662 | 21.2 | 79.475 |
| 2016-03-0411:20:18 AM | 57.988 | 130.55 | 21.312 | 79.362 |
| 2016-03-0411:20:22 AM | 57.875 | 130.55 | 21.425 | 79.362 |
| 2016-03-0411:20:26 AM | 57.988 | 130.55 | 21.538 | 79.362 |
| 2016-03-0411:20:30 AM | 57.875 | 130.55 | 21.65 | 79.362 |
| 2016-03-0411:20:34 AM | 57.875 | 130.438 | 21.762 | 79.362 |
| 2016-03-0411:20:38 AM | 57.875 | 130.55 | 21.762 | 79.362 |
| 2016-03-0411:20:42 AM | 57.875 | 130.438 | 21.875 | 79.362 |
| 2016-03-0411:20:46 AM | 57.875 | 130.55 | 21.875 | 79.362 |
| 2016-03-0411:20:50 AM | 57.875 | 130.438 | 21.875 | 79.362 |
| 2016-03-0411:20:54 AM | 57.875 | 130.438 | 21.875 | 79.362 |
| 2016-03-0411:20:59 AM | 57.762 | 130.438 | 21.875 | 79.362 |
| 2016-03-0411:21:03 AM | 57.762 | 130.438 | 21.875 | 79.362 |
| 2016-03-0411:21:07 AM | 57.875 | 130.438 | 21.988 | 79.362 |
| 2016-03-0411:21:11 AM | 57.875 | 130.438 | 21.875 | 79.362 |
| 2016-03-0411:21:15 AM | 57.762 | 130.438 | 21.988 | 79.362 |
| 2016-03-0411:21:19 AM | 57.762 | 130.55 | 21.988 | 79.362 |
| 2016-03-0411:21:23 AM | 57.762 | 130.55 | 21.988 | 79.362 |
| 2016-03-0411:21:27 AM | 57.762 | 130.55 | 21.988 | 79.362 |
| 2016-03-0411:21:31 AM | 57.762 | 130.55 | 21.988 | 79.362 |
| 2016-03-0411:21:35 AM | 57.762 | 130.438 | 21.988 | 79.362 |
| 2016-03-0411:21:39 AM | 57.762 | 130.438 | 21.988 | 79.362 |
| 2016-03-0411:21:43 AM | 57.762 | 130.55 | 21.988 | 79.362 |
| 2016-03-0411:21:47 AM | 57.65 | 130.55 | 21.988 | 79.362 |
| 2016-03-0411:21:51 AM | 57.762 | 130.438 | 22.1 | 79.362 |
| 2016-03-0411:21:55 AM | 57.65 | 130.55 | 22.212 | 79.362 |
| 2016-03-0411:21:59 AM | 57.65 | 130.438 | 22.212 | 79.362 |
| 2016-03-0411:22:03 AM | 57.65 | 130.438 | 22.325 | 79.362 |
| 2016-03-0411:22:07 AM | 57.65 | 130.438 | 22.438 | 79.362 |
| 2016-03-0411:22:11 AM | 57.762 | 130.438 | 22.55 | 79.362 |
| 2016-03-0411:22:15 AM | 57.65 | 130.325 | 22.662 | 79.362 |
| 2016-03-0411:22:19 AM | 57.65 | 130.325 | 22.775 | 79.362 |
| 2016-03-0411:22:23 AM | 57.65 | 130.212 | 22.888 | 79.362 |
| 2016-03-0411:22:27 AM | 57.65 | 130.212 | 23 | 79.362 |
| 2016-03-0411:22:31 AM | 57.538 | 130.1 | 22.888 | 79.362 |
| 2016-03-0411:22:35 AM | 57.538 | 130.1 | 22.662 | 79.362 |
| 2016-03-0411:22:39 AM | 57.538 | 130.1 | 22.55 | 79.362 |
| 2016-03-0411:22:43 AM | 57.65 | 130.1 | 22.438 | 79.362 |
| 2016-03-0411:22:47 AM | 57.65 | 130.1 | 22.212 | 79.362 |
| 2016-03-0411:22:51 AM | 57.65 | 130.1 | 22.1 | 79.362 |
| 2016-03-0411:22:55 AM | 57.65 | 130.1 | 22.212 | 79.362 |
| 2016-03-0411:22:59 AM | 57.65 | 130.1 | 22.325 | 79.25 |
| 2016-03-0411:23:03 AM | 57.65 | 130.1 | 22.438 | 79.25 |
| 2016-03-0411:23:07 AM | 57.762 | 129.988 | 22.55 | 79.25 |
| 2016-03-0411:23:11 AM | 57.762 | 129.988 | 22.55 | 79.25 |
| 2016-03-0411:23:15 AM | 57.762 | 129.988 | 22.55 | 79.25 |
| 2016-03-0411:23:19 AM | 57.762 | 129.988 | 22.438 | 79.25 |
| 2016-03-0411:23:23 AM | 57.875 | 130.1 | 22.55 | 79.25 |
| 2016-03-0411:23:28 AM | 57.875 | 130.1 | 22.438 | 79.25 |
| 2016-03-0411:23:32 AM | 57.875 | 129.988 | 22.55 | 79.25 |
| 2016-03-0411:23:36 AM | 57.875 | 130.1 | 22.662 | 79.25 |
| 2016-03-0411:23:40 AM | 57.875 | 130.1 | 22.662 | 79.25 |
| 2016-03-0411:23:44 AM | 57.875 | 130.1 | 22.662 | 79.25 |
| 2016-03-0411:23:48 AM | 57.875 | 130.1 | 22.775 | 79.25 |
| 2016-03-0411:23:52 AM | 57.875 | 130.1 | 22.775 | 79.25 |
| 2016-03-0411:23:56 AM | 57.988 | 130.1 | 22.775 | 79.25 |
| 2016-03-0411:24:00 AM | 57.988 | 130.1 | 22.662 | 79.25 |
| 2016-03-0411:24:04 AM | 57.988 | 130.1 | 22.55 | 79.25 |
| 2016-03-0411:24:08 AM | 57.988 | 130.1 | 22.55 | 79.25 |
| 2016-03-0411:24:12 AM | 57.988 | 130.1 | 22.55 | 79.25 |
| 2016-03-0411:24:16 AM | 57.988 | 130.1 | 22.55 | 79.25 |
| 2016-03-0411:24:20 AM | 57.988 | 130.1 | 22.55 | 79.25 |
| 2016-03-0411:24:24 AM | 57.988 | 130.1 | 22.662 | 79.25 |
| 2016-03-0411:24:28 AM | 57.988 | 130.1 | 22.775 | 79.25 |
| 2016-03-0411:24:32 AM | 57.988 | 129.988 | 22.775 | 79.25 |
| 2016-03-0411:24:36 AM | 57.988 | 129.988 | 22.888 | 79.25 |
| 2016-03-0411:24:40 AM | 57.988 | 129.988 | 23 | 79.25 |
| 2016-03-0411:24:44 AM | 57.988 | 129.988 | 23.225 | 79.25 |
| 2016-03-0411:24:48 AM | 57.988 | 129.988 | 23.338 | 79.25 |
| 2016-03-0411:24:52 AM | 57.988 | 129.875 | 23.562 | 79.25 |
| 2016-03-0411:24:56 AM | 58.1 | 129.875 | 23.675 | 79.25 |
| 2016-03-0411:25:00 AM | 57.988 | 129.875 | 23.788 | 79.25 |
| 2016-03-0411:25:04 AM | 58.1 | 129.875 | 23.9 | 79.25 |
| 2016-03-0411:25:08 AM | 58.1 | 129.762 | 24.125 | 79.25 |
| 2016-03-0411:25:12 AM | 58.1 | 129.762 | 24.238 | 79.25 |
| 2016-03-0411:25:16 AM | 58.1 | 129.762 | 24.35 | 79.25 |
| 2016-03-0411:25:20 AM | 58.1 | 129.65 | 24.462 | 79.25 |
| 2016-03-0411:25:24 AM | 58.212 | 129.762 | 24.688 | 79.25 |
| 2016-03-0411:25:28 AM | 58.212 | 129.762 | 24.8 | 79.25 |
| 2016-03-0411:25:32 AM | 58.212 | 129.65 | 24.912 | 79.138 |
| 2016-03-0411:25:36 AM | 58.212 | 129.762 | 25.025 | 79.138 |
| 2016-03-0411:25:40 AM | 58.212 | 129.65 | 25.138 | 79.25 |
| 2016-03-0411:25:44 AM | 58.212 | 129.762 | 25.138 | 79.25 |
| 2016-03-0411:25:48 AM | 58.325 | 129.65 | 25.25 | 79.25 |
| 2016-03-0411:25:52 AM | 58.212 | 129.65 | 25.25 | 79.25 |
| 2016-03-0411:25:57 AM | 58.212 | 129.65 | 25.25 | 79.138 |
| 2016-03-0411:26:01 AM | 58.212 | 129.65 | 25.25 | 79.138 |
| 2016-03-0411:26:05 AM | 58.212 | 129.65 | 25.138 | 79.138 |
| 2016-03-0411:26:09 AM | 58.325 | 129.538 | 25.025 | 79.138 |
| 2016-03-0411:26:13 AM | 58.325 | 129.65 | 24.912 | 79.138 |
| 2016-03-0411:26:17 AM | 58.438 | 129.538 | 24.912 | 79.138 |
| 2016-03-0411:26:21 AM | 58.438 | 129.538 | 25.025 | 79.138 |
| 2016-03-0411:26:25 AM | 58.438 | 129.538 | 25.025 | 79.138 |
| 2016-03-0411:26:29 AM | 58.438 | 129.425 | 25.138 | 79.138 |
| 2016-03-0411:26:33 AM | 58.55 | 129.425 | 25.25 | 79.25 |
| 2016-03-0411:26:37 AM | 58.55 | 129.425 | 25.25 | 79.138 |
| 2016-03-0411:26:41 AM | 58.55 | 129.425 | 25.138 | 79.138 |
| 2016-03-0411:26:45 AM | 58.55 | 129.425 | 25.138 | 79.138 |
| 2016-03-0411:26:49 AM | 58.55 | 129.425 | 25.138 | 79.138 |
| 2016-03-0411:26:53 AM | 58.55 | 129.425 | 25.138 | 79.138 |
| 2016-03-0411:26:57 AM | 58.438 | 129.425 | 25.138 | 79.138 |
| 2016-03-0411:27:01 AM | 58.55 | 129.312 | 25.25 | 79.138 |
| 2016-03-0411:27:05 AM | 58.55 | 129.312 | 25.25 | 79.138 |
| 2016-03-0411:27:09 AM | 58.55 | 129.312 | 25.362 | 79.138 |
| 2016-03-0411:27:13 AM | 58.55 | 129.312 | 25.475 | 79.138 |
| 2016-03-0411:27:17 AM | 58.55 | 129.312 | 25.588 | 79.138 |
| 2016-03-0411:27:21 AM | 58.55 | 129.2 | 25.588 | 79.138 |
| 2016-03-0411:27:25 AM | 58.55 | 129.2 | 25.588 | 79.138 |
| 2016-03-0411:27:29 AM | 58.55 | 129.2 | 25.588 | 79.138 |
| 2016-03-0411:27:33 AM | 58.662 | 129.2 | 25.7 | 79.138 |
| 2016-03-0411:27:37 AM | 58.55 | 129.2 | 25.7 | 79.025 |
| 2016-03-0411:27:41 AM | 58.55 | 129.2 | 25.7 | 79.025 |
| 2016-03-0411:27:45 AM | 58.55 | 129.2 | 25.7 | 79.138 |
| 2016-03-0411:27:49 AM | 58.55 | 129.2 | 25.812 | 79.138 |
| 2016-03-0411:27:53 AM | 58.55 | 129.2 | 25.7 | 79.138 |
| 2016-03-0411:27:57 AM | 58.662 | 129.088 | 25.588 | 79.025 |
| 2016-03-0411:28:01 AM | 58.662 | 129.088 | 25.475 | 79.025 |
| 2016-03-0411:28:05 AM | 58.662 | 129.088 | 25.25 | 79.025 |
| 2016-03-0411:28:10 AM | 58.662 | 129.2 | 25.138 | 79.025 |
| 2016-03-0411:28:14 AM | 58.662 | 129.2 | 25.025 | 79.138 |
| 2016-03-0411:28:18 AM | 58.775 | 129.2 | 24.912 | 79.138 |
| 2016-03-0411:28:22 AM | 58.662 | 129.088 | 24.912 | 79.138 |
| 2016-03-0411:28:26 AM | 58.775 | 129.088 | 24.8 | 79.025 |
| 2016-03-0411:28:30 AM | 58.888 | 129.088 | 24.912 | 79.025 |
| 2016-03-0411:28:34 AM | 58.888 | 129.088 | 24.912 | 79.025 |
| 2016-03-0411:28:38 AM | 58.888 | 129.088 | 24.912 | 79.025 |
| 2016-03-0411:28:42 AM | 58.888 | 129.088 | 25.025 | 79.138 |
| 2016-03-0411:28:46 AM | 58.888 | 129.088 | 25.025 | 79.025 |
| 2016-03-0411:28:50 AM | 59 | 129.088 | 25.138 | 79.025 |
| 2016-03-0411:28:54 AM | 59 | 129.2 | 25.138 | 79.025 |
| 2016-03-0411:28:58 AM | 59 | 129.2 | 25.138 | 79.025 |
| 2016-03-0411:29:02 AM | 59 | 129.312 | 25.25 | 79.025 |
| 2016-03-0411:29:06 AM | 59 | 129.312 | 25.362 | 79.025 |
| 2016-03-0411:29:10 AM | 59 | 129.312 | 25.362 | 79.025 |
| 2016-03-0411:29:14 AM | 59 | 129.312 | 25.25 | 79.025 |
| 2016-03-0411:29:18 AM | 59 | 129.425 | 25.138 | 79.025 |
| 2016-03-0411:29:22 AM | 58.888 | 129.538 | 25.138 | 79.025 |
| 2016-03-0411:29:26 AM | 58.888 | 129.538 | 25.25 | 79.025 |
| 2016-03-0411:29:30 AM | 58.888 | 129.65 | 25.25 | 79.025 |
| 2016-03-0411:29:34 AM | 58.888 | 129.762 | 25.25 | 79.025 |
| 2016-03-0411:29:38 AM | 58.888 | 129.762 | 25.138 | 79.025 |
| 2016-03-0411:29:42 AM | 58.775 | 129.875 | 25.138 | 79.025 |
| 2016-03-0411:29:46 AM | 58.775 | 129.875 | 24.912 | 79.025 |
| 2016-03-0411:29:50 AM | 58.775 | 129.988 | 24.8 | 79.025 |
| 2016-03-0411:29:54 AM | 58.662 | 129.988 | 24.688 | 79.025 |
| 2016-03-0411:29:58 AM | 58.662 | 129.988 | 24.688 | 79.025 |
| 2016-03-0411:30:02 AM | 58.662 | 130.1 | 24.688 | 79.025 |
| 2016-03-0411:30:06 AM | 58.55 | 130.212 | 24.688 | 79.025 |
| 2016-03-0411:30:10 AM | 58.55 | 130.212 | 24.688 | 79.025 |
| 2016-03-0411:30:14 AM | 58.438 | 130.325 | 24.575 | 79.025 |
| 2016-03-0411:30:18 AM | 58.438 | 130.325 | 24.575 | 79.025 |
| 2016-03-0411:30:22 AM | 58.438 | 130.438 | 24.462 | 79.025 |
| 2016-03-0411:30:26 AM | 58.438 | 130.438 | 24.462 | 79.025 |
| 2016-03-0411:30:30 AM | 58.325 | 130.55 | 24.462 | 79.025 |
| 2016-03-0411:30:35 AM | 58.325 | 130.55 | 24.462 | 79.025 |
| 2016-03-0411:30:39 AM | 58.325 | 130.55 | 24.462 | 79.025 |
| 2016-03-0411:30:43 AM | 58.212 | 130.662 | 24.575 | 79.025 |
| 2016-03-0411:30:47 AM | 58.212 | 130.662 | 24.575 | 79.025 |
| 2016-03-0411:30:51 AM | 58.1 | 130.775 | 24.575 | 79.025 |
| 2016-03-0411:30:55 AM | 58.1 | 130.775 | 24.575 | 79.025 |
| 2016-03-0411:30:59 AM | 57.988 | 130.775 | 24.688 | 79.025 |
| 2016-03-0411:31:03 AM | 57.988 | 130.775 | 24.8 | 79.025 |
| 2016-03-0411:31:07 AM | 57.988 | 130.775 | 24.8 | 79.025 |
| 2016-03-0411:31:11 AM | 57.988 | 130.775 | 24.8 | 79.025 |
| 2016-03-0411:31:15 AM | 57.988 | 130.887 | 24.8 | 79.025 |
| 2016-03-0411:31:19 AM | 57.875 | 130.887 | 24.912 | 79.025 |
| 2016-03-0411:31:23 AM | 57.875 | 130.887 | 24.912 | 79.025 |
| 2016-03-0411:31:27 AM | 57.875 | 130.887 | 25.025 | 79.025 |
| 2016-03-0411:31:31 AM | 57.875 | 130.887 | 25.025 | 78.912 |
| 2016-03-0411:31:35 AM | 57.762 | 130.887 | 25.025 | 79.025 |
| 2016-03-0411:31:39 AM | 57.762 | 130.887 | 25.138 | 79.025 |
| 2016-03-0411:31:43 AM | 57.762 | 130.887 | 25.138 | 78.912 |
| 2016-03-0411:31:47 AM | 57.65 | 130.887 | 25.138 | 79.025 |
| 2016-03-0411:31:51 AM | 57.65 | 130.887 | 25.138 | 79.025 |
| 2016-03-0411:31:55 AM | 57.65 | 130.887 | 25.025 | 79.025 |
| 2016-03-0411:31:59 AM | 57.538 | 130.887 | 25.025 | 79.025 |
| 2016-03-0411:32:03 AM | 57.538 | 130.775 | 25.025 | 79.025 |
| 2016-03-0411:32:07 AM | 57.538 | 130.775 | 24.912 | 78.912 |
| 2016-03-0411:32:11 AM | 57.425 | 130.662 | 24.912 | 79.025 |
| 2016-03-0411:32:15 AM | 57.425 | 130.662 | 24.912 | 78.912 |
| 2016-03-0411:32:19 AM | 57.312 | 130.55 | 24.912 | 78.912 |
| 2016-03-0411:32:23 AM | 57.312 | 130.55 | 24.8 | 78.912 |
| 2016-03-0411:32:27 AM | 57.312 | 130.55 | 24.688 | 78.912 |
| 2016-03-0411:32:31 AM | 57.312 | 130.438 | 24.8 | 78.912 |
| 2016-03-0411:32:35 AM | 57.312 | 130.325 | 24.8 | 78.912 |
| 2016-03-0411:32:39 AM | 57.312 | 130.325 | 24.8 | 78.912 |
| 2016-03-0411:32:43 AM | 57.312 | 130.325 | 24.8 | 78.912 |
| 2016-03-0411:32:47 AM | 57.312 | 130.212 | 24.688 | 78.912 |
| 2016-03-0411:32:51 AM | 57.312 | 130.1 | 24.575 | 78.912 |
| 2016-03-0411:32:55 AM | 57.312 | 130.1 | 24.35 | 78.912 |
| 2016-03-0411:32:59 AM | 57.312 | 129.988 | 24.35 | 78.912 |
| 2016-03-0411:33:03 AM | 57.312 | 129.988 | 24.35 | 78.912 |
| 2016-03-0411:33:08 AM | 57.312 | 129.875 | 24.238 | 79.025 |
| 2016-03-0411:33:12 AM | 57.312 | 129.875 | 24.238 | 78.912 |
| 2016-03-0411:33:16 AM | 57.312 | 129.762 | 24.35 | 78.912 |
| 2016-03-0411:33:20 AM | 57.312 | 129.762 | 24.575 | 78.912 |
| 2016-03-0411:33:24 AM | 57.312 | 129.762 | 24.575 | 78.912 |
| 2016-03-0411:33:28 AM | 57.312 | 129.762 | 24.462 | 78.912 |
| 2016-03-0411:33:32 AM | 57.312 | 129.762 | 24.575 | 78.912 |
| 2016-03-0411:33:36 AM | 57.312 | 129.762 | 24.688 | 78.8 |
| 2016-03-0411:33:40 AM | 57.312 | 129.65 | 24.688 | 78.8 |
| 2016-03-0411:33:44 AM | 57.312 | 129.65 | 24.688 | 78.8 |
| 2016-03-0411:33:48 AM | 57.312 | 129.65 | 24.688 | 78.8 |
| 2016-03-0411:33:52 AM | 57.312 | 129.65 | 24.688 | 78.8 |
| 2016-03-0411:33:56 AM | 57.312 | 129.538 | 24.688 | 78.8 |
| 2016-03-0411:34:00 AM | 57.312 | 129.65 | 24.688 | 78.8 |
| 2016-03-0411:34:04 AM | 57.312 | 129.538 | 24.575 | 78.8 |
| 2016-03-0411:34:08 AM | 57.312 | 129.538 | 24.462 | 78.8 |
| 2016-03-0411:34:12 AM | 57.312 | 129.538 | 24.462 | 78.8 |
| 2016-03-0411:34:16 AM | 57.312 | 129.425 | 24.35 | 78.8 |
| 2016-03-0411:34:20 AM | 57.312 | 129.425 | 24.238 | 78.8 |
| 2016-03-0411:34:24 AM | 57.312 | 129.425 | 24.125 | 78.8 |
| 2016-03-0411:34:28 AM | 57.312 | 129.425 | 24.125 | 78.8 |
| 2016-03-0411:34:32 AM | 57.312 | 129.312 | 24.125 | 78.8 |
| 2016-03-0411:34:36 AM | 57.312 | 129.312 | 24.012 | 78.8 |
| 2016-03-0411:34:40 AM | 57.312 | 129.312 | 23.9 | 78.8 |
| 2016-03-0411:34:44 AM | 57.312 | 129.312 | 23.675 | 78.8 |
| 2016-03-0411:34:48 AM | 57.2 | 129.2 | 23.45 | 78.8 |
| 2016-03-0411:34:52 AM | 57.312 | 129.2 | 23.338 | 78.8 |
| 2016-03-0411:34:56 AM | 57.2 | 129.2 | 23.225 | 78.8 |
| 2016-03-0411:35:00 AM | 57.2 | 129.2 | 23.338 | 78.8 |
| 2016-03-0411:35:04 AM | 57.312 | 129.2 | 23.45 | 78.8 |
| 2016-03-0411:35:08 AM | 57.2 | 129.088 | 23.562 | 78.8 |
| 2016-03-0411:35:12 AM | 57.2 | 129.088 | 23.562 | 78.8 |
| 2016-03-0411:35:16 AM | 57.2 | 129.088 | 23.562 | 78.8 |
| 2016-03-0411:35:20 AM | 57.2 | 129.088 | 23.788 | 78.8 |
| 2016-03-0411:35:25 AM | 57.2 | 128.975 | 23.788 | 78.8 |
| 2016-03-0411:35:29 AM | 57.088 | 128.975 | 23.788 | 78.8 |
| 2016-03-0411:35:33 AM | 57.2 | 128.975 | 23.9 | 78.8 |
| 2016-03-0411:35:37 AM | 57.088 | 128.975 | 23.9 | 78.8 |
| 2016-03-0411:35:41 AM | 57.088 | 128.863 | 23.9 | 78.8 |
| 2016-03-0411:35:45 AM | 57.2 | 128.75 | 24.012 | 78.8 |
| 2016-03-0411:35:49 AM | 57.088 | 128.75 | 24.012 | 78.688 |
| 2016-03-0411:35:53 AM | 57.088 | 128.75 | 24.012 | 78.688 |
| 2016-03-0411:35:57 AM | 57.088 | 128.637 | 24.012 | 78.688 |
| 2016-03-0411:36:01 AM | 57.088 | 128.637 | 24.012 | 78.688 |
| 2016-03-0411:36:05 AM | 57.088 | 128.637 | 23.9 | 78.688 |
| 2016-03-0411:36:09 AM | 57.088 | 128.637 | 23.9 | 78.688 |
| 2016-03-0411:36:13 AM | 57.088 | 128.637 | 24.012 | 78.688 |
| 2016-03-0411:36:17 AM | 57.088 | 128.525 | 24.125 | 78.688 |
| 2016-03-0411:36:21 AM | 57.088 | 128.412 | 24.238 | 78.688 |
| 2016-03-0411:36:25 AM | 57.088 | 128.525 | 24.35 | 78.688 |
| 2016-03-0411:36:29 AM | 57.088 | 128.525 | 24.462 | 78.688 |
| 2016-03-0411:36:33 AM | 57.2 | 128.412 | 24.462 | 78.688 |
| 2016-03-0411:36:37 AM | 57.2 | 128.412 | 24.238 | 78.688 |
| 2016-03-0411:36:41 AM | 57.2 | 128.412 | 24.125 | 78.688 |
| 2016-03-0411:36:45 AM | 57.312 | 128.412 | 24.012 | 78.688 |
| 2016-03-0411:36:49 AM | 57.312 | 128.412 | 23.9 | 78.688 |
| 2016-03-0411:36:53 AM | 57.312 | 128.3 | 23.9 | 78.8 |
| 2016-03-0411:36:57 AM | 57.312 | 128.3 | 23.675 | 78.688 |
| 2016-03-0411:37:01 AM | 57.312 | 128.412 | 23.675 | 78.688 |
| 2016-03-0411:37:05 AM | 57.425 | 128.3 | 23.562 | 78.688 |
| 2016-03-0411:37:09 AM | 57.425 | 128.412 | 23.562 | 78.688 |
| 2016-03-0411:37:13 AM | 57.312 | 128.3 | 23.562 | 78.8 |
| 2016-03-0411:37:17 AM | 57.425 | 128.412 | 23.562 | 78.8 |
| 2016-03-0411:37:21 AM | 57.312 | 128.412 | 23.562 | 78.688 |
| 2016-03-0411:37:25 AM | 57.312 | 128.3 | 23.45 | 78.8 |
| 2016-03-0411:37:29 AM | 57.312 | 128.412 | 23.562 | 78.8 |
| 2016-03-0411:37:33 AM | 57.312 | 128.412 | 23.45 | 78.8 |
| 2016-03-0411:37:37 AM | 57.312 | 128.412 | 23.45 | 78.688 |
| 2016-03-0411:37:41 AM | 57.312 | 128.412 | 23.45 | 78.8 |
| 2016-03-0411:37:46 AM | 57.312 | 128.412 | 23.338 | 78.8 |
| 2016-03-0411:37:50 AM | 57.425 | 128.412 | 23.225 | 78.8 |
| 2016-03-0411:37:54 AM | 57.425 | 128.412 | 23.112 | 78.8 |
| 2016-03-0411:37:58 AM | 57.312 | 128.412 | 23.112 | 78.8 |
| 2016-03-0411:38:02 AM | 57.312 | 128.412 | 23 | 78.8 |
| 2016-03-0411:38:06 AM | 57.312 | 128.412 | 22.888 | 78.688 |
| 2016-03-0411:38:10 AM | 57.312 | 128.412 | 22.888 | 78.688 |
| 2016-03-0411:38:14 AM | 57.425 | 128.525 | 22.662 | 78.688 |
| 2016-03-0411:38:18 AM | 57.312 | 128.525 | 22.662 | 78.688 |
| 2016-03-0411:38:22 AM | 57.312 | 128.525 | 22.55 | 78.8 |
| 2016-03-0411:38:26 AM | 57.312 | 128.525 | 22.55 | 78.8 |
| 2016-03-0411:38:30 AM | 57.312 | 128.525 | 22.662 | 78.8 |
| 2016-03-0411:38:34 AM | 57.312 | 128.525 | 22.888 | 78.8 |
| 2016-03-0411:38:38 AM | 57.2 | 128.525 | 23 | 78.8 |
| 2016-03-0411:38:42 AM | 57.2 | 128.525 | 23.112 | 78.8 |
| 2016-03-0411:38:46 AM | 57.2 | 128.525 | 23.225 | 78.8 |
| 2016-03-0411:38:50 AM | 57.2 | 128.525 | 23.338 | 78.688 |
| 2016-03-0411:38:54 AM | 57.088 | 128.525 | 23.45 | 78.8 |
| 2016-03-0411:38:58 AM | 57.088 | 128.525 | 23.45 | 78.8 |
| 2016-03-0411:39:02 AM | 57.2 | 128.525 | 23.338 | 78.8 |
| 2016-03-0411:39:06 AM | 57.088 | 128.525 | 23.338 | 78.8 |
| 2016-03-0411:39:10 AM | 57.088 | 128.412 | 23.338 | 78.8 |
| 2016-03-0411:39:14 AM | 57.088 | 128.412 | 23.338 | 78.8 |
| 2016-03-0411:39:18 AM | 57.2 | 128.412 | 23.225 | 78.8 |
| 2016-03-0411:39:22 AM | 57.088 | 128.3 | 23.338 | 78.8 |
| 2016-03-0411:39:26 AM | 57.088 | 128.412 | 23.338 | 78.8 |
| 2016-03-0411:39:30 AM | 57.088 | 128.3 | 23.338 | 78.8 |
| 2016-03-0411:39:34 AM | 57.088 | 128.3 | 23.225 | 78.8 |
| 2016-03-0411:39:38 AM | 57.088 | 128.188 | 23.338 | 78.8 |
| 2016-03-0411:39:42 AM | 57.088 | 128.188 | 23.45 | 78.8 |
| 2016-03-0411:39:46 AM | 57.088 | 128.075 | 23.45 | 78.8 |
| 2016-03-0411:39:50 AM | 56.975 | 128.075 | 23.562 | 78.8 |
| 2016-03-0411:39:54 AM | 56.975 | 128.075 | 23.562 | 78.8 |
| 2016-03-0411:39:58 AM | 56.975 | 127.962 | 23.675 | 78.8 |
| 2016-03-0411:40:02 AM | 56.975 | 127.962 | 23.788 | 78.8 |
| 2016-03-0411:40:07 AM | 56.975 | 127.962 | 23.675 | 78.8 |
| 2016-03-0411:40:11 AM | 56.975 | 127.85 | 23.675 | 78.8 |
| 2016-03-0411:40:15 AM | 56.975 | 127.738 | 23.675 | 78.8 |
| 2016-03-0411:40:19 AM | 56.975 | 127.738 | 23.675 | 78.8 |
| 2016-03-0411:40:23 AM | 56.975 | 127.738 | 23.675 | 78.8 |
| 2016-03-0411:40:27 AM | 56.975 | 127.738 | 23.788 | 78.8 |
| 2016-03-0411:40:31 AM | 56.975 | 127.625 | 23.788 | 78.8 |
| 2016-03-0411:40:35 AM | 56.975 | 127.512 | 23.788 | 78.8 |
| 2016-03-0411:40:39 AM | 56.975 | 127.512 | 23.9 | 78.8 |
| 2016-03-0411:40:43 AM | 57.088 | 127.4 | 23.9 | 78.8 |
| 2016-03-0411:40:46 AM | 57.088 | 127.288 | 24.012 | 78.8 |
| 2016-03-0411:40:50 AM | 56.975 | 127.288 | 24.012 | 78.8 |
| 2016-03-0411:40:54 AM | 57.088 | 127.175 | 24.125 | 78.8 |
| 2016-03-0411:40:58 AM | 57.088 | 127.062 | 24.238 | 78.8 |
| 2016-03-0411:41:02 AM | 57.088 | 127.062 | 24.35 | 78.8 |
| 2016-03-0411:41:07 AM | 57.088 | 126.95 | 24.35 | 78.8 |
| 2016-03-0411:41:11 AM | 57.088 | 126.95 | 24.462 | 78.8 |
| 2016-03-0411:41:15 AM | 57.088 | 126.838 | 24.462 | 78.8 |
| 2016-03-0411:41:19 AM | 57.088 | 126.725 | 24.462 | 78.688 |
| 2016-03-0411:41:23 AM | 57.088 | 126.612 | 24.575 | 78.8 |
| 2016-03-0411:41:27 AM | 57.088 | 126.5 | 24.575 | 78.8 |
| 2016-03-0411:41:31 AM | 57.088 | 126.5 | 24.688 | 78.8 |
| 2016-03-0411:41:35 AM | 57.088 | 126.388 | 24.688 | 78.8 |
| 2016-03-0411:41:39 AM | 57.2 | 126.388 | 24.8 | 78.8 |
| 2016-03-0411:41:43 AM | 57.2 | 126.275 | 24.688 | 78.8 |
| 2016-03-0411:41:47 AM | 57.2 | 126.163 | 24.912 | 78.8 |
| 2016-03-0411:41:51 AM | 57.2 | 126.05 | 24.912 | 78.8 |
| 2016-03-0411:41:55 AM | 57.2 | 126.05 | 24.912 | 78.8 |
| 2016-03-0411:41:59 AM | 57.2 | 125.938 | 25.025 | 78.688 |
| 2016-03-0411:42:03 AM | 57.312 | 125.825 | 25.025 | 78.8 |
| 2016-03-0411:42:07 AM | 57.312 | 125.825 | 25.025 | 78.8 |
| 2016-03-0411:42:11 AM | 57.312 | 125.712 | 25.025 | 78.688 |
| 2016-03-0411:42:15 AM | 57.312 | 125.6 | 25.138 | 78.688 |
| 2016-03-0411:42:19 AM | 57.425 | 125.6 | 25.25 | 78.688 |
| 2016-03-0411:42:23 AM | 57.312 | 125.488 | 25.25 | 78.688 |
| 2016-03-0411:42:27 AM | 57.425 | 125.488 | 25.362 | 78.688 |
| 2016-03-0411:42:31 AM | 57.425 | 125.375 | 25.362 | 78.688 |
| 2016-03-0411:42:35 AM | 57.425 | 125.262 | 25.25 | 78.575 |
| 2016-03-0411:42:39 AM | 57.538 | 125.15 | 25.362 | 78.575 |
| 2016-03-0411:42:43 AM | 57.538 | 125.15 | 25.362 | 78.688 |
| 2016-03-0411:42:47 AM | 57.538 | 125.038 | 25.25 | 78.688 |
| 2016-03-0411:42:51 AM | 57.538 | 125.038 | 25.25 | 78.575 |
| 2016-03-0411:42:55 AM | 57.538 | 125.038 | 25.362 | 78.688 |
| 2016-03-0411:42:59 AM | 57.538 | 124.925 | 25.362 | 78.575 |
| 2016-03-0411:43:03 AM | 57.65 | 124.812 | 25.25 | 78.575 |
| 2016-03-0411:43:07 AM | 57.65 | 124.925 | 25.25 | 78.575 |
| 2016-03-0411:43:11 AM | 57.65 | 124.812 | 25.25 | 78.575 |
| 2016-03-0411:43:15 AM | 57.65 | 124.812 | 25.25 | 78.575 |
| 2016-03-0411:43:19 AM | 57.762 | 124.7 | 25.025 | 78.575 |
| 2016-03-0411:43:23 AM | 57.875 | 124.7 | 24.8 | 78.575 |
| 2016-03-0411:43:27 AM | 57.875 | 124.7 | 24.8 | 78.575 |
| 2016-03-0411:43:32 AM | 57.875 | 124.588 | 24.8 | 78.575 |
| 2016-03-0411:43:36 AM | 57.875 | 124.588 | 24.912 | 78.575 |
| 2016-03-0411:43:40 AM | 57.988 | 124.588 | 25.025 | 78.575 |
| 2016-03-0411:43:44 AM | 57.988 | 124.475 | 24.912 | 78.575 |
| 2016-03-0411:43:48 AM | 57.988 | 124.475 | 25.025 | 78.575 |
| 2016-03-0411:43:52 AM | 57.988 | 124.362 | 25.025 | 78.575 |
| 2016-03-0411:43:56 AM | 57.988 | 124.362 | 24.912 | 78.575 |
| 2016-03-0411:44:00 AM | 57.988 | 124.362 | 24.912 | 78.575 |
| 2016-03-0411:44:04 AM | 57.988 | 124.362 | 24.912 | 78.575 |
| 2016-03-0411:44:08 AM | 57.988 | 124.25 | 24.912 | 78.575 |
| 2016-03-0411:44:12 AM | 58.1 | 124.138 | 24.912 | 78.575 |
| 2016-03-0411:44:16 AM | 58.1 | 124.138 | 25.025 | 78.575 |
| 2016-03-0411:44:20 AM | 58.1 | 124.025 | 25.138 | 78.575 |
| 2016-03-0411:44:24 AM | 58.1 | 123.913 | 25.25 | 78.575 |
| 2016-03-0411:44:28 AM | 58.1 | 123.913 | 25.25 | 78.575 |
| 2016-03-0411:44:32 AM | 58.1 | 123.913 | 25.25 | 78.575 |
| 2016-03-0411:44:36 AM | 58.212 | 123.8 | 25.362 | 78.575 |
| 2016-03-0411:44:40 AM | 58.212 | 123.688 | 25.362 | 78.575 |
| 2016-03-0411:44:44 AM | 58.212 | 123.688 | 25.475 | 78.575 |
| 2016-03-0411:44:48 AM | 58.212 | 123.575 | 25.475 | 78.575 |
| 2016-03-0411:44:52 AM | 58.212 | 123.462 | 25.475 | 78.575 |
| 2016-03-0411:44:56 AM | 58.212 | 123.462 | 25.588 | 78.575 |
| 2016-03-0411:45:00 AM | 58.212 | 123.35 | 25.588 | 78.575 |
| 2016-03-0411:45:04 AM | 58.212 | 123.238 | 25.475 | 78.575 |
| 2016-03-0411:45:08 AM | 58.212 | 123.125 | 25.362 | 78.462 |
| 2016-03-0411:45:12 AM | 58.212 | 123.012 | 25.025 | 78.462 |
| 2016-03-0411:45:16 AM | 58.212 | 123.012 | 24.912 | 78.462 |
| 2016-03-0411:45:20 AM | 58.212 | 122.9 | 24.8 | 78.462 |
| 2016-03-0411:45:24 AM | 58.212 | 122.788 | 24.8 | 78.462 |
| 2016-03-0411:45:28 AM | 58.212 | 122.675 | 24.8 | 78.575 |
| 2016-03-0411:45:32 AM | 58.212 | 122.675 | 24.8 | 78.462 |
| 2016-03-0411:45:36 AM | 58.212 | 122.562 | 24.8 | 78.575 |
| 2016-03-0411:45:40 AM | 58.212 | 122.562 | 24.912 | 78.575 |
| 2016-03-0411:45:44 AM | 58.212 | 122.45 | 24.912 | 78.575 |
| 2016-03-0411:45:48 AM | 58.212 | 122.338 | 25.025 | 78.575 |
| 2016-03-0411:45:53 AM | 58.1 | 122.338 | 25.025 | 78.575 |
| 2016-03-0411:45:57 AM | 58.1 | 122.338 | 25.138 | 78.575 |
| 2016-03-0411:46:01 AM | 58.1 | 122.225 | 25.25 | 78.462 |
| 2016-03-0411:46:05 AM | 58.1 | 122.225 | 25.25 | 78.462 |
| 2016-03-0411:46:09 AM | 58.1 | 122.225 | 25.25 | 78.462 |
| 2016-03-0411:46:13 AM | 58.1 | 122.225 | 25.138 | 78.462 |
| 2016-03-0411:46:17 AM | 58.1 | 122.225 | 25.138 | 78.462 |
| 2016-03-0411:46:21 AM | 58.1 | 122.225 | 25.138 | 78.462 |
| 2016-03-0411:46:25 AM | 58.1 | 122.225 | 25.138 | 78.462 |
| 2016-03-0411:46:29 AM | 58.1 | 122.225 | 25.25 | 78.462 |
| 2016-03-0411:46:33 AM | 58.1 | 122.225 | 25.362 | 78.462 |
| 2016-03-0411:46:37 AM | 58.1 | 122.225 | 25.362 | 78.462 |
| 2016-03-0411:46:41 AM | 57.988 | 122.225 | 25.475 | 78.462 |
| 2016-03-0411:46:45 AM | 57.988 | 122.225 | 25.7 | 78.462 |
| 2016-03-0411:46:49 AM | 57.988 | 122.225 | 25.7 | 78.35 |
| 2016-03-0411:46:53 AM | 58.1 | 122.225 | 25.812 | 78.462 |
| 2016-03-0411:46:57 AM | 57.988 | 122.338 | 25.925 | 78.462 |
| 2016-03-0411:47:01 AM | 58.1 | 122.338 | 26.038 | 78.462 |
| 2016-03-0411:47:05 AM | 58.1 | 122.338 | 26.15 | 78.462 |
| 2016-03-0411:47:09 AM | 58.1 | 122.338 | 26.15 | 78.462 |
| 2016-03-0411:47:13 AM | 58.1 | 122.338 | 26.15 | 78.462 |
| 2016-03-0411:47:17 AM | 58.212 | 122.338 | 26.262 | 78.462 |
| 2016-03-0411:47:21 AM | 58.212 | 122.338 | 26.15 | 78.462 |
| 2016-03-0411:47:25 AM | 58.212 | 122.338 | 26.15 | 78.462 |
| 2016-03-0411:47:29 AM | 58.212 | 122.338 | 26.038 | 78.462 |
| 2016-03-0411:47:33 AM | 58.325 | 122.338 | 26.038 | 78.35 |
| 2016-03-0411:47:37 AM | 58.325 | 122.338 | 26.038 | 78.462 |
| 2016-03-0411:47:41 AM | 58.325 | 122.338 | 26.15 | 78.35 |
| 2016-03-0411:47:45 AM | 58.325 | 122.338 | 26.15 | 78.35 |
| 2016-03-0411:47:49 AM | 58.325 | 122.45 | 26.262 | 78.462 |
| 2016-03-0411:47:53 AM | 58.325 | 122.338 | 26.262 | 78.462 |
| 2016-03-0411:47:57 AM | 58.438 | 122.338 | 26.375 | 78.35 |
| 2016-03-0411:48:01 AM | 58.438 | 122.45 | 26.262 | 78.462 |
| 2016-03-0411:48:05 AM | 58.325 | 122.45 | 26.262 | 78.462 |
| 2016-03-0411:48:09 AM | 58.325 | 122.338 | 26.262 | 78.462 |
| 2016-03-0411:48:14 AM | 58.438 | 122.338 | 26.375 | 78.462 |
| 2016-03-0411:48:18 AM | 58.438 | 122.338 | 26.375 | 78.462 |
| 2016-03-0411:48:22 AM | 58.438 | 122.338 | 26.375 | 78.462 |
| 2016-03-0411:48:26 AM | 58.438 | 122.338 | 26.375 | 78.462 |
| 2016-03-0411:48:30 AM | 58.438 | 122.338 | 26.488 | 78.462 |
| 2016-03-0411:48:34 AM | 58.438 | 122.338 | 26.488 | 78.462 |
| 2016-03-0411:48:38 AM | 58.438 | 122.338 | 26.488 | 78.462 |
| 2016-03-0411:48:42 AM | 58.55 | 122.338 | 26.375 | 78.462 |
| 2016-03-0411:48:46 AM | 58.55 | 122.225 | 26.488 | 78.462 |
| 2016-03-0411:48:50 AM | 58.55 | 122.225 | 26.375 | 78.462 |
| 2016-03-0411:48:54 AM | 58.55 | 122.225 | 26.15 | 78.462 |
| 2016-03-0411:48:58 AM | 58.55 | 122.225 | 25.925 | 78.462 |
| 2016-03-0411:49:02 AM | 58.55 | 122.225 | 25.812 | 78.462 |
| 2016-03-0411:49:06 AM | 58.55 | 122.225 | 25.7 | 78.462 |
| 2016-03-0411:49:10 AM | 58.55 | 122.112 | 25.7 | 78.462 |
| 2016-03-0411:49:14 AM | 58.55 | 122.112 | 25.7 | 78.462 |
| 2016-03-0411:49:18 AM | 58.662 | 122.112 | 25.7 | 78.462 |
| 2016-03-0411:49:22 AM | 58.662 | 122.112 | 25.7 | 78.462 |
| 2016-03-0411:49:26 AM | 58.55 | 122.112 | 25.812 | 78.462 |
| 2016-03-0411:49:30 AM | 58.55 | 122.112 | 25.7 | 78.462 |
| 2016-03-0411:49:34 AM | 58.662 | 122 | 25.7 | 78.462 |
| 2016-03-0411:49:38 AM | 58.55 | 122 | 25.7 | 78.462 |
| 2016-03-0411:49:42 AM | 58.662 | 122 | 25.7 | 78.462 |
| 2016-03-0411:49:46 AM | 58.662 | 121.888 | 25.7 | 78.462 |
| 2016-03-0411:49:50 AM | 58.662 | 121.888 | 25.7 | 78.462 |
| 2016-03-0411:49:54 AM | 58.55 | 121.888 | 25.588 | 78.462 |
| 2016-03-0411:49:58 AM | 58.662 | 121.888 | 25.588 | 78.462 |
| 2016-03-0411:50:02 AM | 58.662 | 121.775 | 25.588 | 78.462 |
| 2016-03-0411:50:06 AM | 58.55 | 121.775 | 25.475 | 78.462 |
| 2016-03-0411:50:10 AM | 58.662 | 121.775 | 25.362 | 78.462 |
| 2016-03-0411:50:14 AM | 58.55 | 121.775 | 25.25 | 78.462 |
| 2016-03-0411:50:18 AM | 58.55 | 121.775 | 25.25 | 78.462 |
| 2016-03-0411:50:22 AM | 58.55 | 121.775 | 25.362 | 78.462 |
| 2016-03-0411:50:26 AM | 58.55 | 121.663 | 25.362 | 78.462 |
| 2016-03-0411:50:31 AM | 58.55 | 121.663 | 25.362 | 78.462 |
| 2016-03-0411:50:35 AM | 58.662 | 121.663 | 25.475 | 78.462 |
| 2016-03-0411:50:39 AM | 58.662 | 121.663 | 25.475 | 78.462 |
| 2016-03-0411:50:43 AM | 58.662 | 121.663 | 25.588 | 78.462 |
| 2016-03-0411:50:47 AM | 58.662 | 121.663 | 25.588 | 78.462 |
| 2016-03-0411:50:51 AM | 58.775 | 121.663 | 25.588 | 78.462 |
| 2016-03-0411:50:55 AM | 58.775 | 121.663 | 25.475 | 78.462 |
| 2016-03-0411:50:59 AM | 58.775 | 121.663 | 25.588 | 78.462 |
| 2016-03-0411:51:03 AM | 58.775 | 121.663 | 25.588 | 78.462 |
| 2016-03-0411:51:07 AM | 58.775 | 121.775 | 25.475 | 78.462 |
| 2016-03-0411:51:11 AM | 58.775 | 121.775 | 25.475 | 78.462 |
| 2016-03-0411:51:15 AM | 58.775 | 121.775 | 25.475 | 78.462 |
| 2016-03-0411:51:19 AM | 58.888 | 121.775 | 25.475 | 78.462 |
| 2016-03-0411:51:23 AM | 58.888 | 121.775 | 25.588 | 78.462 |
| 2016-03-0411:51:27 AM | 58.775 | 121.775 | 25.588 | 78.462 |
| 2016-03-0411:51:31 AM | 58.775 | 121.775 | 25.588 | 78.462 |
| 2016-03-0411:51:35 AM | 58.888 | 121.888 | 25.7 | 78.462 |
| 2016-03-0411:51:39 AM | 58.888 | 121.888 | 25.812 | 78.462 |
| 2016-03-0411:51:43 AM | 58.888 | 121.888 | 25.812 | 78.462 |
| 2016-03-0411:51:47 AM | 58.888 | 121.888 | 25.925 | 78.462 |
| 2016-03-0411:51:51 AM | 58.888 | 122 | 25.925 | 78.462 |
| 2016-03-0411:51:55 AM | 58.888 | 122 | 26.038 | 78.462 |
| 2016-03-0411:51:59 AM | 58.888 | 122 | 25.925 | 78.575 |
| 2016-03-0411:52:03 AM | 58.888 | 122.112 | 25.925 | 78.575 |
| 2016-03-0411:52:07 AM | 58.775 | 122.112 | 26.038 | 78.575 |
| 2016-03-0411:52:11 AM | 58.775 | 122.112 | 26.038 | 78.575 |
| 2016-03-0411:52:15 AM | 58.888 | 122.112 | 26.038 | 78.462 |
| 2016-03-0411:52:19 AM | 58.775 | 122.112 | 26.038 | 78.575 |
| 2016-03-0411:52:23 AM | 58.888 | 122.112 | 26.15 | 78.462 |
| 2016-03-0411:52:27 AM | 58.888 | 122.112 | 26.15 | 78.575 |
| 2016-03-0411:52:31 AM | 58.888 | 122.112 | 26.15 | 78.462 |
| 2016-03-0411:52:35 AM | 58.888 | 122.112 | 26.262 | 78.462 |
| 2016-03-0411:52:39 AM | 58.888 | 122.112 | 26.262 | 78.462 |
| 2016-03-0411:52:43 AM | 58.888 | 122.225 | 26.375 | 78.462 |
| 2016-03-0411:52:47 AM | 59 | 122.225 | 26.375 | 78.462 |
| 2016-03-0411:52:52 AM | 59 | 122.225 | 26.262 | 78.462 |
| 2016-03-0411:52:56 AM | 59 | 122.225 | 26.038 | 78.462 |
| 2016-03-0411:53:00 AM | 59 | 122.225 | 26.038 | 78.462 |
| 2016-03-0411:53:04 AM | 59.112 | 122.225 | 25.925 | 78.462 |
| 2016-03-0411:53:08 AM | 59.112 | 122.225 | 26.038 | 78.462 |
| 2016-03-0411:53:12 AM | 59 | 122.225 | 26.15 | 78.575 |
| 2016-03-0411:53:16 AM | 59.112 | 122.225 | 26.15 | 78.462 |
| 2016-03-0411:53:20 AM | 59.112 | 122.338 | 26.15 | 78.462 |
| 2016-03-0411:53:24 AM | 59.112 | 122.338 | 26.15 | 78.575 |
| 2016-03-0411:53:28 AM | 59.112 | 122.338 | 26.038 | 78.462 |
| 2016-03-0411:53:32 AM | 59.112 | 122.338 | 26.038 | 78.462 |
| 2016-03-0411:53:36 AM | 59.112 | 122.338 | 26.038 | 78.462 |
| 2016-03-0411:53:40 AM | 59 | 122.45 | 26.15 | 78.462 |
| 2016-03-0411:53:44 AM | 59 | 122.45 | 26.15 | 78.462 |
| 2016-03-0411:53:48 AM | 59.112 | 122.45 | 26.15 | 78.462 |
| 2016-03-0411:53:52 AM | 59.112 | 122.45 | 26.262 | 78.462 |
| 2016-03-0411:53:56 AM | 59 | 122.45 | 26.262 | 78.462 |
| 2016-03-0411:54:00 AM | 59.112 | 122.45 | 26.375 | 78.462 |
| 2016-03-0411:54:04 AM | 59.112 | 122.45 | 26.488 | 78.462 |
| 2016-03-0411:54:08 AM | 59.112 | 122.562 | 26.6 | 78.462 |
| 2016-03-0411:54:12 AM | 59.112 | 122.562 | 26.488 | 78.462 |
| 2016-03-0411:54:16 AM | 59.112 | 122.562 | 26.6 | 78.462 |
| 2016-03-0411:54:20 AM | 59.112 | 122.562 | 26.712 | 78.462 |
| 2016-03-0411:54:24 AM | 59.112 | 122.562 | 26.712 | 78.462 |
| 2016-03-0411:54:28 AM | 59.112 | 122.562 | 26.712 | 78.462 |
| 2016-03-0411:54:32 AM | 59.112 | 122.562 | 26.6 | 78.462 |
| 2016-03-0411:54:36 AM | 59.112 | 122.675 | 26.488 | 78.462 |
| 2016-03-0411:54:40 AM | 59.112 | 122.562 | 26.488 | 78.462 |
| 2016-03-0411:54:44 AM | 59.112 | 122.562 | 26.375 | 78.462 |
| 2016-03-0411:54:48 AM | 59.112 | 122.675 | 26.375 | 78.462 |
| 2016-03-0411:54:52 AM | 59.112 | 122.562 | 26.375 | 78.462 |
| 2016-03-0411:54:56 AM | 59 | 122.675 | 26.375 | 78.462 |
| 2016-03-0411:55:00 AM | 59.112 | 122.675 | 26.488 | 78.462 |
| 2016-03-0411:55:04 AM | 59 | 122.675 | 26.488 | 78.462 |
| 2016-03-0411:55:08 AM | 59.112 | 122.675 | 26.6 | 78.462 |
| 2016-03-0411:55:12 AM | 59.112 | 122.675 | 26.825 | 78.462 |
| 2016-03-0411:55:16 AM | 59 | 122.675 | 26.825 | 78.462 |
| 2016-03-0411:55:20 AM | 59.112 | 122.675 | 26.825 | 78.462 |
| 2016-03-0411:55:24 AM | 59.112 | 122.675 | 26.825 | 78.462 |
| 2016-03-0411:55:28 AM | 59.112 | 122.675 | 26.712 | 78.462 |
| 2016-03-0411:55:32 AM | 59.112 | 122.675 | 26.6 | 78.462 |
| 2016-03-0411:55:37 AM | 59.112 | 122.562 | 26.6 | 78.462 |
| 2016-03-0411:55:41 AM | 59.112 | 122.675 | 26.488 | 78.462 |
| 2016-03-0411:55:45 AM | 59.112 | 122.675 | 26.6 | 78.462 |
| 2016-03-0411:55:49 AM | 59.112 | 122.675 | 26.6 | 78.35 |
| 2016-03-0411:55:53 AM | 59.112 | 122.675 | 26.712 | 78.35 |
| 2016-03-0411:55:57 AM | 59.112 | 122.675 | 26.825 | 78.35 |
| 2016-03-0411:56:01 AM | 59.112 | 122.675 | 26.825 | 78.35 |
| 2016-03-0411:56:05 AM | 59.112 | 122.675 | 26.938 | 78.35 |
| 2016-03-0411:56:09 AM | 59.112 | 122.788 | 26.938 | 78.35 |
| 2016-03-0411:56:13 AM | 59 | 122.788 | 27.05 | 78.35 |
| 2016-03-0411:56:17 AM | 59 | 122.788 | 27.05 | 78.35 |
| 2016-03-0411:56:21 AM | 59 | 122.9 | 27.275 | 78.35 |
| 2016-03-0411:56:25 AM | 59.112 | 122.9 | 27.275 | 78.35 |
| 2016-03-0411:56:29 AM | 59.112 | 123.012 | 27.275 | 78.35 |
| 2016-03-0411:56:33 AM | 59 | 123.012 | 27.275 | 78.35 |
| 2016-03-0411:56:37 AM | 59 | 123.125 | 27.388 | 78.35 |
| 2016-03-0411:56:41 AM | 59 | 123.125 | 27.275 | 78.35 |
| 2016-03-0411:56:45 AM | 59 | 123.238 | 27.162 | 78.35 |
| 2016-03-0411:56:49 AM | 59 | 123.238 | 27.162 | 78.35 |
| 2016-03-0411:56:53 AM | 58.888 | 123.35 | 27.162 | 78.35 |
| 2016-03-0411:56:57 AM | 59 | 123.462 | 27.162 | 78.35 |
| 2016-03-0411:57:01 AM | 59 | 123.575 | 27.162 | 78.35 |
| 2016-03-0411:57:05 AM | 59 | 123.575 | 27.162 | 78.35 |
| 2016-03-0411:57:09 AM | 58.888 | 123.688 | 27.05 | 78.35 |
| 2016-03-0411:57:13 AM | 59 | 123.688 | 27.05 | 78.35 |
| 2016-03-0411:57:17 AM | 59 | 123.8 | 27.05 | 78.35 |
| 2016-03-0411:57:21 AM | 59 | 123.913 | 27.05 | 78.35 |
| 2016-03-0411:57:25 AM | 59 | 123.913 | 27.05 | 78.35 |
| 2016-03-0411:57:29 AM | 59 | 124.025 | 27.05 | 78.238 |
| 2016-03-0411:57:33 AM | 59 | 124.138 | 27.05 | 78.35 |
| 2016-03-0411:57:37 AM | 59 | 124.138 | 27.05 | 78.35 |
| 2016-03-0411:57:41 AM | 59 | 124.25 | 27.05 | 78.35 |
| 2016-03-0411:57:45 AM | 58.888 | 124.362 | 26.938 | 78.35 |
| 2016-03-0411:57:50 AM | 59 | 124.475 | 26.938 | 78.238 |
| 2016-03-0411:57:54 AM | 58.888 | 124.588 | 26.938 | 78.35 |
| 2016-03-0411:57:58 AM | 58.888 | 124.7 | 26.938 | 78.35 |
| 2016-03-0411:58:02 AM | 58.888 | 124.7 | 26.825 | 78.35 |
| 2016-03-0411:58:06 AM | 58.888 | 124.812 | 26.712 | 78.35 |
| 2016-03-0411:58:10 AM | 58.888 | 124.925 | 26.712 | 78.35 |
| 2016-03-0411:58:14 AM | 58.775 | 125.038 | 26.712 | 78.35 |
| 2016-03-0411:58:18 AM | 58.775 | 125.15 | 26.712 | 78.35 |
| 2016-03-0411:58:22 AM | 58.775 | 125.262 | 26.712 | 78.35 |
| 2016-03-0411:58:26 AM | 58.775 | 125.375 | 26.712 | 78.35 |
| 2016-03-0411:58:30 AM | 58.662 | 125.375 | 26.712 | 78.35 |
| 2016-03-0411:58:34 AM | 58.662 | 125.6 | 26.488 | 78.35 |
| 2016-03-0411:58:38 AM | 58.662 | 125.6 | 26.375 | 78.35 |
| 2016-03-0411:58:42 AM | 58.662 | 125.712 | 26.375 | 78.35 |
| 2016-03-0411:58:46 AM | 58.662 | 125.825 | 26.262 | 78.35 |
| 2016-03-0411:58:50 AM | 58.775 | 125.938 | 25.925 | 78.35 |
| 2016-03-0411:58:54 AM | 58.775 | 126.05 | 25.475 | 78.35 |
| 2016-03-0411:58:58 AM | 58.662 | 126.163 | 25.25 | 78.35 |
| 2016-03-0411:59:02 AM | 58.662 | 126.275 | 25.025 | 78.35 |
| 2016-03-0411:59:06 AM | 58.662 | 126.388 | 25.025 | 78.35 |
| 2016-03-0411:59:10 AM | 58.662 | 126.388 | 24.912 | 78.35 |
| 2016-03-0411:59:14 AM | 58.662 | 126.612 | 24.688 | 78.35 |
| 2016-03-0411:59:18 AM | 58.662 | 126.612 | 24.575 | 78.35 |
| 2016-03-0411:59:22 AM | 58.55 | 126.725 | 24.462 | 78.35 |
| 2016-03-0411:59:27 AM | 58.55 | 126.838 | 24.238 | 78.35 |
| 2016-03-0411:59:31 AM | 58.55 | 126.95 | 24.125 | 78.35 |
| 2016-03-0411:59:35 AM | 58.438 | 127.062 | 24.012 | 78.35 |
| 2016-03-0411:59:39 AM | 58.325 | 127.175 | 23.9 | 78.35 |
| 2016-03-0411:59:43 AM | 58.212 | 127.175 | 23.788 | 78.35 |
| 2016-03-0411:59:47 AM | 58.212 | 127.288 | 23.788 | 78.35 |
| 2016-03-0411:59:51 AM | 58.212 | 127.512 | 23.788 | 78.35 |
| 2016-03-0411:59:55 AM | 58.1 | 127.625 | 23.675 | 78.35 |
| 2016-03-0411:59:59 AM | 57.988 | 127.738 | 23.562 | 78.35 |
| 2016-03-0412:00:03 PM | 57.988 | 127.962 | 23.338 | 78.35 |
| 2016-03-0412:00:07 PM | 57.875 | 128.075 | 23.112 | 78.35 |
| 2016-03-0412:00:11 PM | 57.875 | 128.075 | 22.775 | 78.35 |
| 2016-03-0412:00:15 PM | 57.875 | 128.188 | 22.662 | 78.35 |
| 2016-03-0412:00:19 PM | 57.875 | 128.3 | 22.438 | 78.35 |
| 2016-03-0412:00:23 PM | 57.875 | 128.412 | 22.212 | 78.238 |
| 2016-03-0412:00:27 PM | 57.875 | 128.525 | 22.1 | 78.35 |
| 2016-03-0412:00:31 PM | 57.875 | 128.637 | 22.1 | 78.238 |
| 2016-03-0412:00:35 PM | 57.875 | 128.637 | 21.875 | 78.238 |
| 2016-03-0412:00:39 PM | 57.875 | 128.863 | 21.875 | 78.35 |
| 2016-03-0412:00:43 PM | 57.875 | 128.975 | 21.875 | 78.35 |
| 2016-03-0412:00:47 PM | 57.875 | 128.975 | 22.1 | 78.35 |
| 2016-03-0412:00:51 PM | 57.875 | 129.2 | 22.1 | 78.35 |
| 2016-03-0412:00:55 PM | 57.875 | 129.312 | 22.212 | 78.238 |
| 2016-03-0412:01:00 PM | 57.988 | 129.425 | 22.325 | 78.35 |
| 2016-03-0412:01:04 PM | 57.988 | 129.538 | 22.325 | 78.35 |
| 2016-03-0412:01:08 PM | 57.988 | 129.65 | 22.438 | 78.35 |
| 2016-03-0412:01:12 PM | 57.988 | 129.762 | 22.662 | 78.35 |
| 2016-03-0412:01:16 PM | 57.988 | 129.875 | 22.888 | 78.35 |
| 2016-03-0412:01:20 PM | 58.1 | 129.988 | 23.112 | 78.35 |
| 2016-03-0412:01:24 PM | 58.1 | 130.212 | 23.225 | 78.462 |
| 2016-03-0412:01:28 PM | 58.1 | 130.325 | 23.225 | 78.462 |
| 2016-03-0412:01:32 PM | 58.1 | 130.438 | 23.338 | 78.462 |
| 2016-03-0412:01:36 PM | 58.1 | 130.55 | 23.45 | 78.462 |
| 2016-03-0412:01:40 PM | 58.1 | 130.775 | 23.562 | 78.462 |
| 2016-03-0412:01:44 PM | 58.1 | 130.887 | 23.562 | 78.462 |
| 2016-03-0412:01:48 PM | 58.1 | 131 | 23.675 | 78.462 |
| 2016-03-0412:01:52 PM | 58.212 | 131.225 | 23.788 | 78.462 |
| 2016-03-0412:01:56 PM | 58.212 | 131.338 | 23.788 | 78.462 |
| 2016-03-0412:02:00 PM | 58.212 | 131.562 | 23.9 | 78.462 |
| 2016-03-0412:02:05 PM | 58.212 | 131.675 | 24.012 | 78.462 |
| 2016-03-0412:02:09 PM | 58.212 | 131.788 | 24.012 | 78.575 |
| 2016-03-0412:02:13 PM | 58.212 | 131.9 | 24.125 | 78.462 |
| 2016-03-0412:02:17 PM | 58.212 | 132.125 | 24.238 | 78.575 |
| 2016-03-0412:02:21 PM | 58.212 | 132.238 | 24.238 | 78.575 |
| 2016-03-0412:02:25 PM | 58.325 | 132.35 | 24.35 | 78.575 |
| 2016-03-0412:02:29 PM | 58.212 | 132.575 | 24.462 | 78.575 |
| 2016-03-0412:02:33 PM | 58.325 | 132.688 | 24.575 | 78.575 |
| 2016-03-0412:02:37 PM | 58.438 | 132.912 | 24.688 | 78.575 |
| 2016-03-0412:02:41 PM | 58.438 | 132.912 | 24.912 | 78.575 |
| 2016-03-0412:02:45 PM | 58.325 | 133.138 | 25.025 | 78.575 |
| 2016-03-0412:02:49 PM | 58.438 | 133.25 | 25.025 | 78.575 |
| 2016-03-0412:02:53 PM | 58.438 | 133.475 | 25.138 | 78.575 |
| 2016-03-0412:02:57 PM | 58.55 | 133.588 | 25.138 | 78.575 |
| 2016-03-0412:03:01 PM | 58.55 | 133.7 | 25.138 | 78.575 |
| 2016-03-0412:03:05 PM | 58.662 | 133.812 | 25.25 | 78.575 |
| 2016-03-0412:03:09 PM | 58.662 | 133.925 | 25.362 | 78.688 |
| 2016-03-0412:03:13 PM | 58.775 | 134.038 | 25.475 | 78.688 |
| 2016-03-0412:03:18 PM | 58.775 | 134.15 | 25.588 | 78.688 |
| 2016-03-0412:03:22 PM | 58.888 | 134.262 | 25.7 | 78.688 |
| 2016-03-0412:03:26 PM | 58.888 | 134.262 | 25.812 | 78.688 |
| 2016-03-0412:03:30 PM | 59 | 134.375 | 25.925 | 78.688 |
| 2016-03-0412:03:34 PM | 59 | 134.488 | 26.15 | 78.688 |
| 2016-03-0412:03:38 PM | 59 | 134.6 | 26.262 | 78.688 |
| 2016-03-0412:03:42 PM | 59 | 134.6 | 26.375 | 78.688 |
| 2016-03-0412:03:46 PM | 59 | 134.712 | 26.6 | 78.688 |
| 2016-03-0412:03:50 PM | 59.112 | 134.825 | 26.712 | 78.8 |
| 2016-03-0412:03:54 PM | 59.112 | 134.938 | 26.825 | 78.8 |
| 2016-03-0412:03:58 PM | 59.112 | 135.05 | 26.712 | 78.8 |
| 2016-03-0412:04:02 PM | 59.225 | 135.05 | 26.712 | 78.8 |
| 2016-03-0412:04:06 PM | 59.225 | 135.162 | 26.712 | 78.8 |
| 2016-03-0412:04:10 PM | 59.112 | 135.162 | 26.712 | 78.8 |
| 2016-03-0412:04:14 PM | 59.225 | 135.275 | 26.825 | 78.8 |
| 2016-03-0412:04:18 PM | 59.225 | 135.388 | 26.938 | 78.8 |
| 2016-03-0412:04:22 PM | 59.338 | 135.5 | 26.938 | 78.8 |
| 2016-03-0412:04:26 PM | 59.338 | 135.612 | 26.938 | 78.912 |
| 2016-03-0412:04:30 PM | 59.338 | 135.725 | 27.05 | 78.912 |
| 2016-03-0412:04:34 PM | 59.338 | 135.838 | 27.05 | 78.912 |
| 2016-03-0412:04:38 PM | 59.338 | 135.838 | 27.162 | 78.912 |
| 2016-03-0412:04:42 PM | 59.338 | 136.062 | 27.275 | 78.912 |
| 2016-03-0412:04:47 PM | 59.338 | 136.062 | 27.388 | 78.912 |
| 2016-03-0412:04:51 PM | 59.45 | 136.175 | 27.5 | 78.912 |
| 2016-03-0412:04:55 PM | 59.45 | 136.175 | 27.612 | 78.912 |
| 2016-03-0412:04:59 PM | 59.45 | 136.288 | 27.725 | 78.912 |
| 2016-03-0412:05:03 PM | 59.45 | 136.4 | 27.838 | 78.912 |
| 2016-03-0412:05:07 PM | 59.45 | 136.512 | 27.838 | 78.912 |
| 2016-03-0412:05:11 PM | 59.562 | 136.625 | 27.725 | 78.912 |
| 2016-03-0412:05:15 PM | 59.562 | 136.625 | 27.838 | 78.912 |
| 2016-03-0412:05:19 PM | 59.562 | 136.738 | 27.838 | 78.912 |
| 2016-03-0412:05:23 PM | 59.675 | 136.738 | 27.95 | 78.912 |
| 2016-03-0412:05:27 PM | 59.675 | 136.85 | 27.95 | 78.912 |
| 2016-03-0412:05:31 PM | 59.788 | 136.962 | 27.95 | 79.025 |
| 2016-03-0412:05:35 PM | 59.788 | 136.962 | 27.95 | 78.912 |
| 2016-03-0412:05:39 PM | 59.9 | 137.075 | 27.95 | 79.025 |
| 2016-03-0412:05:43 PM | 59.9 | 137.3 | 27.95 | 79.025 |
| 2016-03-0412:05:47 PM | 59.9 | 137.3 | 27.95 | 79.025 |
| 2016-03-0412:05:51 PM | 59.9 | 137.412 | 28.062 | 79.025 |
| 2016-03-0412:05:55 PM | 60.012 | 137.525 | 28.175 | 79.025 |
| 2016-03-0412:05:59 PM | 59.9 | 137.638 | 28.175 | 79.025 |
| 2016-03-0412:06:03 PM | 59.9 | 137.75 | 28.175 | 79.138 |
| 2016-03-0412:06:08 PM | 59.9 | 137.862 | 28.288 | 79.138 |
| 2016-03-0412:06:16 PM | 60.012 | 137.975 | 28.512 | 79.138 |
| 2016-03-0412:06:20 PM | 60.012 | 137.975 | 28.4 | 79.138 |
| 2016-03-0412:06:24 PM | 60.012 | 138.088 | 28.4 | 79.138 |
| 2016-03-0412:06:28 PM | 60.125 | 138.088 | 28.4 | 79.138 |
| 2016-03-0412:06:32 PM | 60.125 | 138.2 | 28.512 | 79.138 |
| 2016-03-0412:06:37 PM | 60.238 | 138.2 | 28.4 | 79.138 |
| 2016-03-0412:06:41 PM | 60.238 | 138.312 | 28.062 | 79.138 |
| 2016-03-0412:06:45 PM | 60.238 | 138.425 | 27.725 | 79.138 |
| 2016-03-0412:06:49 PM | 60.35 | 138.538 | 27.275 | 79.138 |
| 2016-03-0412:06:53 PM | 60.462 | 138.65 | 27.162 | 79.138 |
| 2016-03-0412:06:57 PM | 60.462 | 138.65 | 27.162 | 79.138 |
| 2016-03-0412:07:01 PM | 60.462 | 138.65 | 27.162 | 79.138 |
| 2016-03-0412:07:05 PM | 60.462 | 138.762 | 27.162 | 79.25 |
| 2016-03-0412:07:09 PM | 60.575 | 138.762 | 27.162 | 79.25 |
| 2016-03-0412:07:13 PM | 60.575 | 138.875 | 27.05 | 79.25 |
| 2016-03-0412:07:17 PM | 60.575 | 138.875 | 27.05 | 79.138 |
| 2016-03-0412:07:21 PM | 60.575 | 138.988 | 27.05 | 79.138 |
| 2016-03-0412:07:25 PM | 60.688 | 138.988 | 27.05 | 79.25 |
| 2016-03-0412:07:29 PM | 60.688 | 139.1 | 27.162 | 79.25 |
| 2016-03-0412:07:33 PM | 60.8 | 139.1 | 27.05 | 79.25 |
| 2016-03-0412:07:37 PM | 60.8 | 139.212 | 27.05 | 79.25 |
| 2016-03-0412:07:41 PM | 60.8 | 139.325 | 27.162 | 79.25 |
| 2016-03-0412:07:46 PM | 60.912 | 139.438 | 27.162 | 79.25 |
| 2016-03-0412:07:50 PM | 60.912 | 139.55 | 27.275 | 79.25 |
| 2016-03-0412:07:54 PM | 60.912 | 139.662 | 27.388 | 79.25 |
| 2016-03-0412:07:58 PM | 60.8 | 139.775 | 27.612 | 79.25 |
| 2016-03-0412:08:02 PM | 60.8 | 139.775 | 27.612 | 79.25 |
| 2016-03-0412:08:06 PM | 60.8 | 139.888 | 27.725 | 79.25 |
| 2016-03-0412:08:10 PM | 60.688 | 140 | 27.725 | 79.362 |
| 2016-03-0412:08:14 PM | 60.688 | 140.112 | 27.612 | 79.25 |
| 2016-03-0412:08:18 PM | 60.688 | 140.225 | 27.5 | 79.25 |
| 2016-03-0412:08:22 PM | 60.688 | 140.225 | 27.388 | 79.25 |
| 2016-03-0412:08:26 PM | 60.688 | 140.338 | 27.388 | 79.25 |
| 2016-03-0412:08:30 PM | 60.688 | 140.338 | 27.5 | 79.25 |
| 2016-03-0412:08:34 PM | 60.688 | 140.45 | 27.612 | 79.362 |
| 2016-03-0412:08:38 PM | 60.688 | 140.562 | 27.612 | 79.362 |
| 2016-03-0412:08:42 PM | 60.688 | 140.562 | 27.838 | 79.25 |
| 2016-03-0412:08:46 PM | 60.688 | 140.675 | 27.838 | 79.362 |
| 2016-03-0412:08:50 PM | 60.8 | 140.675 | 27.838 | 79.25 |
| 2016-03-0412:08:54 PM | 60.8 | 140.675 | 27.95 | 79.25 |
| 2016-03-0412:08:58 PM | 60.8 | 140.788 | 27.95 | 79.362 |
| 2016-03-0412:09:02 PM | 60.8 | 140.788 | 27.838 | 79.362 |
| 2016-03-0412:09:06 PM | 60.8 | 140.9 | 27.95 | 79.362 |
| 2016-03-0412:09:10 PM | 60.8 | 140.9 | 27.95 | 79.362 |
| 2016-03-0412:09:14 PM | 60.8 | 141.012 | 27.838 | 79.362 |
| 2016-03-0412:09:18 PM | 60.912 | 141.125 | 27.95 | 79.362 |
| 2016-03-0412:09:22 PM | 60.912 | 141.125 | 27.95 | 79.362 |
| 2016-03-0412:09:26 PM | 60.912 | 141.125 | 28.062 | 79.362 |
| 2016-03-0412:09:31 PM | 60.912 | 141.125 | 28.175 | 79.362 |
| 2016-03-0412:09:35 PM | 60.912 | 141.125 | 27.95 | 79.362 |
| 2016-03-0412:09:39 PM | 60.912 | 141.125 | 27.838 | 79.475 |
| 2016-03-0412:09:43 PM | 60.912 | 141.238 | 27.838 | 79.362 |
| 2016-03-0412:09:47 PM | 60.912 | 141.238 | 27.838 | 79.475 |
| 2016-03-0412:09:51 PM | 60.912 | 141.238 | 27.725 | 79.475 |
| 2016-03-0412:09:55 PM | 60.912 | 141.35 | 27.612 | 79.475 |
| 2016-03-0412:10:03 PM | 60.912 | 141.35 | 27.05 | 79.475 |
| 2016-03-0412:10:07 PM | 60.8 | 141.35 | 26.938 | 79.475 |
| 2016-03-0412:10:11 PM | 60.8 | 141.35 | 26.712 | 79.475 |
| 2016-03-0412:10:15 PM | 60.8 | 141.35 | 26.375 | 79.475 |
| 2016-03-0412:10:19 PM | 60.8 | 141.35 | 26.038 | 79.475 |
| 2016-03-0412:10:23 PM | 60.8 | 141.35 | 25.812 | 79.475 |
| 2016-03-0412:10:27 PM | 60.8 | 141.462 | 25.475 | 79.588 |
| 2016-03-0412:10:31 PM | 60.912 | 141.462 | 25.138 | 79.588 |
| 2016-03-0412:10:35 PM | 60.8 | 141.462 | 25.138 | 79.475 |
| 2016-03-0412:10:39 PM | 60.912 | 141.462 | 25.025 | 79.475 |
| 2016-03-0412:10:43 PM | 60.912 | 141.462 | 24.912 | 79.475 |
| 2016-03-0412:10:47 PM | 60.912 | 141.462 | 24.8 | 79.475 |
| 2016-03-0412:10:51 PM | 61.025 | 141.462 | 24.575 | 79.588 |
| 2016-03-0412:10:55 PM | 61.025 | 141.462 | 24.462 | 79.475 |
| 2016-03-0412:10:59 PM | 61.025 | 141.462 | 24.35 | 79.475 |
| 2016-03-0412:11:03 PM | 61.025 | 141.462 | 24.125 | 79.588 |
| 2016-03-0412:11:07 PM | 61.025 | 141.462 | 24.238 | 79.475 |
| 2016-03-0412:11:11 PM | 61.025 | 141.462 | 24.125 | 79.588 |
| 2016-03-0412:11:15 PM | 61.025 | 141.462 | 24.012 | 79.588 |
| 2016-03-0412:11:19 PM | 61.025 | 141.462 | 24.012 | 79.588 |
| 2016-03-0412:11:23 PM | 61.025 | 141.462 | 24.012 | 79.475 |
| 2016-03-0412:11:27 PM | 61.025 | 141.462 | 23.9 | 79.588 |
| 2016-03-0412:11:31 PM | 61.025 | 141.462 | 23.9 | 79.588 |
| 2016-03-0412:11:35 PM | 61.025 | 141.462 | 23.788 | 79.588 |
| 2016-03-0412:11:39 PM | 61.138 | 141.575 | 23.675 | 79.588 |
| 2016-03-0412:11:43 PM | 61.138 | 141.575 | 23.675 | 79.588 |
| 2016-03-0412:11:47 PM | 61.138 | 141.575 | 23.675 | 79.588 |
| 2016-03-0412:11:51 PM | 61.025 | 141.688 | 23.788 | 79.588 |
| 2016-03-0412:11:55 PM | 61.025 | 141.688 | 23.788 | 79.588 |
| 2016-03-0412:12:00 PM | 61.025 | 141.688 | 23.9 | 79.588 |
| 2016-03-0412:12:04 PM | 61.025 | 141.8 | 24.012 | 79.588 |
| 2016-03-0412:12:08 PM | 61.025 | 141.8 | 24.238 | 79.588 |
| 2016-03-0412:12:12 PM | 61.025 | 141.8 | 24.35 | 79.588 |
| 2016-03-0412:12:16 PM | 60.912 | 141.912 | 24.575 | 79.588 |
| 2016-03-0412:12:20 PM | 60.912 | 141.912 | 24.8 | 79.588 |
| 2016-03-0412:12:24 PM | 60.912 | 141.912 | 24.912 | 79.7 |
| 2016-03-0412:12:28 PM | 60.912 | 142.025 | 25.025 | 79.7 |
| 2016-03-0412:12:32 PM | 60.912 | 142.025 | 25.138 | 79.7 |
| 2016-03-0412:12:36 PM | 60.912 | 142.025 | 25.138 | 79.7 |
| 2016-03-0412:12:40 PM | 60.912 | 142.025 | 25.25 | 79.7 |
| 2016-03-0412:12:44 PM | 60.912 | 142.025 | 25.25 | 79.7 |
| 2016-03-0412:12:48 PM | 60.912 | 142.025 | 25.362 | 79.7 |
| 2016-03-0412:12:52 PM | 60.8 | 142.138 | 25.475 | 79.7 |
| 2016-03-0412:12:56 PM | 60.912 | 142.138 | 25.588 | 79.7 |
| 2016-03-0412:13:00 PM | 60.8 | 142.138 | 25.812 | 79.7 |
| 2016-03-0412:13:04 PM | 60.8 | 142.25 | 25.812 | 79.7 |
| 2016-03-0412:13:08 PM | 60.8 | 142.25 | 25.925 | 79.7 |
| 2016-03-0412:13:12 PM | 60.8 | 142.362 | 25.925 | 79.7 |
| 2016-03-0412:13:16 PM | 60.688 | 142.362 | 25.925 | 79.7 |
| 2016-03-0412:13:20 PM | 60.688 | 142.362 | 26.038 | 79.812 |
| 2016-03-0412:13:24 PM | 60.688 | 142.475 | 25.925 | 79.812 |
| 2016-03-0412:13:28 PM | 60.688 | 142.475 | 25.925 | 79.7 |
| 2016-03-0412:13:32 PM | 60.575 | 142.588 | 25.925 | 79.812 |
| 2016-03-0412:13:36 PM | 60.688 | 142.588 | 26.038 | 79.812 |
| 2016-03-0412:13:40 PM | 60.688 | 142.7 | 26.15 | 79.812 |
| 2016-03-0412:13:44 PM | 60.688 | 142.7 | 26.262 | 79.812 |
| 2016-03-0412:13:48 PM | 60.688 | 142.812 | 26.488 | 79.812 |
| 2016-03-0412:13:52 PM | 60.8 | 142.812 | 26.6 | 79.812 |
| 2016-03-0412:13:56 PM | 60.688 | 142.925 | 26.825 | 79.812 |
| 2016-03-0412:14:00 PM | 60.688 | 142.925 | 26.938 | 79.812 |
| 2016-03-0412:14:04 PM | 60.688 | 142.925 | 27.05 | 79.812 |
| 2016-03-0412:14:08 PM | 60.688 | 143.038 | 26.938 | 79.812 |
| 2016-03-0412:14:12 PM | 60.688 | 143.15 | 26.938 | 79.812 |
| 2016-03-0412:14:16 PM | 60.8 | 143.262 | 26.938 | 79.812 |
| 2016-03-0412:14:21 PM | 60.688 | 143.262 | 27.05 | 79.812 |
| 2016-03-0412:14:25 PM | 60.688 | 143.262 | 27.05 | 79.812 |
| 2016-03-0412:14:29 PM | 60.8 | 143.375 | 27.05 | 79.812 |
| 2016-03-0412:14:33 PM | 60.8 | 143.488 | 26.938 | 79.925 |
| 2016-03-0412:14:37 PM | 60.8 | 143.488 | 26.938 | 79.812 |
| 2016-03-0412:14:41 PM | 60.8 | 143.488 | 26.938 | 79.812 |
| 2016-03-0412:14:45 PM | 60.8 | 143.6 | 27.05 | 79.812 |
| 2016-03-0412:14:49 PM | 60.8 | 143.6 | 27.162 | 79.925 |
| 2016-03-0412:14:53 PM | 60.912 | 143.712 | 27.275 | 79.812 |
| 2016-03-0412:14:57 PM | 60.912 | 143.712 | 27.388 | 79.812 |
| 2016-03-0412:15:01 PM | 60.912 | 143.825 | 27.5 | 79.812 |
| 2016-03-0412:15:05 PM | 60.912 | 143.938 | 27.5 | 79.812 |
| 2016-03-0412:15:09 PM | 60.912 | 143.938 | 27.388 | 79.812 |
| 2016-03-0412:15:13 PM | 60.912 | 143.938 | 27.388 | 79.812 |
| 2016-03-0412:15:17 PM | 61.025 | 143.938 | 27.275 | 79.925 |
| 2016-03-0412:15:21 PM | 61.025 | 144.05 | 27.275 | 79.925 |
| 2016-03-0412:15:25 PM | 61.025 | 144.05 | 27.275 | 79.925 |
| 2016-03-0412:15:29 PM | 61.025 | 144.162 | 27.388 | 79.925 |
| 2016-03-0412:15:33 PM | 61.138 | 144.162 | 27.388 | 79.925 |
| 2016-03-0412:15:37 PM | 61.25 | 144.162 | 27.5 | 79.925 |
| 2016-03-0412:15:41 PM | 61.25 | 144.275 | 27.612 | 79.925 |
| 2016-03-0412:15:45 PM | 61.363 | 144.275 | 27.838 | 79.925 |
| 2016-03-0412:15:49 PM | 61.363 | 144.275 | 27.838 | 79.925 |
| 2016-03-0412:15:53 PM | 61.475 | 144.388 | 28.062 | 79.925 |
| 2016-03-0412:15:57 PM | 61.475 | 144.275 | 28.175 | 79.925 |
| 2016-03-0412:16:01 PM | 61.475 | 144.388 | 28.288 | 80.038 |
| 2016-03-0412:16:05 PM | 61.475 | 144.388 | 28.4 | 79.925 |
| 2016-03-0412:16:09 PM | 61.588 | 144.388 | 28.4 | 79.925 |
| 2016-03-0412:16:13 PM | 61.588 | 144.5 | 28.512 | 79.925 |
| 2016-03-0412:16:17 PM | 61.7 | 144.5 | 28.512 | 79.925 |
| 2016-03-0412:16:21 PM | 61.7 | 144.5 | 28.625 | 79.925 |
| 2016-03-0412:16:25 PM | 61.7 | 144.5 | 28.625 | 79.925 |
| 2016-03-0412:16:30 PM | 61.812 | 144.612 | 28.512 | 79.925 |
| 2016-03-0412:16:34 PM | 61.812 | 144.612 | 28.288 | 79.925 |
| 2016-03-0412:16:38 PM | 61.812 | 144.612 | 28.062 | 79.925 |
| 2016-03-0412:16:42 PM | 61.812 | 144.612 | 27.95 | 79.925 |
| 2016-03-0412:16:46 PM | 61.812 | 144.612 | 28.062 | 79.925 |
| 2016-03-0412:16:50 PM | 61.812 | 144.612 | 28.062 | 79.925 |
| 2016-03-0412:16:54 PM | 61.812 | 144.612 | 28.175 | 79.925 |
| 2016-03-0412:16:58 PM | 61.7 | 144.725 | 28.175 | 79.925 |
| 2016-03-0412:17:02 PM | 61.7 | 144.725 | 28.175 | 79.925 |
| 2016-03-0412:17:06 PM | 61.7 | 144.725 | 28.062 | 80.038 |
| 2016-03-0412:17:10 PM | 61.7 | 144.725 | 27.95 | 79.925 |
| 2016-03-0412:17:14 PM | 61.7 | 144.838 | 27.725 | 79.925 |
| 2016-03-0412:17:18 PM | 61.588 | 144.838 | 27.725 | 79.925 |
| 2016-03-0412:17:22 PM | 61.588 | 144.95 | 27.612 | 79.925 |
| 2016-03-0412:17:26 PM | 61.588 | 144.95 | 27.388 | 79.812 |
| 2016-03-0412:17:30 PM | 61.475 | 145.062 | 27.275 | 79.925 |
| 2016-03-0412:17:34 PM | 61.475 | 145.062 | 27.275 | 79.812 |
| 2016-03-0412:17:38 PM | 61.475 | 145.062 | 27.162 | 79.812 |
| 2016-03-0412:17:42 PM | 61.363 | 145.175 | 27.162 | 79.812 |
| 2016-03-0412:17:46 PM | 61.363 | 145.175 | 27.162 | 79.812 |
| 2016-03-0412:17:50 PM | 61.363 | 145.288 | 27.275 | 79.925 |
| 2016-03-0412:17:54 PM | 61.25 | 145.288 | 27.162 | 79.812 |
| 2016-03-0412:17:58 PM | 61.25 | 145.288 | 27.275 | 79.812 |
| 2016-03-0412:18:02 PM | 61.25 | 145.4 | 27.275 | 79.812 |
| 2016-03-0412:18:06 PM | 61.25 | 145.4 | 27.275 | 79.812 |
| 2016-03-0412:18:10 PM | 61.138 | 145.4 | 27.275 | 79.925 |
| 2016-03-0412:18:14 PM | 61.138 | 145.4 | 27.162 | 79.925 |
| 2016-03-0412:18:18 PM | 61.138 | 145.4 | 27.162 | 79.925 |
| 2016-03-0412:18:22 PM | 61.025 | 145.4 | 27.162 | 79.925 |
| 2016-03-0412:18:26 PM | 61.025 | 145.512 | 27.275 | 79.812 |
| 2016-03-0412:18:30 PM | 61.025 | 145.512 | 27.275 | 79.925 |
| 2016-03-0412:18:35 PM | 60.912 | 145.512 | 27.388 | 79.925 |
| 2016-03-0412:18:39 PM | 60.912 | 145.625 | 27.275 | 79.812 |
| 2016-03-0412:18:43 PM | 60.912 | 145.625 | 27.275 | 79.812 |
| 2016-03-0412:18:47 PM | 60.912 | 145.625 | 27.275 | 79.812 |
| 2016-03-0412:18:51 PM | 60.8 | 145.625 | 27.388 | 79.925 |
| 2016-03-0412:18:55 PM | 60.8 | 145.738 | 27.388 | 79.812 |
| 2016-03-0412:19:03 PM | 60.8 | 145.738 | 27.388 | 79.812 |
| 2016-03-0412:19:07 PM | 60.8 | 145.738 | 27.388 | 79.812 |
| 2016-03-0412:19:11 PM | 60.8 | 145.738 | 27.275 | 79.812 |
| 2016-03-0412:19:15 PM | 60.688 | 145.85 | 27.275 | 79.812 |
| 2016-03-0412:19:19 PM | 60.688 | 145.85 | 27.162 | 79.812 |
| 2016-03-0412:19:23 PM | 60.688 | 145.85 | 27.05 | 79.812 |
| 2016-03-0412:19:27 PM | 60.688 | 145.85 | 26.938 | 79.812 |
| 2016-03-0412:19:31 PM | 60.575 | 145.85 | 26.825 | 79.812 |
| 2016-03-0412:19:35 PM | 60.575 | 145.962 | 26.712 | 79.812 |
| 2016-03-0412:19:39 PM | 60.462 | 145.962 | 26.6 | 79.812 |
| 2016-03-0412:19:43 PM | 60.462 | 145.962 | 26.488 | 79.812 |
| 2016-03-0412:19:47 PM | 60.35 | 145.962 | 26.488 | 79.812 |
| 2016-03-0412:19:51 PM | 60.238 | 146.075 | 26.375 | 79.812 |
| 2016-03-0412:19:55 PM | 60.238 | 146.075 | 26.488 | 79.925 |
| 2016-03-0412:19:59 PM | 60.238 | 146.075 | 26.488 | 79.925 |
| 2016-03-0412:20:03 PM | 60.125 | 146.075 | 26.488 | 79.925 |
| 2016-03-0412:20:07 PM | 60.125 | 146.188 | 26.488 | 79.812 |
| 2016-03-0412:20:11 PM | 60.012 | 146.188 | 26.6 | 79.812 |
| 2016-03-0412:20:15 PM | 60.012 | 146.3 | 26.6 | 79.812 |
| 2016-03-0412:20:19 PM | 59.9 | 146.3 | 26.6 | 79.925 |
| 2016-03-0412:20:23 PM | 59.9 | 146.3 | 26.712 | 79.812 |
| 2016-03-0412:20:27 PM | 59.9 | 146.3 | 26.6 | 79.812 |
| 2016-03-0412:20:31 PM | 59.9 | 146.3 | 26.488 | 79.812 |
| 2016-03-0412:20:35 PM | 59.9 | 146.3 | 26.375 | 79.812 |
| 2016-03-0412:20:39 PM | 59.788 | 146.412 | 26.375 | 79.812 |
| 2016-03-0412:20:43 PM | 59.9 | 146.3 | 26.262 | 79.812 |
| 2016-03-0412:20:47 PM | 59.9 | 146.412 | 26.15 | 79.812 |
| 2016-03-0412:20:51 PM | 59.788 | 146.3 | 26.038 | 79.812 |
| 2016-03-0412:20:55 PM | 59.9 | 146.3 | 25.925 | 79.812 |
| 2016-03-0412:21:00 PM | 59.9 | 146.412 | 25.925 | 79.812 |
| 2016-03-0412:21:04 PM | 59.9 | 146.412 | 26.038 | 79.812 |
| 2016-03-0412:21:08 PM | 59.9 | 146.412 | 26.15 | 79.812 |
| 2016-03-0412:21:12 PM | 59.9 | 146.412 | 26.15 | 79.812 |
| 2016-03-0412:21:16 PM | 59.9 | 146.412 | 26.15 | 79.812 |
| 2016-03-0412:21:20 PM | 59.9 | 146.412 | 26.15 | 79.812 |
| 2016-03-0412:21:24 PM | 59.9 | 146.412 | 26.038 | 79.812 |
| 2016-03-0412:21:28 PM | 60.012 | 146.412 | 26.038 | 79.812 |
| 2016-03-0412:21:32 PM | 60.012 | 146.525 | 26.15 | 79.812 |
| 2016-03-0412:21:36 PM | 60.125 | 146.525 | 26.262 | 79.812 |
| 2016-03-0412:21:40 PM | 60.125 | 146.525 | 26.488 | 79.812 |
| 2016-03-0412:21:44 PM | 60.125 | 146.525 | 26.6 | 79.812 |
| 2016-03-0412:21:48 PM | 60.238 | 146.525 | 26.825 | 79.812 |
| 2016-03-0412:21:52 PM | 60.35 | 146.412 | 26.938 | 79.812 |
| 2016-03-0412:21:56 PM | 60.462 | 146.525 | 27.162 | 79.812 |
| 2016-03-0412:22:00 PM | 60.35 | 146.412 | 27.275 | 79.812 |
| 2016-03-0412:22:04 PM | 60.462 | 146.525 | 27.5 | 79.812 |
| 2016-03-0412:22:08 PM | 60.462 | 146.412 | 27.612 | 79.812 |
| 2016-03-0412:22:12 PM | 60.575 | 146.525 | 27.725 | 79.812 |
| 2016-03-0412:22:16 PM | 60.575 | 146.525 | 27.725 | 79.812 |
| 2016-03-0412:22:20 PM | 60.575 | 146.525 | 27.725 | 79.812 |
| 2016-03-0412:22:24 PM | 60.575 | 146.525 | 27.612 | 79.812 |
| 2016-03-0412:22:28 PM | 60.575 | 146.412 | 27.725 | 79.812 |
| 2016-03-0412:22:32 PM | 60.688 | 146.412 | 27.612 | 79.812 |
| 2016-03-0412:22:36 PM | 60.688 | 146.412 | 27.612 | 79.812 |
| 2016-03-0412:22:40 PM | 60.688 | 146.412 | 27.725 | 79.7 |
| 2016-03-0412:22:44 PM | 60.8 | 146.412 | 27.725 | 79.7 |
| 2016-03-0412:22:48 PM | 60.8 | 146.412 | 27.725 | 79.7 |
| 2016-03-0412:22:52 PM | 60.8 | 146.412 | 27.725 | 79.7 |
| 2016-03-0412:22:56 PM | 60.8 | 146.412 | 27.612 | 79.7 |
| 2016-03-0412:23:01 PM | 60.8 | 146.412 | 27.725 | 79.7 |
| 2016-03-0412:23:05 PM | 60.8 | 146.412 | 27.725 | 79.7 |
| 2016-03-0412:23:09 PM | 60.8 | 146.412 | 27.725 | 79.7 |
| 2016-03-0412:23:13 PM | 60.8 | 146.412 | 27.838 | 79.7 |
| 2016-03-0412:23:17 PM | 60.8 | 146.412 | 27.838 | 79.7 |
| 2016-03-0412:23:21 PM | 60.912 | 146.412 | 28.062 | 79.7 |
| 2016-03-0412:23:25 PM | 60.912 | 146.412 | 28.062 | 79.7 |
| 2016-03-0412:23:29 PM | 60.912 | 146.412 | 28.175 | 79.7 |
| 2016-03-0412:23:33 PM | 60.8 | 146.412 | 28.175 | 79.7 |
| 2016-03-0412:23:37 PM | 60.8 | 146.412 | 28.062 | 79.7 |
| 2016-03-0412:23:41 PM | 60.8 | 146.412 | 28.175 | 79.7 |
| 2016-03-0412:23:45 PM | 60.8 | 146.412 | 28.288 | 79.7 |
| 2016-03-0412:23:49 PM | 60.8 | 146.412 | 28.175 | 79.7 |
| 2016-03-0412:23:53 PM | 60.688 | 146.525 | 28.175 | 79.7 |
| 2016-03-0412:23:57 PM | 60.8 | 146.525 | 28.175 | 79.588 |
| 2016-03-0412:24:01 PM | 60.688 | 146.525 | 28.062 | 79.588 |
| 2016-03-0412:24:05 PM | 60.688 | 146.525 | 28.062 | 79.588 |
| 2016-03-0412:24:09 PM | 60.688 | 146.638 | 27.95 | 79.7 |
| 2016-03-0412:24:13 PM | 60.688 | 146.638 | 28.062 | 79.588 |
| 2016-03-0412:24:17 PM | 60.688 | 146.638 | 28.062 | 79.588 |
| 2016-03-0412:24:21 PM | 60.688 | 146.75 | 28.062 | 79.588 |
| 2016-03-0412:24:25 PM | 60.688 | 146.75 | 27.95 | 79.588 |
| 2016-03-0412:24:29 PM | 60.688 | 146.75 | 27.95 | 79.588 |
| 2016-03-0412:24:33 PM | 60.688 | 146.75 | 27.838 | 79.588 |
| 2016-03-0412:24:37 PM | 60.688 | 146.75 | 27.838 | 79.588 |
| 2016-03-0412:24:41 PM | 60.688 | 146.75 | 27.725 | 79.588 |
| 2016-03-0412:24:45 PM | 60.688 | 146.862 | 27.725 | 79.588 |
| 2016-03-0412:24:49 PM | 60.8 | 146.862 | 27.725 | 79.588 |
| 2016-03-0412:24:53 PM | 60.8 | 146.862 | 27.725 | 79.475 |
| 2016-03-0412:24:57 PM | 60.688 | 146.862 | 27.725 | 79.475 |
| 2016-03-0412:25:01 PM | 60.688 | 146.862 | 27.612 | 79.475 |
| 2016-03-0412:25:06 PM | 60.8 | 146.862 | 27.612 | 79.475 |
| 2016-03-0412:25:10 PM | 60.688 | 146.862 | 27.612 | 79.475 |
| 2016-03-0412:25:14 PM | 60.688 | 146.862 | 27.612 | 79.475 |
| 2016-03-0412:25:18 PM | 60.8 | 146.862 | 27.725 | 79.362 |
| 2016-03-0412:25:22 PM | 60.8 | 146.862 | 27.838 | 79.362 |
| 2016-03-0412:25:26 PM | 60.8 | 146.862 | 27.838 | 79.362 |
| 2016-03-0412:25:30 PM | 60.8 | 146.75 | 28.062 | 79.362 |
| 2016-03-0412:25:34 PM | 60.8 | 146.75 | 28.062 | 79.362 |
| 2016-03-0412:25:38 PM | 60.8 | 146.862 | 28.062 | 79.362 |
| 2016-03-0412:25:42 PM | 60.912 | 146.75 | 28.175 | 79.362 |
| 2016-03-0412:25:46 PM | 60.912 | 146.862 | 28.062 | 79.25 |
| 2016-03-0412:25:50 PM | 60.912 | 146.862 | 28.288 | 79.362 |
| 2016-03-0412:25:54 PM | 60.912 | 146.862 | 28.288 | 79.362 |
| 2016-03-0412:25:58 PM | 60.912 | 146.862 | 28.4 | 79.362 |
| 2016-03-0412:26:02 PM | 61.025 | 146.75 | 28.512 | 79.362 |
| 2016-03-0412:26:06 PM | 61.025 | 146.75 | 28.625 | 79.362 |
| 2016-03-0412:26:10 PM | 61.025 | 146.862 | 28.738 | 79.362 |
| 2016-03-0412:26:14 PM | 61.138 | 146.862 | 28.85 | 79.362 |
| 2016-03-0412:26:18 PM | 61.138 | 146.975 | 28.962 | 79.362 |
| 2016-03-0412:26:22 PM | 61.138 | 146.862 | 29.075 | 79.362 |
| 2016-03-0412:26:26 PM | 61.138 | 146.862 | 29.075 | 79.362 |
| 2016-03-0412:26:30 PM | 61.138 | 146.862 | 28.962 | 79.362 |
| 2016-03-0412:26:34 PM | 61.25 | 146.975 | 28.738 | 79.362 |
| 2016-03-0412:26:38 PM | 61.25 | 146.975 | 28.512 | 79.362 |
| 2016-03-0412:26:42 PM | 61.25 | 146.975 | 28.175 | 79.25 |
| 2016-03-0412:26:46 PM | 61.25 | 146.975 | 28.175 | 79.362 |
| 2016-03-0412:26:50 PM | 61.138 | 147.088 | 28.062 | 79.362 |
| 2016-03-0412:26:54 PM | 61.138 | 147.088 | 27.95 | 79.25 |
| 2016-03-0412:26:58 PM | 61.025 | 147.088 | 27.95 | 79.362 |
| 2016-03-0412:27:02 PM | 61.025 | 147.2 | 27.95 | 79.362 |
| 2016-03-0412:27:06 PM | 60.912 | 147.2 | 27.95 | 79.362 |
| 2016-03-0412:27:10 PM | 60.8 | 147.312 | 28.062 | 79.25 |
| 2016-03-0412:27:14 PM | 60.8 | 147.312 | 28.062 | 79.25 |
| 2016-03-0412:27:18 PM | 60.688 | 147.425 | 28.062 | 79.25 |
| 2016-03-0412:27:22 PM | 60.688 | 147.425 | 28.062 | 79.25 |
| 2016-03-0412:27:26 PM | 60.688 | 147.538 | 28.062 | 79.25 |
| 2016-03-0412:27:30 PM | 60.688 | 147.538 | 28.062 | 79.25 |
| 2016-03-0412:27:34 PM | 60.575 | 147.65 | 28.175 | 79.25 |
| 2016-03-0412:27:38 PM | 60.575 | 147.65 | 28.288 | 79.25 |
| 2016-03-0412:27:42 PM | 60.575 | 147.763 | 28.512 | 79.25 |
| 2016-03-0412:27:46 PM | 60.575 | 147.763 | 28.512 | 79.25 |
| 2016-03-0412:27:50 PM | 60.462 | 147.763 | 28.625 | 79.25 |
| 2016-03-0412:27:54 PM | 60.462 | 147.875 | 28.625 | 79.25 |
| 2016-03-0412:27:58 PM | 60.35 | 147.988 | 28.738 | 79.25 |
| 2016-03-0412:28:02 PM | 60.35 | 147.988 | 28.738 | 79.25 |
| 2016-03-0412:28:06 PM | 60.35 | 147.988 | 28.85 | 79.25 |
| 2016-03-0412:28:10 PM | 60.238 | 148.1 | 28.738 | 79.25 |
| 2016-03-0412:28:14 PM | 60.35 | 148.1 | 28.625 | 79.25 |
| 2016-03-0412:28:18 PM | 60.35 | 148.212 | 28.625 | 79.25 |
| 2016-03-0412:28:22 PM | 60.35 | 148.212 | 28.738 | 79.25 |
| 2016-03-0412:28:26 PM | 60.35 | 148.325 | 28.738 | 79.25 |
| 2016-03-0412:28:30 PM | 60.35 | 148.325 | 28.85 | 79.25 |
| 2016-03-0412:28:34 PM | 60.238 | 148.438 | 28.738 | 79.25 |
| 2016-03-0412:28:39 PM | 60.238 | 148.55 | 28.625 | 79.25 |
| 2016-03-0412:28:43 PM | 60.238 | 148.55 | 28.512 | 79.25 |
| 2016-03-0412:28:47 PM | 60.238 | 148.662 | 28.512 | 79.25 |
| 2016-03-0412:28:51 PM | 60.238 | 148.662 | 28.512 | 79.25 |
| 2016-03-0412:28:55 PM | 60.238 | 148.775 | 28.625 | 79.25 |
| 2016-03-0412:28:59 PM | 60.238 | 148.888 | 28.625 | 79.25 |
| 2016-03-0412:29:03 PM | 60.238 | 148.888 | 28.625 | 79.25 |
| 2016-03-0412:29:07 PM | 60.238 | 149 | 28.738 | 79.25 |
| 2016-03-0412:29:11 PM | 60.238 | 149 | 28.85 | 79.25 |
| 2016-03-0412:29:15 PM | 60.238 | 149.112 | 28.962 | 79.25 |
| 2016-03-0412:29:19 PM | 60.238 | 149.112 | 29.075 | 79.25 |
| 2016-03-0412:29:23 PM | 60.35 | 149.225 | 29.075 | 79.138 |
| 2016-03-0412:29:27 PM | 60.35 | 149.225 | 29.075 | 79.25 |
| 2016-03-0412:29:31 PM | 60.35 | 149.225 | 28.962 | 79.25 |
| 2016-03-0412:29:35 PM | 60.462 | 149.338 | 28.85 | 79.25 |
| 2016-03-0412:29:39 PM | 60.462 | 149.338 | 28.738 | 79.25 |
| 2016-03-0412:29:43 PM | 60.575 | 149.45 | 28.738 | 79.25 |
| 2016-03-0412:29:47 PM | 60.575 | 149.562 | 28.738 | 79.25 |
| 2016-03-0412:29:51 PM | 60.575 | 149.562 | 28.738 | 79.138 |
| 2016-03-0412:29:55 PM | 60.575 | 149.675 | 28.738 | 79.138 |
| 2016-03-0412:29:59 PM | 60.575 | 149.675 | 28.738 | 79.138 |
| 2016-03-0412:30:03 PM | 60.575 | 149.788 | 28.738 | 79.138 |
| 2016-03-0412:30:07 PM | 60.575 | 149.788 | 28.85 | 79.138 |
| 2016-03-0412:30:11 PM | 60.575 | 149.9 | 28.962 | 79.138 |
| 2016-03-0412:30:15 PM | 60.575 | 150.013 | 28.962 | 79.138 |
| 2016-03-0412:30:19 PM | 60.462 | 150.013 | 29.075 | 79.138 |
| 2016-03-0412:30:23 PM | 60.462 | 150.013 | 29.075 | 79.138 |
| 2016-03-0412:30:27 PM | 60.462 | 150.125 | 29.075 | 79.138 |
| 2016-03-0412:30:31 PM | 60.462 | 150.125 | 28.962 | 79.138 |
| 2016-03-0412:30:35 PM | 60.462 | 150.238 | 29.075 | 79.138 |
| 2016-03-0412:30:39 PM | 60.462 | 150.35 | 29.075 | 79.138 |
| 2016-03-0412:30:43 PM | 60.35 | 150.35 | 29.188 | 79.138 |
| 2016-03-0412:30:48 PM | 60.35 | 150.462 | 29.188 | 79.138 |
| 2016-03-0412:30:52 PM | 60.35 | 150.575 | 29.188 | 79.138 |
| 2016-03-0412:30:56 PM | 60.35 | 150.575 | 29.075 | 79.138 |
| 2016-03-0412:31:00 PM | 60.35 | 150.688 | 29.188 | 79.138 |
| 2016-03-0412:31:04 PM | 60.35 | 150.688 | 29.188 | 79.138 |
| 2016-03-0412:31:08 PM | 60.35 | 150.8 | 29.3 | 79.138 |
| 2016-03-0412:31:12 PM | 60.238 | 150.8 | 29.3 | 79.138 |
| 2016-03-0412:31:20 PM | 60.35 | 150.912 | 29.412 | 79.138 |
| 2016-03-0412:31:24 PM | 60.238 | 150.912 | 29.525 | 79.138 |
| 2016-03-0412:31:28 PM | 60.238 | 151.025 | 29.525 | 79.138 |
| 2016-03-0412:31:32 PM | 60.238 | 151.025 | 29.412 | 79.138 |
| 2016-03-0412:31:36 PM | 60.238 | 151.138 | 29.3 | 79.138 |
| 2016-03-0412:31:40 PM | 60.238 | 151.138 | 29.075 | 79.138 |
| 2016-03-0412:31:44 PM | 60.238 | 151.25 | 29.075 | 79.138 |
| 2016-03-0412:31:48 PM | 60.238 | 151.25 | 28.962 | 79.138 |
| 2016-03-0412:31:52 PM | 60.238 | 151.25 | 28.962 | 79.138 |
| 2016-03-0412:31:56 PM | 60.238 | 151.25 | 28.962 | 79.138 |
| 2016-03-0412:32:00 PM | 60.238 | 151.362 | 28.962 | 79.138 |
| 2016-03-0412:32:04 PM | 60.238 | 151.362 | 29.075 | 79.138 |
| 2016-03-0412:32:08 PM | 60.238 | 151.362 | 29.188 | 79.138 |
| 2016-03-0412:32:12 PM | 60.238 | 151.475 | 29.3 | 79.138 |
| 2016-03-0412:32:16 PM | 60.238 | 151.475 | 29.412 | 79.138 |
| 2016-03-0412:32:20 PM | 60.238 | 151.475 | 29.525 | 79.138 |
| 2016-03-0412:32:24 PM | 60.238 | 151.475 | 29.525 | 79.138 |
| 2016-03-0412:32:28 PM | 60.238 | 151.475 | 29.638 | 79.138 |
| 2016-03-0412:32:32 PM | 60.238 | 151.475 | 29.75 | 79.138 |
| 2016-03-0412:32:36 PM | 60.238 | 151.588 | 29.75 | 79.138 |
| 2016-03-0412:32:40 PM | 60.238 | 151.475 | 29.75 | 79.138 |
| 2016-03-0412:32:44 PM | 60.238 | 151.475 | 29.75 | 79.138 |
| 2016-03-0412:32:48 PM | 60.238 | 151.588 | 29.862 | 79.138 |
| 2016-03-0412:32:52 PM | 60.238 | 151.588 | 29.75 | 79.138 |
| 2016-03-0412:32:56 PM | 60.238 | 151.588 | 29.75 | 79.138 |
| 2016-03-0412:33:00 PM | 60.35 | 151.588 | 29.638 | 79.138 |
| 2016-03-0412:33:04 PM | 60.35 | 151.588 | 29.638 | 79.138 |
| 2016-03-0412:33:09 PM | 60.35 | 151.588 | 29.638 | 79.138 |
| 2016-03-0412:33:13 PM | 60.35 | 151.7 | 29.75 | 79.138 |
| 2016-03-0412:33:17 PM | 60.462 | 151.7 | 29.75 | 79.138 |
| 2016-03-0412:33:21 PM | 60.462 | 151.7 | 29.862 | 79.138 |
| 2016-03-0412:33:25 PM | 60.462 | 151.588 | 29.862 | 79.138 |
| 2016-03-0412:33:29 PM | 60.462 | 151.7 | 29.75 | 79.138 |
| 2016-03-0412:33:33 PM | 60.462 | 151.7 | 29.75 | 79.138 |
| 2016-03-0412:33:37 PM | 60.575 | 151.7 | 29.638 | 79.138 |
| 2016-03-0412:33:41 PM | 60.575 | 151.7 | 29.638 | 79.138 |
| 2016-03-0412:33:45 PM | 60.575 | 151.588 | 29.638 | 79.138 |
| 2016-03-0412:33:49 PM | 60.575 | 151.588 | 29.525 | 79.138 |
| 2016-03-0412:33:53 PM | 60.575 | 151.588 | 29.412 | 79.025 |
| 2016-03-0412:33:57 PM | 60.575 | 151.588 | 29.412 | 79.138 |
| 2016-03-0412:34:01 PM | 60.575 | 151.588 | 29.188 | 79.138 |
| 2016-03-0412:34:05 PM | 60.462 | 151.588 | 29.075 | 79.138 |
| 2016-03-0412:34:09 PM | 60.575 | 151.475 | 28.85 | 79.138 |
| 2016-03-0412:34:13 PM | 60.575 | 151.475 | 28.625 | 79.138 |
| 2016-03-0412:34:17 PM | 60.688 | 151.362 | 28.4 | 79.138 |
| 2016-03-0412:34:21 PM | 60.575 | 151.362 | 28.288 | 79.138 |
| 2016-03-0412:34:25 PM | 60.688 | 151.362 | 28.175 | 79.138 |
| 2016-03-0412:34:29 PM | 60.688 | 151.362 | 28.175 | 79.138 |
| 2016-03-0412:34:33 PM | 60.688 | 151.25 | 28.175 | 79.138 |
| 2016-03-0412:34:37 PM | 60.688 | 151.25 | 28.062 | 79.138 |
| 2016-03-0412:34:41 PM | 60.575 | 151.25 | 27.95 | 79.138 |
| 2016-03-0412:34:45 PM | 60.575 | 151.138 | 27.95 | 79.138 |
| 2016-03-0412:34:49 PM | 60.575 | 151.138 | 27.95 | 79.138 |
| 2016-03-0412:34:53 PM | 60.575 | 151.025 | 27.95 | 79.138 |
| 2016-03-0412:34:57 PM | 60.575 | 151.025 | 28.062 | 79.138 |
| 2016-03-0412:35:01 PM | 60.575 | 150.912 | 28.062 | 79.138 |
| 2016-03-0412:35:05 PM | 60.575 | 150.912 | 27.95 | 79.138 |
| 2016-03-0412:35:09 PM | 60.575 | 150.912 | 27.95 | 79.025 |
| 2016-03-0412:35:13 PM | 60.575 | 150.8 | 27.838 | 79.138 |
| 2016-03-0412:35:17 PM | 60.575 | 150.8 | 27.838 | 79.025 |
| 2016-03-0412:35:21 PM | 60.462 | 150.688 | 27.95 | 79.138 |
| 2016-03-0412:35:26 PM | 60.462 | 150.688 | 28.062 | 79.025 |
| 2016-03-0412:35:30 PM | 60.462 | 150.688 | 27.95 | 79.138 |
| 2016-03-0412:35:34 PM | 60.462 | 150.688 | 27.95 | 79.025 |
| 2016-03-0412:35:38 PM | 60.35 | 150.575 | 28.062 | 79.138 |
| 2016-03-0412:35:42 PM | 60.35 | 150.575 | 28.062 | 79.025 |
| 2016-03-0412:35:46 PM | 60.35 | 150.575 | 28.175 | 79.138 |
| 2016-03-0412:35:50 PM | 60.238 | 150.575 | 28.175 | 79.138 |
| 2016-03-0412:35:54 PM | 60.238 | 150.575 | 28.288 | 79.025 |
| 2016-03-0412:35:58 PM | 60.238 | 150.575 | 28.4 | 79.025 |
| 2016-03-0412:36:02 PM | 60.238 | 150.575 | 28.4 | 79.138 |
| 2016-03-0412:36:06 PM | 60.125 | 150.462 | 28.288 | 79.138 |
| 2016-03-0412:36:10 PM | 60.125 | 150.462 | 28.288 | 79.138 |
| 2016-03-0412:36:14 PM | 60.012 | 150.462 | 28.4 | 79.025 |
| 2016-03-0412:36:18 PM | 60.125 | 150.462 | 28.512 | 79.138 |
| 2016-03-0412:36:22 PM | 60.012 | 150.462 | 28.738 | 79.025 |
| 2016-03-0412:36:26 PM | 60.012 | 150.462 | 28.85 | 79.025 |
| 2016-03-0412:36:30 PM | 59.9 | 150.462 | 28.85 | 79.138 |
| 2016-03-0412:36:34 PM | 59.9 | 150.35 | 28.85 | 79.138 |
| 2016-03-0412:36:38 PM | 59.9 | 150.35 | 28.85 | 79.025 |
| 2016-03-0412:36:42 PM | 59.9 | 150.35 | 28.738 | 79.138 |
| 2016-03-0412:36:46 PM | 59.9 | 150.35 | 28.738 | 79.138 |
| 2016-03-0412:36:50 PM | 60.012 | 150.238 | 28.625 | 79.138 |
| 2016-03-0412:36:54 PM | 60.012 | 150.238 | 28.625 | 79.138 |
| 2016-03-0412:36:58 PM | 60.012 | 150.238 | 28.625 | 79.025 |
| 2016-03-0412:37:02 PM | 60.012 | 150.238 | 28.625 | 79.138 |
| 2016-03-0412:37:06 PM | 60.012 | 150.238 | 28.625 | 79.138 |
| 2016-03-0412:37:10 PM | 60.012 | 150.238 | 28.738 | 79.025 |
| 2016-03-0412:37:14 PM | 59.9 | 150.238 | 28.85 | 79.138 |
| 2016-03-0412:37:18 PM | 60.012 | 150.238 | 28.85 | 79.138 |
| 2016-03-0412:37:22 PM | 60.012 | 150.238 | 28.85 | 79.138 |
| 2016-03-0412:37:26 PM | 59.9 | 150.238 | 28.85 | 79.025 |
| 2016-03-0412:37:30 PM | 59.9 | 150.238 | 28.738 | 79.025 |
| 2016-03-0412:37:35 PM | 59.9 | 150.238 | 28.625 | 79.025 |
| 2016-03-0412:37:39 PM | 59.788 | 150.238 | 28.625 | 79.025 |
| 2016-03-0412:37:43 PM | 59.788 | 150.238 | 28.738 | 79.025 |
| 2016-03-0412:37:47 PM | 59.788 | 150.238 | 28.738 | 79.025 |
| 2016-03-0412:37:51 PM | 59.788 | 150.238 | 28.738 | 79.138 |
| 2016-03-0412:37:55 PM | 59.788 | 150.238 | 28.738 | 79.025 |
| 2016-03-0412:37:59 PM | 59.788 | 150.238 | 28.625 | 79.025 |
| 2016-03-0412:38:03 PM | 59.675 | 150.238 | 28.512 | 79.025 |
| 2016-03-0412:38:07 PM | 59.788 | 150.238 | 28.288 | 79.025 |
| 2016-03-0412:38:11 PM | 59.675 | 150.238 | 28.062 | 79.025 |
| 2016-03-0412:38:15 PM | 59.675 | 150.238 | 27.838 | 79.025 |
| 2016-03-0412:38:19 PM | 59.562 | 150.238 | 27.612 | 79.025 |
| 2016-03-0412:38:23 PM | 59.675 | 150.238 | 27.5 | 79.025 |
| 2016-03-0412:38:27 PM | 59.562 | 150.125 | 27.388 | 79.025 |
| 2016-03-0412:38:31 PM | 59.562 | 150.125 | 27.388 | 79.025 |
| 2016-03-0412:38:35 PM | 59.562 | 150.125 | 27.162 | 79.025 |
| 2016-03-0412:38:39 PM | 59.45 | 150.125 | 27.05 | 79.025 |
| 2016-03-0412:38:43 PM | 59.562 | 150.125 | 26.938 | 79.025 |
| 2016-03-0412:38:47 PM | 59.45 | 150.125 | 26.825 | 79.025 |
| 2016-03-0412:38:51 PM | 59.45 | 150.125 | 26.712 | 79.025 |
| 2016-03-0412:38:55 PM | 59.45 | 150.013 | 26.6 | 79.025 |
| 2016-03-0412:38:59 PM | 59.45 | 150.013 | 26.712 | 79.025 |
| 2016-03-0412:39:03 PM | 59.45 | 150.013 | 26.825 | 79.025 |
| 2016-03-0412:39:07 PM | 59.45 | 150.013 | 26.938 | 79.025 |
| 2016-03-0412:39:11 PM | 59.45 | 150.013 | 27.05 | 78.912 |
| 2016-03-0412:39:15 PM | 59.45 | 149.9 | 27.162 | 79.025 |
| 2016-03-0412:39:19 PM | 59.338 | 149.9 | 27.275 | 78.912 |
| 2016-03-0412:39:23 PM | 59.338 | 149.9 | 27.388 | 79.025 |
| 2016-03-0412:39:27 PM | 59.338 | 149.788 | 27.612 | 78.912 |
| 2016-03-0412:39:31 PM | 59.338 | 149.788 | 27.725 | 79.025 |
| 2016-03-0412:39:35 PM | 59.338 | 149.788 | 27.838 | 79.025 |
| 2016-03-0412:39:39 PM | 59.338 | 149.788 | 27.838 | 79.025 |
| 2016-03-0412:39:43 PM | 59.338 | 149.675 | 27.838 | 79.025 |
| 2016-03-0412:39:47 PM | 59.338 | 149.675 | 27.725 | 79.025 |
| 2016-03-0412:39:52 PM | 59.225 | 149.675 | 27.5 | 79.025 |
| 2016-03-0412:39:56 PM | 59.338 | 149.675 | 27.388 | 78.912 |
| 2016-03-0412:40:00 PM | 59.225 | 149.562 | 27.275 | 78.912 |
| 2016-03-0412:40:04 PM | 59.225 | 149.562 | 27.162 | 79.025 |
| 2016-03-0412:40:08 PM | 59.225 | 149.562 | 27.05 | 78.912 |
| 2016-03-0412:40:12 PM | 59.225 | 149.45 | 26.938 | 78.912 |
| 2016-03-0412:40:16 PM | 59.112 | 149.45 | 26.938 | 78.912 |
| 2016-03-0412:40:20 PM | 59.112 | 149.338 | 26.825 | 78.912 |
| 2016-03-0412:40:24 PM | 59.112 | 149.338 | 26.825 | 78.912 |
| 2016-03-0412:40:28 PM | 59 | 149.225 | 26.825 | 78.912 |
| 2016-03-0412:40:32 PM | 59 | 149.225 | 26.825 | 78.912 |
| 2016-03-0412:40:36 PM | 59 | 149.225 | 26.825 | 78.912 |
| 2016-03-0412:40:40 PM | 59 | 149.112 | 26.938 | 79.025 |
| 2016-03-0412:40:44 PM | 59 | 149.112 | 27.05 | 78.912 |
| 2016-03-0412:40:48 PM | 58.888 | 149.112 | 27.162 | 78.912 |
| 2016-03-0412:40:52 PM | 58.888 | 149 | 27.162 | 78.912 |
| 2016-03-0412:40:56 PM | 58.888 | 149 | 26.938 | 78.912 |
| 2016-03-0412:41:00 PM | 58.888 | 148.888 | 26.712 | 78.912 |
| 2016-03-0412:41:04 PM | 59 | 148.775 | 26.6 | 78.912 |
| 2016-03-0412:41:08 PM | 59 | 148.775 | 26.712 | 78.912 |
| 2016-03-0412:41:12 PM | 59 | 148.662 | 26.712 | 78.912 |
| 2016-03-0412:41:16 PM | 59 | 148.662 | 26.712 | 78.8 |
| 2016-03-0412:41:20 PM | 58.888 | 148.662 | 26.825 | 78.8 |
| 2016-03-0412:41:24 PM | 59 | 148.55 | 26.825 | 78.8 |
| 2016-03-0412:41:28 PM | 59 | 148.438 | 26.825 | 78.912 |
| 2016-03-0412:41:32 PM | 59 | 148.438 | 26.825 | 78.912 |
| 2016-03-0412:41:36 PM | 59 | 148.325 | 26.938 | 78.912 |
| 2016-03-0412:41:40 PM | 59 | 148.212 | 26.938 | 78.912 |
| 2016-03-0412:41:44 PM | 59 | 148.212 | 27.05 | 78.912 |
| 2016-03-0412:41:48 PM | 59.112 | 148.1 | 27.05 | 78.912 |
| 2016-03-0412:41:52 PM | 59 | 148.1 | 27.162 | 78.8 |
| 2016-03-0412:41:56 PM | 59 | 147.988 | 27.275 | 78.8 |
| 2016-03-0412:42:00 PM | 59.112 | 147.988 | 27.275 | 78.8 |
| 2016-03-0412:42:04 PM | 59.112 | 147.988 | 27.388 | 78.8 |
| 2016-03-0412:42:08 PM | 59.112 | 147.988 | 27.388 | 78.912 |
| 2016-03-0412:42:13 PM | 59.112 | 147.875 | 27.5 | 78.8 |
| 2016-03-0412:42:17 PM | 59.225 | 147.875 | 27.612 | 78.8 |
| 2016-03-0412:42:21 PM | 59.112 | 147.763 | 27.95 | 78.8 |
| 2016-03-0412:42:25 PM | 59.112 | 147.763 | 28.062 | 78.8 |
| 2016-03-0412:42:29 PM | 59.112 | 147.763 | 28.175 | 78.8 |
| 2016-03-0412:42:33 PM | 59.112 | 147.763 | 28.288 | 78.8 |
| 2016-03-0412:42:37 PM | 59.112 | 147.763 | 28.288 | 78.8 |
| 2016-03-0412:42:41 PM | 59.225 | 147.763 | 28.4 | 78.8 |
| 2016-03-0412:42:45 PM | 59.225 | 147.65 | 28.512 | 78.8 |
| 2016-03-0412:42:49 PM | 59.225 | 147.763 | 28.625 | 78.8 |
| 2016-03-0412:42:53 PM | 59.225 | 147.763 | 28.738 | 78.8 |
| 2016-03-0412:42:57 PM | 59.225 | 147.763 | 28.85 | 78.8 |
| 2016-03-0412:43:01 PM | 59.338 | 147.763 | 28.962 | 78.8 |
| 2016-03-0412:43:05 PM | 59.338 | 147.763 | 28.962 | 78.8 |
| 2016-03-0412:43:09 PM | 59.338 | 147.763 | 29.075 | 78.8 |
| 2016-03-0412:43:13 PM | 59.45 | 147.763 | 29.075 | 78.8 |
| 2016-03-0412:43:17 PM | 59.45 | 147.763 | 29.075 | 78.8 |
| 2016-03-0412:43:21 PM | 59.45 | 147.763 | 28.962 | 78.8 |
| 2016-03-0412:43:25 PM | 59.562 | 147.763 | 28.962 | 78.8 |
| 2016-03-0412:43:29 PM | 59.562 | 147.763 | 28.962 | 78.912 |
| 2016-03-0412:43:33 PM | 59.562 | 147.65 | 28.962 | 78.8 |
| 2016-03-0412:43:37 PM | 59.675 | 147.65 | 28.962 | 78.8 |
| 2016-03-0412:43:41 PM | 59.562 | 147.65 | 28.962 | 78.8 |
| 2016-03-0412:43:45 PM | 59.675 | 147.65 | 28.85 | 78.8 |
| 2016-03-0412:43:49 PM | 59.675 | 147.65 | 28.738 | 78.8 |
| 2016-03-0412:43:53 PM | 59.675 | 147.65 | 28.512 | 78.8 |
| 2016-03-0412:43:57 PM | 59.675 | 147.65 | 28.4 | 78.8 |
| 2016-03-0412:44:01 PM | 59.675 | 147.763 | 28.175 | 78.8 |
| 2016-03-0412:44:05 PM | 59.675 | 147.763 | 28.062 | 78.8 |
| 2016-03-0412:44:09 PM | 59.675 | 147.763 | 27.95 | 78.8 |
| 2016-03-0412:44:13 PM | 59.675 | 147.763 | 27.725 | 78.8 |
| 2016-03-0412:44:17 PM | 59.675 | 147.763 | 27.388 | 78.8 |
| 2016-03-0412:44:21 PM | 59.675 | 147.875 | 27.162 | 78.912 |
| 2016-03-0412:44:26 PM | 59.675 | 147.875 | 27.05 | 78.8 |
| 2016-03-0412:44:30 PM | 59.675 | 147.988 | 26.938 | 78.8 |
| 2016-03-0412:44:34 PM | 59.675 | 147.988 | 27.05 | 78.8 |
| 2016-03-0412:44:38 PM | 59.675 | 147.988 | 27.162 | 78.8 |
| 2016-03-0412:44:42 PM | 59.562 | 147.988 | 27.162 | 78.8 |
| 2016-03-0412:44:46 PM | 59.562 | 148.1 | 27.162 | 78.8 |
| 2016-03-0412:44:50 PM | 59.562 | 148.1 | 27.275 | 78.8 |
| 2016-03-0412:44:54 PM | 59.562 | 148.1 | 27.275 | 78.8 |
| 2016-03-0412:44:58 PM | 59.562 | 148.1 | 27.275 | 78.8 |
| 2016-03-0412:45:02 PM | 59.45 | 148.212 | 27.275 | 78.8 |
| 2016-03-0412:45:06 PM | 59.45 | 148.212 | 27.162 | 78.8 |
| 2016-03-0412:45:10 PM | 59.45 | 148.325 | 27.162 | 78.8 |
| 2016-03-0412:45:14 PM | 59.45 | 148.325 | 27.162 | 78.8 |
| 2016-03-0412:45:18 PM | 59.45 | 148.438 | 27.162 | 78.8 |
| 2016-03-0412:45:22 PM | 59.45 | 148.438 | 27.162 | 78.8 |
| 2016-03-0412:45:26 PM | 59.45 | 148.438 | 27.275 | 78.8 |
| 2016-03-0412:45:30 PM | 59.45 | 148.55 | 27.275 | 78.8 |
| 2016-03-0412:45:34 PM | 59.45 | 148.55 | 27.5 | 78.8 |
| 2016-03-0412:45:38 PM | 59.45 | 148.662 | 27.612 | 78.8 |
| 2016-03-0412:45:42 PM | 59.45 | 148.662 | 27.725 | 78.8 |
| 2016-03-0412:45:46 PM | 59.338 | 148.662 | 27.95 | 78.8 |
| 2016-03-0412:45:50 PM | 59.45 | 148.662 | 28.175 | 78.8 |
| 2016-03-0412:45:54 PM | 59.45 | 148.775 | 28.288 | 78.8 |
| 2016-03-0412:45:58 PM | 59.45 | 148.888 | 28.4 | 78.8 |
| 2016-03-0412:46:02 PM | 59.45 | 148.888 | 28.288 | 78.8 |
| 2016-03-0412:46:06 PM | 59.562 | 148.888 | 28.175 | 78.8 |
| 2016-03-0412:46:10 PM | 59.562 | 149 | 28.062 | 78.8 |
| 2016-03-0412:46:14 PM | 59.562 | 149.112 | 28.062 | 78.8 |
| 2016-03-0412:46:18 PM | 59.562 | 149.112 | 28.062 | 78.8 |
| 2016-03-0412:46:22 PM | 59.562 | 149.112 | 28.062 | 78.8 |
| 2016-03-0412:46:26 PM | 59.562 | 149.225 | 27.95 | 78.8 |
| 2016-03-0412:46:30 PM | 59.562 | 149.338 | 28.062 | 78.688 |
| 2016-03-0412:46:34 PM | 59.562 | 149.338 | 28.062 | 78.688 |
| 2016-03-0412:46:38 PM | 59.562 | 149.338 | 28.175 | 78.688 |
| 2016-03-0412:46:42 PM | 59.562 | 149.45 | 28.175 | 78.688 |
| 2016-03-0412:46:47 PM | 59.562 | 149.45 | 28.175 | 78.688 |
| 2016-03-0412:46:51 PM | 59.562 | 149.45 | 28.175 | 78.688 |
| 2016-03-0412:46:55 PM | 59.562 | 149.562 | 28.175 | 78.688 |
| 2016-03-0412:46:59 PM | 59.562 | 149.562 | 28.175 | 78.688 |
| 2016-03-0412:47:03 PM | 59.45 | 149.675 | 28.288 | 78.688 |
| 2016-03-0412:47:07 PM | 59.45 | 149.675 | 28.288 | 78.688 |
| 2016-03-0412:47:11 PM | 59.45 | 149.675 | 28.288 | 78.688 |
| 2016-03-0412:47:15 PM | 59.45 | 149.675 | 28.288 | 78.688 |
| 2016-03-0412:47:19 PM | 59.45 | 149.788 | 28.288 | 78.688 |
| 2016-03-0412:47:23 PM | 59.338 | 149.9 | 28.175 | 78.688 |
| 2016-03-0412:47:27 PM | 59.45 | 149.9 | 27.838 | 78.688 |
| 2016-03-0412:47:31 PM | 59.338 | 149.9 | 27.5 | 78.688 |
| 2016-03-0412:47:35 PM | 59.338 | 150.013 | 27.275 | 78.688 |
| 2016-03-0412:47:39 PM | 59.338 | 150.013 | 27.05 | 78.688 |
| 2016-03-0412:47:43 PM | 59.338 | 150.013 | 27.05 | 78.688 |
| 2016-03-0412:47:47 PM | 59.338 | 150.013 | 27.162 | 78.688 |
| 2016-03-0412:47:51 PM | 59.338 | 150.013 | 27.162 | 78.688 |
| 2016-03-0412:47:55 PM | 59.338 | 150.125 | 27.275 | 78.688 |
| 2016-03-0412:47:59 PM | 59.338 | 150.013 | 27.275 | 78.688 |
| 2016-03-0412:48:03 PM | 59.338 | 150.125 | 27.388 | 78.688 |
| 2016-03-0412:48:07 PM | 59.338 | 150.125 | 27.5 | 78.688 |
| 2016-03-0412:48:11 PM | 59.338 | 150.125 | 27.838 | 78.688 |
| 2016-03-0412:48:15 PM | 59.225 | 150.125 | 27.95 | 78.688 |
| 2016-03-0412:48:19 PM | 59.338 | 150.125 | 28.175 | 78.688 |
| 2016-03-0412:48:23 PM | 59.338 | 150.125 | 28.175 | 78.688 |
| 2016-03-0412:48:27 PM | 59.338 | 150.238 | 28.288 | 78.688 |
| 2016-03-0412:48:31 PM | 59.338 | 150.238 | 28.175 | 78.688 |
| 2016-03-0412:48:35 PM | 59.338 | 150.238 | 28.288 | 78.688 |
| 2016-03-0412:48:39 PM | 59.338 | 150.238 | 28.4 | 78.8 |
| 2016-03-0412:48:43 PM | 59.45 | 150.238 | 28.512 | 78.688 |
| 2016-03-0412:48:47 PM | 59.338 | 150.238 | 28.625 | 78.8 |
| 2016-03-0412:48:51 PM | 59.338 | 150.238 | 28.625 | 78.8 |
| 2016-03-0412:48:56 PM | 59.45 | 150.238 | 28.738 | 78.8 |
| 2016-03-0412:49:00 PM | 59.338 | 150.238 | 28.738 | 78.8 |
| 2016-03-0412:49:04 PM | 59.338 | 150.238 | 28.738 | 78.8 |
| 2016-03-0412:49:08 PM | 59.338 | 150.238 | 28.738 | 78.8 |
| 2016-03-0412:49:12 PM | 59.45 | 150.238 | 28.738 | 78.8 |
| 2016-03-0412:49:16 PM | 59.45 | 150.238 | 28.85 | 78.8 |
| 2016-03-0412:49:20 PM | 59.562 | 150.125 | 28.85 | 78.8 |
| 2016-03-0412:49:24 PM | 59.562 | 150.125 | 28.85 | 78.8 |
| 2016-03-0412:49:28 PM | 59.562 | 150.238 | 28.85 | 78.8 |
| 2016-03-0412:49:32 PM | 59.562 | 150.238 | 28.85 | 78.8 |
| 2016-03-0412:49:36 PM | 59.675 | 150.238 | 28.962 | 78.8 |
| 2016-03-0412:49:40 PM | 59.675 | 150.238 | 29.075 | 78.8 |
| 2016-03-0412:49:44 PM | 59.675 | 150.238 | 29.3 | 78.8 |
| 2016-03-0412:49:48 PM | 59.675 | 150.238 | 29.412 | 78.912 |
| 2016-03-0412:49:52 PM | 59.788 | 150.125 | 29.525 | 78.8 |
| 2016-03-0412:49:56 PM | 59.788 | 150.238 | 29.75 | 78.912 |
| 2016-03-0412:50:00 PM | 59.788 | 150.125 | 29.862 | 78.912 |
| 2016-03-0412:50:04 PM | 59.788 | 150.125 | 29.75 | 78.912 |
| 2016-03-0412:50:08 PM | 59.788 | 150.125 | 29.862 | 78.912 |
| 2016-03-0412:50:12 PM | 59.788 | 150.125 | 29.862 | 78.912 |
| 2016-03-0412:50:16 PM | 59.788 | 150.125 | 29.75 | 78.912 |
| 2016-03-0412:50:20 PM | 59.788 | 150.125 | 29.75 | 79.025 |
| 2016-03-0412:50:24 PM | 59.788 | 150.238 | 29.75 | 79.025 |
| 2016-03-0412:50:28 PM | 59.788 | 150.238 | 29.75 | 79.025 |
| 2016-03-0412:50:32 PM | 59.788 | 150.125 | 29.638 | 79.025 |
| 2016-03-0412:50:36 PM | 59.788 | 150.125 | 29.638 | 79.025 |
| 2016-03-0412:50:40 PM | 59.788 | 150.013 | 29.525 | 79.025 |
| 2016-03-0412:50:44 PM | 59.788 | 150.013 | 29.412 | 79.025 |
| 2016-03-0412:50:49 PM | 59.788 | 150.013 | 29.525 | 79.025 |
| 2016-03-0412:50:53 PM | 59.788 | 150.013 | 29.525 | 79.025 |
| 2016-03-0412:50:57 PM | 59.788 | 150.013 | 29.638 | 79.025 |
| 2016-03-0412:51:01 PM | 59.9 | 150.013 | 29.75 | 79.025 |
| 2016-03-0412:51:05 PM | 59.9 | 149.9 | 29.862 | 79.025 |
| 2016-03-0412:51:09 PM | 59.788 | 149.9 | 29.862 | 79.025 |
| 2016-03-0412:51:13 PM | 59.9 | 149.9 | 29.975 | 79.025 |
| 2016-03-0412:51:17 PM | 59.9 | 149.9 | 29.975 | 79.025 |
| 2016-03-0412:51:21 PM | 60.012 | 149.788 | 29.975 | 79.025 |
| 2016-03-0412:51:25 PM | 60.012 | 149.788 | 30.2 | 79.025 |
| 2016-03-0412:51:29 PM | 60.012 | 149.788 | 30.2 | 79.025 |
| 2016-03-0412:51:33 PM | 60.012 | 149.788 | 30.2 | 79.025 |
| 2016-03-0412:51:37 PM | 60.012 | 149.675 | 30.312 | 79.025 |
| 2016-03-0412:51:41 PM | 60.012 | 149.788 | 30.312 | 79.025 |
| 2016-03-0412:51:45 PM | 60.012 | 149.675 | 30.425 | 79.025 |
| 2016-03-0412:51:49 PM | 60.012 | 149.675 | 30.538 | 79.138 |
| 2016-03-0412:51:53 PM | 60.125 | 149.675 | 30.538 | 79.025 |
| 2016-03-0412:51:57 PM | 60.012 | 149.675 | 30.538 | 79.138 |
| 2016-03-0412:52:01 PM | 60.012 | 149.675 | 30.538 | 79.138 |
| 2016-03-0412:52:05 PM | 60.125 | 149.675 | 30.538 | 79.138 |
| 2016-03-0412:52:09 PM | 60.125 | 149.675 | 30.538 | 79.138 |
| 2016-03-0412:52:13 PM | 60.125 | 149.675 | 30.538 | 79.138 |
| 2016-03-0412:52:17 PM | 60.238 | 149.675 | 30.538 | 79.138 |
| 2016-03-0412:52:21 PM | 60.238 | 149.675 | 30.538 | 79.025 |
| 2016-03-0412:52:25 PM | 60.238 | 149.675 | 30.538 | 79.138 |
| 2016-03-0412:52:29 PM | 60.238 | 149.675 | 30.538 | 79.025 |
| 2016-03-0412:52:33 PM | 60.238 | 149.675 | 30.425 | 79.025 |
| 2016-03-0412:52:37 PM | 60.35 | 149.675 | 30.312 | 79.138 |
| 2016-03-0412:52:41 PM | 60.35 | 149.675 | 30.2 | 79.138 |
| 2016-03-0412:52:45 PM | 60.35 | 149.675 | 30.088 | 79.025 |
| 2016-03-0412:52:49 PM | 60.35 | 149.562 | 30.088 | 79.138 |
| 2016-03-0412:52:53 PM | 60.462 | 149.562 | 30.2 | 79.025 |
| 2016-03-0412:52:57 PM | 60.462 | 149.562 | 30.088 | 79.025 |
| 2016-03-0412:53:02 PM | 60.462 | 149.562 | 30.088 | 79.025 |
| 2016-03-0412:53:06 PM | 60.462 | 149.562 | 30.088 | 79.138 |
| 2016-03-0412:53:10 PM | 60.462 | 149.562 | 30.088 | 79.138 |
| 2016-03-0412:53:14 PM | 60.462 | 149.562 | 29.975 | 79.138 |
| 2016-03-0412:53:18 PM | 60.462 | 149.562 | 29.862 | 79.138 |
| 2016-03-0412:53:22 PM | 60.575 | 149.562 | 29.75 | 79.138 |
| 2016-03-0412:53:26 PM | 60.575 | 149.562 | 29.638 | 79.138 |
| 2016-03-0412:53:30 PM | 60.575 | 149.562 | 29.525 | 79.138 |
| 2016-03-0412:53:34 PM | 60.575 | 149.562 | 29.525 | 79.138 |
| 2016-03-0412:53:38 PM | 60.575 | 149.562 | 29.412 | 79.138 |
| 2016-03-0412:53:42 PM | 60.462 | 149.562 | 29.412 | 79.025 |
| 2016-03-0412:53:46 PM | 60.462 | 149.562 | 29.412 | 79.138 |
| 2016-03-0412:53:50 PM | 60.462 | 149.675 | 29.3 | 79.025 |
| 2016-03-0412:53:54 PM | 60.462 | 149.675 | 29.3 | 79.138 |
| 2016-03-0412:53:58 PM | 60.462 | 149.675 | 29.075 | 79.138 |
| 2016-03-0412:54:02 PM | 60.35 | 149.788 | 29.075 | 79.025 |
| 2016-03-0412:54:06 PM | 60.35 | 149.788 | 28.962 | 79.025 |
| 2016-03-0412:54:10 PM | 60.35 | 149.9 | 28.962 | 79.025 |
| 2016-03-0412:54:14 PM | 60.238 | 149.9 | 28.962 | 79.138 |
| 2016-03-0412:54:18 PM | 60.238 | 149.9 | 28.85 | 79.138 |
| 2016-03-0412:54:22 PM | 60.238 | 150.013 | 28.962 | 79.138 |
| 2016-03-0412:54:26 PM | 60.125 | 150.013 | 28.85 | 79.138 |
| 2016-03-0412:54:30 PM | 60.125 | 150.013 | 28.85 | 79.138 |
| 2016-03-0412:54:34 PM | 60.012 | 150.013 | 28.962 | 79.025 |
| 2016-03-0412:54:38 PM | 60.012 | 150.125 | 28.962 | 79.138 |
| 2016-03-0412:54:42 PM | 59.9 | 150.125 | 28.962 | 79.025 |
| 2016-03-0412:54:46 PM | 59.9 | 150.238 | 28.85 | 79.025 |
| 2016-03-0412:54:50 PM | 59.9 | 150.238 | 28.85 | 79.138 |
| 2016-03-0412:54:54 PM | 59.788 | 150.238 | 28.85 | 79.025 |
| 2016-03-0412:54:58 PM | 59.788 | 150.35 | 28.85 | 79.025 |
| 2016-03-0412:55:02 PM | 59.788 | 150.35 | 28.85 | 79.025 |
| 2016-03-0412:55:06 PM | 59.788 | 150.35 | 28.85 | 79.025 |
| 2016-03-0412:55:10 PM | 59.788 | 150.35 | 28.738 | 79.025 |
| 2016-03-0412:55:14 PM | 59.675 | 150.35 | 28.625 | 79.025 |
| 2016-03-0412:55:19 PM | 59.675 | 150.35 | 28.512 | 79.025 |
| 2016-03-0412:55:23 PM | 59.675 | 150.35 | 28.4 | 79.025 |
| 2016-03-0412:55:27 PM | 59.675 | 150.35 | 28.288 | 79.025 |
| 2016-03-0412:55:31 PM | 59.562 | 150.462 | 28.288 | 79.025 |
| 2016-03-0412:55:35 PM | 59.562 | 150.462 | 28.288 | 79.025 |
| 2016-03-0412:55:39 PM | 59.45 | 150.35 | 28.512 | 79.025 |
| 2016-03-0412:55:43 PM | 59.45 | 150.462 | 28.512 | 79.025 |
| 2016-03-0412:55:47 PM | 59.45 | 150.35 | 28.4 | 79.025 |
| 2016-03-0412:55:51 PM | 59.338 | 150.35 | 28.288 | 79.025 |
| 2016-03-0412:55:55 PM | 59.338 | 150.35 | 28.175 | 79.025 |
| 2016-03-0412:55:59 PM | 59.338 | 150.35 | 27.95 | 79.025 |
| 2016-03-0412:56:03 PM | 59.338 | 150.35 | 27.838 | 79.025 |
| 2016-03-0412:56:07 PM | 59.338 | 150.35 | 27.838 | 79.025 |
| 2016-03-0412:56:11 PM | 59.338 | 150.35 | 27.838 | 79.025 |
| 2016-03-0412:56:15 PM | 59.225 | 150.238 | 27.838 | 79.025 |
| 2016-03-0412:56:19 PM | 59.225 | 150.238 | 27.95 | 79.025 |
| 2016-03-0412:56:23 PM | 59.225 | 150.238 | 28.062 | 79.025 |
| 2016-03-0412:56:27 PM | 59.112 | 150.238 | 28.175 | 79.025 |
| 2016-03-0412:56:31 PM | 59.112 | 150.238 | 28.4 | 79.025 |
| 2016-03-0412:56:35 PM | 59.112 | 150.238 | 28.4 | 79.025 |
| 2016-03-0412:56:39 PM | 59.112 | 150.125 | 28.512 | 79.025 |
| 2016-03-0412:56:43 PM | 59 | 150.125 | 28.625 | 79.025 |
| 2016-03-0412:56:47 PM | 59 | 150.125 | 28.738 | 79.025 |
| 2016-03-0412:56:51 PM | 59.112 | 150.125 | 28.738 | 79.025 |
| 2016-03-0412:56:55 PM | 59.112 | 150.125 | 28.85 | 79.025 |
| 2016-03-0412:56:59 PM | 59.112 | 150.125 | 28.85 | 79.025 |
| 2016-03-0412:57:03 PM | 59.112 | 150.125 | 28.85 | 79.025 |
| 2016-03-0412:57:07 PM | 59.112 | 150.125 | 28.962 | 79.025 |
| 2016-03-0412:57:11 PM | 59.112 | 150.125 | 28.962 | 79.025 |
| 2016-03-0412:57:15 PM | 59.112 | 150.125 | 28.85 | 79.025 |
| 2016-03-0412:57:19 PM | 59.112 | 150.125 | 28.85 | 79.025 |
| 2016-03-0412:57:24 PM | 59.112 | 150.125 | 28.962 | 79.025 |
| 2016-03-0412:57:28 PM | 59.112 | 150.125 | 29.075 | 79.025 |
| 2016-03-0412:57:32 PM | 59.112 | 150.013 | 29.188 | 79.025 |
| 2016-03-0412:57:36 PM | 59.112 | 150.013 | 29.3 | 79.025 |
| 2016-03-0412:57:40 PM | 59.112 | 150.013 | 29.412 | 79.025 |
| 2016-03-0412:57:44 PM | 59.112 | 150.013 | 29.525 | 79.025 |
| 2016-03-0412:57:48 PM | 59.112 | 150.013 | 29.525 | 79.025 |
| 2016-03-0412:57:52 PM | 59.112 | 149.9 | 29.525 | 79.025 |
| 2016-03-0412:57:56 PM | 59.112 | 149.9 | 29.638 | 79.025 |
| 2016-03-0412:58:00 PM | 59.225 | 149.9 | 29.638 | 79.025 |
| 2016-03-0412:58:04 PM | 59.225 | 149.9 | 29.638 | 79.025 |
| 2016-03-0412:58:08 PM | 59.225 | 149.9 | 29.638 | 78.912 |
| 2016-03-0412:58:12 PM | 59.338 | 149.9 | 29.75 | 78.912 |
| 2016-03-0412:58:16 PM | 59.338 | 149.9 | 29.862 | 78.912 |
| 2016-03-0412:58:20 PM | 59.45 | 149.9 | 29.75 | 78.912 |
| 2016-03-0412:58:24 PM | 59.45 | 149.9 | 29.862 | 78.912 |
| 2016-03-0412:58:28 PM | 59.45 | 149.9 | 29.862 | 78.912 |
| 2016-03-0412:58:32 PM | 59.45 | 149.9 | 29.862 | 78.912 |
| 2016-03-0412:58:36 PM | 59.562 | 149.9 | 29.862 | 79.025 |
| 2016-03-0412:58:40 PM | 59.562 | 149.9 | 29.862 | 78.912 |
| 2016-03-0412:58:44 PM | 59.562 | 149.9 | 29.975 | 78.912 |
| 2016-03-0412:58:48 PM | 59.675 | 149.9 | 29.975 | 78.912 |
| 2016-03-0412:58:52 PM | 59.675 | 150.013 | 30.088 | 78.912 |
| 2016-03-0412:58:56 PM | 59.675 | 149.9 | 30.2 | 78.912 |
| 2016-03-0412:59:00 PM | 59.675 | 150.013 | 30.2 | 79.025 |
| 2016-03-0412:59:04 PM | 59.788 | 150.013 | 30.2 | 78.912 |
| 2016-03-0412:59:08 PM | 59.788 | 150.013 | 30.2 | 78.912 |
| 2016-03-0412:59:12 PM | 59.788 | 150.013 | 30.088 | 79.025 |
| 2016-03-0412:59:16 PM | 59.788 | 150.013 | 29.975 | 78.912 |
| 2016-03-0412:59:20 PM | 59.788 | 150.125 | 29.862 | 79.025 |
| 2016-03-0412:59:24 PM | 59.788 | 150.013 | 29.862 | 78.912 |
| 2016-03-0412:59:28 PM | 59.788 | 150.125 | 29.975 | 78.912 |
| 2016-03-0412:59:32 PM | 59.788 | 150.125 | 29.975 | 78.8 |
| 2016-03-0412:59:36 PM | 59.788 | 150.125 | 29.975 | 78.912 |
| 2016-03-0412:59:40 PM | 59.675 | 150.125 | 30.088 | 78.8 |
| 2016-03-0412:59:45 PM | 59.675 | 150.125 | 30.088 | 78.912 |
| 2016-03-0412:59:49 PM | 59.788 | 150.125 | 30.312 | 78.8 |
| 2016-03-0412:59:53 PM | 59.675 | 150.125 | 30.425 | 78.912 |
| 2016-03-0412:59:57 PM | 59.788 | 150.125 | 30.425 | 78.912 |
| 2016-03-041:00:01 PM | 59.788 | 150.125 | 30.425 | 78.8 |
| 2016-03-041:00:05 PM | 59.675 | 150.013 | 30.425 | 78.8 |
| 2016-03-041:00:09 PM | 59.788 | 150.013 | 30.538 | 78.8 |
| 2016-03-041:00:13 PM | 59.788 | 150.013 | 30.538 | 78.912 |
| 2016-03-041:00:17 PM | 59.9 | 150.013 | 30.538 | 78.8 |
| 2016-03-041:00:21 PM | 59.788 | 150.013 | 30.538 | 78.8 |
| 2016-03-041:00:25 PM | 59.9 | 150.013 | 30.312 | 78.8 |
| 2016-03-041:00:29 PM | 59.9 | 150.013 | 30.088 | 78.8 |
| 2016-03-041:00:33 PM | 59.9 | 150.013 | 30.088 | 78.912 |
| 2016-03-041:00:37 PM | 60.012 | 149.9 | 30.2 | 78.8 |
| 2016-03-041:00:41 PM | 60.012 | 149.9 | 30.2 | 78.912 |
| 2016-03-041:00:45 PM | 60.012 | 149.788 | 30.2 | 78.8 |
| 2016-03-041:00:49 PM | 60.012 | 149.9 | 30.088 | 78.8 |
| 2016-03-041:00:53 PM | 60.012 | 149.788 | 29.862 | 78.912 |
| 2016-03-041:00:57 PM | 60.012 | 149.788 | 29.75 | 78.8 |
| 2016-03-041:01:01 PM | 60.125 | 149.675 | 29.638 | 78.912 |
| 2016-03-041:01:05 PM | 60.125 | 149.675 | 29.525 | 78.8 |
| 2016-03-041:01:09 PM | 60.125 | 149.562 | 29.525 | 78.912 |
| 2016-03-041:01:13 PM | 60.125 | 149.562 | 29.525 | 78.8 |
| 2016-03-041:01:17 PM | 60.125 | 149.45 | 29.412 | 78.8 |
| 2016-03-041:01:21 PM | 60.125 | 149.45 | 29.412 | 78.8 |
| 2016-03-041:01:25 PM | 60.125 | 149.45 | 29.3 | 78.8 |
| 2016-03-041:01:29 PM | 60.125 | 149.338 | 29.075 | 78.8 |
| 2016-03-041:01:33 PM | 60.125 | 149.338 | 28.962 | 78.8 |
| 2016-03-041:01:37 PM | 60.125 | 149.338 | 28.962 | 78.8 |
| 2016-03-041:01:41 PM | 60.125 | 149.338 | 28.85 | 78.8 |
| 2016-03-041:01:45 PM | 60.012 | 149.338 | 28.85 | 78.8 |
| 2016-03-041:01:49 PM | 60.012 | 149.338 | 28.85 | 78.8 |
| 2016-03-041:01:53 PM | 60.012 | 149.338 | 28.738 | 78.8 |
| 2016-03-041:01:57 PM | 60.012 | 149.225 | 28.738 | 78.8 |
| 2016-03-041:02:01 PM | 59.9 | 149.225 | 28.738 | 78.8 |
| 2016-03-041:02:05 PM | 59.9 | 149.338 | 28.738 | 78.8 |
| 2016-03-041:02:09 PM | 59.788 | 149.338 | 28.85 | 78.8 |
| 2016-03-041:02:14 PM | 59.9 | 149.225 | 28.85 | 78.8 |
| 2016-03-041:02:18 PM | 59.9 | 149.225 | 29.075 | 78.8 |
| 2016-03-041:02:22 PM | 59.788 | 149.225 | 29.075 | 78.912 |
| 2016-03-041:02:26 PM | 59.788 | 149.225 | 29.188 | 78.912 |
| 2016-03-041:02:30 PM | 59.788 | 149.225 | 29.3 | 78.8 |
| 2016-03-041:02:34 PM | 59.788 | 149.112 | 29.412 | 78.912 |
| 2016-03-041:02:38 PM | 59.788 | 149.112 | 29.412 | 78.8 |
| 2016-03-041:02:42 PM | 59.788 | 149.112 | 29.412 | 78.8 |
| 2016-03-041:02:46 PM | 59.788 | 149.112 | 29.412 | 78.8 |
| 2016-03-041:02:50 PM | 59.788 | 149.225 | 29.412 | 78.8 |
| 2016-03-041:02:54 PM | 59.788 | 149.225 | 29.638 | 78.8 |
| 2016-03-041:02:58 PM | 59.788 | 149.112 | 29.75 | 78.8 |
| 2016-03-041:03:02 PM | 59.788 | 149.112 | 29.75 | 78.8 |
| 2016-03-041:03:06 PM | 59.788 | 149.225 | 29.75 | 78.8 |
| 2016-03-041:03:10 PM | 59.788 | 149.112 | 29.75 | 78.8 |
| 2016-03-041:03:14 PM | 59.788 | 149.225 | 29.862 | 78.8 |
| 2016-03-041:03:18 PM | 59.788 | 149.225 | 29.75 | 78.8 |
| 2016-03-041:03:22 PM | 59.788 | 149.225 | 29.638 | 78.8 |
| 2016-03-041:03:26 PM | 59.788 | 149.225 | 29.525 | 78.8 |
| 2016-03-041:03:30 PM | 59.9 | 149.225 | 29.638 | 78.912 |
| 2016-03-041:03:34 PM | 59.788 | 149.225 | 29.525 | 78.8 |
| 2016-03-041:03:38 PM | 59.788 | 149.338 | 29.525 | 78.8 |
| 2016-03-041:03:42 PM | 59.9 | 149.338 | 29.412 | 78.8 |
| 2016-03-041:03:46 PM | 59.788 | 149.338 | 29.412 | 78.8 |
| 2016-03-041:03:50 PM | 59.788 | 149.338 | 29.412 | 78.8 |
| 2016-03-041:03:54 PM | 59.788 | 149.338 | 29.412 | 78.8 |
| 2016-03-041:03:58 PM | 59.788 | 149.338 | 29.412 | 78.912 |
| 2016-03-041:04:02 PM | 59.788 | 149.338 | 29.3 | 78.8 |
| 2016-03-041:04:06 PM | 59.788 | 149.338 | 29.412 | 78.912 |
| 2016-03-041:04:10 PM | 59.788 | 149.338 | 29.638 | 78.912 |
| 2016-03-041:04:14 PM | 59.788 | 149.338 | 29.75 | 78.912 |
| 2016-03-041:04:18 PM | 59.788 | 149.338 | 29.862 | 78.8 |
| 2016-03-041:04:22 PM | 59.788 | 149.338 | 29.862 | 78.8 |
| 2016-03-041:04:27 PM | 59.9 | 149.338 | 29.862 | 78.912 |
| 2016-03-041:04:31 PM | 59.9 | 149.338 | 29.75 | 78.912 |
| 2016-03-041:04:35 PM | 59.9 | 149.338 | 29.638 | 78.912 |
| 2016-03-041:04:39 PM | 59.9 | 149.338 | 29.525 | 78.8 |
| 2016-03-041:04:43 PM | 59.9 | 149.338 | 29.525 | 78.8 |
| 2016-03-041:04:47 PM | 59.9 | 149.338 | 29.525 | 78.8 |
| 2016-03-041:04:51 PM | 59.9 | 149.225 | 29.525 | 78.8 |
| 2016-03-041:04:55 PM | 59.9 | 149.225 | 29.525 | 78.8 |
| 2016-03-041:04:59 PM | 59.9 | 149.225 | 29.638 | 78.8 |
| 2016-03-041:05:03 PM | 59.9 | 149.225 | 29.525 | 78.8 |
| 2016-03-041:05:07 PM | 59.9 | 149.338 | 29.525 | 78.8 |
| 2016-03-041:05:11 PM | 59.9 | 149.225 | 29.412 | 78.8 |
| 2016-03-041:05:15 PM | 59.9 | 149.225 | 29.3 | 78.8 |
| 2016-03-041:05:19 PM | 59.9 | 149.225 | 29.075 | 78.8 |
| 2016-03-041:05:23 PM | 59.9 | 149.338 | 29.075 | 78.8 |
| 2016-03-041:05:27 PM | 59.9 | 149.225 | 29.075 | 78.8 |
| 2016-03-041:05:31 PM | 59.9 | 149.225 | 28.962 | 78.8 |
| 2016-03-041:05:35 PM | 59.788 | 149.338 | 28.962 | 78.8 |
| 2016-03-041:05:39 PM | 59.788 | 149.338 | 28.85 | 78.8 |
| 2016-03-041:05:43 PM | 59.675 | 149.338 | 28.625 | 78.8 |
| 2016-03-041:05:47 PM | 59.675 | 149.338 | 28.512 | 78.8 |
| 2016-03-041:05:51 PM | 59.675 | 149.338 | 28.512 | 78.8 |
| 2016-03-041:05:55 PM | 59.562 | 149.338 | 28.512 | 78.8 |
| 2016-03-041:05:59 PM | 59.562 | 149.338 | 28.512 | 78.8 |
| 2016-03-041:06:03 PM | 59.562 | 149.338 | 28.512 | 78.8 |
| 2016-03-041:06:07 PM | 59.562 | 149.45 | 28.512 | 78.8 |
| 2016-03-041:06:11 PM | 59.562 | 149.45 | 28.512 | 78.8 |
| 2016-03-041:06:15 PM | 59.45 | 149.45 | 28.512 | 78.8 |
| 2016-03-041:06:20 PM | 59.45 | 149.45 | 28.512 | 78.8 |
| 2016-03-041:06:24 PM | 59.45 | 149.45 | 28.4 | 78.8 |
| 2016-03-041:06:28 PM | 59.45 | 149.45 | 28.512 | 78.688 |
| 2016-03-041:06:32 PM | 59.45 | 149.45 | 28.625 | 78.8 |
| 2016-03-041:06:36 PM | 59.338 | 149.45 | 28.738 | 78.8 |
| 2016-03-041:06:40 PM | 59.338 | 149.45 | 28.85 | 78.688 |
| 2016-03-041:06:44 PM | 59.338 | 149.562 | 28.962 | 78.8 |
| 2016-03-041:06:48 PM | 59.338 | 149.562 | 29.075 | 78.688 |
| 2016-03-041:06:52 PM | 59.225 | 149.45 | 29.188 | 78.8 |
| 2016-03-041:06:56 PM | 59.338 | 149.45 | 29.3 | 78.8 |
| 2016-03-041:07:00 PM | 59.225 | 149.45 | 29.188 | 78.688 |
| 2016-03-041:07:04 PM | 59.225 | 149.45 | 29.188 | 78.8 |
| 2016-03-041:07:08 PM | 59.225 | 149.562 | 29.188 | 78.688 |
| 2016-03-041:07:12 PM | 59.112 | 149.562 | 29.188 | 78.688 |
| 2016-03-041:07:16 PM | 59.112 | 149.562 | 29.075 | 78.688 |
| 2016-03-041:07:20 PM | 59 | 149.562 | 29.188 | 78.8 |
| 2016-03-041:07:24 PM | 59.112 | 149.562 | 29.3 | 78.8 |
| 2016-03-041:07:28 PM | 59.112 | 149.562 | 29.3 | 78.688 |
| 2016-03-041:07:32 PM | 59 | 149.562 | 29.525 | 78.688 |
| 2016-03-041:07:36 PM | 59 | 149.562 | 29.525 | 78.688 |
| 2016-03-041:07:40 PM | 59 | 149.675 | 29.638 | 78.688 |
| 2016-03-041:07:44 PM | 59 | 149.562 | 29.75 | 78.688 |
| 2016-03-041:07:48 PM | 59.112 | 149.562 | 29.75 | 78.688 |
| 2016-03-041:07:52 PM | 59.112 | 149.562 | 29.75 | 78.688 |
| 2016-03-041:07:56 PM | 59.225 | 149.675 | 29.75 | 78.688 |
| 2016-03-041:08:00 PM | 59.225 | 149.675 | 29.862 | 78.688 |
| 2016-03-041:08:04 PM | 59.225 | 149.675 | 29.862 | 78.688 |
| 2016-03-041:08:08 PM | 59.225 | 149.675 | 29.862 | 78.688 |
| 2016-03-041:08:12 PM | 59.225 | 149.675 | 29.975 | 78.688 |
| 2016-03-041:08:16 PM | 59.338 | 149.788 | 29.975 | 78.688 |
| 2016-03-041:08:20 PM | 59.338 | 149.788 | 29.862 | 78.688 |
| 2016-03-041:08:25 PM | 59.338 | 149.788 | 29.862 | 78.688 |
| 2016-03-041:08:29 PM | 59.338 | 149.788 | 29.975 | 78.688 |
| 2016-03-041:08:33 PM | 59.338 | 149.788 | 29.975 | 78.688 |
| 2016-03-041:08:37 PM | 59.338 | 149.9 | 29.75 | 78.688 |
| 2016-03-041:08:41 PM | 59.338 | 149.9 | 29.525 | 78.688 |
| 2016-03-041:08:45 PM | 59.562 | 149.9 | 29.412 | 78.688 |
| 2016-03-041:08:49 PM | 59.562 | 149.9 | 29.3 | 78.688 |
| 2016-03-041:08:53 PM | 59.675 | 149.9 | 29.188 | 78.688 |
| 2016-03-041:08:57 PM | 59.675 | 149.9 | 29.188 | 78.688 |
| 2016-03-041:09:01 PM | 59.675 | 149.9 | 29.075 | 78.688 |
| 2016-03-041:09:05 PM | 59.788 | 150.013 | 29.075 | 78.688 |
| 2016-03-041:09:09 PM | 59.9 | 150.013 | 28.962 | 78.688 |
| 2016-03-041:09:13 PM | 59.788 | 150.013 | 28.85 | 78.688 |
| 2016-03-041:09:17 PM | 59.9 | 150.013 | 28.738 | 78.688 |
| 2016-03-041:09:21 PM | 59.9 | 150.013 | 28.625 | 78.688 |
| 2016-03-041:09:25 PM | 60.012 | 150.013 | 28.625 | 78.688 |
| 2016-03-041:09:29 PM | 60.012 | 150.013 | 28.738 | 78.688 |
| 2016-03-041:09:33 PM | 59.9 | 150.013 | 28.962 | 78.688 |
| 2016-03-041:09:37 PM | 59.9 | 150.013 | 29.075 | 78.688 |
| 2016-03-041:09:41 PM | 59.9 | 150.013 | 29.075 | 78.688 |
| 2016-03-041:09:45 PM | 59.9 | 150.013 | 29.188 | 78.688 |
| 2016-03-041:09:49 PM | 59.9 | 150.013 | 29.188 | 78.688 |
| 2016-03-041:09:53 PM | 59.9 | 150.013 | 29.188 | 78.688 |
| 2016-03-041:09:57 PM | 59.9 | 149.9 | 29.3 | 78.688 |
| 2016-03-041:10:01 PM | 59.9 | 149.9 | 29.412 | 78.688 |
| 2016-03-041:10:05 PM | 59.9 | 149.9 | 29.525 | 78.688 |
| 2016-03-041:10:09 PM | 59.9 | 149.9 | 29.638 | 78.688 |
| 2016-03-041:10:13 PM | 59.9 | 149.788 | 29.638 | 78.688 |
| 2016-03-041:10:17 PM | 59.9 | 149.675 | 29.3 | 78.688 |
| 2016-03-041:10:21 PM | 59.9 | 149.675 | 29.075 | 78.688 |
| 2016-03-041:10:25 PM | 60.012 | 149.675 | 29.075 | 78.688 |
| 2016-03-041:10:29 PM | 59.9 | 149.675 | 29.075 | 78.688 |
| 2016-03-041:10:34 PM | 60.012 | 149.562 | 29.075 | 78.688 |
| 2016-03-041:10:38 PM | 60.012 | 149.562 | 29.075 | 78.688 |
| 2016-03-041:10:42 PM | 60.012 | 149.562 | 28.962 | 78.688 |
| 2016-03-041:10:46 PM | 60.012 | 149.562 | 28.85 | 78.688 |
| 2016-03-041:10:50 PM | 60.125 | 149.562 | 28.625 | 78.688 |
| 2016-03-041:10:54 PM | 60.125 | 149.562 | 28.512 | 78.688 |
| 2016-03-041:10:58 PM | 60.125 | 149.562 | 28.288 | 78.688 |
| 2016-03-041:11:02 PM | 60.125 | 149.562 | 28.4 | 78.688 |
| 2016-03-041:11:06 PM | 60.125 | 149.562 | 28.512 | 78.688 |
| 2016-03-041:11:10 PM | 60.125 | 149.562 | 28.625 | 78.688 |
| 2016-03-041:11:14 PM | 60.012 | 149.562 | 28.738 | 78.688 |
| 2016-03-041:11:18 PM | 60.125 | 149.562 | 28.738 | 78.688 |
| 2016-03-041:11:22 PM | 60.125 | 149.562 | 28.85 | 78.688 |
| 2016-03-041:11:26 PM | 60.125 | 149.562 | 28.85 | 78.688 |
| 2016-03-041:11:30 PM | 60.012 | 149.562 | 28.962 | 78.688 |
| 2016-03-041:11:34 PM | 60.012 | 149.562 | 29.075 | 78.688 |
| 2016-03-041:11:38 PM | 60.012 | 149.562 | 29.075 | 78.688 |
| 2016-03-041:11:42 PM | 60.012 | 149.562 | 29.188 | 78.688 |
| 2016-03-041:11:46 PM | 60.012 | 149.675 | 29.3 | 78.688 |
| 2016-03-041:11:50 PM | 60.012 | 149.562 | 29.412 | 78.688 |
| 2016-03-041:11:54 PM | 60.012 | 149.562 | 29.412 | 78.688 |
| 2016-03-041:11:58 PM | 60.012 | 149.675 | 29.638 | 78.688 |
| 2016-03-041:12:02 PM | 60.012 | 149.675 | 29.638 | 78.688 |
| 2016-03-041:12:06 PM | 60.012 | 149.675 | 29.75 | 78.688 |
| 2016-03-041:12:10 PM | 60.012 | 149.788 | 29.638 | 78.688 |
| 2016-03-041:12:14 PM | 60.012 | 149.788 | 29.525 | 78.688 |
| 2016-03-041:12:18 PM | 60.012 | 149.788 | 29.412 | 78.688 |
| 2016-03-041:12:22 PM | 60.012 | 149.788 | 29.412 | 78.575 |
| 2016-03-041:12:26 PM | 60.012 | 149.788 | 29.3 | 78.688 |
| 2016-03-041:12:30 PM | 60.125 | 149.788 | 29.188 | 78.688 |
| 2016-03-041:12:34 PM | 60.012 | 149.788 | 29.188 | 78.688 |
| 2016-03-041:12:38 PM | 60.125 | 149.9 | 29.188 | 78.688 |
| 2016-03-041:12:42 PM | 60.125 | 149.9 | 29.3 | 78.575 |
| 2016-03-041:12:47 PM | 60.125 | 149.9 | 29.3 | 78.688 |
| 2016-03-041:12:51 PM | 60.125 | 149.9 | 29.412 | 78.575 |
| 2016-03-041:12:55 PM | 60.125 | 149.9 | 29.412 | 78.575 |
| 2016-03-041:12:59 PM | 60.125 | 149.9 | 29.412 | 78.688 |
| 2016-03-041:13:03 PM | 60.012 | 149.9 | 29.412 | 78.688 |
| 2016-03-041:13:07 PM | 60.125 | 149.9 | 29.3 | 78.688 |
| 2016-03-041:13:11 PM | 60.012 | 149.9 | 29.188 | 78.688 |
| 2016-03-041:13:15 PM | 60.125 | 149.9 | 29.075 | 78.688 |
| 2016-03-041:13:19 PM | 60.125 | 149.9 | 29.188 | 78.688 |
| 2016-03-041:13:23 PM | 60.012 | 149.9 | 29.188 | 78.688 |
| 2016-03-041:13:27 PM | 60.012 | 150.013 | 29.412 | 78.688 |
| 2016-03-041:13:31 PM | 60.125 | 150.013 | 29.638 | 78.688 |
| 2016-03-041:13:35 PM | 60.125 | 150.013 | 29.75 | 78.688 |
| 2016-03-041:13:39 PM | 60.125 | 150.013 | 29.75 | 78.688 |
| 2016-03-041:13:43 PM | 60.125 | 150.013 | 29.862 | 78.688 |
| 2016-03-041:13:47 PM | 60.125 | 150.013 | 29.975 | 78.688 |
| 2016-03-041:13:51 PM | 60.238 | 150.013 | 30.088 | 78.688 |
| 2016-03-041:13:55 PM | 60.125 | 150.013 | 30.2 | 78.688 |
| 2016-03-041:13:59 PM | 60.238 | 150.125 | 30.312 | 78.688 |
| 2016-03-041:14:03 PM | 60.238 | 150.125 | 30.312 | 78.688 |
| 2016-03-041:14:07 PM | 60.238 | 150.125 | 30.425 | 78.688 |
| 2016-03-041:14:11 PM | 60.238 | 150.125 | 30.425 | 78.688 |
| 2016-03-041:14:15 PM | 60.238 | 150.125 | 30.425 | 78.688 |
| 2016-03-041:14:19 PM | 60.35 | 150.238 | 30.538 | 78.688 |
| 2016-03-041:14:23 PM | 60.238 | 150.238 | 30.65 | 78.688 |
| 2016-03-041:14:27 PM | 60.35 | 150.238 | 30.538 | 78.688 |
| 2016-03-041:14:31 PM | 60.35 | 150.238 | 30.762 | 78.688 |
| 2016-03-041:14:35 PM | 60.35 | 150.35 | 30.762 | 78.688 |
| 2016-03-041:14:39 PM | 60.35 | 150.35 | 30.65 | 78.688 |
| 2016-03-041:14:43 PM | 60.462 | 150.35 | 30.425 | 78.688 |
| 2016-03-041:14:47 PM | 60.462 | 150.462 | 30.425 | 78.688 |
| 2016-03-041:14:51 PM | 60.462 | 150.462 | 30.425 | 78.688 |
| 2016-03-041:14:55 PM | 60.462 | 150.462 | 30.425 | 78.688 |
| 2016-03-041:15:00 PM | 60.462 | 150.575 | 30.425 | 78.688 |
| 2016-03-041:15:04 PM | 60.462 | 150.575 | 30.538 | 78.688 |
| 2016-03-041:15:08 PM | 60.462 | 150.575 | 30.425 | 78.688 |
| 2016-03-041:15:12 PM | 60.462 | 150.575 | 30.538 | 78.688 |
| 2016-03-041:15:16 PM | 60.35 | 150.575 | 30.538 | 78.688 |
| 2016-03-041:15:20 PM | 60.35 | 150.688 | 30.538 | 78.688 |
| 2016-03-041:15:24 PM | 60.462 | 150.688 | 30.425 | 78.688 |
| 2016-03-041:15:28 PM | 60.35 | 150.688 | 30.312 | 78.688 |
| 2016-03-041:15:32 PM | 60.35 | 150.688 | 30.088 | 78.688 |
| 2016-03-041:15:36 PM | 60.35 | 150.688 | 29.862 | 78.688 |
| 2016-03-041:15:40 PM | 60.35 | 150.688 | 29.638 | 78.688 |
| 2016-03-041:15:44 PM | 60.238 | 150.8 | 29.638 | 78.688 |
| 2016-03-041:15:48 PM | 60.238 | 150.8 | 29.525 | 78.688 |
| 2016-03-041:15:52 PM | 60.238 | 150.8 | 29.525 | 78.688 |
| 2016-03-041:15:56 PM | 60.125 | 150.8 | 29.638 | 78.688 |
| 2016-03-041:16:00 PM | 60.125 | 150.8 | 29.75 | 78.688 |
| 2016-03-041:16:04 PM | 60.012 | 150.8 | 29.75 | 78.688 |
| 2016-03-041:16:08 PM | 60.012 | 150.8 | 29.75 | 78.688 |
| 2016-03-041:16:12 PM | 60.012 | 150.8 | 29.862 | 78.688 |
| 2016-03-041:16:16 PM | 59.9 | 150.8 | 29.862 | 78.688 |
| 2016-03-041:16:20 PM | 59.9 | 150.8 | 29.862 | 78.688 |
| 2016-03-041:16:24 PM | 59.9 | 150.912 | 29.862 | 78.688 |
| 2016-03-041:16:28 PM | 59.788 | 150.912 | 29.975 | 78.688 |
| 2016-03-041:16:32 PM | 59.788 | 150.912 | 29.975 | 78.688 |
| 2016-03-041:16:36 PM | 59.788 | 150.912 | 30.088 | 78.688 |
| 2016-03-041:16:40 PM | 59.788 | 151.025 | 30.088 | 78.688 |
| 2016-03-041:16:44 PM | 59.788 | 151.025 | 30.088 | 78.575 |
| 2016-03-041:16:48 PM | 59.788 | 151.138 | 30.088 | 78.688 |
| 2016-03-041:16:52 PM | 59.788 | 151.138 | 30.088 | 78.688 |
| 2016-03-041:16:56 PM | 59.788 | 151.138 | 30.088 | 78.688 |
| 2016-03-041:17:00 PM | 59.788 | 151.138 | 30.2 | 78.688 |
| 2016-03-041:17:04 PM | 59.788 | 151.138 | 30.312 | 78.688 |
| 2016-03-041:17:09 PM | 59.675 | 151.138 | 30.312 | 78.688 |
| 2016-03-041:17:13 PM | 59.675 | 151.138 | 30.312 | 78.575 |
| 2016-03-041:17:17 PM | 59.675 | 151.138 | 30.425 | 78.688 |
| 2016-03-041:17:21 PM | 59.675 | 151.138 | 30.538 | 78.688 |
| 2016-03-041:17:25 PM | 59.675 | 151.138 | 30.538 | 78.688 |
| 2016-03-041:17:29 PM | 59.675 | 151.138 | 30.65 | 78.688 |
| 2016-03-041:17:33 PM | 59.675 | 151.138 | 30.65 | 78.688 |
| 2016-03-041:17:37 PM | 59.675 | 151.138 | 30.425 | 78.688 |
| 2016-03-041:17:41 PM | 59.675 | 151.25 | 30.312 | 78.575 |
| 2016-03-041:17:45 PM | 59.675 | 151.25 | 30.088 | 78.688 |
| 2016-03-041:17:49 PM | 59.675 | 151.25 | 29.862 | 78.688 |
| 2016-03-041:17:53 PM | 59.562 | 151.25 | 29.75 | 78.575 |
| 2016-03-041:17:57 PM | 59.562 | 151.138 | 29.638 | 78.688 |
| 2016-03-041:18:05 PM | 59.562 | 151.25 | 29.525 | 78.688 |
| 2016-03-041:18:09 PM | 59.45 | 151.25 | 29.638 | 78.688 |
| 2016-03-041:18:13 PM | 59.45 | 151.25 | 29.525 | 78.575 |
| 2016-03-041:18:17 PM | 59.338 | 151.138 | 29.525 | 78.688 |
| 2016-03-041:18:21 PM | 59.338 | 151.138 | 29.412 | 78.688 |
| 2016-03-041:18:25 PM | 59.225 | 151.25 | 29.525 | 78.688 |
| 2016-03-041:18:29 PM | 59.225 | 151.25 | 29.412 | 78.688 |
| 2016-03-041:18:33 PM | 59.225 | 151.138 | 29.3 | 78.575 |
| 2016-03-041:18:37 PM | 59.225 | 151.138 | 29.188 | 78.575 |
| 2016-03-041:18:41 PM | 59.225 | 151.138 | 29.188 | 78.688 |
| 2016-03-041:18:45 PM | 59.225 | 151.138 | 29.075 | 78.688 |
| 2016-03-041:18:49 PM | 59.225 | 151.25 | 29.075 | 78.688 |
| 2016-03-041:18:53 PM | 59.225 | 151.138 | 29.075 | 78.575 |
| 2016-03-041:18:57 PM | 59.225 | 151.138 | 29.188 | 78.688 |
| 2016-03-041:19:01 PM | 59.225 | 151.138 | 29.188 | 78.575 |
| 2016-03-041:19:05 PM | 59.112 | 151.138 | 29.3 | 78.575 |
| 2016-03-041:19:09 PM | 59.112 | 151.138 | 29.3 | 78.575 |
| 2016-03-041:19:13 PM | 59.112 | 151.138 | 29.3 | 78.575 |
| 2016-03-041:19:17 PM | 59.112 | 151.138 | 29.412 | 78.688 |
| 2016-03-041:19:21 PM | 59.112 | 151.138 | 29.412 | 78.575 |
| 2016-03-041:19:25 PM | 59 | 151.138 | 29.412 | 78.688 |
| 2016-03-041:19:30 PM | 59 | 151.138 | 29.3 | 78.575 |
| 2016-03-041:19:34 PM | 59 | 151.138 | 29.075 | 78.575 |
| 2016-03-041:19:38 PM | 59 | 151.138 | 28.962 | 78.575 |
| 2016-03-041:19:42 PM | 59 | 151.138 | 28.738 | 78.575 |
| 2016-03-041:19:46 PM | 59 | 151.138 | 28.512 | 78.575 |
| 2016-03-041:19:50 PM | 59 | 151.138 | 28.288 | 78.575 |
| 2016-03-041:19:54 PM | 59 | 151.138 | 28.4 | 78.575 |
| 2016-03-041:19:58 PM | 59 | 151.138 | 28.288 | 78.575 |
| 2016-03-041:20:02 PM | 59.112 | 151.138 | 28.062 | 78.575 |
| 2016-03-041:20:06 PM | 59.112 | 151.138 | 28.062 | 78.575 |
| 2016-03-041:20:10 PM | 59.112 | 151.138 | 28.062 | 78.575 |
| 2016-03-041:20:14 PM | 59.112 | 151.025 | 28.062 | 78.575 |
| 2016-03-041:20:18 PM | 59.112 | 151.025 | 28.062 | 78.575 |
| 2016-03-041:20:22 PM | 59.225 | 151.025 | 28.062 | 78.575 |
| 2016-03-041:20:26 PM | 59.112 | 151.025 | 28.175 | 78.575 |
| 2016-03-041:20:30 PM | 59.112 | 151.025 | 28.175 | 78.575 |
| 2016-03-041:20:34 PM | 59.112 | 151.025 | 28.175 | 78.575 |
| 2016-03-041:20:38 PM | 59.112 | 151.025 | 28.175 | 78.575 |
| 2016-03-041:20:42 PM | 59.225 | 151.025 | 28.288 | 78.688 |
| 2016-03-041:20:46 PM | 59.112 | 151.025 | 28.288 | 78.575 |
| 2016-03-041:20:50 PM | 59.225 | 151.025 | 28.288 | 78.575 |
| 2016-03-041:20:54 PM | 59.225 | 151.025 | 28.288 | 78.575 |
| 2016-03-041:20:58 PM | 59.225 | 150.912 | 28.4 | 78.575 |
| 2016-03-041:21:02 PM | 59.225 | 150.912 | 28.512 | 78.575 |
| 2016-03-041:21:06 PM | 59.225 | 150.912 | 28.512 | 78.575 |
| 2016-03-041:21:10 PM | 59.225 | 150.912 | 28.512 | 78.575 |
| 2016-03-041:21:14 PM | 59.225 | 150.912 | 28.625 | 78.575 |
| 2016-03-041:21:18 PM | 59.225 | 150.912 | 28.625 | 78.575 |
| 2016-03-041:21:22 PM | 59.338 | 150.912 | 28.625 | 78.575 |
| 2016-03-041:21:26 PM | 59.225 | 150.912 | 28.625 | 78.575 |
| 2016-03-041:21:30 PM | 59.338 | 150.912 | 28.738 | 78.575 |
| 2016-03-041:21:35 PM | 59.225 | 150.912 | 28.738 | 78.575 |
| 2016-03-041:21:39 PM | 59.225 | 150.912 | 28.85 | 78.575 |
| 2016-03-041:21:43 PM | 59.225 | 150.912 | 28.962 | 78.575 |
| 2016-03-041:21:47 PM | 59.225 | 150.912 | 28.962 | 78.575 |
| 2016-03-041:21:51 PM | 59.225 | 150.912 | 29.075 | 78.575 |
| 2016-03-041:21:55 PM | 59.225 | 150.912 | 29.188 | 78.575 |
| 2016-03-041:21:59 PM | 59.225 | 150.912 | 29.188 | 78.575 |
| 2016-03-041:22:03 PM | 59.225 | 150.912 | 29.188 | 78.575 |
| 2016-03-041:22:07 PM | 59.225 | 150.912 | 28.962 | 78.575 |
| 2016-03-041:22:11 PM | 59.225 | 151.025 | 28.738 | 78.575 |
| 2016-03-041:22:15 PM | 59.225 | 151.025 | 28.625 | 78.575 |
| 2016-03-041:22:19 PM | 59.225 | 151.025 | 28.4 | 78.575 |
| 2016-03-041:22:23 PM | 59.225 | 151.025 | 28.288 | 78.575 |
| 2016-03-041:22:27 PM | 59.225 | 151.138 | 28.175 | 78.575 |
| 2016-03-041:22:31 PM | 59.225 | 151.138 | 27.95 | 78.575 |
| 2016-03-041:22:35 PM | 59.338 | 151.138 | 27.838 | 78.575 |
| 2016-03-041:22:39 PM | 59.225 | 151.138 | 27.838 | 78.575 |
| 2016-03-041:22:43 PM | 59.225 | 151.138 | 27.725 | 78.575 |
| 2016-03-041:22:47 PM | 59.225 | 151.138 | 27.725 | 78.575 |
| 2016-03-041:22:51 PM | 59.225 | 151.138 | 27.838 | 78.575 |
| 2016-03-041:22:59 PM | 59.225 | 151.138 | 28.062 | 78.575 |
| 2016-03-041:23:03 PM | 59.225 | 151.25 | 27.95 | 78.575 |
| 2016-03-041:23:07 PM | 59.225 | 151.25 | 27.838 | 78.575 |
| 2016-03-041:23:11 PM | 59.338 | 151.25 | 27.725 | 78.462 |
| 2016-03-041:23:15 PM | 59.338 | 151.362 | 27.5 | 78.575 |
| 2016-03-041:23:19 PM | 59.338 | 151.362 | 27.275 | 78.462 |
| 2016-03-041:23:23 PM | 59.338 | 151.362 | 27.05 | 78.575 |
| 2016-03-041:23:27 PM | 59.338 | 151.362 | 26.825 | 78.575 |
| 2016-03-041:23:31 PM | 59.338 | 151.362 | 26.6 | 78.575 |
| 2016-03-041:23:35 PM | 59.338 | 151.362 | 26.488 | 78.462 |
| 2016-03-041:23:39 PM | 59.338 | 151.362 | 26.488 | 78.575 |
| 2016-03-041:23:43 PM | 59.338 | 151.362 | 26.262 | 78.462 |
| 2016-03-041:23:48 PM | 59.45 | 151.362 | 26.15 | 78.462 |
| 2016-03-041:23:52 PM | 59.45 | 151.362 | 26.15 | 78.462 |
| 2016-03-041:23:56 PM | 59.338 | 151.362 | 26.15 | 78.462 |
| 2016-03-041:24:00 PM | 59.45 | 151.362 | 26.038 | 78.462 |
| 2016-03-041:24:04 PM | 59.45 | 151.475 | 25.925 | 78.462 |
| 2016-03-041:24:08 PM | 59.45 | 151.362 | 25.588 | 78.575 |
| 2016-03-041:24:12 PM | 59.562 | 151.362 | 25.475 | 78.462 |
| 2016-03-041:24:16 PM | 59.562 | 151.362 | 25.362 | 78.462 |
| 2016-03-041:24:20 PM | 59.562 | 151.362 | 25.362 | 78.462 |
| 2016-03-041:24:24 PM | 59.562 | 151.362 | 25.475 | 78.462 |
| 2016-03-041:24:28 PM | 59.562 | 151.362 | 25.7 | 78.462 |
| 2016-03-041:24:32 PM | 59.562 | 151.362 | 25.812 | 78.575 |
| 2016-03-041:24:36 PM | 59.562 | 151.362 | 26.15 | 78.462 |
| 2016-03-041:24:40 PM | 59.562 | 151.362 | 26.375 | 78.462 |
| 2016-03-041:24:44 PM | 59.562 | 151.362 | 26.6 | 78.462 |
| 2016-03-041:24:48 PM | 59.562 | 151.362 | 26.712 | 78.462 |
| 2016-03-041:24:52 PM | 59.562 | 151.362 | 26.938 | 78.462 |
| 2016-03-041:24:56 PM | 59.675 | 151.362 | 26.938 | 78.462 |
| 2016-03-041:25:00 PM | 59.675 | 151.362 | 26.712 | 78.462 |
| 2016-03-041:25:04 PM | 59.675 | 151.475 | 26.6 | 78.462 |
| 2016-03-041:25:08 PM | 59.675 | 151.362 | 26.488 | 78.462 |
| 2016-03-041:25:12 PM | 59.675 | 151.362 | 26.375 | 78.462 |
| 2016-03-041:25:16 PM | 59.675 | 151.362 | 26.262 | 78.462 |
| 2016-03-041:25:20 PM | 59.675 | 151.362 | 26.262 | 78.462 |
| 2016-03-041:25:24 PM | 59.675 | 151.362 | 26.262 | 78.462 |
| 2016-03-041:25:28 PM | 59.675 | 151.362 | 26.375 | 78.462 |
| 2016-03-041:25:32 PM | 59.788 | 151.362 | 26.488 | 78.462 |
| 2016-03-041:25:36 PM | 59.788 | 151.362 | 26.6 | 78.462 |
| 2016-03-041:25:40 PM | 59.788 | 151.362 | 26.825 | 78.462 |
| 2016-03-041:25:44 PM | 59.9 | 151.362 | 27.05 | 78.462 |
| 2016-03-041:25:48 PM | 59.9 | 151.362 | 27.275 | 78.462 |
| 2016-03-041:25:52 PM | 59.9 | 151.362 | 27.5 | 78.462 |
| 2016-03-041:25:56 PM | 59.9 | 151.362 | 27.725 | 78.462 |
| 2016-03-041:26:00 PM | 59.9 | 151.362 | 27.95 | 78.462 |
| 2016-03-041:26:05 PM | 59.9 | 151.362 | 28.062 | 78.462 |
| 2016-03-041:26:09 PM | 60.012 | 151.362 | 28.175 | 78.462 |
| 2016-03-041:26:13 PM | 60.012 | 151.362 | 28.4 | 78.462 |
| 2016-03-041:26:17 PM | 60.012 | 151.362 | 28.512 | 78.462 |
| 2016-03-041:26:21 PM | 60.012 | 151.362 | 28.738 | 78.462 |
| 2016-03-041:26:25 PM | 60.012 | 151.362 | 28.962 | 78.462 |
| 2016-03-041:26:29 PM | 60.012 | 151.362 | 29.075 | 78.462 |
| 2016-03-041:26:33 PM | 60.012 | 151.362 | 29.3 | 78.462 |
| 2016-03-041:26:37 PM | 60.012 | 151.362 | 29.3 | 78.462 |
| 2016-03-041:26:41 PM | 60.012 | 151.362 | 29.412 | 78.35 |
| 2016-03-041:26:45 PM | 60.012 | 151.362 | 29.525 | 78.462 |
| 2016-03-041:26:49 PM | 60.125 | 151.362 | 29.75 | 78.462 |
| 2016-03-041:26:53 PM | 60.012 | 151.362 | 29.975 | 78.462 |
| 2016-03-041:26:57 PM | 60.125 | 151.362 | 30.088 | 78.462 |
| 2016-03-041:27:01 PM | 60.125 | 151.362 | 30.312 | 78.462 |
| 2016-03-041:27:05 PM | 60.125 | 151.362 | 30.425 | 78.462 |
| 2016-03-041:27:09 PM | 60.125 | 151.362 | 30.65 | 78.462 |
| 2016-03-041:27:13 PM | 60.125 | 151.362 | 30.762 | 78.462 |
| 2016-03-041:27:17 PM | 60.125 | 151.475 | 30.65 | 78.462 |
| 2016-03-041:27:21 PM | 60.125 | 151.475 | 30.65 | 78.462 |
| 2016-03-041:27:25 PM | 60.238 | 151.362 | 30.65 | 78.462 |
| 2016-03-041:27:29 PM | 60.238 | 151.362 | 30.762 | 78.462 |
| 2016-03-041:27:33 PM | 60.238 | 151.362 | 30.65 | 78.462 |
| 2016-03-041:27:37 PM | 60.238 | 151.362 | 30.65 | 78.462 |
| 2016-03-041:27:41 PM | 60.238 | 151.475 | 30.65 | 78.462 |
| 2016-03-041:27:45 PM | 60.238 | 151.362 | 30.425 | 78.462 |
| 2016-03-041:27:49 PM | 60.238 | 151.475 | 30.425 | 78.462 |
| 2016-03-041:27:53 PM | 60.238 | 151.362 | 30.312 | 78.462 |
| 2016-03-041:27:57 PM | 60.238 | 151.362 | 30.425 | 78.462 |
| 2016-03-041:28:01 PM | 60.238 | 151.362 | 30.538 | 78.462 |
| 2016-03-041:28:06 PM | 60.238 | 151.362 | 30.65 | 78.462 |
| 2016-03-041:28:10 PM | 60.35 | 151.362 | 30.538 | 78.462 |
| 2016-03-041:28:14 PM | 60.35 | 151.362 | 30.538 | 78.462 |
| 2016-03-041:28:18 PM | 60.35 | 151.362 | 30.538 | 78.462 |
| 2016-03-041:28:22 PM | 60.35 | 151.362 | 30.538 | 78.462 |
| 2016-03-041:28:26 PM | 60.238 | 151.362 | 30.65 | 78.462 |
| 2016-03-041:28:30 PM | 60.238 | 151.362 | 30.65 | 78.462 |
| 2016-03-041:28:34 PM | 60.238 | 151.362 | 30.762 | 78.462 |
| 2016-03-041:28:38 PM | 60.238 | 151.362 | 30.762 | 78.462 |
| 2016-03-041:28:42 PM | 60.125 | 151.362 | 30.762 | 78.462 |
| 2016-03-041:28:46 PM | 60.125 | 151.362 | 30.65 | 78.462 |
| 2016-03-041:28:50 PM | 60.125 | 151.362 | 30.762 | 78.462 |
| 2016-03-041:28:54 PM | 60.125 | 151.25 | 30.762 | 78.462 |
| 2016-03-041:28:58 PM | 60.125 | 151.25 | 30.762 | 78.575 |
| 2016-03-041:29:02 PM | 60.125 | 151.25 | 30.875 | 78.575 |
| 2016-03-041:29:06 PM | 60.125 | 151.25 | 30.988 | 78.462 |
| 2016-03-041:29:10 PM | 60.125 | 151.362 | 31.1 | 78.462 |
| 2016-03-041:29:14 PM | 60.125 | 151.25 | 31.1 | 78.462 |
| 2016-03-041:29:18 PM | 60.125 | 151.25 | 31.1 | 78.462 |
| 2016-03-041:29:22 PM | 60.238 | 151.25 | 31.1 | 78.462 |
| 2016-03-041:29:26 PM | 60.238 | 151.25 | 31.1 | 78.462 |
| 2016-03-041:29:30 PM | 60.238 | 151.25 | 31.325 | 78.462 |
| 2016-03-041:29:34 PM | 60.35 | 151.25 | 31.325 | 78.462 |
| 2016-03-041:29:38 PM | 60.35 | 151.138 | 31.438 | 78.462 |
| 2016-03-041:29:42 PM | 60.35 | 151.25 | 31.662 | 78.462 |
| 2016-03-041:29:46 PM | 60.35 | 151.25 | 31.662 | 78.462 |
| 2016-03-041:29:50 PM | 60.35 | 151.25 | 31.662 | 78.462 |
| 2016-03-041:29:54 PM | 60.35 | 151.25 | 31.662 | 78.462 |
| 2016-03-041:29:58 PM | 60.462 | 151.25 | 31.775 | 78.462 |
| 2016-03-041:30:02 PM | 60.462 | 151.25 | 31.888 | 78.462 |
| 2016-03-041:30:06 PM | 60.462 | 151.25 | 31.775 | 78.462 |
| 2016-03-041:30:10 PM | 60.575 | 151.25 | 31.662 | 78.462 |
| 2016-03-041:30:14 PM | 60.575 | 151.25 | 31.55 | 78.462 |
| 2016-03-041:30:18 PM | 60.575 | 151.25 | 31.55 | 78.462 |
| 2016-03-041:30:23 PM | 60.575 | 151.25 | 31.55 | 78.462 |
| 2016-03-041:30:27 PM | 60.688 | 151.25 | 31.55 | 78.462 |
| 2016-03-041:30:31 PM | 60.688 | 151.25 | 31.55 | 78.575 |
| 2016-03-041:30:35 PM | 60.575 | 151.25 | 31.55 | 78.462 |
| 2016-03-041:30:39 PM | 60.8 | 151.25 | 31.662 | 78.462 |
| 2016-03-041:30:43 PM | 60.8 | 151.25 | 31.55 | 78.462 |
| 2016-03-041:30:47 PM | 60.8 | 151.25 | 31.438 | 78.575 |
| 2016-03-041:30:51 PM | 60.8 | 151.25 | 31.325 | 78.575 |
| 2016-03-041:30:55 PM | 60.8 | 151.362 | 31.325 | 78.575 |
| 2016-03-041:30:59 PM | 60.8 | 151.25 | 31.55 | 78.462 |
| 2016-03-041:31:03 PM | 60.8 | 151.25 | 31.55 | 78.462 |
| 2016-03-041:31:07 PM | 60.8 | 151.25 | 31.662 | 78.462 |
| 2016-03-041:31:11 PM | 60.8 | 151.25 | 31.55 | 78.575 |
| 2016-03-041:31:15 PM | 60.8 | 151.25 | 31.55 | 78.462 |
| 2016-03-041:31:19 PM | 60.912 | 151.25 | 31.662 | 78.462 |
| 2016-03-041:31:23 PM | 60.912 | 151.25 | 31.662 | 78.462 |
| 2016-03-041:31:27 PM | 60.912 | 151.25 | 31.55 | 78.462 |
| 2016-03-041:31:31 PM | 60.912 | 151.25 | 31.438 | 78.462 |
| 2016-03-041:31:35 PM | 61.025 | 151.138 | 31.325 | 78.462 |
| 2016-03-041:31:39 PM | 61.025 | 151.138 | 31.325 | 78.462 |
| 2016-03-041:31:43 PM | 61.138 | 151.138 | 31.212 | 78.462 |
| 2016-03-041:31:47 PM | 61.138 | 151.138 | 31.212 | 78.575 |
| 2016-03-041:31:51 PM | 61.025 | 151.138 | 31.212 | 78.462 |
| 2016-03-041:31:55 PM | 61.025 | 151.138 | 31.212 | 78.462 |
| 2016-03-041:31:59 PM | 61.138 | 151.138 | 31.1 | 78.462 |
| 2016-03-041:32:03 PM | 61.025 | 151.138 | 30.988 | 78.575 |
| 2016-03-041:32:07 PM | 61.025 | 151.138 | 30.875 | 78.575 |
| 2016-03-041:32:11 PM | 60.912 | 151.138 | 30.762 | 78.462 |
| 2016-03-041:32:15 PM | 60.912 | 151.138 | 30.762 | 78.462 |
| 2016-03-041:32:19 PM | 60.912 | 151.138 | 30.762 | 78.575 |
| 2016-03-041:32:23 PM | 60.8 | 151.138 | 30.762 | 78.575 |
| 2016-03-041:32:27 PM | 60.8 | 151.138 | 30.762 | 78.575 |
| 2016-03-041:32:31 PM | 60.8 | 151.25 | 30.875 | 78.575 |
| 2016-03-041:32:36 PM | 60.8 | 151.25 | 30.65 | 78.575 |
| 2016-03-041:32:40 PM | 60.688 | 151.25 | 30.538 | 78.575 |
| 2016-03-041:32:44 PM | 60.688 | 151.25 | 30.425 | 78.575 |
| 2016-03-041:32:48 PM | 60.575 | 151.25 | 30.538 | 78.575 |
| 2016-03-041:32:52 PM | 60.575 | 151.25 | 30.538 | 78.575 |
| 2016-03-041:32:56 PM | 60.462 | 151.362 | 30.538 | 78.575 |
| 2016-03-041:33:00 PM | 60.462 | 151.362 | 30.538 | 78.575 |
| 2016-03-041:33:04 PM | 60.35 | 151.25 | 30.65 | 78.575 |
| 2016-03-041:33:08 PM | 60.35 | 151.25 | 30.65 | 78.575 |
| 2016-03-041:33:12 PM | 60.35 | 151.362 | 30.65 | 78.575 |
| 2016-03-041:33:16 PM | 60.35 | 151.25 | 30.538 | 78.575 |
| 2016-03-041:33:20 PM | 60.238 | 151.362 | 30.425 | 78.575 |
| 2016-03-041:33:24 PM | 60.238 | 151.362 | 30.312 | 78.575 |
| 2016-03-041:33:28 PM | 60.238 | 151.362 | 30.312 | 78.575 |
| 2016-03-041:33:32 PM | 60.238 | 151.362 | 30.425 | 78.575 |
| 2016-03-041:33:36 PM | 60.238 | 151.362 | 30.425 | 78.575 |
| 2016-03-041:33:40 PM | 60.238 | 151.362 | 30.425 | 78.575 |
| 2016-03-041:33:44 PM | 60.238 | 151.362 | 30.425 | 78.575 |
| 2016-03-041:33:48 PM | 60.125 | 151.362 | 30.538 | 78.575 |
| 2016-03-041:33:52 PM | 60.125 | 151.362 | 30.538 | 78.575 |
| 2016-03-041:33:56 PM | 60.125 | 151.362 | 30.538 | 78.688 |
| 2016-03-041:34:00 PM | 60.125 | 151.362 | 30.65 | 78.688 |
| 2016-03-041:34:04 PM | 60.125 | 151.362 | 30.762 | 78.575 |
| 2016-03-041:34:08 PM | 60.125 | 151.475 | 30.875 | 78.575 |
| 2016-03-041:34:12 PM | 60.012 | 151.362 | 30.875 | 78.688 |
| 2016-03-041:34:16 PM | 60.012 | 151.362 | 30.875 | 78.688 |
| 2016-03-041:34:20 PM | 60.012 | 151.362 | 30.988 | 78.575 |
| 2016-03-041:34:24 PM | 60.012 | 151.362 | 30.988 | 78.688 |
| 2016-03-041:34:28 PM | 60.012 | 151.475 | 30.875 | 78.688 |
| 2016-03-041:34:32 PM | 60.012 | 151.475 | 30.762 | 78.688 |
| 2016-03-041:34:36 PM | 60.125 | 151.475 | 30.65 | 78.688 |
| 2016-03-041:34:40 PM | 60.125 | 151.475 | 30.538 | 78.688 |
| 2016-03-041:34:44 PM | 60.125 | 151.362 | 30.425 | 78.688 |
| 2016-03-041:34:49 PM | 60.238 | 151.362 | 30.425 | 78.688 |
| 2016-03-041:34:53 PM | 60.238 | 151.475 | 30.312 | 78.688 |
| 2016-03-041:34:57 PM | 60.238 | 151.475 | 30.2 | 78.688 |
| 2016-03-041:35:01 PM | 60.238 | 151.475 | 30.2 | 78.688 |
| 2016-03-041:35:05 PM | 60.238 | 151.475 | 30.2 | 78.688 |
| 2016-03-041:35:09 PM | 60.125 | 151.588 | 30.312 | 78.688 |
| 2016-03-041:35:13 PM | 60.125 | 151.588 | 30.425 | 78.688 |
| 2016-03-041:35:17 PM | 60.125 | 151.588 | 30.538 | 78.688 |
| 2016-03-041:35:21 PM | 60.238 | 151.588 | 30.65 | 78.688 |
| 2016-03-041:35:29 PM | 60.125 | 151.588 | 30.762 | 78.575 |
| 2016-03-041:35:33 PM | 60.238 | 151.588 | 30.762 | 78.688 |
| 2016-03-041:35:37 PM | 60.238 | 151.588 | 30.875 | 78.688 |
| 2016-03-041:35:41 PM | 60.238 | 151.588 | 30.988 | 78.688 |
| 2016-03-041:35:45 PM | 60.238 | 151.588 | 31.1 | 78.688 |
| 2016-03-041:35:49 PM | 60.238 | 151.588 | 31.212 | 78.688 |
| 2016-03-041:35:53 PM | 60.238 | 151.7 | 31.212 | 78.688 |
| 2016-03-041:35:57 PM | 60.238 | 151.588 | 31.325 | 78.688 |
| 2016-03-041:36:01 PM | 60.238 | 151.588 | 31.438 | 78.688 |
| 2016-03-041:36:05 PM | 60.238 | 151.588 | 31.438 | 78.688 |
| 2016-03-041:36:09 PM | 60.238 | 151.588 | 31.438 | 78.688 |
| 2016-03-041:36:13 PM | 60.238 | 151.588 | 31.212 | 78.688 |
| 2016-03-041:36:17 PM | 60.238 | 151.7 | 31.212 | 78.688 |
| 2016-03-041:36:21 PM | 60.35 | 151.7 | 31.212 | 78.688 |
| 2016-03-041:36:25 PM | 60.35 | 151.7 | 31.325 | 78.688 |
| 2016-03-041:36:29 PM | 60.35 | 151.7 | 31.438 | 78.688 |
| 2016-03-041:36:33 PM | 60.35 | 151.7 | 31.438 | 78.688 |
| 2016-03-041:36:37 PM | 60.35 | 151.7 | 31.438 | 78.688 |
| 2016-03-041:36:41 PM | 60.35 | 151.7 | 31.438 | 78.688 |
| 2016-03-041:36:45 PM | 60.35 | 151.7 | 31.438 | 78.688 |
| 2016-03-041:36:49 PM | 60.35 | 151.7 | 31.55 | 78.688 |
| 2016-03-041:36:53 PM | 60.35 | 151.7 | 31.662 | 78.688 |
| 2016-03-041:36:57 PM | 60.35 | 151.7 | 31.775 | 78.8 |
| 2016-03-041:37:02 PM | 60.35 | 151.7 | 31.775 | 78.688 |
| 2016-03-041:37:06 PM | 60.35 | 151.812 | 32 | 78.688 |
| 2016-03-041:37:10 PM | 60.35 | 151.7 | 32 | 78.688 |
| 2016-03-041:37:14 PM | 60.238 | 151.812 | 32.112 | 78.688 |
| 2016-03-041:37:18 PM | 60.238 | 151.812 | 32.225 | 78.688 |
| 2016-03-041:37:22 PM | 60.35 | 151.812 | 32.225 | 78.688 |
| 2016-03-041:37:26 PM | 60.238 | 151.812 | 32.112 | 78.8 |
| 2016-03-041:37:30 PM | 60.238 | 151.812 | 32.112 | 78.688 |
| 2016-03-041:37:34 PM | 60.35 | 151.812 | 32.112 | 78.688 |
| 2016-03-041:37:38 PM | 60.35 | 151.812 | 32.225 | 78.688 |
| 2016-03-041:37:42 PM | 60.35 | 151.812 | 32.338 | 78.688 |
| 2016-03-041:37:46 PM | 60.35 | 151.812 | 32.45 | 78.688 |
| 2016-03-041:37:50 PM | 60.462 | 151.812 | 32.45 | 78.688 |
| 2016-03-041:37:54 PM | 60.462 | 151.812 | 32.45 | 78.688 |
| 2016-03-041:37:58 PM | 60.462 | 151.812 | 32.45 | 78.8 |
| 2016-03-041:38:02 PM | 60.462 | 151.812 | 32.45 | 78.688 |
| 2016-03-041:38:06 PM | 60.575 | 151.812 | 32.45 | 78.688 |
| 2016-03-041:38:10 PM | 60.575 | 151.812 | 32.45 | 78.688 |
| 2016-03-041:38:14 PM | 60.575 | 151.812 | 32.338 | 78.688 |
| 2016-03-041:38:18 PM | 60.575 | 151.812 | 32.45 | 78.688 |
| 2016-03-041:38:22 PM | 60.575 | 151.812 | 32.45 | 78.688 |
| 2016-03-041:38:26 PM | 60.688 | 151.812 | 32.562 | 78.8 |
| 2016-03-041:38:30 PM | 60.575 | 151.7 | 32.562 | 78.8 |
| 2016-03-041:38:34 PM | 60.575 | 151.7 | 32.675 | 78.8 |
| 2016-03-041:38:38 PM | 60.575 | 151.7 | 32.675 | 78.8 |
| 2016-03-041:38:42 PM | 60.575 | 151.7 | 32.675 | 78.8 |
| 2016-03-041:38:46 PM | 60.462 | 151.7 | 32.562 | 78.8 |
| 2016-03-041:38:50 PM | 60.462 | 151.7 | 32.562 | 78.8 |
| 2016-03-041:38:54 PM | 60.462 | 151.7 | 32.562 | 78.688 |
| 2016-03-041:38:58 PM | 60.462 | 151.588 | 32.562 | 78.688 |
| 2016-03-041:39:02 PM | 60.462 | 151.7 | 32.675 | 78.8 |
| 2016-03-041:39:06 PM | 60.462 | 151.7 | 32.675 | 78.688 |
| 2016-03-041:39:10 PM | 60.462 | 151.588 | 32.675 | 78.688 |
| 2016-03-041:39:15 PM | 60.462 | 151.588 | 32.675 | 78.8 |
| 2016-03-041:39:19 PM | 60.462 | 151.588 | 32.675 | 78.688 |
| 2016-03-041:39:23 PM | 60.462 | 151.588 | 32.788 | 78.688 |
| 2016-03-041:39:27 PM | 60.575 | 151.588 | 32.788 | 78.688 |
| 2016-03-041:39:31 PM | 60.575 | 151.475 | 32.9 | 78.688 |
| 2016-03-041:39:35 PM | 60.575 | 151.475 | 32.9 | 78.688 |
| 2016-03-041:39:39 PM | 60.575 | 151.475 | 33.012 | 78.688 |
| 2016-03-041:39:43 PM | 60.575 | 151.362 | 33.125 | 78.688 |
| 2016-03-041:39:47 PM | 60.688 | 151.362 | 33.238 | 78.688 |
| 2016-03-041:39:51 PM | 60.688 | 151.362 | 33.238 | 78.688 |
| 2016-03-041:39:55 PM | 60.688 | 151.25 | 33.238 | 78.688 |
| 2016-03-041:39:59 PM | 60.688 | 151.25 | 33.238 | 78.688 |
| 2016-03-041:40:03 PM | 60.688 | 151.25 | 33.238 | 78.688 |
| 2016-03-041:40:07 PM | 60.688 | 151.138 | 33.35 | 78.688 |
| 2016-03-041:40:11 PM | 60.688 | 151.25 | 33.35 | 78.688 |
| 2016-03-041:40:15 PM | 60.8 | 151.138 | 33.35 | 78.688 |
| 2016-03-041:40:19 PM | 60.8 | 151.138 | 33.35 | 78.688 |
| 2016-03-041:40:23 PM | 60.912 | 151.138 | 33.125 | 78.688 |
| 2016-03-041:40:27 PM | 60.912 | 151.138 | 33.012 | 78.688 |
| 2016-03-041:40:31 PM | 60.912 | 151.138 | 33.012 | 78.688 |
| 2016-03-041:40:35 PM | 60.912 | 151.025 | 33.125 | 78.688 |
| 2016-03-041:40:39 PM | 61.025 | 151.025 | 33.238 | 78.688 |
| 2016-03-041:40:43 PM | 61.025 | 151.025 | 33.35 | 78.8 |
| 2016-03-041:40:47 PM | 61.138 | 150.912 | 33.35 | 78.688 |
| 2016-03-041:40:51 PM | 61.138 | 150.912 | 33.35 | 78.8 |
| 2016-03-041:40:55 PM | 61.138 | 150.912 | 33.238 | 78.688 |
| 2016-03-041:40:59 PM | 61.138 | 150.912 | 33.125 | 78.688 |
| 2016-03-041:41:03 PM | 61.138 | 150.8 | 33.125 | 78.688 |
| 2016-03-041:41:07 PM | 61.138 | 150.8 | 33.125 | 78.8 |
| 2016-03-041:41:11 PM | 61.25 | 150.8 | 33.012 | 78.8 |
| 2016-03-041:41:15 PM | 61.138 | 150.8 | 33.012 | 78.8 |
| 2016-03-041:41:19 PM | 61.138 | 150.688 | 32.9 | 78.8 |
| 2016-03-041:41:23 PM | 61.25 | 150.688 | 32.788 | 78.8 |
| 2016-03-041:41:28 PM | 61.25 | 150.688 | 32.562 | 78.8 |
| 2016-03-041:41:32 PM | 61.25 | 150.688 | 32.338 | 78.8 |
| 2016-03-041:41:36 PM | 61.25 | 150.575 | 32 | 78.8 |
| 2016-03-041:41:40 PM | 61.25 | 150.575 | 31.775 | 78.8 |
| 2016-03-041:41:44 PM | 61.25 | 150.575 | 31.775 | 78.8 |
| 2016-03-041:41:48 PM | 61.138 | 150.575 | 31.55 | 78.688 |
| 2016-03-041:41:52 PM | 61.138 | 150.575 | 31.438 | 78.8 |
| 2016-03-041:41:56 PM | 61.138 | 150.575 | 31.325 | 78.8 |
| 2016-03-041:42:00 PM | 61.025 | 150.575 | 31.325 | 78.8 |
| 2016-03-041:42:04 PM | 60.912 | 150.575 | 31.325 | 78.8 |
| 2016-03-041:42:08 PM | 60.912 | 150.575 | 31.438 | 78.8 |
| 2016-03-041:42:12 PM | 60.8 | 150.575 | 31.325 | 78.8 |
| 2016-03-041:42:16 PM | 60.688 | 150.575 | 31.325 | 78.8 |
| 2016-03-041:42:20 PM | 60.688 | 150.575 | 31.438 | 78.8 |
| 2016-03-041:42:24 PM | 60.688 | 150.575 | 31.438 | 78.8 |
| 2016-03-041:42:28 PM | 60.575 | 150.575 | 31.438 | 78.688 |
| 2016-03-041:42:32 PM | 60.462 | 150.575 | 31.438 | 78.8 |
| 2016-03-041:42:36 PM | 60.462 | 150.575 | 31.55 | 78.8 |
| 2016-03-041:42:40 PM | 60.35 | 150.575 | 31.55 | 78.8 |
| 2016-03-041:42:44 PM | 60.35 | 150.575 | 31.55 | 78.8 |
| 2016-03-041:42:48 PM | 60.35 | 150.575 | 31.55 | 78.8 |
| 2016-03-041:42:52 PM | 60.35 | 150.575 | 31.662 | 78.8 |
| 2016-03-041:42:56 PM | 60.238 | 150.575 | 31.775 | 78.8 |
| 2016-03-041:43:00 PM | 60.35 | 150.575 | 31.888 | 78.8 |
| 2016-03-041:43:04 PM | 60.35 | 150.575 | 32 | 78.8 |
| 2016-03-041:43:08 PM | 60.35 | 150.575 | 32.112 | 78.8 |
| 2016-03-041:43:12 PM | 60.238 | 150.575 | 32.225 | 78.8 |
| 2016-03-041:43:16 PM | 60.35 | 150.575 | 32.225 | 78.8 |
| 2016-03-041:43:20 PM | 60.35 | 150.575 | 32.338 | 78.8 |
| 2016-03-041:43:24 PM | 60.35 | 150.575 | 32.338 | 78.8 |
| 2016-03-041:43:28 PM | 60.35 | 150.575 | 32.45 | 78.8 |
| 2016-03-041:43:32 PM | 60.35 | 150.575 | 32.45 | 78.8 |
| 2016-03-041:43:36 PM | 60.35 | 150.575 | 32.338 | 78.8 |
| 2016-03-041:43:41 PM | 60.35 | 150.575 | 32.225 | 78.8 |
| 2016-03-041:43:45 PM | 60.35 | 150.575 | 32.225 | 78.8 |
| 2016-03-041:43:49 PM | 60.35 | 150.575 | 32.225 | 78.8 |
| 2016-03-041:43:53 PM | 60.462 | 150.575 | 32.225 | 78.8 |
| 2016-03-041:43:57 PM | 60.462 | 150.575 | 32.338 | 78.8 |
| 2016-03-041:44:01 PM | 60.462 | 150.575 | 32.338 | 78.8 |
| 2016-03-041:44:05 PM | 60.462 | 150.575 | 32.338 | 78.8 |
| 2016-03-041:44:09 PM | 60.462 | 150.462 | 32.338 | 78.8 |
| 2016-03-041:44:13 PM | 60.462 | 150.462 | 32.225 | 78.8 |
| 2016-03-041:44:17 PM | 60.462 | 150.575 | 32.225 | 78.8 |
| 2016-03-041:44:21 PM | 60.462 | 150.462 | 32.225 | 78.8 |
| 2016-03-041:44:25 PM | 60.462 | 150.462 | 32.112 | 78.8 |
| 2016-03-041:44:29 PM | 60.462 | 150.462 | 32 | 78.8 |
| 2016-03-041:44:33 PM | 60.575 | 150.462 | 31.888 | 78.8 |
| 2016-03-041:44:37 PM | 60.575 | 150.462 | 31.775 | 78.8 |
| 2016-03-041:44:41 PM | 60.575 | 150.462 | 31.775 | 78.8 |
| 2016-03-041:44:45 PM | 60.575 | 150.462 | 31.775 | 78.8 |
| 2016-03-041:44:49 PM | 60.575 | 150.462 | 31.888 | 78.8 |
| 2016-03-041:44:53 PM | 60.575 | 150.575 | 31.888 | 78.8 |
| 2016-03-041:44:57 PM | 60.575 | 150.575 | 32 | 78.8 |
| 2016-03-041:45:01 PM | 60.575 | 150.575 | 32 | 78.8 |
| 2016-03-041:45:05 PM | 60.575 | 150.575 | 31.888 | 78.8 |
| 2016-03-041:45:09 PM | 60.575 | 150.575 | 31.775 | 78.8 |
| 2016-03-041:45:13 PM | 60.575 | 150.462 | 31.775 | 78.8 |
| 2016-03-041:45:17 PM | 60.575 | 150.462 | 31.55 | 78.8 |
| 2016-03-041:45:21 PM | 60.688 | 150.575 | 31.325 | 78.8 |
| 2016-03-041:45:25 PM | 60.688 | 150.462 | 31.212 | 78.8 |
| 2016-03-041:45:29 PM | 60.8 | 150.462 | 31.1 | 78.8 |
| 2016-03-041:45:33 PM | 60.912 | 150.462 | 31.1 | 78.8 |
| 2016-03-041:45:37 PM | 60.8 | 150.35 | 31.212 | 78.8 |
| 2016-03-041:45:41 PM | 60.912 | 150.35 | 31.325 | 78.8 |
| 2016-03-041:45:45 PM | 60.912 | 150.35 | 31.438 | 78.8 |
| 2016-03-041:45:49 PM | 60.912 | 150.35 | 31.55 | 78.8 |
| 2016-03-041:45:53 PM | 60.912 | 150.238 | 31.55 | 78.8 |
| 2016-03-041:45:58 PM | 60.912 | 150.238 | 31.662 | 78.8 |
| 2016-03-041:46:02 PM | 60.8 | 150.238 | 31.775 | 78.8 |
| 2016-03-041:46:06 PM | 60.8 | 150.238 | 31.888 | 78.8 |
| 2016-03-041:46:10 PM | 60.912 | 150.238 | 31.888 | 78.8 |
| 2016-03-041:46:14 PM | 60.8 | 150.238 | 32 | 78.8 |
| 2016-03-041:46:18 PM | 60.8 | 150.238 | 32.112 | 78.8 |
| 2016-03-041:46:22 PM | 60.8 | 150.238 | 32.112 | 78.8 |
| 2016-03-041:46:26 PM | 60.8 | 150.125 | 32.112 | 78.8 |
| 2016-03-041:46:30 PM | 60.912 | 150.125 | 32 | 78.8 |
| 2016-03-041:46:34 PM | 60.8 | 150.125 | 32.112 | 78.8 |
| 2016-03-041:46:38 PM | 60.8 | 150.125 | 32.225 | 78.8 |
| 2016-03-041:46:42 PM | 60.8 | 150.125 | 32.112 | 78.8 |
| 2016-03-041:46:46 PM | 60.912 | 150.125 | 31.888 | 78.8 |
| 2016-03-041:46:50 PM | 60.912 | 150.013 | 31.888 | 78.8 |
| 2016-03-041:46:54 PM | 60.912 | 150.013 | 31.775 | 78.8 |
| 2016-03-041:46:58 PM | 60.912 | 150.013 | 31.888 | 78.912 |
| 2016-03-041:47:02 PM | 60.912 | 150.013 | 31.888 | 78.8 |
| 2016-03-041:47:06 PM | 61.025 | 150.013 | 31.888 | 78.8 |
| 2016-03-041:47:10 PM | 60.912 | 150.013 | 31.888 | 78.8 |
| 2016-03-041:47:14 PM | 60.912 | 149.9 | 32 | 78.8 |
| 2016-03-041:47:18 PM | 60.912 | 150.013 | 32 | 78.8 |
| 2016-03-041:47:22 PM | 60.912 | 149.9 | 32.112 | 78.912 |
| 2016-03-041:47:26 PM | 60.912 | 149.9 | 32.112 | 78.912 |
| 2016-03-041:47:30 PM | 60.8 | 149.9 | 32.112 | 78.8 |
| 2016-03-041:47:34 PM | 60.8 | 149.9 | 31.888 | 78.912 |
| 2016-03-041:47:38 PM | 60.8 | 149.9 | 31.662 | 78.912 |
| 2016-03-041:47:42 PM | 60.688 | 149.9 | 31.662 | 78.912 |
| 2016-03-041:47:46 PM | 60.688 | 149.788 | 31.55 | 78.912 |
| 2016-03-041:47:50 PM | 60.688 | 149.788 | 31.55 | 78.912 |
| 2016-03-041:47:55 PM | 60.688 | 149.788 | 31.438 | 78.912 |
| 2016-03-041:47:59 PM | 60.688 | 149.788 | 31.325 | 78.912 |
| 2016-03-041:48:03 PM | 60.688 | 149.788 | 31.325 | 78.912 |
| 2016-03-041:48:07 PM | 60.688 | 149.675 | 31.325 | 78.912 |
| 2016-03-041:48:11 PM | 60.688 | 149.675 | 31.325 | 78.912 |
| 2016-03-041:48:15 PM | 60.688 | 149.562 | 31.325 | 78.912 |
| 2016-03-041:48:19 PM | 60.688 | 149.562 | 31.325 | 78.912 |
| 2016-03-041:48:23 PM | 60.8 | 149.562 | 31.438 | 78.912 |
| 2016-03-041:48:27 PM | 60.8 | 149.562 | 31.55 | 78.912 |
| 2016-03-041:48:31 PM | 60.8 | 149.562 | 31.662 | 78.912 |
| 2016-03-041:48:35 PM | 60.8 | 149.562 | 31.775 | 78.912 |
| 2016-03-041:48:39 PM | 60.8 | 149.562 | 31.888 | 78.912 |
| 2016-03-041:48:43 PM | 60.8 | 149.45 | 32 | 78.912 |
| 2016-03-041:48:47 PM | 60.912 | 149.45 | 32.112 | 79.025 |
| 2016-03-041:48:51 PM | 60.912 | 149.45 | 32.112 | 78.912 |
| 2016-03-041:48:56 PM | 60.8 | 149.338 | 32.225 | 79.025 |
| 2016-03-041:49:00 PM | 60.8 | 149.338 | 32.338 | 79.025 |
| 2016-03-041:49:04 PM | 60.8 | 149.338 | 32.45 | 78.912 |
| 2016-03-041:49:08 PM | 60.8 | 149.338 | 32.562 | 78.912 |
| 2016-03-041:49:12 PM | 60.8 | 149.338 | 32.45 | 78.912 |
| 2016-03-041:49:16 PM | 60.912 | 149.338 | 32.338 | 78.912 |
| 2016-03-041:49:20 PM | 60.912 | 149.338 | 32 | 79.025 |
| 2016-03-041:49:24 PM | 60.912 | 149.338 | 31.888 | 78.912 |
| 2016-03-041:49:28 PM | 60.912 | 149.225 | 31.662 | 78.912 |
| 2016-03-041:49:32 PM | 60.912 | 149.225 | 31.325 | 78.912 |
| 2016-03-041:49:36 PM | 60.912 | 149.225 | 31.1 | 78.912 |
| 2016-03-041:49:40 PM | 60.912 | 149.225 | 30.875 | 78.912 |
| 2016-03-041:49:44 PM | 60.912 | 149.225 | 30.875 | 78.912 |
| 2016-03-041:49:48 PM | 60.912 | 149.225 | 30.762 | 78.912 |
| 2016-03-041:49:53 PM | 60.912 | 149.225 | 30.762 | 78.912 |
| 2016-03-041:49:57 PM | 60.912 | 149.225 | 30.875 | 78.912 |
| 2016-03-041:50:01 PM | 61.025 | 149.225 | 30.988 | 78.912 |
| 2016-03-041:50:05 PM | 60.912 | 149.225 | 31.1 | 78.912 |
| 2016-03-041:50:09 PM | 61.025 | 149.112 | 31.1 | 78.912 |
| 2016-03-041:50:13 PM | 61.025 | 149.112 | 31.1 | 78.912 |
| 2016-03-041:50:17 PM | 60.912 | 149.112 | 31.212 | 78.912 |
| 2016-03-041:50:21 PM | 61.025 | 149.112 | 31.325 | 78.912 |
| 2016-03-041:50:25 PM | 61.025 | 149 | 31.325 | 78.912 |
| 2016-03-041:50:29 PM | 61.025 | 149.112 | 31.325 | 78.912 |
| 2016-03-041:50:33 PM | 61.138 | 149 | 31.212 | 78.912 |
| 2016-03-041:50:37 PM | 61.025 | 149 | 31.212 | 78.912 |
| 2016-03-041:50:41 PM | 61.025 | 148.888 | 31.1 | 78.912 |
| 2016-03-041:50:45 PM | 61.025 | 148.888 | 31.212 | 78.912 |
| 2016-03-041:50:49 PM | 61.025 | 148.888 | 31.212 | 78.912 |
| 2016-03-041:50:53 PM | 61.025 | 148.775 | 31.212 | 78.912 |
| 2016-03-041:50:57 PM | 61.025 | 148.775 | 30.988 | 78.8 |
| 2016-03-041:51:01 PM | 61.025 | 148.775 | 30.875 | 78.912 |
| 2016-03-041:51:05 PM | 61.025 | 148.662 | 30.875 | 78.912 |
| 2016-03-041:51:09 PM | 61.138 | 148.662 | 30.875 | 78.912 |
| 2016-03-041:51:13 PM | 61.138 | 148.55 | 30.988 | 78.8 |
| 2016-03-041:51:17 PM | 61.025 | 148.55 | 31.1 | 78.8 |
| 2016-03-041:51:21 PM | 61.025 | 148.55 | 31.212 | 78.912 |
| 2016-03-041:51:25 PM | 61.025 | 148.55 | 31.325 | 78.912 |
| 2016-03-041:51:29 PM | 61.025 | 148.55 | 31.325 | 78.8 |
| 2016-03-041:51:33 PM | 61.025 | 148.55 | 31.438 | 78.912 |
| 2016-03-041:51:37 PM | 60.912 | 148.55 | 31.55 | 78.912 |
| 2016-03-041:51:41 PM | 60.912 | 148.55 | 31.662 | 78.8 |
| 2016-03-041:51:45 PM | 60.912 | 148.438 | 31.775 | 78.8 |
| 2016-03-041:51:49 PM | 60.912 | 148.438 | 31.888 | 78.8 |
| 2016-03-041:51:53 PM | 60.912 | 148.438 | 31.775 | 78.8 |
| 2016-03-041:51:57 PM | 61.025 | 148.438 | 31.888 | 78.8 |
| 2016-03-041:52:02 PM | 61.025 | 148.438 | 32.112 | 78.8 |
| 2016-03-041:52:06 PM | 61.025 | 148.438 | 32.225 | 78.8 |
| 2016-03-041:52:10 PM | 60.912 | 148.438 | 32.225 | 78.8 |
| 2016-03-041:52:14 PM | 61.025 | 148.325 | 32.338 | 78.8 |
| 2016-03-041:52:18 PM | 61.025 | 148.325 | 32.562 | 78.8 |
| 2016-03-041:52:22 PM | 61.025 | 148.325 | 32.675 | 78.8 |
| 2016-03-041:52:26 PM | 61.025 | 148.325 | 32.788 | 78.8 |
| 2016-03-041:52:30 PM | 61.138 | 148.325 | 32.9 | 78.688 |
| 2016-03-041:52:34 PM | 61.138 | 148.212 | 33.012 | 78.8 |
| 2016-03-041:52:38 PM | 61.138 | 148.212 | 33.125 | 78.8 |
| 2016-03-041:52:42 PM | 61.138 | 148.212 | 33.125 | 78.688 |
| 2016-03-041:52:46 PM | 61.25 | 148.212 | 33.238 | 78.688 |
| 2016-03-041:52:50 PM | 61.138 | 148.1 | 33.125 | 78.688 |
| 2016-03-041:52:54 PM | 61.138 | 148.212 | 33.125 | 78.688 |
| 2016-03-041:52:58 PM | 61.25 | 148.1 | 33.012 | 78.688 |
| 2016-03-041:53:02 PM | 61.25 | 148.1 | 33.012 | 78.688 |
| 2016-03-041:53:06 PM | 61.25 | 148.1 | 33.012 | 78.688 |
| 2016-03-041:53:10 PM | 61.25 | 147.988 | 33.012 | 78.688 |
| 2016-03-041:53:14 PM | 61.25 | 147.988 | 33.012 | 78.688 |
| 2016-03-041:53:18 PM | 61.25 | 147.988 | 33.012 | 78.688 |
| 2016-03-041:53:22 PM | 61.363 | 147.988 | 32.9 | 78.688 |
| 2016-03-041:53:26 PM | 61.25 | 147.988 | 33.012 | 78.575 |
| 2016-03-041:53:30 PM | 61.25 | 147.988 | 32.9 | 78.688 |
| 2016-03-041:53:34 PM | 61.25 | 147.875 | 32.788 | 78.688 |
| 2016-03-041:53:38 PM | 61.25 | 147.763 | 32.562 | 78.575 |
| 2016-03-041:53:42 PM | 61.25 | 147.875 | 32.45 | 78.575 |
| 2016-03-041:53:46 PM | 61.25 | 147.763 | 32.45 | 78.688 |
| 2016-03-041:53:50 PM | 61.25 | 147.875 | 32.45 | 78.688 |
| 2016-03-041:53:54 PM | 61.363 | 147.875 | 32.338 | 78.575 |
| 2016-03-041:53:58 PM | 61.363 | 147.875 | 32.45 | 78.688 |
| 2016-03-041:54:02 PM | 61.363 | 147.875 | 32.45 | 78.688 |
| 2016-03-041:54:06 PM | 61.475 | 147.763 | 32.45 | 78.688 |
| 2016-03-041:54:10 PM | 61.363 | 147.763 | 32.562 | 78.688 |
| 2016-03-041:54:14 PM | 61.475 | 147.763 | 32.675 | 78.688 |
| 2016-03-041:54:19 PM | 61.475 | 147.763 | 32.562 | 78.688 |
| 2016-03-041:54:23 PM | 61.475 | 147.763 | 32.338 | 78.688 |
| 2016-03-041:54:27 PM | 61.475 | 147.65 | 32.225 | 78.688 |
| 2016-03-041:54:31 PM | 61.363 | 147.65 | 32.112 | 78.688 |
| 2016-03-041:54:35 PM | 61.475 | 147.65 | 32 | 78.688 |
| 2016-03-041:54:39 PM | 61.475 | 147.538 | 32 | 78.688 |
| 2016-03-041:54:43 PM | 61.475 | 147.538 | 32 | 78.688 |
| 2016-03-041:54:47 PM | 61.475 | 147.538 | 31.888 | 78.688 |
| 2016-03-041:54:51 PM | 61.475 | 147.538 | 31.888 | 78.688 |
| 2016-03-041:54:55 PM | 61.475 | 147.538 | 31.662 | 78.688 |
| 2016-03-041:54:59 PM | 61.475 | 147.65 | 31.438 | 78.8 |
| 2016-03-041:55:03 PM | 61.475 | 147.65 | 31.325 | 78.8 |
| 2016-03-041:55:07 PM | 61.363 | 147.65 | 31.325 | 78.688 |
| 2016-03-041:55:11 PM | 61.363 | 147.65 | 31.212 | 78.688 |
| 2016-03-041:55:15 PM | 61.363 | 147.538 | 31.212 | 78.688 |
| 2016-03-041:55:19 PM | 61.475 | 147.538 | 31.212 | 78.8 |
| 2016-03-041:55:23 PM | 61.475 | 147.538 | 31.212 | 78.8 |
| 2016-03-041:55:27 PM | 61.475 | 147.538 | 31.325 | 78.8 |
| 2016-03-041:55:31 PM | 61.588 | 147.538 | 31.438 | 78.8 |
| 2016-03-041:55:35 PM | 61.7 | 147.538 | 31.55 | 78.8 |
| 2016-03-041:55:39 PM | 61.588 | 147.538 | 31.662 | 78.8 |
| 2016-03-041:55:43 PM | 61.7 | 147.425 | 31.662 | 78.8 |
| 2016-03-041:55:47 PM | 61.588 | 147.538 | 31.662 | 78.8 |
| 2016-03-041:55:51 PM | 61.7 | 147.425 | 31.662 | 78.8 |
| 2016-03-041:55:55 PM | 61.588 | 147.538 | 31.662 | 78.8 |
| 2016-03-041:55:59 PM | 61.588 | 147.538 | 31.55 | 78.8 |
| 2016-03-041:56:03 PM | 61.588 | 147.538 | 31.55 | 78.8 |
| 2016-03-041:56:07 PM | 61.588 | 147.538 | 31.438 | 78.8 |
| 2016-03-041:56:11 PM | 61.588 | 147.538 | 31.438 | 78.8 |
| 2016-03-041:56:15 PM | 61.588 | 147.425 | 31.55 | 78.8 |
| 2016-03-041:56:19 PM | 61.588 | 147.425 | 31.662 | 78.8 |
| 2016-03-041:56:23 PM | 61.588 | 147.425 | 31.888 | 78.8 |
| 2016-03-041:56:27 PM | 61.588 | 147.425 | 31.888 | 78.8 |
| 2016-03-041:56:32 PM | 61.588 | 147.425 | 31.888 | 78.8 |
| 2016-03-041:56:36 PM | 61.588 | 147.425 | 31.775 | 78.8 |
| 2016-03-041:56:40 PM | 61.588 | 147.425 | 31.55 | 78.8 |
| 2016-03-041:56:44 PM | 61.475 | 147.538 | 31.438 | 78.8 |
| 2016-03-041:56:48 PM | 61.475 | 147.538 | 31.325 | 78.8 |
| 2016-03-041:56:52 PM | 61.475 | 147.538 | 31.325 | 78.8 |
| 2016-03-041:56:56 PM | 61.363 | 147.538 | 31.438 | 78.8 |
| 2016-03-041:57:00 PM | 61.363 | 147.538 | 31.55 | 78.8 |
| 2016-03-041:57:04 PM | 61.363 | 147.538 | 31.55 | 78.8 |
| 2016-03-041:57:08 PM | 61.363 | 147.425 | 31.662 | 78.8 |
| 2016-03-041:57:12 PM | 61.363 | 147.425 | 31.775 | 78.8 |
| 2016-03-041:57:16 PM | 61.475 | 147.425 | 32 | 78.8 |
| 2016-03-041:57:20 PM | 61.475 | 147.538 | 32 | 78.8 |
| 2016-03-041:57:24 PM | 61.475 | 147.538 | 32 | 78.8 |
| 2016-03-041:57:28 PM | 61.475 | 147.425 | 32.112 | 78.8 |
| 2016-03-041:57:32 PM | 61.475 | 147.425 | 32.338 | 78.8 |
| 2016-03-041:57:36 PM | 61.475 | 147.425 | 32.45 | 78.8 |
| 2016-03-041:57:40 PM | 61.588 | 147.425 | 32.45 | 78.8 |
| 2016-03-041:57:44 PM | 61.7 | 147.425 | 32.45 | 78.8 |
| 2016-03-041:57:48 PM | 61.7 | 147.425 | 32.562 | 78.8 |
| 2016-03-041:57:52 PM | 61.812 | 147.425 | 32.562 | 78.8 |
| 2016-03-041:57:56 PM | 61.925 | 147.425 | 32.675 | 78.8 |
| 2016-03-041:58:00 PM | 62.038 | 147.425 | 32.675 | 78.8 |
| 2016-03-041:58:04 PM | 62.038 | 147.425 | 32.562 | 78.8 |
| 2016-03-041:58:08 PM | 62.038 | 147.425 | 32.562 | 78.8 |
| 2016-03-041:58:12 PM | 62.038 | 147.425 | 32.45 | 78.8 |
| 2016-03-041:58:16 PM | 62.15 | 147.312 | 32.45 | 78.8 |
| 2016-03-041:58:20 PM | 62.15 | 147.312 | 32.45 | 78.8 |
| 2016-03-041:58:24 PM | 62.15 | 147.312 | 32.562 | 78.8 |
| 2016-03-041:58:28 PM | 62.15 | 147.312 | 32.45 | 78.912 |
| 2016-03-041:58:32 PM | 62.15 | 147.312 | 32.562 | 78.8 |
| 2016-03-041:58:36 PM | 62.15 | 147.312 | 32.45 | 78.8 |
| 2016-03-041:58:40 PM | 62.15 | 147.312 | 32.45 | 78.8 |
| 2016-03-041:58:45 PM | 62.15 | 147.312 | 32.45 | 78.8 |
| 2016-03-041:58:49 PM | 62.15 | 147.312 | 32.45 | 78.8 |
| 2016-03-041:58:53 PM | 62.15 | 147.312 | 32.338 | 78.8 |
| 2016-03-041:58:57 PM | 62.15 | 147.2 | 32.338 | 78.8 |
| 2016-03-041:59:01 PM | 62.15 | 147.2 | 32.338 | 78.8 |
| 2016-03-041:59:05 PM | 62.15 | 147.088 | 32.45 | 78.912 |
| 2016-03-041:59:09 PM | 62.262 | 147.088 | 32.45 | 78.8 |
| 2016-03-041:59:13 PM | 62.262 | 147.088 | 32.562 | 78.912 |
| 2016-03-041:59:17 PM | 62.262 | 147.088 | 32.675 | 78.8 |
| 2016-03-041:59:21 PM | 62.262 | 146.975 | 32.788 | 78.912 |
| 2016-03-041:59:25 PM | 62.262 | 146.975 | 32.9 | 78.8 |
| 2016-03-041:59:29 PM | 62.262 | 146.975 | 32.9 | 78.8 |
| 2016-03-041:59:33 PM | 62.262 | 146.975 | 32.9 | 78.8 |
| 2016-03-041:59:37 PM | 62.262 | 146.975 | 32.788 | 78.912 |
| 2016-03-041:59:41 PM | 62.15 | 146.862 | 32.788 | 78.912 |
| 2016-03-041:59:45 PM | 62.15 | 146.862 | 32.788 | 78.8 |
| 2016-03-041:59:49 PM | 62.15 | 146.862 | 32.788 | 78.912 |
| 2016-03-041:59:53 PM | 62.15 | 146.862 | 32.9 | 78.912 |
| 2016-03-041:59:57 PM | 62.038 | 146.75 | 32.9 | 78.912 |
| 2016-03-042:00:01 PM | 62.15 | 146.75 | 33.012 | 78.912 |
| 2016-03-042:00:05 PM | 62.038 | 146.638 | 33.012 | 78.912 |
| 2016-03-042:00:09 PM | 62.038 | 146.638 | 33.012 | 78.8 |
| 2016-03-042:00:14 PM | 62.038 | 146.525 | 32.675 | 78.912 |
| 2016-03-042:00:18 PM | 62.038 | 146.525 | 32.338 | 78.8 |
| 2016-03-042:00:22 PM | 62.038 | 146.412 | 32.225 | 78.912 |
| 2016-03-042:00:26 PM | 62.038 | 146.412 | 32.112 | 78.8 |
| 2016-03-042:00:30 PM | 62.038 | 146.3 | 32.112 | 78.8 |
| 2016-03-042:00:34 PM | 62.038 | 146.3 | 32.112 | 78.8 |
| 2016-03-042:00:38 PM | 62.038 | 146.188 | 32.225 | 78.8 |
| 2016-03-042:00:42 PM | 62.038 | 146.188 | 32.225 | 78.8 |
| 2016-03-042:00:46 PM | 62.15 | 146.188 | 32.225 | 78.8 |
| 2016-03-042:00:50 PM | 62.038 | 146.188 | 32.338 | 78.912 |
| 2016-03-042:00:54 PM | 62.038 | 146.188 | 32.338 | 78.8 |
| 2016-03-042:00:58 PM | 62.038 | 146.075 | 32.45 | 78.8 |
| 2016-03-042:01:02 PM | 61.925 | 146.075 | 32.45 | 78.8 |
| 2016-03-042:01:06 PM | 61.925 | 145.962 | 32.338 | 78.912 |
| 2016-03-042:01:10 PM | 61.925 | 145.962 | 32.338 | 78.912 |
| 2016-03-042:01:14 PM | 61.925 | 145.962 | 32.112 | 78.8 |
| 2016-03-042:01:18 PM | 61.925 | 145.962 | 31.888 | 78.8 |
| 2016-03-042:01:22 PM | 61.925 | 145.962 | 31.662 | 78.8 |
| 2016-03-042:01:26 PM | 61.925 | 145.85 | 31.55 | 78.912 |
| 2016-03-042:01:30 PM | 61.812 | 145.962 | 31.438 | 78.8 |
| 2016-03-042:01:34 PM | 61.812 | 145.85 | 31.325 | 78.8 |
| 2016-03-042:01:38 PM | 61.812 | 145.85 | 31.325 | 78.8 |
| 2016-03-042:01:43 PM | 61.812 | 145.85 | 31.325 | 78.8 |
| 2016-03-042:01:47 PM | 61.812 | 145.85 | 31.325 | 78.8 |
| 2016-03-042:01:51 PM | 61.812 | 145.85 | 31.212 | 78.8 |
| 2016-03-042:01:55 PM | 61.812 | 145.85 | 31.212 | 78.912 |
| 2016-03-042:01:59 PM | 61.812 | 145.85 | 31.212 | 78.912 |
| 2016-03-042:02:03 PM | 61.812 | 145.85 | 31.325 | 78.8 |
| 2016-03-042:02:07 PM | 61.812 | 145.738 | 31.325 | 78.912 |
| 2016-03-042:02:11 PM | 61.925 | 145.738 | 31.438 | 78.912 |
| 2016-03-042:02:15 PM | 61.925 | 145.738 | 31.55 | 78.8 |
| 2016-03-042:02:19 PM | 61.925 | 145.738 | 31.438 | 78.912 |
| 2016-03-042:02:23 PM | 61.812 | 145.738 | 31.212 | 78.912 |
| 2016-03-042:02:27 PM | 61.812 | 145.738 | 30.875 | 78.912 |
| 2016-03-042:02:31 PM | 61.812 | 145.738 | 30.65 | 78.912 |
| 2016-03-042:02:35 PM | 61.7 | 145.738 | 30.65 | 78.912 |
| 2016-03-042:02:39 PM | 61.7 | 145.738 | 30.65 | 78.912 |
| 2016-03-042:02:43 PM | 61.7 | 145.738 | 30.65 | 78.912 |
| 2016-03-042:02:47 PM | 61.588 | 145.738 | 30.538 | 78.912 |
| 2016-03-042:02:51 PM | 61.588 | 145.738 | 30.425 | 78.912 |
| 2016-03-042:02:55 PM | 61.588 | 145.738 | 30.425 | 78.912 |
| 2016-03-042:02:59 PM | 61.475 | 145.738 | 30.425 | 78.912 |
| 2016-03-042:03:03 PM | 61.475 | 145.738 | 30.538 | 78.912 |
| 2016-03-042:03:07 PM | 61.363 | 145.738 | 30.762 | 78.912 |
| 2016-03-042:03:11 PM | 61.363 | 145.738 | 30.762 | 78.912 |
| 2016-03-042:03:16 PM | 61.25 | 145.738 | 30.875 | 78.912 |
| 2016-03-042:03:20 PM | 61.25 | 145.738 | 31.1 | 78.912 |
| 2016-03-042:03:24 PM | 61.363 | 145.738 | 31.212 | 78.912 |
| 2016-03-042:03:28 PM | 61.25 | 145.738 | 31.438 | 78.912 |
| 2016-03-042:03:32 PM | 61.25 | 145.738 | 31.325 | 78.912 |
| 2016-03-042:03:36 PM | 61.25 | 145.738 | 31.325 | 78.912 |
| 2016-03-042:03:40 PM | 61.25 | 145.738 | 31.212 | 78.912 |
| 2016-03-042:03:44 PM | 61.138 | 145.738 | 31.212 | 78.912 |
| 2016-03-042:03:48 PM | 61.138 | 145.738 | 31.325 | 78.912 |
| 2016-03-042:03:52 PM | 61.138 | 145.738 | 31.438 | 78.912 |
| 2016-03-042:03:56 PM | 61.138 | 145.738 | 31.438 | 78.912 |
| 2016-03-042:04:00 PM | 61.025 | 145.738 | 31.438 | 78.912 |
| 2016-03-042:04:04 PM | 61.025 | 145.738 | 31.325 | 78.912 |
| 2016-03-042:04:08 PM | 61.025 | 145.738 | 31.438 | 78.912 |
| 2016-03-042:04:13 PM | 61.025 | 145.738 | 31.55 | 78.912 |
| 2016-03-042:04:17 PM | 61.025 | 145.738 | 31.775 | 78.912 |
| 2016-03-042:04:21 PM | 61.138 | 145.738 | 31.662 | 78.912 |
| 2016-03-042:04:25 PM | 61.138 | 145.738 | 31.55 | 78.912 |
| 2016-03-042:04:29 PM | 61.25 | 145.738 | 31.55 | 78.912 |
| 2016-03-042:04:33 PM | 61.25 | 145.85 | 31.662 | 78.912 |
| 2016-03-042:04:37 PM | 61.363 | 145.85 | 31.775 | 78.912 |
| 2016-03-042:04:41 PM | 61.363 | 145.85 | 31.888 | 78.912 |
| 2016-03-042:04:45 PM | 61.363 | 145.85 | 32.112 | 78.912 |
| 2016-03-042:04:49 PM | 61.363 | 145.738 | 32.225 | 78.912 |
| 2016-03-042:04:53 PM | 61.475 | 145.738 | 32.225 | 78.912 |
| 2016-03-042:04:57 PM | 61.588 | 145.738 | 32.112 | 78.912 |
| 2016-03-042:05:01 PM | 61.588 | 145.738 | 32 | 78.912 |
| 2016-03-042:05:06 PM | 61.7 | 145.738 | 32 | 78.912 |
| 2016-03-042:05:10 PM | 61.812 | 145.738 | 32 | 78.912 |
| 2016-03-042:05:14 PM | 61.812 | 145.738 | 32.112 | 78.912 |
| 2016-03-042:05:18 PM | 61.812 | 145.85 | 32.112 | 78.912 |
| 2016-03-042:05:22 PM | 61.812 | 145.738 | 32.112 | 78.912 |
| 2016-03-042:05:26 PM | 61.812 | 145.738 | 32.112 | 78.912 |
| 2016-03-042:05:30 PM | 61.812 | 145.738 | 32 | 78.912 |
| 2016-03-042:05:34 PM | 61.812 | 145.738 | 32 | 78.912 |
| 2016-03-042:05:38 PM | 61.812 | 145.625 | 32 | 78.912 |
| 2016-03-042:05:42 PM | 61.812 | 145.625 | 32.225 | 78.912 |
| 2016-03-042:05:46 PM | 61.812 | 145.625 | 32.225 | 78.912 |
| 2016-03-042:05:50 PM | 61.925 | 145.625 | 32.225 | 78.912 |
| 2016-03-042:05:54 PM | 61.925 | 145.625 | 32 | 78.912 |
| 2016-03-042:05:58 PM | 61.925 | 145.625 | 31.775 | 78.912 |
| 2016-03-042:06:02 PM | 62.038 | 145.625 | 31.775 | 78.912 |
| 2016-03-042:06:06 PM | 62.038 | 145.625 | 31.662 | 78.912 |
| 2016-03-042:06:11 PM | 62.15 | 145.512 | 31.662 | 78.912 |
| 2016-03-042:06:15 PM | 62.262 | 145.625 | 31.662 | 78.912 |
| 2016-03-042:06:19 PM | 62.262 | 145.512 | 31.55 | 78.912 |
| 2016-03-042:06:23 PM | 62.375 | 145.512 | 31.438 | 78.912 |
| 2016-03-042:06:27 PM | 62.488 | 145.512 | 31.325 | 78.912 |
| 2016-03-042:06:31 PM | 62.488 | 145.4 | 31.212 | 78.912 |
| 2016-03-042:06:35 PM | 62.488 | 145.4 | 31.212 | 78.912 |
| 2016-03-042:06:39 PM | 62.6 | 145.4 | 31.325 | 78.912 |
| 2016-03-042:06:43 PM | 62.6 | 145.4 | 31.325 | 78.912 |
| 2016-03-042:06:47 PM | 62.712 | 145.288 | 31.438 | 78.912 |
| 2016-03-042:06:51 PM | 62.825 | 145.175 | 31.55 | 78.912 |
| 2016-03-042:06:55 PM | 62.825 | 145.175 | 31.55 | 78.912 |
| 2016-03-042:06:59 PM | 62.825 | 145.175 | 31.662 | 78.912 |
| 2016-03-042:07:03 PM | 62.938 | 145.062 | 31.775 | 78.912 |
| 2016-03-042:07:07 PM | 63.05 | 145.062 | 31.888 | 78.912 |
| 2016-03-042:07:11 PM | 63.05 | 145.062 | 32 | 78.912 |
| 2016-03-042:07:16 PM | 63.05 | 144.95 | 32.112 | 78.912 |
| 2016-03-042:07:20 PM | 63.162 | 144.95 | 32.112 | 78.912 |
| 2016-03-042:07:24 PM | 63.162 | 144.95 | 32.225 | 78.912 |
| 2016-03-042:07:28 PM | 63.275 | 144.95 | 32.338 | 78.912 |
| 2016-03-042:07:32 PM | 63.162 | 144.838 | 32.45 | 78.912 |
| 2016-03-042:07:36 PM | 63.162 | 144.838 | 32.562 | 79.025 |
| 2016-03-042:07:40 PM | 63.162 | 144.725 | 32.562 | 78.912 |
| 2016-03-042:07:44 PM | 63.162 | 144.725 | 32.788 | 78.912 |
| 2016-03-042:07:48 PM | 63.162 | 144.612 | 32.675 | 78.912 |
| 2016-03-042:07:52 PM | 63.162 | 144.612 | 32.675 | 78.912 |
| 2016-03-042:07:56 PM | 63.275 | 144.612 | 32.45 | 78.912 |
| 2016-03-042:08:00 PM | 63.162 | 144.612 | 32.338 | 78.912 |
| 2016-03-042:08:04 PM | 63.162 | 144.5 | 32.112 | 78.912 |
| 2016-03-042:08:08 PM | 63.05 | 144.5 | 32.112 | 78.912 |
| 2016-03-042:08:12 PM | 62.938 | 144.5 | 32 | 78.912 |
| 2016-03-042:08:16 PM | 62.938 | 144.388 | 32 | 78.912 |
| 2016-03-042:08:21 PM | 62.825 | 144.388 | 32 | 78.912 |
| 2016-03-042:08:25 PM | 62.712 | 144.388 | 32 | 79.025 |
| 2016-03-042:08:29 PM | 62.6 | 144.388 | 31.888 | 78.912 |
| 2016-03-042:08:33 PM | 62.488 | 144.388 | 31.888 | 78.912 |
| 2016-03-042:08:37 PM | 62.375 | 144.388 | 31.775 | 78.912 |
| 2016-03-042:08:41 PM | 62.262 | 144.388 | 31.775 | 78.912 |
| 2016-03-042:08:45 PM | 62.15 | 144.388 | 31.775 | 79.025 |
| 2016-03-042:08:49 PM | 62.038 | 144.275 | 31.775 | 79.025 |
| 2016-03-042:08:53 PM | 62.038 | 144.388 | 31.775 | 78.912 |
| 2016-03-042:08:57 PM | 61.812 | 144.388 | 31.888 | 78.912 |
| 2016-03-042:09:01 PM | 61.812 | 144.388 | 31.775 | 78.912 |
| 2016-03-042:09:05 PM | 61.7 | 144.388 | 31.775 | 78.912 |
| 2016-03-042:09:09 PM | 61.7 | 144.388 | 31.775 | 79.025 |
| 2016-03-042:09:13 PM | 61.588 | 144.388 | 31.888 | 78.912 |
| 2016-03-042:09:18 PM | 61.475 | 144.388 | 31.888 | 78.912 |
| 2016-03-042:09:22 PM | 61.363 | 144.388 | 31.888 | 79.025 |
| 2016-03-042:09:26 PM | 61.363 | 144.5 | 32 | 79.025 |
| 2016-03-042:09:30 PM | 61.363 | 144.5 | 31.888 | 78.912 |
| 2016-03-042:09:34 PM | 61.363 | 144.5 | 31.888 | 78.912 |
| 2016-03-042:09:38 PM | 61.25 | 144.5 | 31.888 | 78.912 |
| 2016-03-042:09:42 PM | 61.25 | 144.5 | 31.888 | 79.025 |
| 2016-03-042:09:46 PM | 61.138 | 144.5 | 31.888 | 78.912 |
| 2016-03-042:09:50 PM | 61.138 | 144.5 | 31.775 | 78.912 |
| 2016-03-042:09:54 PM | 61.025 | 144.5 | 31.662 | 78.912 |
| 2016-03-042:09:58 PM | 61.025 | 144.5 | 31.662 | 78.912 |
| 2016-03-042:10:02 PM | 60.912 | 144.5 | 31.55 | 78.912 |
| 2016-03-042:10:06 PM | 60.912 | 144.5 | 31.55 | 78.912 |
| 2016-03-042:10:10 PM | 60.8 | 144.5 | 31.662 | 78.912 |
| 2016-03-042:10:14 PM | 60.8 | 144.5 | 31.662 | 78.912 |
| 2016-03-042:10:19 PM | 60.8 | 144.5 | 31.775 | 78.912 |
| 2016-03-042:10:23 PM | 60.688 | 144.5 | 31.775 | 79.025 |
| 2016-03-042:10:27 PM | 60.8 | 144.5 | 31.662 | 78.912 |
| 2016-03-042:10:31 PM | 60.688 | 144.5 | 31.662 | 78.912 |
| 2016-03-042:10:35 PM | 60.688 | 144.5 | 31.775 | 78.912 |
| 2016-03-042:10:39 PM | 60.688 | 144.5 | 31.775 | 78.912 |
| 2016-03-042:10:43 PM | 60.688 | 144.5 | 31.775 | 79.025 |
| 2016-03-042:10:47 PM | 60.688 | 144.5 | 31.888 | 78.912 |
| 2016-03-042:10:51 PM | 60.575 | 144.5 | 32 | 78.912 |
| 2016-03-042:10:55 PM | 60.688 | 144.5 | 32.112 | 79.025 |
| 2016-03-042:10:59 PM | 60.688 | 144.5 | 32.112 | 78.912 |
| 2016-03-042:11:03 PM | 60.688 | 144.388 | 32.112 | 79.025 |
| 2016-03-042:11:07 PM | 60.688 | 144.388 | 32.112 | 79.025 |
| 2016-03-042:11:11 PM | 60.8 | 144.388 | 32.225 | 78.912 |
| 2016-03-042:11:16 PM | 60.912 | 144.275 | 32.225 | 79.025 |
| 2016-03-042:11:20 PM | 61.025 | 144.275 | 32.225 | 79.025 |
| 2016-03-042:11:24 PM | 61.138 | 144.275 | 32.225 | 78.912 |
| 2016-03-042:11:28 PM | 61.25 | 144.275 | 32.225 | 78.912 |
| 2016-03-042:11:32 PM | 61.25 | 144.275 | 32.112 | 78.912 |
| 2016-03-042:11:36 PM | 61.25 | 144.162 | 32 | 78.912 |
| 2016-03-042:11:40 PM | 61.363 | 144.162 | 31.775 | 79.025 |
| 2016-03-042:11:44 PM | 61.363 | 144.162 | 31.662 | 78.912 |
| 2016-03-042:11:48 PM | 61.363 | 144.162 | 31.662 | 78.912 |
| 2016-03-042:11:52 PM | 61.363 | 144.05 | 31.775 | 79.025 |
| 2016-03-042:11:56 PM | 61.25 | 144.05 | 31.888 | 78.912 |
| 2016-03-042:12:00 PM | 61.25 | 144.05 | 32 | 79.025 |
| 2016-03-042:12:04 PM | 61.363 | 144.05 | 31.888 | 78.912 |
| 2016-03-042:12:08 PM | 61.363 | 144.05 | 31.775 | 78.912 |
| 2016-03-042:12:12 PM | 61.363 | 144.05 | 31.775 | 78.912 |
| 2016-03-042:12:17 PM | 61.363 | 143.938 | 31.775 | 79.025 |
| 2016-03-042:12:21 PM | 61.363 | 143.938 | 31.775 | 79.025 |
| 2016-03-042:12:25 PM | 61.363 | 143.825 | 31.888 | 79.025 |
| 2016-03-042:12:29 PM | 61.25 | 143.825 | 31.888 | 78.912 |
| 2016-03-042:12:33 PM | 61.25 | 143.712 | 31.888 | 79.025 |
| 2016-03-042:12:37 PM | 61.25 | 143.712 | 31.775 | 79.025 |
| 2016-03-042:12:41 PM | 61.363 | 143.712 | 31.775 | 79.025 |
| 2016-03-042:12:45 PM | 61.363 | 143.6 | 31.662 | 78.912 |
| 2016-03-042:12:49 PM | 61.363 | 143.6 | 31.55 | 78.912 |
| 2016-03-042:12:53 PM | 61.363 | 143.6 | 31.438 | 78.912 |
| 2016-03-042:12:57 PM | 61.25 | 143.488 | 31.325 | 78.912 |
| 2016-03-042:13:01 PM | 61.25 | 143.488 | 31.212 | 78.912 |
| 2016-03-042:13:05 PM | 61.25 | 143.488 | 31.212 | 78.912 |
| 2016-03-042:13:09 PM | 61.138 | 143.375 | 31.212 | 78.912 |
| 2016-03-042:13:13 PM | 61.138 | 143.375 | 31.212 | 78.912 |
| 2016-03-042:13:18 PM | 61.138 | 143.375 | 31.325 | 78.912 |
| 2016-03-042:13:22 PM | 61.138 | 143.375 | 31.438 | 78.912 |
| 2016-03-042:13:26 PM | 61.025 | 143.375 | 31.438 | 78.912 |
| 2016-03-042:13:30 PM | 61.138 | 143.375 | 31.438 | 78.912 |
| 2016-03-042:13:34 PM | 61.025 | 143.262 | 31.438 | 78.912 |
| 2016-03-042:13:38 PM | 61.025 | 143.262 | 31.55 | 78.912 |
| 2016-03-042:13:42 PM | 61.025 | 143.262 | 31.55 | 78.912 |
| 2016-03-042:13:46 PM | 61.025 | 143.262 | 31.55 | 78.912 |
| 2016-03-042:13:50 PM | 61.025 | 143.262 | 31.662 | 78.912 |
| 2016-03-042:13:54 PM | 61.025 | 143.262 | 31.775 | 78.912 |
| 2016-03-042:13:58 PM | 61.025 | 143.15 | 31.888 | 79.025 |
| 2016-03-042:14:02 PM | 61.025 | 143.15 | 31.888 | 79.025 |
| 2016-03-042:14:06 PM | 61.025 | 143.15 | 31.888 | 78.912 |
| 2016-03-042:14:10 PM | 61.025 | 143.15 | 31.888 | 79.025 |
| 2016-03-042:14:14 PM | 61.025 | 143.15 | 32 | 79.025 |
| 2016-03-042:14:19 PM | 61.025 | 143.15 | 32 | 78.912 |
| 2016-03-042:14:23 PM | 61.025 | 143.15 | 32.112 | 78.912 |
| 2016-03-042:14:27 PM | 61.025 | 143.15 | 32.112 | 79.025 |
| 2016-03-042:14:31 PM | 61.025 | 143.15 | 32.225 | 78.912 |
| 2016-03-042:14:35 PM | 61.025 | 143.15 | 32.338 | 79.025 |
| 2016-03-042:14:39 PM | 61.025 | 143.15 | 32.338 | 79.025 |
| 2016-03-042:14:43 PM | 61.025 | 143.15 | 32.45 | 79.025 |
| 2016-03-042:14:47 PM | 61.025 | 143.15 | 32.45 | 79.025 |
| 2016-03-042:14:51 PM | 61.025 | 143.15 | 32.562 | 78.912 |
| 2016-03-042:14:55 PM | 61.025 | 143.15 | 32.675 | 78.912 |
| 2016-03-042:14:59 PM | 61.025 | 143.15 | 32.562 | 79.025 |
| 2016-03-042:15:03 PM | 61.025 | 143.15 | 32.45 | 79.025 |
| 2016-03-042:15:07 PM | 61.138 | 143.15 | 32.225 | 78.912 |
| 2016-03-042:15:11 PM | 61.025 | 143.15 | 32 | 79.025 |
| 2016-03-042:15:15 PM | 61.138 | 143.15 | 31.775 | 79.025 |
| 2016-03-042:15:20 PM | 61.025 | 143.15 | 31.775 | 79.025 |
| 2016-03-042:15:24 PM | 61.025 | 143.15 | 31.775 | 78.912 |
| 2016-03-042:15:28 PM | 61.138 | 143.15 | 31.775 | 79.025 |
| 2016-03-042:15:32 PM | 61.138 | 143.15 | 31.775 | 79.025 |
| 2016-03-042:15:36 PM | 61.138 | 143.038 | 31.662 | 79.025 |
| 2016-03-042:15:40 PM | 61.025 | 143.038 | 31.662 | 79.025 |
| 2016-03-042:15:44 PM | 61.138 | 143.038 | 31.662 | 79.025 |
| 2016-03-042:15:48 PM | 61.025 | 143.038 | 31.662 | 78.912 |
| 2016-03-042:15:52 PM | 61.138 | 143.038 | 31.55 | 79.025 |
| 2016-03-042:15:56 PM | 61.025 | 143.038 | 31.55 | 78.912 |
| 2016-03-042:16:00 PM | 61.025 | 143.038 | 31.662 | 79.025 |
| 2016-03-042:16:04 PM | 61.025 | 143.038 | 31.662 | 79.025 |
| 2016-03-042:16:08 PM | 60.912 | 143.038 | 31.662 | 78.912 |
| 2016-03-042:16:13 PM | 60.912 | 143.15 | 31.775 | 78.912 |
| 2016-03-042:16:17 PM | 60.912 | 143.038 | 31.662 | 79.025 |
| 2016-03-042:16:21 PM | 60.912 | 143.038 | 31.55 | 78.912 |
| 2016-03-042:16:25 PM | 60.912 | 143.15 | 31.55 | 79.025 |
| 2016-03-042:16:29 PM | 60.912 | 143.15 | 31.55 | 79.025 |
| 2016-03-042:16:33 PM | 60.912 | 143.15 | 31.662 | 78.912 |
| 2016-03-042:16:37 PM | 60.912 | 143.15 | 31.662 | 78.912 |
| 2016-03-042:16:41 PM | 61.025 | 143.15 | 31.775 | 79.025 |
| 2016-03-042:16:45 PM | 61.025 | 143.15 | 31.775 | 79.025 |
| 2016-03-042:16:49 PM | 61.025 | 143.038 | 31.888 | 79.025 |
| 2016-03-042:16:53 PM | 61.025 | 143.038 | 32 | 79.025 |
| 2016-03-042:16:57 PM | 61.025 | 143.038 | 32 | 79.025 |
| 2016-03-042:17:01 PM | 60.912 | 143.038 | 31.888 | 79.025 |
| 2016-03-042:17:05 PM | 61.025 | 143.038 | 31.888 | 79.025 |
| 2016-03-042:17:10 PM | 61.025 | 143.038 | 32 | 79.025 |
| 2016-03-042:17:14 PM | 61.138 | 142.925 | 32 | 78.912 |
| 2016-03-042:17:18 PM | 61.138 | 142.925 | 32 | 78.912 |
| 2016-03-042:17:22 PM | 61.138 | 142.925 | 32.112 | 78.912 |
| 2016-03-042:17:26 PM | 61.138 | 142.925 | 32.225 | 78.912 |
| 2016-03-042:17:30 PM | 61.138 | 142.925 | 32.338 | 78.912 |
| 2016-03-042:17:34 PM | 61.138 | 142.925 | 32.338 | 78.912 |
| 2016-03-042:17:38 PM | 61.138 | 142.925 | 32.338 | 78.912 |
| 2016-03-042:17:42 PM | 61.138 | 142.925 | 32.338 | 78.912 |
| 2016-03-042:17:46 PM | 61.138 | 142.812 | 32.225 | 78.912 |
| 2016-03-042:17:50 PM | 61.138 | 142.812 | 32.112 | 78.912 |
| 2016-03-042:17:54 PM | 61.138 | 142.812 | 32 | 78.912 |
| 2016-03-042:17:58 PM | 61.138 | 142.812 | 31.888 | 78.912 |
| 2016-03-042:18:02 PM | 61.138 | 142.7 | 31.888 | 78.912 |
| 2016-03-042:18:07 PM | 61.138 | 142.7 | 32 | 78.912 |
| 2016-03-042:18:11 PM | 61.138 | 142.7 | 32 | 78.912 |
| 2016-03-042:18:15 PM | 61.138 | 142.7 | 32.112 | 78.912 |
| 2016-03-042:18:19 PM | 61.138 | 142.588 | 32.225 | 79.025 |
| 2016-03-042:18:23 PM | 61.138 | 142.588 | 32.225 | 78.912 |
| 2016-03-042:18:27 PM | 61.138 | 142.588 | 32.225 | 79.025 |
| 2016-03-042:18:31 PM | 61.138 | 142.588 | 32.225 | 78.912 |
| 2016-03-042:18:35 PM | 61.138 | 142.588 | 32 | 78.912 |
| 2016-03-042:18:39 PM | 61.138 | 142.475 | 31.888 | 78.912 |
| 2016-03-042:18:43 PM | 61.138 | 142.475 | 31.662 | 78.912 |
| 2016-03-042:18:47 PM | 61.25 | 142.475 | 31.55 | 78.912 |
| 2016-03-042:18:51 PM | 61.25 | 142.362 | 31.662 | 78.912 |
| 2016-03-042:18:55 PM | 61.363 | 142.475 | 31.775 | 78.912 |
| 2016-03-042:18:59 PM | 61.363 | 142.475 | 31.888 | 78.912 |
| 2016-03-042:19:04 PM | 61.363 | 142.475 | 32 | 79.025 |
| 2016-03-042:19:08 PM | 61.363 | 142.475 | 32 | 78.912 |
| 2016-03-042:19:12 PM | 61.363 | 142.475 | 32.112 | 78.912 |
| 2016-03-042:19:16 PM | 61.363 | 142.362 | 32.112 | 78.912 |
| 2016-03-042:19:20 PM | 61.363 | 142.362 | 32 | 78.912 |
| 2016-03-042:19:24 PM | 61.363 | 142.362 | 32.112 | 78.912 |
| 2016-03-042:19:28 PM | 61.363 | 142.362 | 32.112 | 78.912 |
| 2016-03-042:19:32 PM | 61.363 | 142.362 | 32.225 | 78.912 |
| 2016-03-042:19:36 PM | 61.363 | 142.362 | 32.225 | 78.912 |
| 2016-03-042:19:40 PM | 61.25 | 142.362 | 32.225 | 78.912 |
| 2016-03-042:19:44 PM | 61.363 | 142.362 | 32.225 | 78.912 |
| 2016-03-042:19:48 PM | 61.25 | 142.25 | 32.225 | 78.912 |
| 2016-03-042:19:52 PM | 61.363 | 142.25 | 32.112 | 78.912 |
| 2016-03-042:19:56 PM | 61.363 | 142.25 | 32.112 | 78.912 |
| 2016-03-042:20:00 PM | 61.475 | 142.25 | 32.112 | 78.912 |
| 2016-03-042:20:05 PM | 61.475 | 142.25 | 32.225 | 78.912 |
| 2016-03-042:20:09 PM | 61.588 | 142.138 | 32.225 | 78.912 |
| 2016-03-042:20:13 PM | 61.7 | 142.138 | 32.225 | 78.912 |
| 2016-03-042:20:17 PM | 61.812 | 142.138 | 32.225 | 78.912 |
| 2016-03-042:20:21 PM | 61.812 | 142.138 | 32.338 | 78.912 |
| 2016-03-042:20:25 PM | 61.812 | 142.025 | 32.338 | 79.025 |
| 2016-03-042:20:29 PM | 61.812 | 142.025 | 32.225 | 79.025 |
| 2016-03-042:20:33 PM | 61.812 | 141.912 | 32.225 | 78.912 |
| 2016-03-042:20:37 PM | 61.812 | 141.912 | 32.225 | 78.912 |
| 2016-03-042:20:41 PM | 61.7 | 141.912 | 32.225 | 78.912 |
| 2016-03-042:20:45 PM | 61.7 | 141.912 | 32.225 | 78.912 |
| 2016-03-042:20:49 PM | 61.588 | 141.8 | 32.338 | 78.912 |
| 2016-03-042:20:53 PM | 61.588 | 141.8 | 32.338 | 78.912 |
| 2016-03-042:20:57 PM | 61.588 | 141.8 | 32.338 | 78.912 |
| 2016-03-042:21:01 PM | 61.588 | 141.688 | 32.225 | 78.912 |
| 2016-03-042:21:06 PM | 61.475 | 141.688 | 32 | 78.912 |
| 2016-03-042:21:10 PM | 61.475 | 141.688 | 31.775 | 78.912 |
| 2016-03-042:21:14 PM | 61.475 | 141.688 | 31.775 | 78.912 |
| 2016-03-042:21:18 PM | 61.363 | 141.688 | 31.775 | 78.912 |
| 2016-03-042:21:22 PM | 61.363 | 141.688 | 31.775 | 78.912 |
| 2016-03-042:21:26 PM | 61.363 | 141.688 | 31.775 | 78.912 |
| 2016-03-042:21:30 PM | 61.363 | 141.575 | 31.775 | 78.912 |
| 2016-03-042:21:34 PM | 61.363 | 141.575 | 31.775 | 78.912 |
| 2016-03-042:21:38 PM | 61.25 | 141.575 | 31.888 | 78.912 |
| 2016-03-042:21:42 PM | 61.25 | 141.575 | 32 | 78.912 |
| 2016-03-042:21:46 PM | 61.25 | 141.575 | 32.112 | 78.912 |
| 2016-03-042:21:50 PM | 61.25 | 141.462 | 32 | 78.912 |
| 2016-03-042:21:54 PM | 61.25 | 141.462 | 31.888 | 78.912 |
| 2016-03-042:21:58 PM | 61.25 | 141.462 | 31.775 | 78.912 |
| 2016-03-042:22:02 PM | 61.25 | 141.462 | 31.55 | 78.912 |
| 2016-03-042:22:06 PM | 61.25 | 141.35 | 31.438 | 78.912 |
| 2016-03-042:22:11 PM | 61.25 | 141.35 | 31.438 | 78.912 |
| 2016-03-042:22:15 PM | 61.25 | 141.35 | 31.438 | 78.912 |
| 2016-03-042:22:19 PM | 61.138 | 141.35 | 31.438 | 78.912 |
| 2016-03-042:22:23 PM | 61.138 | 141.238 | 31.438 | 78.912 |
| 2016-03-042:22:27 PM | 61.025 | 141.238 | 31.55 | 78.912 |
| 2016-03-042:22:31 PM | 61.138 | 141.238 | 31.662 | 78.912 |
| 2016-03-042:22:35 PM | 61.025 | 141.238 | 31.662 | 78.912 |
| 2016-03-042:22:39 PM | 60.912 | 141.238 | 31.662 | 78.912 |
| 2016-03-042:22:43 PM | 60.912 | 141.238 | 31.662 | 78.912 |
| 2016-03-042:22:47 PM | 61.025 | 141.238 | 31.775 | 78.912 |
| 2016-03-042:22:51 PM | 60.912 | 141.125 | 31.662 | 78.8 |
| 2016-03-042:22:55 PM | 60.912 | 141.125 | 31.662 | 78.912 |
| 2016-03-042:22:59 PM | 60.912 | 141.125 | 31.662 | 78.912 |
| 2016-03-042:23:03 PM | 60.912 | 141.125 | 31.775 | 78.912 |
| 2016-03-042:23:07 PM | 60.8 | 141.125 | 31.888 | 78.912 |
| 2016-03-042:23:12 PM | 60.912 | 141.012 | 31.888 | 78.912 |
| 2016-03-042:23:16 PM | 60.912 | 141.012 | 32 | 78.912 |
| 2016-03-042:23:20 PM | 60.912 | 141.012 | 32 | 78.912 |
| 2016-03-042:23:24 PM | 61.025 | 140.9 | 31.888 | 78.8 |
| 2016-03-042:23:28 PM | 60.912 | 140.9 | 32 | 78.912 |
| 2016-03-042:23:32 PM | 60.912 | 140.788 | 31.888 | 78.912 |
| 2016-03-042:23:36 PM | 61.025 | 140.788 | 31.888 | 78.912 |
| 2016-03-042:23:40 PM | 60.912 | 140.675 | 32 | 78.912 |
| 2016-03-042:23:44 PM | 61.025 | 140.675 | 32 | 78.8 |
| 2016-03-042:23:48 PM | 61.025 | 140.675 | 31.888 | 78.8 |
| 2016-03-042:23:52 PM | 60.912 | 140.675 | 32 | 78.8 |
| 2016-03-042:23:56 PM | 60.912 | 140.562 | 32.112 | 78.8 |
| 2016-03-042:24:00 PM | 60.912 | 140.562 | 32.112 | 78.8 |
| 2016-03-042:24:04 PM | 60.912 | 140.562 | 32.225 | 78.8 |
| 2016-03-042:24:08 PM | 60.912 | 140.562 | 32.225 | 78.8 |
| 2016-03-042:24:12 PM | 60.8 | 140.45 | 32.225 | 78.8 |
| 2016-03-042:24:17 PM | 60.8 | 140.562 | 32.338 | 78.8 |
| 2016-03-042:24:21 PM | 60.8 | 140.45 | 32.338 | 78.8 |
| 2016-03-042:24:25 PM | 60.8 | 140.45 | 32.225 | 78.8 |
| 2016-03-042:24:29 PM | 60.8 | 140.45 | 32.112 | 78.8 |
| 2016-03-042:24:33 PM | 60.8 | 140.45 | 32 | 78.8 |
| 2016-03-042:24:37 PM | 60.8 | 140.45 | 31.888 | 78.8 |
| 2016-03-042:24:41 PM | 60.912 | 140.45 | 31.888 | 78.8 |
| 2016-03-042:24:45 PM | 60.8 | 140.45 | 31.775 | 78.8 |
| 2016-03-042:24:49 PM | 60.8 | 140.45 | 31.888 | 78.8 |
| 2016-03-042:24:53 PM | 60.8 | 140.45 | 31.775 | 78.912 |
| 2016-03-042:24:57 PM | 60.912 | 140.45 | 31.662 | 78.912 |
| 2016-03-042:25:01 PM | 60.8 | 140.338 | 31.662 | 78.8 |
| 2016-03-042:25:05 PM | 60.912 | 140.338 | 31.662 | 78.8 |
| 2016-03-042:25:09 PM | 61.025 | 140.338 | 31.662 | 78.912 |
| 2016-03-042:25:13 PM | 61.025 | 140.225 | 31.775 | 78.8 |
| 2016-03-042:25:18 PM | 61.025 | 140.225 | 31.775 | 78.8 |
| 2016-03-042:25:22 PM | 61.025 | 140.112 | 31.662 | 78.8 |
| 2016-03-042:25:26 PM | 61.138 | 140.112 | 31.662 | 78.8 |
| 2016-03-042:25:30 PM | 61.138 | 140.112 | 31.55 | 78.8 |
| 2016-03-042:25:34 PM | 61.138 | 140 | 31.55 | 78.8 |
| 2016-03-042:25:38 PM | 61.138 | 139.888 | 31.55 | 78.912 |
| 2016-03-042:25:42 PM | 61.138 | 140 | 31.662 | 78.912 |
| 2016-03-042:25:46 PM | 61.138 | 139.888 | 31.662 | 78.8 |
| 2016-03-042:25:50 PM | 61.138 | 139.888 | 31.775 | 78.912 |
| 2016-03-042:25:54 PM | 61.138 | 139.888 | 31.775 | 78.8 |
| 2016-03-042:25:58 PM | 61.138 | 139.775 | 31.775 | 78.912 |
| 2016-03-042:26:02 PM | 61.138 | 139.775 | 31.888 | 78.8 |
| 2016-03-042:26:06 PM | 61.025 | 139.662 | 31.888 | 78.8 |
| 2016-03-042:26:10 PM | 61.025 | 139.662 | 31.888 | 78.8 |
| 2016-03-042:26:14 PM | 61.025 | 139.662 | 31.888 | 78.8 |
| 2016-03-042:26:19 PM | 61.025 | 139.55 | 31.888 | 78.8 |
| 2016-03-042:26:23 PM | 61.025 | 139.55 | 31.888 | 78.8 |
| 2016-03-042:26:27 PM | 61.025 | 139.438 | 31.888 | 78.8 |
| 2016-03-042:26:31 PM | 61.025 | 139.438 | 31.888 | 78.912 |
| 2016-03-042:26:35 PM | 60.912 | 139.438 | 32 | 78.8 |
| 2016-03-042:26:39 PM | 60.912 | 139.325 | 32 | 78.8 |
| 2016-03-042:26:43 PM | 60.912 | 139.325 | 31.888 | 78.8 |
| 2016-03-042:26:47 PM | 60.912 | 139.325 | 31.775 | 78.8 |
| 2016-03-042:26:51 PM | 60.8 | 139.212 | 31.775 | 78.8 |
| 2016-03-042:26:55 PM | 60.8 | 139.212 | 31.662 | 78.8 |
| 2016-03-042:26:59 PM | 60.688 | 139.212 | 31.662 | 78.8 |
| 2016-03-042:27:03 PM | 60.688 | 139.1 | 31.55 | 78.8 |
| 2016-03-042:27:07 PM | 60.688 | 139.1 | 31.55 | 78.8 |
| 2016-03-042:27:12 PM | 60.688 | 139.1 | 31.55 | 78.8 |
| 2016-03-042:27:16 PM | 60.688 | 138.988 | 31.55 | 78.8 |
| 2016-03-042:27:20 PM | 60.688 | 138.988 | 31.662 | 78.8 |
| 2016-03-042:27:24 PM | 60.688 | 138.988 | 31.662 | 78.8 |
| 2016-03-042:27:28 PM | 60.688 | 138.988 | 31.888 | 78.8 |
| 2016-03-042:27:32 PM | 60.8 | 138.988 | 31.775 | 78.8 |
| 2016-03-042:27:36 PM | 60.688 | 138.875 | 31.888 | 78.8 |
| 2016-03-042:27:40 PM | 60.688 | 138.875 | 31.888 | 78.8 |
| 2016-03-042:27:44 PM | 60.688 | 138.875 | 31.662 | 78.8 |
| 2016-03-042:27:48 PM | 60.688 | 138.875 | 31.662 | 78.8 |
| 2016-03-042:27:52 PM | 60.688 | 138.762 | 31.55 | 78.8 |
| 2016-03-042:27:56 PM | 60.688 | 138.762 | 31.55 | 78.8 |
| 2016-03-042:28:00 PM | 60.688 | 138.762 | 31.55 | 78.8 |
| 2016-03-042:28:04 PM | 60.575 | 138.762 | 31.55 | 78.8 |
| 2016-03-042:28:09 PM | 60.688 | 138.762 | 31.55 | 78.8 |
| 2016-03-042:28:13 PM | 60.575 | 138.65 | 31.662 | 78.8 |
| 2016-03-042:28:17 PM | 60.575 | 138.65 | 31.662 | 78.8 |
| 2016-03-042:28:21 PM | 60.462 | 138.65 | 31.662 | 78.8 |
| 2016-03-042:28:25 PM | 60.462 | 138.65 | 31.55 | 78.8 |
| 2016-03-042:28:29 PM | 60.462 | 138.65 | 31.325 | 78.688 |
| 2016-03-042:28:33 PM | 60.462 | 138.65 | 31.325 | 78.688 |
| 2016-03-042:28:37 PM | 60.35 | 138.65 | 31.212 | 78.688 |
| 2016-03-042:28:41 PM | 60.35 | 138.538 | 31.212 | 78.8 |
| 2016-03-042:28:45 PM | 60.35 | 138.65 | 31.1 | 78.8 |
| 2016-03-042:28:49 PM | 60.35 | 138.538 | 31.212 | 78.8 |
| 2016-03-042:28:53 PM | 60.238 | 138.538 | 31.212 | 78.8 |
| 2016-03-042:28:57 PM | 60.238 | 138.425 | 31.1 | 78.688 |
| 2016-03-042:29:01 PM | 60.238 | 138.425 | 31.212 | 78.688 |
| 2016-03-042:29:06 PM | 60.125 | 138.425 | 31.212 | 78.688 |
| 2016-03-042:29:10 PM | 60.125 | 138.425 | 31.212 | 78.688 |
| 2016-03-042:29:14 PM | 60.012 | 138.425 | 31.1 | 78.688 |
| 2016-03-042:29:18 PM | 60.012 | 138.425 | 30.988 | 78.688 |
| 2016-03-042:29:22 PM | 59.9 | 138.312 | 30.988 | 78.8 |
| 2016-03-042:29:26 PM | 60.012 | 138.312 | 31.1 | 78.688 |
| 2016-03-042:29:30 PM | 59.9 | 138.312 | 31.1 | 78.8 |
| 2016-03-042:29:34 PM | 59.9 | 138.312 | 31.212 | 78.688 |
| 2016-03-042:29:38 PM | 59.9 | 138.2 | 31.1 | 78.688 |
| 2016-03-042:29:42 PM | 59.9 | 138.2 | 31.1 | 78.688 |
| 2016-03-042:29:46 PM | 59.9 | 138.2 | 30.988 | 78.8 |
| 2016-03-042:29:50 PM | 59.9 | 138.088 | 30.988 | 78.688 |
| 2016-03-042:29:54 PM | 59.9 | 138.088 | 30.988 | 78.688 |
| 2016-03-042:29:58 PM | 59.9 | 138.088 | 30.875 | 78.688 |
| 2016-03-042:30:02 PM | 59.9 | 138.088 | 30.762 | 78.688 |
| 2016-03-042:30:07 PM | 59.9 | 138.088 | 30.762 | 78.688 |
| 2016-03-042:30:11 PM | 60.012 | 137.975 | 30.762 | 78.688 |
| 2016-03-042:30:15 PM | 60.012 | 137.975 | 30.538 | 78.688 |
| 2016-03-042:30:19 PM | 60.012 | 137.975 | 30.425 | 78.688 |
| 2016-03-042:30:23 PM | 60.012 | 137.862 | 30.425 | 78.688 |
| 2016-03-042:30:27 PM | 60.012 | 137.862 | 30.425 | 78.688 |
| 2016-03-042:30:31 PM | 60.012 | 137.862 | 30.425 | 78.688 |
| 2016-03-042:30:35 PM | 60.012 | 137.75 | 30.425 | 78.688 |
| 2016-03-042:30:39 PM | 59.9 | 137.75 | 30.538 | 78.688 |
| 2016-03-042:30:43 PM | 59.9 | 137.75 | 30.538 | 78.688 |
| 2016-03-042:30:47 PM | 59.9 | 137.638 | 30.65 | 78.688 |
| 2016-03-042:30:51 PM | 59.9 | 137.525 | 30.762 | 78.688 |
| 2016-03-042:30:55 PM | 59.9 | 137.525 | 30.875 | 78.688 |
| 2016-03-042:30:59 PM | 59.9 | 137.412 | 30.762 | 78.688 |
| 2016-03-042:31:03 PM | 60.012 | 137.412 | 30.875 | 78.688 |
| 2016-03-042:31:08 PM | 60.012 | 137.3 | 30.762 | 78.688 |
| 2016-03-042:31:12 PM | 59.9 | 137.3 | 30.65 | 78.688 |
| 2016-03-042:31:16 PM | 59.9 | 137.188 | 30.538 | 78.688 |
| 2016-03-042:31:20 PM | 59.9 | 137.188 | 30.425 | 78.688 |
| 2016-03-042:31:24 PM | 59.9 | 137.075 | 30.312 | 78.688 |
| 2016-03-042:31:28 PM | 59.9 | 136.962 | 30.2 | 78.688 |
| 2016-03-042:31:32 PM | 59.9 | 136.85 | 30.2 | 78.688 |
| 2016-03-042:31:36 PM | 59.788 | 136.738 | 30.2 | 78.688 |
| 2016-03-042:31:40 PM | 59.9 | 136.625 | 30.2 | 78.688 |
| 2016-03-042:31:44 PM | 59.788 | 136.512 | 30.2 | 78.688 |
| 2016-03-042:31:48 PM | 59.788 | 136.4 | 30.312 | 78.688 |
| 2016-03-042:31:52 PM | 59.788 | 136.288 | 30.312 | 78.688 |
| 2016-03-042:31:56 PM | 59.788 | 136.175 | 30.425 | 78.688 |
| 2016-03-042:32:00 PM | 59.788 | 136.062 | 30.538 | 78.688 |
| 2016-03-042:32:04 PM | 59.788 | 135.95 | 30.65 | 78.575 |
| 2016-03-042:32:09 PM | 59.788 | 135.838 | 30.762 | 78.688 |
| 2016-03-042:32:13 PM | 59.788 | 135.838 | 30.875 | 78.688 |
| 2016-03-042:32:17 PM | 59.675 | 135.725 | 30.875 | 78.688 |
| 2016-03-042:32:21 PM | 59.788 | 135.612 | 30.875 | 78.688 |
| 2016-03-042:32:25 PM | 59.675 | 135.612 | 30.875 | 78.575 |
| 2016-03-042:32:29 PM | 59.788 | 135.5 | 30.875 | 78.688 |
| 2016-03-042:32:33 PM | 59.788 | 135.388 | 30.762 | 78.575 |
| 2016-03-042:32:37 PM | 59.788 | 135.275 | 30.762 | 78.575 |
| 2016-03-042:32:41 PM | 59.788 | 135.162 | 30.762 | 78.575 |
| 2016-03-042:32:45 PM | 59.788 | 135.05 | 30.762 | 78.575 |
| 2016-03-042:32:49 PM | 59.788 | 135.05 | 30.762 | 78.575 |
| 2016-03-042:32:53 PM | 59.788 | 134.938 | 30.762 | 78.575 |
| 2016-03-042:32:57 PM | 59.788 | 134.825 | 30.875 | 78.575 |
| 2016-03-042:33:01 PM | 59.675 | 134.825 | 30.875 | 78.575 |
| 2016-03-042:33:05 PM | 59.788 | 134.712 | 30.988 | 78.575 |
| 2016-03-042:33:10 PM | 59.788 | 134.712 | 31.1 | 78.575 |
| 2016-03-042:33:14 PM | 59.788 | 134.6 | 31.212 | 78.575 |
| 2016-03-042:33:18 PM | 59.788 | 134.6 | 31.212 | 78.575 |
| 2016-03-042:33:22 PM | 59.788 | 134.488 | 31.325 | 78.575 |
| 2016-03-042:33:26 PM | 59.788 | 134.488 | 31.438 | 78.575 |
| 2016-03-042:33:30 PM | 59.9 | 134.375 | 31.438 | 78.575 |
| 2016-03-042:33:34 PM | 59.9 | 134.375 | 31.438 | 78.575 |
| 2016-03-042:33:38 PM | 60.012 | 134.262 | 31.212 | 78.575 |
| 2016-03-042:33:42 PM | 60.012 | 134.15 | 30.988 | 78.575 |
| 2016-03-042:33:46 PM | 60.125 | 134.15 | 30.875 | 78.575 |
| 2016-03-042:33:50 PM | 60.125 | 134.038 | 30.875 | 78.575 |
| 2016-03-042:33:54 PM | 60.238 | 133.925 | 30.762 | 78.575 |
| 2016-03-042:33:58 PM | 60.238 | 133.925 | 30.875 | 78.575 |
| 2016-03-042:34:02 PM | 60.238 | 133.925 | 30.875 | 78.575 |
| 2016-03-042:34:07 PM | 60.238 | 133.812 | 30.875 | 78.575 |
| 2016-03-042:34:11 PM | 60.238 | 133.7 | 30.875 | 78.575 |
| 2016-03-042:34:15 PM | 60.238 | 133.588 | 30.988 | 78.575 |
| 2016-03-042:34:19 PM | 60.238 | 133.475 | 30.988 | 78.575 |
| 2016-03-042:34:23 PM | 60.238 | 133.475 | 30.988 | 78.575 |
| 2016-03-042:34:27 PM | 60.238 | 133.362 | 31.1 | 78.575 |
| 2016-03-042:34:31 PM | 60.238 | 133.25 | 31.1 | 78.575 |
| 2016-03-042:34:35 PM | 60.238 | 133.25 | 31.1 | 78.575 |
| 2016-03-042:34:39 PM | 60.238 | 133.138 | 31.1 | 78.575 |
| 2016-03-042:34:43 PM | 60.238 | 133.138 | 31.212 | 78.462 |
| 2016-03-042:34:47 PM | 60.238 | 133.138 | 31.212 | 78.575 |
| 2016-03-042:34:51 PM | 60.125 | 133.025 | 31.212 | 78.575 |
| 2016-03-042:34:55 PM | 60.238 | 133.025 | 31.325 | 78.462 |
| 2016-03-042:34:59 PM | 60.125 | 133.025 | 31.438 | 78.462 |
| 2016-03-042:35:03 PM | 60.125 | 133.025 | 31.438 | 78.462 |
| 2016-03-042:35:07 PM | 60.125 | 132.912 | 31.325 | 78.462 |
| 2016-03-042:35:12 PM | 60.238 | 132.8 | 31.325 | 78.462 |
| 2016-03-042:35:16 PM | 60.238 | 132.8 | 31.438 | 78.462 |
| 2016-03-042:35:20 PM | 60.238 | 132.8 | 31.438 | 78.462 |
| 2016-03-042:35:24 PM | 60.238 | 132.8 | 31.55 | 78.462 |
| 2016-03-042:35:28 PM | 60.238 | 132.688 | 31.55 | 78.462 |
| 2016-03-042:35:32 PM | 60.35 | 132.688 | 31.438 | 78.462 |
| 2016-03-042:35:36 PM | 60.35 | 132.688 | 31.438 | 78.462 |
| 2016-03-042:35:40 PM | 60.35 | 132.688 | 31.438 | 78.462 |
| 2016-03-042:35:44 PM | 60.35 | 132.688 | 31.55 | 78.462 |
| 2016-03-042:35:48 PM | 60.35 | 132.688 | 31.55 | 78.462 |
| 2016-03-042:35:52 PM | 60.35 | 132.688 | 31.662 | 78.462 |
| 2016-03-042:35:56 PM | 60.35 | 132.688 | 31.775 | 78.462 |
| 2016-03-042:36:00 PM | 60.462 | 132.688 | 31.888 | 78.462 |
| 2016-03-042:36:04 PM | 60.462 | 132.688 | 31.888 | 78.462 |
| 2016-03-042:36:09 PM | 60.35 | 132.688 | 32 | 78.462 |
| 2016-03-042:36:13 PM | 60.35 | 132.575 | 31.888 | 78.462 |
| 2016-03-042:36:17 PM | 60.462 | 132.575 | 31.888 | 78.462 |
| 2016-03-042:36:21 PM | 60.35 | 132.575 | 31.662 | 78.462 |
| 2016-03-042:36:25 PM | 60.35 | 132.462 | 31.438 | 78.462 |
| 2016-03-042:36:29 PM | 60.462 | 132.35 | 31.438 | 78.462 |
| 2016-03-042:36:33 PM | 60.462 | 132.35 | 31.325 | 78.462 |
| 2016-03-042:36:37 PM | 60.462 | 132.35 | 31.438 | 78.462 |
| 2016-03-042:36:41 PM | 60.688 | 132.238 | 31.438 | 78.462 |
| 2016-03-042:36:45 PM | 60.575 | 132.238 | 31.438 | 78.462 |
| 2016-03-042:36:49 PM | 60.688 | 132.238 | 31.438 | 78.462 |
| 2016-03-042:36:53 PM | 60.8 | 132.125 | 31.438 | 78.462 |
| 2016-03-042:36:57 PM | 60.8 | 132.125 | 31.438 | 78.462 |
| 2016-03-042:37:02 PM | 60.912 | 132.012 | 31.438 | 78.462 |
| 2016-03-042:37:06 PM | 60.8 | 132.012 | 31.438 | 78.462 |
| 2016-03-042:37:10 PM | 60.8 | 132.012 | 31.438 | 78.462 |
| 2016-03-042:37:14 PM | 60.912 | 131.9 | 31.55 | 78.462 |
| 2016-03-042:37:18 PM | 60.8 | 131.9 | 31.55 | 78.462 |
| 2016-03-042:37:22 PM | 60.8 | 131.9 | 31.662 | 78.462 |
| 2016-03-042:37:26 PM | 60.8 | 131.9 | 31.775 | 78.462 |
| 2016-03-042:37:30 PM | 60.8 | 131.9 | 31.888 | 78.35 |
| 2016-03-042:37:34 PM | 60.8 | 131.788 | 31.888 | 78.35 |
| 2016-03-042:37:38 PM | 60.8 | 131.788 | 31.888 | 78.462 |
| 2016-03-042:37:42 PM | 60.8 | 131.788 | 31.888 | 78.35 |
| 2016-03-042:37:46 PM | 60.8 | 131.788 | 31.888 | 78.35 |
| 2016-03-042:37:50 PM | 60.8 | 131.675 | 31.775 | 78.35 |
| 2016-03-042:37:54 PM | 60.8 | 131.675 | 31.775 | 78.35 |
| 2016-03-042:37:58 PM | 60.8 | 131.675 | 31.775 | 78.462 |
| 2016-03-042:38:03 PM | 60.8 | 131.562 | 31.775 | 78.462 |
| 2016-03-042:38:07 PM | 60.8 | 131.562 | 32 | 78.35 |
| 2016-03-042:38:11 PM | 60.8 | 131.562 | 32 | 78.35 |
| 2016-03-042:38:15 PM | 60.912 | 131.45 | 32.112 | 78.35 |
| 2016-03-042:38:19 PM | 60.912 | 131.45 | 32.225 | 78.35 |
| 2016-03-042:38:23 PM | 60.912 | 131.338 | 32.338 | 78.35 |
| 2016-03-042:38:27 PM | 60.912 | 131.338 | 32.45 | 78.35 |
| 2016-03-042:38:31 PM | 60.8 | 131.225 | 32.45 | 78.35 |
| 2016-03-042:38:35 PM | 60.912 | 131.225 | 32.562 | 78.35 |
| 2016-03-042:38:39 PM | 60.912 | 131.225 | 32.45 | 78.35 |
| 2016-03-042:38:43 PM | 60.912 | 131.112 | 32.338 | 78.35 |
| 2016-03-042:38:47 PM | 60.912 | 131 | 32.338 | 78.35 |
| 2016-03-042:38:51 PM | 60.912 | 131 | 32.225 | 78.35 |
| 2016-03-042:38:55 PM | 60.912 | 130.887 | 32.225 | 78.35 |
| 2016-03-042:38:59 PM | 60.912 | 130.775 | 32.225 | 78.35 |
| 2016-03-042:39:07 PM | 60.912 | 130.662 | 32.225 | 78.35 |
| 2016-03-042:39:11 PM | 60.8 | 130.662 | 32.225 | 78.35 |
| 2016-03-042:39:15 PM | 60.8 | 130.55 | 32.338 | 78.35 |
| 2016-03-042:39:19 PM | 60.688 | 130.438 | 32.338 | 78.35 |
| 2016-03-042:39:23 PM | 60.688 | 130.325 | 32.338 | 78.35 |
| 2016-03-042:39:27 PM | 60.688 | 130.325 | 32.338 | 78.35 |
| 2016-03-042:39:31 PM | 60.688 | 130.212 | 32.225 | 78.35 |
| 2016-03-042:39:35 PM | 60.575 | 130.1 | 32 | 78.35 |
| 2016-03-042:39:39 PM | 60.688 | 129.988 | 32 | 78.35 |
| 2016-03-042:39:43 PM | 60.575 | 129.875 | 31.888 | 78.35 |
| 2016-03-042:39:47 PM | 60.575 | 129.762 | 31.775 | 78.35 |
| 2016-03-042:39:52 PM | 60.575 | 129.762 | 31.662 | 78.35 |
| 2016-03-042:39:56 PM | 60.575 | 129.538 | 31.662 | 78.35 |
| 2016-03-042:40:00 PM | 60.575 | 129.425 | 31.662 | 78.35 |
| 2016-03-042:40:04 PM | 60.688 | 129.312 | 31.662 | 78.35 |
| 2016-03-042:40:08 PM | 60.575 | 129.2 | 31.662 | 78.35 |
| 2016-03-042:40:12 PM | 60.575 | 129.088 | 31.775 | 78.35 |
| 2016-03-042:40:16 PM | 60.575 | 128.863 | 31.662 | 78.35 |
| 2016-03-042:40:20 PM | 60.575 | 128.75 | 31.662 | 78.35 |
| 2016-03-042:40:24 PM | 60.575 | 128.525 | 31.662 | 78.238 |
| 2016-03-042:40:28 PM | 60.575 | 128.412 | 31.55 | 78.35 |
| 2016-03-042:40:32 PM | 60.462 | 128.3 | 31.55 | 78.35 |
| 2016-03-042:40:36 PM | 60.462 | 128.188 | 31.438 | 78.35 |
| 2016-03-042:40:40 PM | 60.462 | 127.962 | 31.325 | 78.238 |
| 2016-03-042:40:44 PM | 60.462 | 127.85 | 31.212 | 78.238 |
| 2016-03-042:40:48 PM | 60.35 | 127.738 | 31.212 | 78.238 |
| 2016-03-042:40:53 PM | 60.35 | 127.625 | 31.212 | 78.238 |
| 2016-03-042:40:57 PM | 60.35 | 127.4 | 31.1 | 78.238 |
| 2016-03-042:41:01 PM | 60.35 | 127.288 | 30.988 | 78.238 |
| 2016-03-042:41:05 PM | 60.238 | 127.175 | 30.762 | 78.35 |
| 2016-03-042:41:09 PM | 60.238 | 126.95 | 30.425 | 78.238 |
| 2016-03-042:41:13 PM | 60.238 | 126.838 | 30.312 | 78.238 |
| 2016-03-042:41:17 PM | 60.238 | 126.612 | 30.2 | 78.238 |
| 2016-03-042:41:21 PM | 60.238 | 126.5 | 30.088 | 78.238 |
| 2016-03-042:41:25 PM | 60.125 | 126.388 | 29.975 | 78.238 |
| 2016-03-042:41:29 PM | 60.238 | 126.163 | 29.862 | 78.238 |
| 2016-03-042:41:33 PM | 60.125 | 126.05 | 29.75 | 78.238 |
| 2016-03-042:41:37 PM | 60.125 | 125.938 | 29.638 | 78.238 |
| 2016-03-042:41:41 PM | 60.125 | 125.712 | 29.525 | 78.238 |
| 2016-03-042:41:45 PM | 60.125 | 125.6 | 29.412 | 78.238 |
| 2016-03-042:41:49 PM | 60.125 | 125.488 | 29.412 | 78.238 |
| 2016-03-042:41:53 PM | 60.125 | 125.262 | 29.412 | 78.238 |
| 2016-03-042:41:58 PM | 60.125 | 125.15 | 29.412 | 78.238 |
| 2016-03-042:42:02 PM | 60.125 | 125.038 | 29.525 | 78.238 |
| 2016-03-042:42:06 PM | 60.125 | 124.925 | 29.525 | 78.238 |
| 2016-03-042:42:10 PM | 60.125 | 124.812 | 29.525 | 78.238 |
| 2016-03-042:42:14 PM | 60.125 | 124.7 | 29.525 | 78.238 |
| 2016-03-042:42:18 PM | 60.125 | 124.588 | 29.525 | 78.238 |
| 2016-03-042:42:22 PM | 60.012 | 124.475 | 29.525 | 78.238 |
| 2016-03-042:42:26 PM | 60.012 | 124.362 | 29.638 | 78.238 |
| 2016-03-042:42:30 PM | 60.012 | 124.138 | 29.75 | 78.238 |
| 2016-03-042:42:34 PM | 60.012 | 124.025 | 29.75 | 78.125 |
| 2016-03-042:42:38 PM | 60.012 | 124.025 | 29.75 | 78.238 |
| 2016-03-042:42:42 PM | 59.9 | 123.8 | 29.862 | 78.238 |
| 2016-03-042:42:46 PM | 59.9 | 123.688 | 29.862 | 78.238 |
| 2016-03-042:42:51 PM | 59.9 | 123.575 | 29.862 | 78.238 |
| 2016-03-042:42:55 PM | 59.9 | 123.462 | 29.975 | 78.238 |
| 2016-03-042:42:59 PM | 59.788 | 123.35 | 29.975 | 78.238 |
| 2016-03-042:43:03 PM | 59.788 | 123.238 | 29.862 | 78.238 |
| 2016-03-042:43:07 PM | 59.788 | 123.125 | 29.975 | 78.125 |
| 2016-03-042:43:11 PM | 59.788 | 123.012 | 29.975 | 78.238 |
| 2016-03-042:43:15 PM | 59.788 | 122.9 | 29.975 | 78.238 |
| 2016-03-042:43:19 PM | 59.788 | 122.788 | 29.975 | 78.238 |
| 2016-03-042:43:23 PM | 59.9 | 122.562 | 29.975 | 78.125 |
| 2016-03-042:43:27 PM | 59.9 | 122.45 | 30.088 | 78.238 |
| 2016-03-042:43:31 PM | 59.9 | 122.338 | 30.2 | 78.238 |
| 2016-03-042:43:35 PM | 59.9 | 122.225 | 30.2 | 78.125 |
| 2016-03-042:43:39 PM | 60.012 | 122 | 30.088 | 78.125 |
| 2016-03-042:43:43 PM | 60.012 | 121.888 | 30.088 | 78.238 |
| 2016-03-042:43:47 PM | 60.125 | 121.663 | 30.088 | 78.238 |
| 2016-03-042:43:52 PM | 60.238 | 121.55 | 30.088 | 78.238 |
| 2016-03-042:43:56 PM | 60.238 | 121.325 | 29.862 | 78.238 |
| 2016-03-042:44:00 PM | 60.35 | 121.212 | 29.75 | 78.125 |
| 2016-03-042:44:04 PM | 60.35 | 120.988 | 29.638 | 78.238 |
| 2016-03-042:44:08 PM | 60.35 | 120.875 | 29.412 | 78.238 |
| 2016-03-042:44:12 PM | 60.462 | 120.65 | 29.3 | 78.125 |
| 2016-03-042:44:16 PM | 60.462 | 120.425 | 29.188 | 78.125 |
| 2016-03-042:44:20 PM | 60.462 | 120.2 | 28.962 | 78.125 |
| 2016-03-042:44:24 PM | 60.575 | 120.088 | 28.738 | 78.238 |
| 2016-03-042:44:28 PM | 60.575 | 119.862 | 28.738 | 78.125 |
| 2016-03-042:44:32 PM | 60.575 | 119.75 | 28.738 | 78.125 |
| 2016-03-042:44:36 PM | 60.462 | 119.525 | 28.738 | 78.125 |
| 2016-03-042:44:40 PM | 60.462 | 119.3 | 28.738 | 78.125 |
| 2016-03-042:44:44 PM | 60.35 | 119.188 | 28.85 | 78.125 |
| 2016-03-042:44:48 PM | 60.35 | 119.075 | 28.85 | 78.125 |
| 2016-03-042:44:52 PM | 60.238 | 118.85 | 28.85 | 78.125 |
| 2016-03-042:44:57 PM | 60.238 | 118.738 | 28.738 | 78.012 |
| 2016-03-042:45:01 PM | 60.125 | 118.625 | 28.625 | 78.125 |
| 2016-03-042:45:05 PM | 60.125 | 118.512 | 28.625 | 78.125 |
| 2016-03-042:45:09 PM | 60.012 | 118.4 | 28.625 | 78.125 |
| 2016-03-042:45:13 PM | 60.012 | 118.288 | 28.738 | 78.125 |
| 2016-03-042:45:17 PM | 59.9 | 118.062 | 28.738 | 78.125 |
| 2016-03-042:45:21 PM | 59.9 | 117.95 | 28.625 | 78.125 |
| 2016-03-042:45:25 PM | 59.788 | 117.838 | 28.738 | 78.125 |
| 2016-03-042:45:29 PM | 59.788 | 117.725 | 28.738 | 78.125 |
| 2016-03-042:45:33 PM | 59.788 | 117.612 | 28.738 | 78.125 |
| 2016-03-042:45:37 PM | 59.788 | 117.5 | 28.85 | 78.125 |
| 2016-03-042:45:41 PM | 59.788 | 117.388 | 28.962 | 78.125 |
| 2016-03-042:45:45 PM | 59.788 | 117.275 | 29.075 | 78.125 |
| 2016-03-042:45:50 PM | 59.675 | 117.163 | 29.075 | 78.012 |
| 2016-03-042:45:54 PM | 59.675 | 117.163 | 29.3 | 78.125 |
| 2016-03-042:45:58 PM | 59.788 | 117.05 | 29.412 | 78.125 |
| 2016-03-042:46:02 PM | 59.788 | 116.938 | 29.525 | 78.125 |
| 2016-03-042:46:06 PM | 59.675 | 116.825 | 29.638 | 78.125 |
| 2016-03-042:46:10 PM | 59.788 | 116.825 | 29.75 | 78.125 |
| 2016-03-042:46:14 PM | 59.675 | 116.712 | 29.75 | 78.125 |
| 2016-03-042:46:18 PM | 59.675 | 116.6 | 29.75 | 78.012 |
| 2016-03-042:46:22 PM | 59.562 | 116.488 | 29.75 | 78.125 |
| 2016-03-042:46:26 PM | 59.562 | 116.375 | 29.638 | 78.012 |
| 2016-03-042:46:30 PM | 59.562 | 116.262 | 29.638 | 78.125 |
| 2016-03-042:46:34 PM | 59.562 | 116.262 | 29.75 | 78.012 |
| 2016-03-042:46:38 PM | 59.562 | 116.15 | 29.75 | 78.125 |
| 2016-03-042:46:42 PM | 59.562 | 116.038 | 29.862 | 78.012 |
| 2016-03-042:46:47 PM | 59.562 | 116.038 | 29.862 | 78.012 |
| 2016-03-042:46:51 PM | 59.562 | 115.925 | 29.975 | 78.012 |
| 2016-03-042:46:55 PM | 59.562 | 115.812 | 29.975 | 78.012 |
| 2016-03-042:46:59 PM | 59.45 | 115.812 | 29.975 | 78.012 |
| 2016-03-042:47:03 PM | 59.562 | 115.7 | 29.975 | 78.012 |
| 2016-03-042:47:07 PM | 59.562 | 115.588 | 29.975 | 78.012 |
| 2016-03-042:47:11 PM | 59.45 | 115.475 | 29.975 | 78.012 |
| 2016-03-042:47:15 PM | 59.45 | 115.362 | 29.75 | 78.012 |
| 2016-03-042:47:19 PM | 59.338 | 115.25 | 29.638 | 78.012 |
| 2016-03-042:47:23 PM | 59.338 | 115.25 | 29.525 | 78.012 |
| 2016-03-042:47:27 PM | 59.225 | 115.138 | 29.3 | 78.012 |
| 2016-03-042:47:31 PM | 59.225 | 115.138 | 29.3 | 78.012 |
| 2016-03-042:47:35 PM | 59.225 | 115.025 | 29.188 | 78.012 |
| 2016-03-042:47:40 PM | 59.112 | 115.025 | 29.188 | 78.012 |
| 2016-03-042:47:44 PM | 59.112 | 114.913 | 29.075 | 78.012 |
| 2016-03-042:47:48 PM | 59.112 | 114.913 | 29.075 | 78.012 |
| 2016-03-042:47:52 PM | 59 | 114.8 | 29.075 | 78.012 |
| 2016-03-042:47:56 PM | 58.888 | 114.8 | 28.962 | 78.012 |
| 2016-03-042:48:00 PM | 58.888 | 114.8 | 28.962 | 78.012 |
| 2016-03-042:48:04 PM | 58.888 | 114.688 | 28.962 | 78.012 |
| 2016-03-042:48:08 PM | 58.888 | 114.688 | 29.075 | 78.012 |
| 2016-03-042:48:12 PM | 58.888 | 114.688 | 29.188 | 78.012 |
| 2016-03-042:48:16 PM | 58.888 | 114.688 | 29.3 | 77.9 |
| 2016-03-042:48:20 PM | 58.888 | 114.688 | 29.3 | 77.9 |
| 2016-03-042:48:24 PM | 58.888 | 114.688 | 29.3 | 77.9 |
| 2016-03-042:48:28 PM | 58.888 | 114.575 | 29.3 | 77.9 |
| 2016-03-042:48:32 PM | 58.888 | 114.575 | 29.3 | 77.9 |
| 2016-03-042:48:36 PM | 58.775 | 114.575 | 29.3 | 77.9 |
| 2016-03-042:48:41 PM | 58.775 | 114.575 | 29.412 | 77.9 |
| 2016-03-042:48:45 PM | 58.888 | 114.575 | 29.412 | 77.9 |
| 2016-03-042:48:49 PM | 58.775 | 114.462 | 29.525 | 77.9 |
| 2016-03-042:48:53 PM | 58.775 | 114.575 | 29.525 | 77.9 |
| 2016-03-042:48:57 PM | 58.775 | 114.575 | 29.525 | 77.9 |
| 2016-03-042:49:01 PM | 58.775 | 114.575 | 29.638 | 77.9 |
| 2016-03-042:49:05 PM | 58.888 | 114.575 | 29.638 | 77.9 |
| 2016-03-042:49:09 PM | 58.888 | 114.575 | 29.75 | 77.9 |
| 2016-03-042:49:13 PM | 58.888 | 114.575 | 29.75 | 77.9 |
| 2016-03-042:49:17 PM | 59 | 114.575 | 29.975 | 77.9 |
| 2016-03-042:49:21 PM | 59 | 114.575 | 30.088 | 77.9 |
| 2016-03-042:49:25 PM | 59 | 114.688 | 30.088 | 77.9 |
| 2016-03-042:49:29 PM | 59 | 114.688 | 30.2 | 77.9 |
| 2016-03-042:49:33 PM | 59.112 | 114.575 | 30.2 | 77.9 |
| 2016-03-042:49:37 PM | 59.112 | 114.688 | 30.425 | 77.9 |
| 2016-03-042:49:42 PM | 59.112 | 114.688 | 30.425 | 77.9 |
| 2016-03-042:49:46 PM | 59.112 | 114.688 | 30.538 | 77.9 |
| 2016-03-042:49:50 PM | 59.225 | 114.688 | 30.65 | 77.9 |
| 2016-03-042:49:54 PM | 59.225 | 114.688 | 30.65 | 77.9 |
| 2016-03-042:49:58 PM | 59.225 | 114.688 | 30.762 | 77.9 |
| 2016-03-042:50:02 PM | 59.225 | 114.688 | 30.875 | 77.9 |
| 2016-03-042:50:06 PM | 59.225 | 114.688 | 30.988 | 77.9 |
| 2016-03-042:50:10 PM | 59.225 | 114.688 | 30.988 | 77.788 |
| 2016-03-042:50:14 PM | 59.225 | 114.575 | 31.1 | 77.9 |
| 2016-03-042:50:18 PM | 59.338 | 114.688 | 31.1 | 77.788 |
| 2016-03-042:50:22 PM | 59.338 | 114.575 | 31.1 | 77.788 |
| 2016-03-042:50:26 PM | 59.45 | 114.688 | 31.212 | 77.788 |
| 2016-03-042:50:30 PM | 59.45 | 114.575 | 31.212 | 77.788 |
| 2016-03-042:50:34 PM | 59.562 | 114.575 | 31.325 | 77.788 |
| 2016-03-042:50:38 PM | 59.562 | 114.575 | 31.325 | 77.9 |
| 2016-03-042:50:43 PM | 59.562 | 114.575 | 31.325 | 77.788 |
| 2016-03-042:50:47 PM | 59.675 | 114.462 | 31.212 | 77.788 |
| 2016-03-042:50:51 PM | 59.675 | 114.462 | 31.212 | 77.9 |
| 2016-03-042:50:55 PM | 59.675 | 114.35 | 31.212 | 77.788 |
| 2016-03-042:50:59 PM | 59.675 | 114.35 | 31.212 | 77.788 |
| 2016-03-042:51:03 PM | 59.675 | 114.35 | 31.325 | 77.788 |
| 2016-03-042:51:07 PM | 59.788 | 114.238 | 31.325 | 77.788 |
| 2016-03-042:51:11 PM | 59.675 | 114.238 | 31.438 | 77.788 |
| 2016-03-042:51:15 PM | 59.675 | 114.238 | 31.55 | 77.788 |
| 2016-03-042:51:19 PM | 59.675 | 114.125 | 31.55 | 77.788 |
| 2016-03-042:51:23 PM | 59.675 | 114.238 | 31.662 | 77.788 |
| 2016-03-042:51:27 PM | 59.675 | 114.125 | 31.662 | 77.788 |
| 2016-03-042:51:31 PM | 59.675 | 114.125 | 31.662 | 77.788 |
| 2016-03-042:51:35 PM | 59.675 | 114.125 | 31.55 | 77.788 |
| 2016-03-042:51:39 PM | 59.675 | 114.125 | 31.212 | 77.788 |
| 2016-03-042:51:43 PM | 59.675 | 114.012 | 30.875 | 77.788 |
| 2016-03-042:51:48 PM | 59.675 | 114.012 | 30.65 | 77.788 |
| 2016-03-042:51:52 PM | 59.675 | 114.012 | 30.538 | 77.788 |
| 2016-03-042:51:56 PM | 59.675 | 114.012 | 30.538 | 77.788 |
| 2016-03-042:52:00 PM | 59.675 | 114.012 | 30.538 | 77.788 |
| 2016-03-042:52:04 PM | 59.788 | 114.012 | 30.538 | 77.788 |
| 2016-03-042:52:08 PM | 59.788 | 114.012 | 30.65 | 77.788 |
| 2016-03-042:52:12 PM | 59.675 | 113.9 | 30.762 | 77.788 |
| 2016-03-042:52:16 PM | 59.675 | 113.9 | 30.762 | 77.788 |
| 2016-03-042:52:20 PM | 59.675 | 113.9 | 30.875 | 77.675 |
| 2016-03-042:52:24 PM | 59.675 | 113.9 | 30.875 | 77.675 |
| 2016-03-042:52:28 PM | 59.675 | 113.9 | 30.762 | 77.788 |
| 2016-03-042:52:32 PM | 59.675 | 113.788 | 30.538 | 77.675 |
| 2016-03-042:52:36 PM | 59.675 | 113.788 | 30.312 | 77.675 |
| 2016-03-042:52:40 PM | 59.675 | 113.788 | 30.2 | 77.675 |
| 2016-03-042:52:44 PM | 59.675 | 113.675 | 30.2 | 77.675 |
| 2016-03-042:52:49 PM | 59.675 | 113.675 | 30.312 | 77.675 |
| 2016-03-042:52:53 PM | 59.675 | 113.675 | 30.312 | 77.675 |
| 2016-03-042:52:57 PM | 59.675 | 113.675 | 30.2 | 77.675 |
| 2016-03-042:53:01 PM | 59.675 | 113.562 | 30.088 | 77.675 |
| 2016-03-042:53:05 PM | 59.675 | 113.675 | 29.975 | 77.675 |
| 2016-03-042:53:09 PM | 59.675 | 113.562 | 29.862 | 77.675 |
| 2016-03-042:53:13 PM | 59.675 | 113.562 | 29.862 | 77.675 |
| 2016-03-042:53:17 PM | 59.675 | 113.562 | 29.75 | 77.675 |
| 2016-03-042:53:21 PM | 59.562 | 113.562 | 29.75 | 77.675 |
| 2016-03-042:53:25 PM | 59.562 | 113.562 | 29.638 | 77.675 |
| 2016-03-042:53:29 PM | 59.675 | 113.45 | 29.525 | 77.675 |
| 2016-03-042:53:33 PM | 59.675 | 113.45 | 29.412 | 77.675 |
| 2016-03-042:53:37 PM | 59.562 | 113.45 | 29.412 | 77.675 |
| 2016-03-042:53:41 PM | 59.562 | 113.45 | 29.412 | 77.675 |
| 2016-03-042:53:45 PM | 59.562 | 113.45 | 29.412 | 77.675 |
| 2016-03-042:53:50 PM | 59.562 | 113.45 | 29.412 | 77.675 |
| 2016-03-042:53:54 PM | 59.45 | 113.45 | 29.525 | 77.675 |
| 2016-03-042:53:58 PM | 59.45 | 113.45 | 29.638 | 77.675 |
| 2016-03-042:54:02 PM | 59.45 | 113.45 | 29.75 | 77.675 |
| 2016-03-042:54:06 PM | 59.45 | 113.45 | 29.75 | 77.675 |
| 2016-03-042:54:10 PM | 59.338 | 113.45 | 29.75 | 77.675 |
| 2016-03-042:54:14 PM | 59.45 | 113.45 | 29.75 | 77.675 |
| 2016-03-042:54:18 PM | 59.45 | 113.338 | 29.638 | 77.675 |
| 2016-03-042:54:22 PM | 59.45 | 113.225 | 29.525 | 77.675 |
| 2016-03-042:54:26 PM | 59.45 | 113.338 | 29.412 | 77.675 |
| 2016-03-042:54:30 PM | 59.45 | 113.225 | 29.3 | 77.675 |
| 2016-03-042:54:34 PM | 59.45 | 113.225 | 29.188 | 77.675 |
| 2016-03-042:54:38 PM | 59.562 | 113.112 | 28.962 | 77.675 |
| 2016-03-042:54:42 PM | 59.45 | 113.112 | 28.962 | 77.675 |
| 2016-03-042:54:46 PM | 59.562 | 113.112 | 28.85 | 77.675 |
| 2016-03-042:54:50 PM | 59.562 | 113.112 | 28.738 | 77.675 |
| 2016-03-042:54:55 PM | 59.562 | 113 | 28.625 | 77.675 |
| 2016-03-042:54:59 PM | 59.562 | 112.888 | 28.512 | 77.675 |
| 2016-03-042:55:03 PM | 59.562 | 112.888 | 28.625 | 77.675 |
| 2016-03-042:55:07 PM | 59.562 | 112.775 | 28.738 | 77.675 |
| 2016-03-042:55:11 PM | 59.675 | 112.775 | 28.85 | 77.675 |
| 2016-03-042:55:15 PM | 59.675 | 112.775 | 28.962 | 77.675 |
| 2016-03-042:55:19 PM | 59.562 | 112.663 | 29.075 | 77.675 |
| 2016-03-042:55:23 PM | 59.675 | 112.663 | 29.188 | 77.675 |
| 2016-03-042:55:27 PM | 59.675 | 112.663 | 29.3 | 77.562 |
| 2016-03-042:55:31 PM | 59.675 | 112.663 | 29.412 | 77.675 |
| 2016-03-042:55:35 PM | 59.788 | 112.55 | 29.412 | 77.675 |
| 2016-03-042:55:39 PM | 59.675 | 112.55 | 29.525 | 77.675 |
| 2016-03-042:55:43 PM | 59.788 | 112.438 | 29.638 | 77.675 |
| 2016-03-042:55:47 PM | 59.788 | 112.438 | 29.525 | 77.562 |
| 2016-03-042:55:52 PM | 59.788 | 112.438 | 29.525 | 77.562 |
| 2016-03-042:55:56 PM | 59.788 | 112.325 | 29.525 | 77.562 |
| 2016-03-042:56:00 PM | 59.788 | 112.325 | 29.525 | 77.675 |
| 2016-03-042:56:04 PM | 59.788 | 112.212 | 29.638 | 77.562 |
| 2016-03-042:56:08 PM | 59.675 | 112.212 | 29.638 | 77.562 |
| 2016-03-042:56:12 PM | 59.788 | 112.1 | 29.75 | 77.675 |
| 2016-03-042:56:19 PM | 59.675 | 112.1 | 29.975 | 77.675 |
| 2016-03-042:56:23 PM | 59.675 | 111.988 | 29.975 | 77.675 |
| 2016-03-042:56:27 PM | 59.675 | 111.988 | 29.975 | 77.675 |
| 2016-03-042:56:31 PM | 59.675 | 111.875 | 29.862 | 77.562 |
| 2016-03-042:56:35 PM | 59.675 | 111.875 | 29.638 | 77.675 |
| 2016-03-042:56:39 PM | 59.675 | 111.762 | 29.525 | 77.562 |
| 2016-03-042:56:44 PM | 59.675 | 111.65 | 29.412 | 77.562 |
| 2016-03-042:56:48 PM | 59.675 | 111.65 | 29.3 | 77.562 |
| 2016-03-042:56:52 PM | 59.675 | 111.65 | 29.188 | 77.562 |
| 2016-03-042:56:56 PM | 59.562 | 111.538 | 29.075 | 77.562 |
| 2016-03-042:57:00 PM | 59.562 | 111.538 | 29.075 | 77.562 |
| 2016-03-042:57:04 PM | 59.45 | 111.538 | 28.962 | 77.562 |
| 2016-03-042:57:08 PM | 59.562 | 111.538 | 28.962 | 77.562 |
| 2016-03-042:57:12 PM | 59.45 | 111.538 | 29.075 | 77.562 |
| 2016-03-042:57:16 PM | 59.45 | 111.538 | 29.075 | 77.562 |
| 2016-03-042:57:20 PM | 59.45 | 111.538 | 29.188 | 77.562 |
| 2016-03-042:57:24 PM | 59.338 | 111.538 | 29.188 | 77.562 |
| 2016-03-042:57:28 PM | 59.338 | 111.538 | 29.188 | 77.562 |
| 2016-03-042:57:32 PM | 59.338 | 111.538 | 29.412 | 77.562 |
| 2016-03-042:57:36 PM | 59.338 | 111.538 | 29.412 | 77.562 |
| 2016-03-042:57:40 PM | 59.338 | 111.538 | 29.525 | 77.562 |
| 2016-03-042:57:45 PM | 59.338 | 111.538 | 29.525 | 77.562 |
| 2016-03-042:57:49 PM | 59.338 | 111.65 | 29.412 | 77.562 |
| 2016-03-042:57:53 PM | 59.338 | 111.65 | 29.412 | 77.562 |
| 2016-03-042:57:57 PM | 59.338 | 111.762 | 29.412 | 77.562 |
| 2016-03-042:58:01 PM | 59.338 | 111.762 | 29.412 | 77.562 |
| 2016-03-042:58:05 PM | 59.338 | 111.875 | 29.525 | 77.562 |
| 2016-03-042:58:09 PM | 59.338 | 111.875 | 29.638 | 77.562 |
| 2016-03-042:58:13 PM | 59.338 | 111.875 | 29.75 | 77.562 |
| 2016-03-042:58:17 PM | 59.338 | 111.988 | 29.75 | 77.562 |
| 2016-03-042:58:21 PM | 59.338 | 111.988 | 29.862 | 77.562 |
| 2016-03-042:58:25 PM | 59.338 | 112.1 | 29.975 | 77.562 |
| 2016-03-042:58:29 PM | 59.225 | 112.212 | 29.975 | 77.562 |
| 2016-03-042:58:33 PM | 59.225 | 112.212 | 30.088 | 77.562 |
| 2016-03-042:58:37 PM | 59.225 | 112.438 | 30.088 | 77.562 |
| 2016-03-042:58:42 PM | 59.225 | 112.438 | 30.088 | 77.562 |
| 2016-03-042:58:46 PM | 59.225 | 112.438 | 30.088 | 77.562 |
| 2016-03-042:58:50 PM | 59.112 | 112.55 | 30.088 | 77.562 |
| 2016-03-042:58:54 PM | 59.112 | 112.663 | 29.975 | 77.562 |
| 2016-03-042:58:58 PM | 59.112 | 112.663 | 29.975 | 77.562 |
| 2016-03-042:59:02 PM | 59.112 | 112.775 | 29.975 | 77.562 |
| 2016-03-042:59:06 PM | 59.225 | 112.888 | 29.975 | 77.562 |
| 2016-03-042:59:10 PM | 59.225 | 113 | 29.862 | 77.562 |
| 2016-03-042:59:14 PM | 59.225 | 113 | 29.975 | 77.562 |
| 2016-03-042:59:18 PM | 59.225 | 113.112 | 30.088 | 77.562 |
| 2016-03-042:59:22 PM | 59.225 | 113.225 | 30.088 | 77.562 |
| 2016-03-042:59:26 PM | 59.225 | 113.225 | 30.312 | 77.562 |
| 2016-03-042:59:30 PM | 59.225 | 113.338 | 30.312 | 77.562 |
| 2016-03-042:59:34 PM | 59.225 | 113.338 | 30.425 | 77.562 |
| 2016-03-042:59:38 PM | 59.225 | 113.45 | 30.425 | 77.562 |
| 2016-03-042:59:43 PM | 59.225 | 113.562 | 30.538 | 77.562 |
| 2016-03-042:59:47 PM | 59.225 | 113.562 | 30.65 | 77.562 |
| 2016-03-042:59:51 PM | 59.225 | 113.675 | 30.762 | 77.562 |
| 2016-03-042:59:55 PM | 59.225 | 113.675 | 30.762 | 77.562 |
| 2016-03-042:59:59 PM | 59.338 | 113.675 | 30.762 | 77.562 |
| 2016-03-043:00:03 PM | 59.338 | 113.675 | 30.762 | 77.562 |
| 2016-03-043:00:07 PM | 59.338 | 113.788 | 30.875 | 77.562 |
| 2016-03-043:00:11 PM | 59.338 | 113.9 | 30.875 | 77.562 |
| 2016-03-043:00:15 PM | 59.45 | 113.9 | 30.875 | 77.562 |
| 2016-03-043:00:19 PM | 59.338 | 113.9 | 30.875 | 77.562 |
| 2016-03-043:00:23 PM | 59.45 | 114.012 | 30.988 | 77.562 |
| 2016-03-043:00:27 PM | 59.45 | 114.012 | 30.988 | 77.562 |
| 2016-03-043:00:31 PM | 59.338 | 114.012 | 30.988 | 77.562 |
| 2016-03-043:00:35 PM | 59.45 | 114.012 | 30.988 | 77.562 |
| 2016-03-043:00:39 PM | 59.338 | 114.125 | 31.1 | 77.562 |
| 2016-03-043:00:44 PM | 59.45 | 114.125 | 31.1 | 77.562 |
| 2016-03-043:00:48 PM | 59.45 | 114.238 | 31.1 | 77.562 |
| 2016-03-043:00:52 PM | 59.45 | 114.238 | 31.212 | 77.562 |
| 2016-03-043:00:56 PM | 59.45 | 114.35 | 31.212 | 77.562 |
| 2016-03-043:01:00 PM | 59.45 | 114.35 | 31.325 | 77.45 |
| 2016-03-043:01:04 PM | 59.45 | 114.35 | 31.325 | 77.562 |
| 2016-03-043:01:08 PM | 59.45 | 114.462 | 31.438 | 77.45 |
| 2016-03-043:01:12 PM | 59.45 | 114.575 | 31.55 | 77.45 |
| 2016-03-043:01:16 PM | 59.338 | 114.575 | 31.55 | 77.45 |
| 2016-03-043:01:20 PM | 59.45 | 114.688 | 31.55 | 77.45 |
| 2016-03-043:01:24 PM | 59.338 | 114.688 | 31.55 | 77.45 |
| 2016-03-043:01:28 PM | 59.45 | 114.8 | 31.438 | 77.562 |
| 2016-03-043:01:32 PM | 59.45 | 114.8 | 31.325 | 77.45 |
| 2016-03-043:01:37 PM | 59.338 | 114.913 | 31.325 | 77.562 |
| 2016-03-043:01:41 PM | 59.338 | 115.025 | 31.325 | 77.45 |
| 2016-03-043:01:45 PM | 59.338 | 115.025 | 31.325 | 77.45 |
| 2016-03-043:01:49 PM | 59.338 | 115.138 | 31.325 | 77.45 |
| 2016-03-043:01:53 PM | 59.45 | 115.25 | 31.438 | 77.45 |
| 2016-03-043:01:57 PM | 59.338 | 115.362 | 31.55 | 77.45 |
| 2016-03-043:02:01 PM | 59.45 | 115.362 | 31.438 | 77.45 |
| 2016-03-043:02:05 PM | 59.45 | 115.475 | 31.438 | 77.45 |
| 2016-03-043:02:09 PM | 59.45 | 115.588 | 31.55 | 77.45 |
| 2016-03-043:02:13 PM | 59.45 | 115.7 | 31.662 | 77.45 |
| 2016-03-043:02:17 PM | 59.45 | 115.7 | 31.775 | 77.45 |
| 2016-03-043:02:21 PM | 59.45 | 115.812 | 31.775 | 77.45 |
| 2016-03-043:02:25 PM | 59.45 | 115.925 | 31.775 | 77.45 |
| 2016-03-043:02:29 PM | 59.45 | 116.038 | 31.775 | 77.45 |
| 2016-03-043:02:33 PM | 59.45 | 116.038 | 31.888 | 77.45 |
| 2016-03-043:02:38 PM | 59.45 | 116.15 | 31.888 | 77.45 |
| 2016-03-043:02:42 PM | 59.45 | 116.262 | 31.888 | 77.45 |
| 2016-03-043:02:46 PM | 59.45 | 116.375 | 31.888 | 77.45 |
| 2016-03-043:02:50 PM | 59.45 | 116.375 | 31.775 | 77.45 |
| 2016-03-043:02:54 PM | 59.45 | 116.488 | 31.888 | 77.45 |
| 2016-03-043:02:58 PM | 59.45 | 116.6 | 31.775 | 77.45 |
| 2016-03-043:03:02 PM | 59.45 | 116.712 | 31.775 | 77.45 |
| 2016-03-043:03:06 PM | 59.45 | 116.825 | 31.662 | 77.45 |
| 2016-03-043:03:10 PM | 59.45 | 116.938 | 31.775 | 77.45 |
| 2016-03-043:03:14 PM | 59.45 | 117.05 | 31.775 | 77.45 |
| 2016-03-043:03:18 PM | 59.45 | 117.05 | 31.775 | 77.45 |
| 2016-03-043:03:22 PM | 59.45 | 117.163 | 31.888 | 77.45 |
| 2016-03-043:03:26 PM | 59.562 | 117.275 | 32 | 77.45 |
| 2016-03-043:03:30 PM | 59.562 | 117.275 | 32.112 | 77.338 |
| 2016-03-043:03:34 PM | 59.675 | 117.388 | 32.112 | 77.45 |
| 2016-03-043:03:39 PM | 59.562 | 117.5 | 32.225 | 77.338 |
| 2016-03-043:03:43 PM | 59.675 | 117.5 | 32.338 | 77.45 |
| 2016-03-043:03:47 PM | 59.788 | 117.612 | 32.45 | 77.45 |
| 2016-03-043:03:51 PM | 59.788 | 117.725 | 32.562 | 77.45 |
| 2016-03-043:03:55 PM | 59.788 | 117.725 | 32.562 | 77.338 |
| 2016-03-043:03:59 PM | 59.9 | 117.838 | 32.562 | 77.45 |
| 2016-03-043:04:03 PM | 59.9 | 117.95 | 32.562 | 77.338 |
| 2016-03-043:04:07 PM | 59.9 | 117.95 | 32.562 | 77.45 |
| 2016-03-043:04:11 PM | 59.788 | 117.95 | 32.45 | 77.338 |
| 2016-03-043:04:15 PM | 59.9 | 118.062 | 32.45 | 77.338 |
| 2016-03-043:04:19 PM | 59.9 | 118.175 | 32.45 | 77.338 |
| 2016-03-043:04:23 PM | 59.9 | 118.175 | 32.45 | 77.338 |
| 2016-03-043:04:27 PM | 59.9 | 118.288 | 32.45 | 77.45 |
| 2016-03-043:04:31 PM | 59.9 | 118.288 | 32.45 | 77.338 |
| 2016-03-043:04:35 PM | 60.012 | 118.4 | 32.45 | 77.45 |
| 2016-03-043:04:39 PM | 59.9 | 118.512 | 32.45 | 77.338 |
| 2016-03-043:04:44 PM | 59.9 | 118.512 | 32.338 | 77.45 |
| 2016-03-043:04:48 PM | 59.9 | 118.512 | 32.338 | 77.45 |
| 2016-03-043:04:52 PM | 59.788 | 118.625 | 32.45 | 77.45 |
| 2016-03-043:04:56 PM | 59.788 | 118.625 | 32.338 | 77.338 |
| 2016-03-043:05:00 PM | 59.788 | 118.738 | 32.338 | 77.338 |
| 2016-03-043:05:04 PM | 59.788 | 118.738 | 32.225 | 77.45 |
| 2016-03-043:05:08 PM | 59.788 | 118.85 | 32.225 | 77.338 |
| 2016-03-043:05:12 PM | 59.788 | 118.85 | 32.112 | 77.338 |
| 2016-03-043:05:16 PM | 59.788 | 118.962 | 32 | 77.45 |
| 2016-03-043:05:20 PM | 59.788 | 118.962 | 32 | 77.338 |
| 2016-03-043:05:24 PM | 59.788 | 119.075 | 31.888 | 77.338 |
| 2016-03-043:05:28 PM | 59.675 | 119.075 | 31.888 | 77.45 |
| 2016-03-043:05:32 PM | 59.675 | 119.075 | 31.775 | 77.338 |
| 2016-03-043:05:36 PM | 59.675 | 119.188 | 31.775 | 77.338 |
| 2016-03-043:05:41 PM | 59.675 | 119.188 | 31.775 | 77.338 |
| 2016-03-043:05:45 PM | 59.562 | 119.188 | 31.662 | 77.338 |
| 2016-03-043:05:49 PM | 59.562 | 119.188 | 31.55 | 77.338 |
| 2016-03-043:05:53 PM | 59.562 | 119.3 | 31.438 | 77.338 |
| 2016-03-043:05:57 PM | 59.562 | 119.413 | 31.325 | 77.338 |
| 2016-03-043:06:01 PM | 59.562 | 119.413 | 31.212 | 77.338 |
| 2016-03-043:06:05 PM | 59.562 | 119.413 | 31.325 | 77.338 |
| 2016-03-043:06:09 PM | 59.562 | 119.413 | 31.212 | 77.338 |
| 2016-03-043:06:13 PM | 59.562 | 119.413 | 31.325 | 77.338 |
| 2016-03-043:06:17 PM | 59.45 | 119.525 | 31.325 | 77.338 |
| 2016-03-043:06:21 PM | 59.45 | 119.525 | 31.438 | 77.338 |
| 2016-03-043:06:25 PM | 59.45 | 119.525 | 31.438 | 77.338 |
| 2016-03-043:06:29 PM | 59.45 | 119.638 | 31.438 | 77.338 |
| 2016-03-043:06:33 PM | 59.45 | 119.638 | 31.438 | 77.45 |
| 2016-03-043:06:38 PM | 59.45 | 119.638 | 31.438 | 77.338 |
| 2016-03-043:06:42 PM | 59.562 | 119.75 | 31.438 | 77.338 |
| 2016-03-043:06:46 PM | 59.45 | 119.75 | 31.325 | 77.338 |
| 2016-03-043:06:50 PM | 59.45 | 119.75 | 31.325 | 77.338 |
| 2016-03-043:06:54 PM | 59.45 | 119.862 | 31.438 | 77.338 |
| 2016-03-043:06:58 PM | 59.45 | 119.862 | 31.438 | 77.338 |
| 2016-03-043:07:02 PM | 59.45 | 119.862 | 31.325 | 77.338 |
| 2016-03-043:07:06 PM | 59.45 | 119.862 | 31.325 | 77.338 |
| 2016-03-043:07:10 PM | 59.45 | 119.975 | 31.212 | 77.338 |
| 2016-03-043:07:14 PM | 59.45 | 119.975 | 31.1 | 77.338 |
| 2016-03-043:07:18 PM | 59.45 | 119.975 | 30.988 | 77.338 |
| 2016-03-043:07:22 PM | 59.45 | 120.088 | 30.988 | 77.338 |
| 2016-03-043:07:26 PM | 59.45 | 120.088 | 30.875 | 77.338 |
| 2016-03-043:07:30 PM | 59.338 | 120.088 | 30.875 | 77.338 |
| 2016-03-043:07:34 PM | 59.45 | 120.2 | 30.875 | 77.338 |
| 2016-03-043:07:39 PM | 59.338 | 120.2 | 30.875 | 77.338 |
| 2016-03-043:07:43 PM | 59.338 | 120.312 | 30.875 | 77.338 |
| 2016-03-043:07:47 PM | 59.338 | 120.312 | 30.875 | 77.338 |
| 2016-03-043:07:51 PM | 59.338 | 120.312 | 30.875 | 77.338 |
| 2016-03-043:07:55 PM | 59.225 | 120.425 | 30.988 | 77.338 |
| 2016-03-043:07:59 PM | 59.225 | 120.425 | 30.988 | 77.338 |
| 2016-03-043:08:03 PM | 59.225 | 120.425 | 30.988 | 77.338 |
| 2016-03-043:08:07 PM | 59.225 | 120.538 | 30.875 | 77.338 |
| 2016-03-043:08:11 PM | 59.112 | 120.538 | 30.65 | 77.338 |
| 2016-03-043:08:15 PM | 59.112 | 120.538 | 30.425 | 77.338 |
| 2016-03-043:08:19 PM | 59 | 120.65 | 30.2 | 77.338 |
| 2016-03-043:08:23 PM | 58.888 | 120.65 | 29.975 | 77.338 |
| 2016-03-043:08:27 PM | 58.775 | 120.762 | 29.75 | 77.338 |
| 2016-03-043:08:31 PM | 58.662 | 120.762 | 29.412 | 77.338 |
| 2016-03-043:08:36 PM | 58.55 | 120.762 | 29.188 | 77.338 |
| 2016-03-043:08:40 PM | 58.438 | 120.762 | 28.85 | 77.338 |
| 2016-03-043:08:44 PM | 58.325 | 120.762 | 28.738 | 77.338 |
| 2016-03-043:08:48 PM | 58.325 | 120.762 | 28.512 | 77.338 |
| 2016-03-043:08:52 PM | 58.212 | 120.875 | 28.288 | 77.338 |
| 2016-03-043:08:56 PM | 58.212 | 120.875 | 28.062 | 77.338 |
| 2016-03-043:09:00 PM | 58.212 | 120.875 | 27.95 | 77.338 |
| 2016-03-043:09:04 PM | 58.212 | 120.875 | 27.725 | 77.338 |
| 2016-03-043:09:08 PM | 58.212 | 120.875 | 27.612 | 77.338 |
| 2016-03-043:09:12 PM | 58.212 | 120.875 | 27.612 | 77.338 |
| 2016-03-043:09:16 PM | 58.212 | 120.875 | 27.5 | 77.338 |
| 2016-03-043:09:20 PM | 58.212 | 120.875 | 27.388 | 77.338 |
| 2016-03-043:09:24 PM | 58.212 | 120.875 | 27.275 | 77.338 |
| 2016-03-043:09:28 PM | 58.212 | 120.875 | 27.162 | 77.338 |
| 2016-03-043:09:33 PM | 58.212 | 120.875 | 27.05 | 77.338 |
| 2016-03-043:09:37 PM | 58.212 | 120.875 | 26.825 | 77.338 |
| 2016-03-043:09:41 PM | 58.325 | 120.988 | 26.712 | 77.338 |
| 2016-03-043:09:45 PM | 58.325 | 120.988 | 26.6 | 77.338 |
| 2016-03-043:09:49 PM | 58.325 | 120.875 | 26.6 | 77.338 |
| 2016-03-043:09:53 PM | 58.325 | 120.988 | 26.488 | 77.338 |
| 2016-03-043:09:57 PM | 58.438 | 120.988 | 26.488 | 77.338 |
| 2016-03-043:10:01 PM | 58.325 | 120.988 | 26.488 | 77.338 |
| 2016-03-043:10:05 PM | 58.325 | 120.988 | 26.488 | 77.338 |
| 2016-03-043:10:09 PM | 58.438 | 120.988 | 26.6 | 77.338 |
| 2016-03-043:10:13 PM | 58.438 | 120.988 | 26.6 | 77.338 |
| 2016-03-043:10:17 PM | 58.325 | 120.988 | 26.712 | 77.338 |
| 2016-03-043:10:25 PM | 58.438 | 120.988 | 26.938 | 77.338 |
| 2016-03-043:10:29 PM | 58.438 | 121.1 | 27.05 | 77.225 |
| 2016-03-043:10:33 PM | 58.438 | 121.1 | 27.162 | 77.338 |
| 2016-03-043:10:38 PM | 58.438 | 121.1 | 27.275 | 77.338 |
| 2016-03-043:10:42 PM | 58.438 | 121.1 | 27.388 | 77.338 |
| 2016-03-043:10:46 PM | 58.438 | 121.1 | 27.612 | 77.338 |
| 2016-03-043:10:50 PM | 58.438 | 121.1 | 27.725 | 77.225 |
| 2016-03-043:10:54 PM | 58.438 | 121.1 | 27.838 | 77.338 |
| 2016-03-043:10:58 PM | 58.325 | 121.212 | 27.95 | 77.225 |
| 2016-03-043:11:02 PM | 58.325 | 121.212 | 28.175 | 77.338 |
| 2016-03-043:11:06 PM | 58.325 | 121.212 | 28.288 | 77.338 |
| 2016-03-043:11:10 PM | 58.325 | 121.212 | 28.512 | 77.225 |
| 2016-03-043:11:14 PM | 58.438 | 121.212 | 28.625 | 77.338 |
| 2016-03-043:11:18 PM | 58.325 | 121.212 | 28.625 | 77.338 |
| 2016-03-043:11:22 PM | 58.325 | 121.325 | 28.85 | 77.338 |
| 2016-03-043:11:26 PM | 58.325 | 121.325 | 28.85 | 77.338 |
| 2016-03-043:11:30 PM | 58.325 | 121.325 | 29.075 | 77.338 |
| 2016-03-043:11:34 PM | 58.325 | 121.325 | 29.188 | 77.338 |
| 2016-03-043:11:39 PM | 58.325 | 121.325 | 29.188 | 77.338 |
| 2016-03-043:11:43 PM | 58.325 | 121.325 | 29.3 | 77.338 |
| 2016-03-043:11:47 PM | 58.325 | 121.438 | 29.412 | 77.338 |
| 2016-03-043:11:51 PM | 58.325 | 121.438 | 29.525 | 77.338 |
| 2016-03-043:11:55 PM | 58.325 | 121.438 | 29.638 | 77.338 |
| 2016-03-043:11:59 PM | 58.325 | 121.438 | 29.75 | 77.338 |
| 2016-03-043:12:03 PM | 58.325 | 121.438 | 29.862 | 77.338 |
| 2016-03-043:12:07 PM | 58.325 | 121.438 | 29.975 | 77.225 |
| 2016-03-043:12:11 PM | 58.438 | 121.55 | 29.975 | 77.338 |
| 2016-03-043:12:15 PM | 58.438 | 121.55 | 29.975 | 77.338 |
| 2016-03-043:12:19 PM | 58.325 | 121.55 | 30.088 | 77.338 |
| 2016-03-043:12:23 PM | 58.438 | 121.55 | 30.2 | 77.338 |
| 2016-03-043:12:27 PM | 58.438 | 121.55 | 30.2 | 77.338 |
| 2016-03-043:12:31 PM | 58.438 | 121.55 | 30.312 | 77.338 |
| 2016-03-043:12:36 PM | 58.438 | 121.55 | 30.425 | 77.338 |
| 2016-03-043:12:40 PM | 58.438 | 121.55 | 30.538 | 77.338 |
| 2016-03-043:12:44 PM | 58.438 | 121.55 | 30.538 | 77.225 |
| 2016-03-043:12:48 PM | 58.438 | 121.663 | 30.538 | 77.225 |
| 2016-03-043:12:52 PM | 58.325 | 121.663 | 30.65 | 77.225 |
| 2016-03-043:12:56 PM | 58.438 | 121.663 | 30.65 | 77.225 |
| 2016-03-043:13:00 PM | 58.438 | 121.663 | 30.538 | 77.225 |
| 2016-03-043:13:04 PM | 58.438 | 121.663 | 30.425 | 77.225 |
| 2016-03-043:13:08 PM | 58.438 | 121.663 | 30.312 | 77.225 |
| 2016-03-043:13:12 PM | 58.438 | 121.663 | 30.2 | 77.225 |
| 2016-03-043:13:16 PM | 58.438 | 121.775 | 29.975 | 77.225 |
| 2016-03-043:13:20 PM | 58.438 | 121.775 | 29.862 | 77.338 |
| 2016-03-043:13:24 PM | 58.438 | 121.775 | 29.862 | 77.225 |
| 2016-03-043:13:28 PM | 58.438 | 121.775 | 29.75 | 77.225 |
| 2016-03-043:13:33 PM | 58.438 | 121.775 | 29.638 | 77.225 |
| 2016-03-043:13:37 PM | 58.55 | 121.775 | 29.638 | 77.225 |
| 2016-03-043:13:41 PM | 58.55 | 121.775 | 29.525 | 77.225 |
| 2016-03-043:13:45 PM | 58.55 | 121.775 | 29.525 | 77.225 |
| 2016-03-043:13:49 PM | 58.55 | 121.888 | 29.412 | 77.225 |
| 2016-03-043:13:53 PM | 58.55 | 121.888 | 29.412 | 77.225 |
| 2016-03-043:13:57 PM | 58.55 | 121.775 | 29.188 | 77.225 |
| 2016-03-043:14:01 PM | 58.662 | 121.888 | 29.188 | 77.225 |
| 2016-03-043:14:05 PM | 58.662 | 121.888 | 29.075 | 77.225 |
| 2016-03-043:14:09 PM | 58.55 | 121.888 | 28.962 | 77.225 |
| 2016-03-043:14:13 PM | 58.662 | 121.775 | 28.962 | 77.225 |
| 2016-03-043:14:17 PM | 58.662 | 121.888 | 28.85 | 77.225 |
| 2016-03-043:14:21 PM | 58.662 | 121.775 | 28.738 | 77.225 |
| 2016-03-043:14:25 PM | 58.662 | 121.775 | 28.738 | 77.225 |
| 2016-03-043:14:29 PM | 58.662 | 121.888 | 28.625 | 77.338 |
| 2016-03-043:14:34 PM | 58.662 | 121.888 | 28.512 | 77.225 |
| 2016-03-043:14:38 PM | 58.662 | 121.888 | 28.4 | 77.225 |
| 2016-03-043:14:42 PM | 58.662 | 121.775 | 28.288 | 77.225 |
| 2016-03-043:14:46 PM | 58.662 | 121.775 | 28.062 | 77.225 |
| 2016-03-043:14:50 PM | 58.662 | 121.775 | 27.95 | 77.225 |
| 2016-03-043:14:54 PM | 58.662 | 121.775 | 27.725 | 77.225 |
| 2016-03-043:14:58 PM | 58.662 | 121.775 | 27.612 | 77.225 |
| 2016-03-043:15:02 PM | 58.662 | 121.775 | 27.5 | 77.225 |
| 2016-03-043:15:06 PM | 58.662 | 121.775 | 27.388 | 77.225 |
| 2016-03-043:15:10 PM | 58.662 | 121.775 | 27.275 | 77.225 |
| 2016-03-043:15:14 PM | 58.662 | 121.663 | 27.275 | 77.225 |
| 2016-03-043:15:18 PM | 58.662 | 121.663 | 27.275 | 77.225 |
| 2016-03-043:15:22 PM | 58.662 | 121.663 | 27.162 | 77.225 |
| 2016-03-043:15:26 PM | 58.662 | 121.663 | 27.162 | 77.225 |
| 2016-03-043:15:30 PM | 58.55 | 121.663 | 27.05 | 77.225 |
| 2016-03-043:15:35 PM | 58.55 | 121.663 | 27.05 | 77.225 |
| 2016-03-043:15:39 PM | 58.55 | 121.663 | 27.05 | 77.225 |
| 2016-03-043:15:43 PM | 58.55 | 121.663 | 27.05 | 77.225 |
| 2016-03-043:15:47 PM | 58.55 | 121.663 | 27.05 | 77.225 |
| 2016-03-043:15:51 PM | 58.55 | 121.663 | 27.162 | 77.225 |
| 2016-03-043:15:55 PM | 58.55 | 121.663 | 27.275 | 77.225 |
| 2016-03-043:15:59 PM | 58.55 | 121.663 | 27.388 | 77.225 |
| 2016-03-043:16:03 PM | 58.55 | 121.663 | 27.5 | 77.225 |
| 2016-03-043:16:07 PM | 58.438 | 121.55 | 27.612 | 77.225 |
| 2016-03-043:16:11 PM | 58.438 | 121.55 | 27.725 | 77.225 |
| 2016-03-043:16:15 PM | 58.438 | 121.55 | 27.838 | 77.225 |
| 2016-03-043:16:19 PM | 58.438 | 121.55 | 27.838 | 77.225 |
| 2016-03-043:16:23 PM | 58.325 | 121.55 | 27.725 | 77.225 |
| 2016-03-043:16:27 PM | 58.325 | 121.55 | 27.838 | 77.225 |
| 2016-03-043:16:31 PM | 58.438 | 121.55 | 27.838 | 77.225 |
| 2016-03-043:16:35 PM | 58.438 | 121.438 | 27.95 | 77.225 |
| 2016-03-043:16:40 PM | 58.55 | 121.55 | 28.062 | 77.225 |
| 2016-03-043:16:44 PM | 58.55 | 121.438 | 28.062 | 77.225 |
| 2016-03-043:16:48 PM | 58.55 | 121.438 | 27.95 | 77.225 |
| 2016-03-043:16:52 PM | 58.55 | 121.438 | 27.95 | 77.225 |
| 2016-03-043:16:56 PM | 58.438 | 121.438 | 27.838 | 77.225 |
| 2016-03-043:17:00 PM | 58.438 | 121.325 | 27.838 | 77.225 |
| 2016-03-043:17:04 PM | 58.438 | 121.325 | 27.95 | 77.225 |
| 2016-03-043:17:08 PM | 58.325 | 121.325 | 27.95 | 77.225 |
| 2016-03-043:17:12 PM | 58.212 | 121.325 | 28.062 | 77.225 |
| 2016-03-043:17:16 PM | 58.325 | 121.325 | 28.175 | 77.225 |
| 2016-03-043:17:20 PM | 58.212 | 121.325 | 28.288 | 77.225 |
| 2016-03-043:17:24 PM | 58.1 | 121.212 | 28.4 | 77.225 |
| 2016-03-043:17:28 PM | 58.1 | 121.212 | 28.512 | 77.225 |
| 2016-03-043:17:32 PM | 58.1 | 121.212 | 28.625 | 77.225 |
| 2016-03-043:17:37 PM | 58.1 | 121.1 | 28.625 | 77.225 |
| 2016-03-043:17:41 PM | 58.1 | 121.1 | 28.738 | 77.225 |
| 2016-03-043:17:45 PM | 57.988 | 121.1 | 28.625 | 77.225 |
| 2016-03-043:17:49 PM | 58.1 | 121.1 | 28.512 | 77.225 |
| 2016-03-043:17:53 PM | 57.988 | 121.1 | 28.512 | 77.225 |
| 2016-03-043:17:57 PM | 57.988 | 121.1 | 28.4 | 77.225 |
| 2016-03-043:18:01 PM | 57.988 | 121.1 | 28.4 | 77.225 |
| 2016-03-043:18:05 PM | 57.988 | 121.1 | 28.288 | 77.112 |
| 2016-03-043:18:09 PM | 57.988 | 121.1 | 28.4 | 77.112 |
| 2016-03-043:18:13 PM | 57.988 | 120.988 | 28.4 | 77.225 |
| 2016-03-043:18:17 PM | 57.988 | 121.1 | 28.625 | 77.225 |
| 2016-03-043:18:21 PM | 57.988 | 120.988 | 28.738 | 77.225 |
| 2016-03-043:18:25 PM | 57.988 | 120.988 | 28.85 | 77.225 |
| 2016-03-043:18:29 PM | 57.988 | 120.988 | 28.962 | 77.225 |
| 2016-03-043:18:33 PM | 58.1 | 120.988 | 28.962 | 77.112 |
| 2016-03-043:18:38 PM | 58.1 | 120.875 | 28.962 | 77.225 |
| 2016-03-043:18:42 PM | 58.1 | 120.875 | 28.962 | 77.225 |
| 2016-03-043:18:46 PM | 58.1 | 120.875 | 29.188 | 77.112 |
| 2016-03-043:18:50 PM | 57.988 | 120.875 | 29.188 | 77.112 |
| 2016-03-043:18:54 PM | 58.1 | 120.875 | 29.3 | 77.112 |
| 2016-03-043:18:58 PM | 58.1 | 120.875 | 29.3 | 77.112 |
| 2016-03-043:19:02 PM | 58.212 | 120.875 | 29.3 | 77.225 |
| 2016-03-043:19:06 PM | 58.212 | 120.875 | 29.525 | 77.112 |
| 2016-03-043:19:10 PM | 58.325 | 120.875 | 29.638 | 77.112 |
| 2016-03-043:19:14 PM | 58.325 | 120.762 | 29.75 | 77.112 |
| 2016-03-043:19:18 PM | 58.325 | 120.762 | 29.862 | 77.225 |
| 2016-03-043:19:22 PM | 58.325 | 120.762 | 29.75 | 77.225 |
| 2016-03-043:19:26 PM | 58.438 | 120.762 | 29.862 | 77.112 |
| 2016-03-043:19:31 PM | 58.438 | 120.762 | 29.862 | 77.112 |
| 2016-03-043:19:35 PM | 58.438 | 120.65 | 29.862 | 77.112 |
| 2016-03-043:19:39 PM | 58.438 | 120.762 | 29.862 | 77.112 |
| 2016-03-043:19:43 PM | 58.55 | 120.65 | 29.862 | 77.112 |
| 2016-03-043:19:47 PM | 58.55 | 120.538 | 29.975 | 77.112 |
| 2016-03-043:19:51 PM | 58.662 | 120.538 | 29.862 | 77.112 |
| 2016-03-043:19:55 PM | 58.662 | 120.538 | 29.75 | 77.112 |
| 2016-03-043:19:59 PM | 58.662 | 120.538 | 29.75 | 77.112 |
| 2016-03-043:20:03 PM | 58.662 | 120.425 | 29.638 | 77.112 |
| 2016-03-043:20:07 PM | 58.662 | 120.425 | 29.638 | 77.112 |
| 2016-03-043:20:11 PM | 58.662 | 120.425 | 29.75 | 77.112 |
| 2016-03-043:20:15 PM | 58.662 | 120.425 | 29.862 | 77.225 |
| 2016-03-043:20:19 PM | 58.775 | 120.312 | 29.975 | 77.112 |
| 2016-03-043:20:23 PM | 58.775 | 120.312 | 30.088 | 77.112 |
| 2016-03-043:20:27 PM | 58.775 | 120.312 | 30.088 | 77.112 |
| 2016-03-043:20:32 PM | 58.775 | 120.2 | 30.2 | 77.112 |
| 2016-03-043:20:36 PM | 58.775 | 120.2 | 30.2 | 77.112 |
| 2016-03-043:20:40 PM | 58.775 | 120.088 | 30.2 | 77.112 |
| 2016-03-043:20:44 PM | 58.775 | 120.088 | 30.2 | 77.112 |
| 2016-03-043:20:48 PM | 58.775 | 120.088 | 30.2 | 77.112 |
| 2016-03-043:20:52 PM | 58.662 | 120.088 | 30.2 | 77.112 |
| 2016-03-043:20:56 PM | 58.662 | 120.088 | 30.2 | 77.112 |
| 2016-03-043:21:00 PM | 58.662 | 119.975 | 30.088 | 77.112 |
| 2016-03-043:21:04 PM | 58.662 | 119.975 | 30.2 | 77.112 |
| 2016-03-043:21:08 PM | 58.662 | 119.975 | 30.2 | 77.112 |
| 2016-03-043:21:12 PM | 58.662 | 119.862 | 30.312 | 77.112 |
| 2016-03-043:21:16 PM | 58.55 | 119.862 | 30.425 | 77.112 |
| 2016-03-043:21:20 PM | 58.55 | 119.862 | 30.538 | 77.225 |
| 2016-03-043:21:24 PM | 58.55 | 119.75 | 30.65 | 77.112 |
| 2016-03-043:21:28 PM | 58.55 | 119.75 | 30.65 | 77.225 |
| 2016-03-043:21:33 PM | 58.55 | 119.75 | 30.65 | 77.112 |
| 2016-03-043:21:37 PM | 58.55 | 119.638 | 30.538 | 77.112 |
| 2016-03-043:21:41 PM | 58.438 | 119.638 | 30.65 | 77.112 |
| 2016-03-043:21:45 PM | 58.55 | 119.638 | 30.762 | 77.112 |
| 2016-03-043:21:49 PM | 58.55 | 119.638 | 30.762 | 77.112 |
| 2016-03-043:21:53 PM | 58.438 | 119.525 | 30.762 | 77.112 |
| 2016-03-043:21:57 PM | 58.438 | 119.525 | 30.762 | 77.112 |
| 2016-03-043:22:01 PM | 58.438 | 119.525 | 30.762 | 77.112 |
| 2016-03-043:22:05 PM | 58.55 | 119.525 | 30.762 | 77.112 |
| 2016-03-043:22:09 PM | 58.438 | 119.525 | 30.875 | 77.112 |
| 2016-03-043:22:13 PM | 58.438 | 119.413 | 30.875 | 77.112 |
| 2016-03-043:22:17 PM | 58.55 | 119.413 | 30.762 | 77.112 |
| 2016-03-043:22:21 PM | 58.55 | 119.413 | 30.762 | 77.112 |
| 2016-03-043:22:25 PM | 58.55 | 119.413 | 30.988 | 77.112 |
| 2016-03-043:22:29 PM | 58.55 | 119.413 | 31.1 | 77.112 |
| 2016-03-043:22:34 PM | 58.662 | 119.3 | 31.212 | 77.112 |
| 2016-03-043:22:38 PM | 58.662 | 119.3 | 31.325 | 77.112 |
| 2016-03-043:22:42 PM | 58.662 | 119.3 | 31.438 | 77.112 |
| 2016-03-043:22:46 PM | 58.55 | 119.3 | 31.438 | 77.112 |
| 2016-03-043:22:50 PM | 58.55 | 119.3 | 31.55 | 77.112 |
| 2016-03-043:22:54 PM | 58.55 | 119.3 | 31.55 | 77.112 |
| 2016-03-043:22:58 PM | 58.55 | 119.3 | 31.55 | 77.112 |
| 2016-03-043:23:02 PM | 58.662 | 119.188 | 31.55 | 77.112 |
| 2016-03-043:23:06 PM | 58.662 | 119.188 | 31.55 | 77.112 |
| 2016-03-043:23:10 PM | 58.662 | 119.188 | 31.662 | 77.112 |
| 2016-03-043:23:14 PM | 58.775 | 119.188 | 31.775 | 77.112 |
| 2016-03-043:23:18 PM | 58.775 | 119.188 | 31.888 | 77.112 |
| 2016-03-043:23:22 PM | 58.888 | 119.188 | 31.888 | 77.112 |
| 2016-03-043:23:26 PM | 58.775 | 119.075 | 32 | 77.112 |
| 2016-03-043:23:30 PM | 58.888 | 119.188 | 32.112 | 77.112 |
| 2016-03-043:23:35 PM | 58.775 | 119.075 | 32.112 | 77.112 |
| 2016-03-043:23:39 PM | 58.888 | 119.075 | 32.225 | 77.112 |
| 2016-03-043:23:43 PM | 58.888 | 119.075 | 32.338 | 77 |
| 2016-03-043:23:47 PM | 58.888 | 119.075 | 32.45 | 77.112 |
| 2016-03-043:23:51 PM | 59 | 118.962 | 32.45 | 77.112 |
| 2016-03-043:23:55 PM | 58.888 | 118.962 | 32.45 | 77.112 |
| 2016-03-043:23:59 PM | 59 | 118.962 | 32.45 | 77.112 |
| 2016-03-043:24:03 PM | 59 | 118.962 | 32.338 | 77 |
| 2016-03-043:24:07 PM | 59 | 118.962 | 32.338 | 77 |
| 2016-03-043:24:11 PM | 59 | 118.962 | 32.338 | 77 |
| 2016-03-043:24:15 PM | 59 | 118.962 | 32.338 | 77 |
| 2016-03-043:24:19 PM | 59 | 118.85 | 32.45 | 77 |
| 2016-03-043:24:23 PM | 59 | 118.85 | 32.338 | 77.112 |
| 2016-03-043:24:27 PM | 59 | 118.85 | 32.338 | 77 |
| 2016-03-043:24:31 PM | 59 | 118.738 | 32.225 | 77.112 |
| 2016-03-043:24:36 PM | 59 | 118.738 | 32.225 | 77 |
| 2016-03-043:24:40 PM | 59 | 118.738 | 32.225 | 77.112 |
| 2016-03-043:24:44 PM | 59.112 | 118.738 | 32.225 | 77.112 |
| 2016-03-043:24:48 PM | 59.112 | 118.738 | 32.225 | 77 |
| 2016-03-043:24:52 PM | 59.112 | 118.625 | 32.112 | 77 |
| 2016-03-043:24:56 PM | 59.112 | 118.738 | 32.112 | 77 |
| 2016-03-043:25:00 PM | 59.112 | 118.625 | 32.112 | 77.112 |
| 2016-03-043:25:04 PM | 59.225 | 118.625 | 32.112 | 77.112 |
| 2016-03-043:25:08 PM | 59.225 | 118.625 | 32.112 | 77 |
| 2016-03-043:25:12 PM | 59.225 | 118.512 | 32 | 77 |
| 2016-03-043:25:16 PM | 59.225 | 118.625 | 31.775 | 77 |
| 2016-03-043:25:20 PM | 59.225 | 118.512 | 31.775 | 77.112 |
| 2016-03-043:25:24 PM | 59.225 | 118.512 | 31.662 | 77 |
| 2016-03-043:25:28 PM | 59.225 | 118.512 | 31.662 | 77 |
| 2016-03-043:25:33 PM | 59.225 | 118.4 | 31.55 | 77 |
| 2016-03-043:25:37 PM | 59.112 | 118.512 | 31.438 | 77 |
| 2016-03-043:25:41 PM | 59.112 | 118.4 | 31.438 | 77 |
| 2016-03-043:25:45 PM | 59.112 | 118.4 | 31.325 | 77 |
| 2016-03-043:25:49 PM | 59.112 | 118.4 | 31.212 | 77 |
| 2016-03-043:25:53 PM | 59 | 118.288 | 31.212 | 77 |
| 2016-03-043:25:57 PM | 59 | 118.288 | 31.325 | 77 |
| 2016-03-043:26:01 PM | 58.888 | 118.288 | 31.325 | 77 |
| 2016-03-043:26:05 PM | 58.888 | 118.288 | 31.438 | 77 |
| 2016-03-043:26:09 PM | 58.888 | 118.288 | 31.438 | 77 |
| 2016-03-043:26:13 PM | 58.888 | 118.175 | 31.438 | 77 |
| 2016-03-043:26:17 PM | 58.775 | 118.175 | 31.438 | 77 |
| 2016-03-043:26:21 PM | 58.775 | 118.175 | 31.325 | 77 |
| 2016-03-043:26:25 PM | 58.775 | 118.175 | 31.1 | 77 |
| 2016-03-043:26:29 PM | 58.775 | 118.175 | 30.988 | 77 |
| 2016-03-043:26:34 PM | 58.662 | 118.062 | 30.875 | 77 |
| 2016-03-043:26:38 PM | 58.775 | 118.062 | 30.762 | 77 |
| 2016-03-043:26:42 PM | 58.775 | 118.062 | 30.65 | 77 |
| 2016-03-043:26:46 PM | 58.775 | 118.062 | 30.538 | 77 |
| 2016-03-043:26:50 PM | 58.662 | 117.95 | 30.538 | 77 |
| 2016-03-043:26:54 PM | 58.775 | 118.062 | 30.425 | 77 |
| 2016-03-043:26:58 PM | 58.888 | 117.95 | 30.312 | 77 |
| 2016-03-043:27:02 PM | 58.888 | 117.95 | 30.312 | 77 |
| 2016-03-043:27:06 PM | 59 | 117.95 | 30.312 | 77 |
| 2016-03-043:27:10 PM | 59 | 117.95 | 30.312 | 77 |
| 2016-03-043:27:14 PM | 59 | 117.838 | 30.312 | 77 |
| 2016-03-043:27:18 PM | 59 | 117.838 | 30.425 | 76.888 |
| 2016-03-043:27:22 PM | 59 | 117.838 | 30.538 | 77 |
| 2016-03-043:27:26 PM | 58.888 | 117.725 | 30.65 | 77 |
| 2016-03-043:27:31 PM | 58.775 | 117.725 | 30.65 | 76.888 |
| 2016-03-043:27:35 PM | 58.55 | 117.612 | 30.65 | 76.888 |
| 2016-03-043:27:39 PM | 58.438 | 117.612 | 30.538 | 76.888 |
| 2016-03-043:27:43 PM | 58.325 | 117.5 | 30.538 | 76.888 |
| 2016-03-043:27:47 PM | 58.1 | 117.612 | 30.425 | 76.888 |
| 2016-03-043:27:51 PM | 57.988 | 117.5 | 30.2 | 76.888 |
| 2016-03-043:27:55 PM | 57.875 | 117.5 | 30.088 | 76.888 |
| 2016-03-043:27:59 PM | 57.762 | 117.5 | 29.862 | 76.888 |
| 2016-03-043:28:03 PM | 57.538 | 117.388 | 29.75 | 76.775 |
| 2016-03-043:28:07 PM | 57.425 | 117.388 | 29.638 | 76.775 |
| 2016-03-043:28:11 PM | 57.312 | 117.388 | 29.638 | 76.775 |
| 2016-03-043:28:15 PM | 57.2 | 117.388 | 29.75 | 76.662 |
| 2016-03-043:28:19 PM | 56.975 | 117.275 | 29.75 | 76.55 |
| 2016-03-043:28:23 PM | 56.862 | 117.275 | 29.975 | 76.55 |
| 2016-03-043:28:27 PM | 56.75 | 117.275 | 29.975 | 76.55 |
| 2016-03-043:28:31 PM | 56.638 | 117.275 | 29.975 | 76.55 |
| 2016-03-043:28:36 PM | 56.412 | 117.163 | 30.088 | 76.55 |
| 2016-03-043:28:40 PM | 56.3 | 117.163 | 30.088 | 76.55 |
| 2016-03-043:28:44 PM | 56.188 | 117.163 | 29.975 | 76.55 |
| 2016-03-043:28:48 PM | 55.962 | 117.163 | 29.975 | 76.55 |
| 2016-03-043:28:52 PM | 55.962 | 117.05 | 29.975 | 76.438 |
| 2016-03-043:28:56 PM | 55.738 | 117.05 | 29.862 | 76.325 |
| 2016-03-043:29:00 PM | 55.625 | 117.05 | 29.862 | 76.212 |
| 2016-03-043:29:04 PM | 55.625 | 117.05 | 29.862 | 76.212 |
| 2016-03-043:29:08 PM | 55.512 | 117.05 | 29.862 | 76.1 |
| 2016-03-043:29:12 PM | 55.512 | 117.05 | 29.75 | 76.1 |
| 2016-03-043:29:16 PM | 55.4 | 116.938 | 29.638 | 75.988 |
| 2016-03-043:29:20 PM | 55.4 | 116.938 | 29.638 | 75.988 |
| 2016-03-043:29:24 PM | 55.4 | 116.938 | 29.638 | 75.875 |
| 2016-03-043:29:28 PM | 55.288 | 116.938 | 29.525 | 75.875 |
| 2016-03-043:29:32 PM | 55.175 | 116.825 | 29.525 | 75.762 |
| 2016-03-043:29:37 PM | 55.175 | 116.825 | 29.638 | 75.65 |
| 2016-03-043:29:41 PM | 55.175 | 116.825 | 29.638 | 75.538 |
| 2016-03-043:29:45 PM | 55.175 | 116.712 | 29.638 | 75.425 |
| 2016-03-043:29:49 PM | 55.175 | 116.712 | 29.638 | 75.425 |
| 2016-03-043:29:53 PM | 55.175 | 116.712 | 29.75 | 75.425 |
| 2016-03-043:29:57 PM | 55.062 | 116.712 | 29.75 | 75.312 |
| 2016-03-043:30:01 PM | 55.062 | 116.6 | 29.862 | 75.2 |
| 2016-03-043:30:05 PM | 55.062 | 116.712 | 29.975 | 75.2 |
| 2016-03-043:30:09 PM | 55.062 | 116.6 | 29.975 | 75.088 |
| 2016-03-043:30:13 PM | 55.062 | 116.6 | 30.088 | 75.088 |
| 2016-03-043:30:17 PM | 55.062 | 116.6 | 30.088 | 74.975 |
| 2016-03-043:30:21 PM | 55.062 | 116.488 | 30.2 | 74.975 |
| 2016-03-043:30:25 PM | 55.175 | 116.488 | 30.425 | 74.975 |
| 2016-03-043:30:29 PM | 55.175 | 116.488 | 30.538 | 74.862 |
| 2016-03-043:30:33 PM | 55.175 | 116.488 | 30.538 | 74.862 |
| 2016-03-043:30:38 PM | 55.288 | 116.488 | 30.65 | 74.862 |
| 2016-03-043:30:42 PM | 55.288 | 116.375 | 30.762 | 74.862 |
| 2016-03-043:30:46 PM | 55.288 | 116.375 | 30.875 | 74.75 |
| 2016-03-043:30:50 PM | 55.4 | 116.375 | 30.875 | 74.75 |
| 2016-03-043:30:54 PM | 55.4 | 116.262 | 30.875 | 74.75 |
| 2016-03-043:30:58 PM | 55.4 | 116.262 | 30.875 | 74.75 |
| 2016-03-043:31:02 PM | 55.512 | 116.262 | 30.988 | 74.75 |
| 2016-03-043:31:06 PM | 55.512 | 116.262 | 30.988 | 74.75 |
| 2016-03-043:31:10 PM | 55.512 | 116.262 | 31.1 | 74.638 |
| 2016-03-043:31:14 PM | 55.512 | 116.262 | 31.1 | 74.638 |
| 2016-03-043:31:18 PM | 55.625 | 116.15 | 31.1 | 74.638 |
| 2016-03-043:31:22 PM | 55.625 | 116.15 | 31.212 | 74.638 |
| 2016-03-043:31:26 PM | 55.738 | 116.15 | 31.325 | 74.638 |
| 2016-03-043:31:30 PM | 55.738 | 116.15 | 31.438 | 74.638 |
| 2016-03-043:31:34 PM | 55.738 | 116.15 | 31.438 | 74.638 |
| 2016-03-043:31:39 PM | 55.738 | 116.15 | 31.55 | 74.525 |
| 2016-03-043:31:43 PM | 55.738 | 116.15 | 31.55 | 74.525 |
| 2016-03-043:31:47 PM | 55.738 | 116.15 | 31.662 | 74.525 |
| 2016-03-043:31:51 PM | 55.738 | 116.038 | 31.662 | 74.638 |
| 2016-03-043:31:55 PM | 55.85 | 116.15 | 31.662 | 74.638 |
| 2016-03-043:31:59 PM | 55.962 | 116.038 | 31.662 | 74.638 |
| 2016-03-043:32:03 PM | 55.85 | 116.038 | 31.662 | 74.638 |
| 2016-03-043:32:07 PM | 55.962 | 116.038 | 31.662 | 74.638 |
| 2016-03-043:32:11 PM | 55.962 | 116.038 | 31.55 | 74.525 |
| 2016-03-043:32:15 PM | 55.962 | 116.038 | 31.55 | 74.638 |
| 2016-03-043:32:19 PM | 55.962 | 115.925 | 31.55 | 74.525 |
| 2016-03-043:32:23 PM | 56.075 | 115.925 | 31.438 | 74.638 |
| 2016-03-043:32:27 PM | 56.075 | 115.925 | 31.325 | 74.638 |
| 2016-03-043:32:31 PM | 56.075 | 115.925 | 31.1 | 74.638 |
| 2016-03-043:32:36 PM | 55.962 | 115.925 | 31.1 | 74.525 |
| 2016-03-043:32:40 PM | 55.962 | 115.812 | 30.988 | 74.638 |
| 2016-03-043:32:44 PM | 55.962 | 115.812 | 30.875 | 74.638 |
| 2016-03-043:32:48 PM | 56.075 | 115.7 | 30.65 | 74.638 |
| 2016-03-043:32:52 PM | 56.075 | 115.812 | 30.538 | 74.638 |
| 2016-03-043:32:56 PM | 56.075 | 115.7 | 30.425 | 74.638 |
| 2016-03-043:33:00 PM | 56.075 | 115.7 | 30.425 | 74.638 |
| 2016-03-043:33:04 PM | 55.962 | 115.7 | 30.538 | 74.638 |
| 2016-03-043:33:08 PM | 56.075 | 115.7 | 30.538 | 74.638 |
| 2016-03-043:33:12 PM | 56.075 | 115.588 | 30.65 | 74.638 |
| 2016-03-043:33:16 PM | 56.075 | 115.588 | 30.65 | 74.638 |
| 2016-03-043:33:20 PM | 56.075 | 115.588 | 30.762 | 74.638 |
| 2016-03-043:33:24 PM | 56.075 | 115.588 | 30.762 | 74.75 |
| 2016-03-043:33:28 PM | 56.188 | 115.475 | 30.875 | 74.638 |
| 2016-03-043:33:33 PM | 56.188 | 115.475 | 30.875 | 74.638 |
| 2016-03-043:33:37 PM | 56.188 | 115.475 | 30.875 | 74.75 |
| 2016-03-043:33:41 PM | 56.188 | 115.475 | 30.875 | 74.75 |
| 2016-03-043:33:45 PM | 56.188 | 115.475 | 30.875 | 74.75 |
| 2016-03-043:33:49 PM | 56.3 | 115.475 | 30.988 | 74.75 |
| 2016-03-043:33:53 PM | 56.3 | 115.362 | 30.875 | 74.75 |
| 2016-03-043:33:57 PM | 56.3 | 115.362 | 30.762 | 74.75 |
| 2016-03-043:34:01 PM | 56.412 | 115.25 | 30.762 | 74.75 |
| 2016-03-043:34:05 PM | 56.412 | 115.25 | 30.762 | 74.75 |
| 2016-03-043:34:09 PM | 56.525 | 115.25 | 30.875 | 74.75 |
| 2016-03-043:34:13 PM | 56.638 | 115.25 | 30.988 | 74.75 |
| 2016-03-043:34:17 PM | 56.638 | 115.138 | 30.988 | 74.75 |
| 2016-03-043:34:21 PM | 56.638 | 115.138 | 30.988 | 74.75 |
| 2016-03-043:34:25 PM | 56.638 | 115.138 | 30.65 | 74.75 |
| 2016-03-043:34:29 PM | 56.75 | 115.138 | 30.538 | 74.75 |
| 2016-03-043:34:33 PM | 56.75 | 115.138 | 30.538 | 74.75 |
| 2016-03-043:34:38 PM | 56.862 | 115.025 | 30.538 | 74.75 |
| 2016-03-043:34:42 PM | 56.975 | 115.025 | 30.538 | 74.862 |
| 2016-03-043:34:46 PM | 56.975 | 115.025 | 30.425 | 74.75 |
| 2016-03-043:34:50 PM | 57.088 | 115.025 | 30.312 | 74.862 |
| 2016-03-043:34:54 PM | 57.088 | 114.913 | 30.2 | 74.862 |
| 2016-03-043:34:58 PM | 57.2 | 114.913 | 30.088 | 74.862 |
| 2016-03-043:35:02 PM | 57.2 | 114.8 | 30.2 | 74.862 |
| 2016-03-043:35:06 PM | 57.2 | 114.8 | 30.2 | 74.862 |
| 2016-03-043:35:10 PM | 57.2 | 114.8 | 30.2 | 74.862 |
| 2016-03-043:35:14 PM | 57.2 | 114.688 | 30.2 | 74.862 |
| 2016-03-043:35:18 PM | 57.2 | 114.688 | 30.2 | 74.975 |
| 2016-03-043:35:22 PM | 57.088 | 114.688 | 30.2 | 74.975 |
| 2016-03-043:35:26 PM | 57.088 | 114.575 | 29.975 | 74.975 |
| 2016-03-043:35:30 PM | 56.975 | 114.575 | 29.75 | 74.975 |
| 2016-03-043:35:35 PM | 56.975 | 114.575 | 29.638 | 74.975 |
| 2016-03-043:35:39 PM | 56.75 | 114.462 | 29.412 | 74.975 |
| 2016-03-043:35:43 PM | 56.638 | 114.35 | 29.188 | 74.975 |
| 2016-03-043:35:47 PM | 56.525 | 114.35 | 29.075 | 74.975 |
| 2016-03-043:35:51 PM | 56.412 | 114.35 | 28.962 | 74.975 |
| 2016-03-043:35:55 PM | 56.3 | 114.238 | 28.85 | 74.975 |
| 2016-03-043:35:59 PM | 56.188 | 114.238 | 28.625 | 74.975 |
| 2016-03-043:36:03 PM | 56.075 | 114.238 | 28.512 | 74.975 |
| 2016-03-043:36:07 PM | 55.962 | 114.125 | 28.288 | 74.975 |
| 2016-03-043:36:11 PM | 55.85 | 114.012 | 28.175 | 74.975 |
| 2016-03-043:36:15 PM | 55.85 | 114.012 | 28.062 | 74.975 |
| 2016-03-043:36:19 PM | 55.738 | 114.012 | 27.95 | 75.088 |
| 2016-03-043:36:23 PM | 55.738 | 113.9 | 28.062 | 75.088 |
| 2016-03-043:36:27 PM | 55.625 | 113.788 | 28.062 | 75.088 |
| 2016-03-043:36:32 PM | 55.625 | 113.788 | 28.062 | 75.088 |
| 2016-03-043:36:36 PM | 55.625 | 113.675 | 28.175 | 75.088 |
| 2016-03-043:36:40 PM | 55.625 | 113.675 | 28.288 | 75.088 |
| 2016-03-043:36:44 PM | 55.512 | 113.675 | 28.288 | 75.088 |
| 2016-03-043:36:48 PM | 55.512 | 113.562 | 28.288 | 75.088 |
| 2016-03-043:36:52 PM | 55.512 | 113.562 | 28.288 | 75.088 |
| 2016-03-043:36:56 PM | 55.512 | 113.562 | 28.288 | 75.088 |
| 2016-03-043:37:00 PM | 55.512 | 113.45 | 28.175 | 75.088 |
| 2016-03-043:37:04 PM | 55.512 | 113.338 | 28.062 | 75.088 |
| 2016-03-043:37:08 PM | 55.625 | 113.225 | 27.838 | 75.088 |
| 2016-03-043:37:12 PM | 55.625 | 113.225 | 27.612 | 75.088 |
| 2016-03-043:37:16 PM | 55.625 | 113.225 | 27.5 | 75.088 |
| 2016-03-043:37:20 PM | 55.625 | 113.112 | 27.388 | 75.088 |
| 2016-03-043:37:24 PM | 55.738 | 113.112 | 27.162 | 75.088 |
| 2016-03-043:37:28 PM | 55.738 | 113 | 27.05 | 75.2 |
| 2016-03-043:37:33 PM | 55.738 | 113 | 27.05 | 75.2 |
| 2016-03-043:37:37 PM | 55.738 | 113 | 26.825 | 75.2 |
| 2016-03-043:37:41 PM | 55.738 | 112.888 | 26.712 | 75.2 |
| 2016-03-043:37:45 PM | 55.85 | 112.888 | 26.712 | 75.2 |
| 2016-03-043:37:49 PM | 55.85 | 112.888 | 26.6 | 75.2 |
| 2016-03-043:37:53 PM | 55.85 | 112.775 | 26.375 | 75.312 |
| 2016-03-043:37:57 PM | 55.962 | 112.775 | 26.375 | 75.312 |
| 2016-03-043:38:01 PM | 55.962 | 112.663 | 26.262 | 75.312 |
| 2016-03-043:38:05 PM | 55.962 | 112.663 | 26.262 | 75.425 |
| 2016-03-043:38:09 PM | 56.075 | 112.55 | 26.15 | 75.425 |
| 2016-03-043:38:13 PM | 56.075 | 112.55 | 26.15 | 75.425 |
| 2016-03-043:38:17 PM | 56.075 | 112.438 | 26.038 | 75.425 |
| 2016-03-043:38:21 PM | 56.075 | 112.438 | 26.038 | 75.425 |
| 2016-03-043:38:25 PM | 56.075 | 112.325 | 26.038 | 75.425 |
| 2016-03-043:38:29 PM | 56.075 | 112.325 | 25.925 | 75.425 |
| 2016-03-043:38:33 PM | 56.075 | 112.325 | 25.925 | 75.425 |
| 2016-03-043:38:37 PM | 56.075 | 112.212 | 25.812 | 75.425 |
| 2016-03-043:38:41 PM | 56.075 | 112.212 | 25.812 | 75.538 |
| 2016-03-043:38:46 PM | 56.075 | 112.1 | 25.925 | 75.538 |
| 2016-03-043:38:50 PM | 56.075 | 112.1 | 25.925 | 75.538 |
| 2016-03-043:38:54 PM | 55.962 | 112.1 | 25.925 | 75.538 |
| 2016-03-043:38:58 PM | 55.962 | 111.988 | 26.038 | 75.538 |
| 2016-03-043:39:02 PM | 56.075 | 111.988 | 25.925 | 75.538 |
| 2016-03-043:39:06 PM | 56.075 | 111.988 | 25.925 | 75.538 |
| 2016-03-043:39:10 PM | 56.075 | 111.875 | 25.925 | 75.538 |
| 2016-03-043:39:14 PM | 56.075 | 111.875 | 25.812 | 75.65 |
| 2016-03-043:39:18 PM | 56.075 | 111.762 | 25.925 | 75.65 |
| 2016-03-043:39:22 PM | 56.075 | 111.762 | 26.038 | 75.65 |
| 2016-03-043:39:26 PM | 56.075 | 111.762 | 26.038 | 75.65 |
| 2016-03-043:39:30 PM | 55.962 | 111.65 | 26.15 | 75.65 |
| 2016-03-043:39:34 PM | 55.962 | 111.65 | 26.15 | 75.65 |
| 2016-03-043:39:39 PM | 55.85 | 111.538 | 26.15 | 75.65 |
| 2016-03-043:39:43 PM | 55.85 | 111.538 | 26.262 | 75.762 |
| 2016-03-043:39:47 PM | 55.738 | 111.538 | 26.262 | 75.762 |
| 2016-03-043:39:51 PM | 55.738 | 111.425 | 26.262 | 75.762 |
| 2016-03-043:39:55 PM | 55.738 | 111.312 | 26.262 | 75.762 |
| 2016-03-043:39:59 PM | 55.738 | 111.312 | 26.375 | 75.762 |
| 2016-03-043:40:03 PM | 55.738 | 111.312 | 26.488 | 75.762 |
| 2016-03-043:40:07 PM | 55.625 | 111.312 | 26.488 | 75.875 |
| 2016-03-043:40:11 PM | 55.625 | 111.2 | 26.6 | 75.875 |
| 2016-03-043:40:15 PM | 55.625 | 111.2 | 26.712 | 75.875 |
| 2016-03-043:40:19 PM | 55.625 | 111.2 | 26.825 | 75.875 |
| 2016-03-043:40:23 PM | 55.625 | 111.2 | 26.938 | 75.875 |
| 2016-03-043:40:27 PM | 55.625 | 111.088 | 27.05 | 75.875 |
| 2016-03-043:40:31 PM | 55.738 | 111.088 | 27.275 | 75.988 |
| 2016-03-043:40:35 PM | 55.625 | 110.975 | 27.388 | 75.875 |
| 2016-03-043:40:40 PM | 55.738 | 110.975 | 27.5 | 75.988 |
| 2016-03-043:40:44 PM | 55.738 | 110.975 | 27.612 | 75.988 |
| 2016-03-043:40:48 PM | 55.85 | 110.975 | 27.612 | 75.988 |
| 2016-03-043:40:52 PM | 55.85 | 110.862 | 27.725 | 75.988 |
| 2016-03-043:40:56 PM | 55.962 | 110.862 | 27.725 | 75.988 |
| 2016-03-043:41:00 PM | 55.962 | 110.862 | 27.838 | 75.988 |
| 2016-03-043:41:04 PM | 55.962 | 110.75 | 27.838 | 76.1 |
| 2016-03-043:41:08 PM | 55.962 | 110.75 | 27.95 | 76.1 |
| 2016-03-043:41:12 PM | 56.075 | 110.75 | 27.95 | 76.1 |
| 2016-03-043:41:16 PM | 55.962 | 110.638 | 27.838 | 76.1 |
| 2016-03-043:41:20 PM | 56.075 | 110.638 | 27.725 | 76.1 |
| 2016-03-043:41:24 PM | 56.075 | 110.525 | 27.612 | 76.212 |
| 2016-03-043:41:28 PM | 56.188 | 110.525 | 27.612 | 76.212 |
| 2016-03-043:41:32 PM | 56.188 | 110.413 | 27.612 | 76.212 |
| 2016-03-043:41:37 PM | 56.188 | 110.413 | 27.5 | 76.212 |
| 2016-03-043:41:41 PM | 56.188 | 110.3 | 27.5 | 76.212 |
| 2016-03-043:41:45 PM | 56.3 | 110.3 | 27.388 | 76.212 |
| 2016-03-043:41:49 PM | 56.3 | 110.3 | 27.275 | 76.212 |
| 2016-03-043:41:53 PM | 56.3 | 110.188 | 27.275 | 76.325 |
| 2016-03-043:41:57 PM | 56.3 | 110.188 | 27.275 | 76.325 |
| 2016-03-043:42:01 PM | 56.188 | 110.188 | 27.388 | 76.325 |
| 2016-03-043:42:05 PM | 56.3 | 110.075 | 27.388 | 76.325 |
| 2016-03-043:42:09 PM | 56.3 | 110.075 | 27.5 | 76.438 |
| 2016-03-043:42:13 PM | 56.188 | 110.075 | 27.612 | 76.438 |
| 2016-03-043:42:17 PM | 56.188 | 109.962 | 27.612 | 76.438 |
| 2016-03-043:42:21 PM | 56.188 | 109.962 | 27.5 | 76.438 |
| 2016-03-043:42:25 PM | 56.188 | 109.85 | 27.5 | 76.438 |
| 2016-03-043:42:29 PM | 56.188 | 109.85 | 27.388 | 76.438 |
| 2016-03-043:42:33 PM | 56.188 | 109.738 | 27.388 | 76.438 |
| 2016-03-043:42:37 PM | 56.188 | 109.738 | 27.388 | 76.438 |
| 2016-03-043:42:41 PM | 56.188 | 109.738 | 27.275 | 76.55 |
| 2016-03-043:42:45 PM | 56.188 | 109.738 | 27.388 | 76.55 |
| 2016-03-043:42:49 PM | 56.188 | 109.625 | 27.388 | 76.55 |
| 2016-03-043:42:53 PM | 56.188 | 109.625 | 27.388 | 76.662 |
| 2016-03-043:42:57 PM | 56.188 | 109.512 | 27.5 | 76.662 |
| 2016-03-043:43:02 PM | 56.188 | 109.512 | 27.5 | 76.662 |
| 2016-03-043:43:06 PM | 56.188 | 109.4 | 27.612 | 76.662 |
| 2016-03-043:43:10 PM | 56.188 | 109.288 | 27.612 | 76.662 |
| 2016-03-043:43:14 PM | 56.188 | 109.288 | 27.5 | 76.662 |
| 2016-03-043:43:18 PM | 56.075 | 109.175 | 27.388 | 76.662 |
| 2016-03-043:43:22 PM | 56.188 | 109.175 | 27.388 | 76.662 |
| 2016-03-043:43:26 PM | 56.188 | 109.062 | 27.275 | 76.775 |
| 2016-03-043:43:30 PM | 56.3 | 109.062 | 27.05 | 76.662 |
| 2016-03-043:43:34 PM | 56.412 | 109.062 | 27.05 | 76.775 |
| 2016-03-043:43:38 PM | 56.412 | 108.95 | 26.938 | 76.775 |
| 2016-03-043:43:42 PM | 56.412 | 108.95 | 27.05 | 76.775 |
| 2016-03-043:43:46 PM | 56.412 | 108.838 | 27.05 | 76.775 |
| 2016-03-043:43:50 PM | 56.525 | 108.838 | 27.05 | 76.888 |
| 2016-03-043:43:54 PM | 56.525 | 108.725 | 26.938 | 76.888 |
| 2016-03-043:43:58 PM | 56.525 | 108.725 | 27.05 | 76.888 |
| 2016-03-043:44:02 PM | 56.525 | 108.725 | 27.05 | 76.888 |
| 2016-03-043:44:06 PM | 56.525 | 108.612 | 27.05 | 76.888 |
| 2016-03-043:44:10 PM | 56.525 | 108.612 | 27.05 | 76.888 |
| 2016-03-043:44:14 PM | 56.525 | 108.5 | 27.05 | 77 |
| 2016-03-043:44:19 PM | 56.525 | 108.5 | 27.05 | 77 |
| 2016-03-043:44:23 PM | 56.525 | 108.5 | 27.05 | 77 |
| 2016-03-043:44:27 PM | 56.412 | 108.388 | 26.938 | 77 |
| 2016-03-043:44:31 PM | 56.412 | 108.388 | 26.938 | 77 |
| 2016-03-043:44:35 PM | 56.525 | 108.275 | 26.825 | 77 |
| 2016-03-043:44:39 PM | 56.525 | 108.275 | 26.712 | 77 |
| 2016-03-043:44:43 PM | 56.412 | 108.163 | 26.6 | 77.112 |
| 2016-03-043:44:47 PM | 56.525 | 108.163 | 26.6 | 77.112 |
| 2016-03-043:44:51 PM | 56.525 | 108.163 | 26.488 | 77.112 |
| 2016-03-043:44:55 PM | 56.412 | 108.05 | 26.488 | 77.112 |
| 2016-03-043:44:59 PM | 56.525 | 108.05 | 26.488 | 77.112 |
| 2016-03-043:45:03 PM | 56.525 | 107.938 | 26.375 | 77.225 |
| 2016-03-043:45:07 PM | 56.525 | 107.938 | 26.375 | 77.225 |
| 2016-03-043:45:11 PM | 56.525 | 107.825 | 26.375 | 77.225 |
| 2016-03-043:45:15 PM | 56.525 | 107.938 | 26.375 | 77.225 |
| 2016-03-043:45:19 PM | 56.525 | 107.825 | 26.375 | 77.225 |
| 2016-03-043:45:23 PM | 56.525 | 107.712 | 26.375 | 77.225 |
| 2016-03-043:45:27 PM | 56.525 | 107.712 | 26.375 | 77.338 |
| 2016-03-043:45:31 PM | 56.525 | 107.712 | 26.488 | 77.338 |
| 2016-03-043:45:35 PM | 56.525 | 107.6 | 26.6 | 77.338 |
| 2016-03-043:45:39 PM | 56.638 | 107.6 | 26.825 | 77.338 |
| 2016-03-043:45:43 PM | 56.638 | 107.6 | 26.825 | 77.338 |
| 2016-03-043:45:47 PM | 56.638 | 107.6 | 27.05 | 77.338 |
| 2016-03-043:45:52 PM | 56.75 | 107.488 | 27.05 | 77.338 |
| 2016-03-043:45:56 PM | 56.75 | 107.488 | 27.162 | 77.338 |
| 2016-03-043:46:00 PM | 56.862 | 107.375 | 27.275 | 77.338 |
| 2016-03-043:46:04 PM | 56.975 | 107.375 | 27.275 | 77.338 |
| 2016-03-043:46:08 PM | 56.975 | 107.375 | 27.5 | 77.45 |
| 2016-03-043:46:12 PM | 56.975 | 107.262 | 27.612 | 77.45 |
| 2016-03-043:46:16 PM | 56.975 | 107.262 | 27.725 | 77.45 |
| 2016-03-043:46:20 PM | 56.975 | 107.15 | 27.838 | 77.562 |
| 2016-03-043:46:24 PM | 56.975 | 107.15 | 27.95 | 77.562 |
| 2016-03-043:46:28 PM | 56.975 | 107.262 | 28.062 | 77.562 |
| 2016-03-043:46:32 PM | 56.862 | 107.15 | 28.062 | 77.562 |
| 2016-03-043:46:36 PM | 56.862 | 107.15 | 28.062 | 77.562 |
| 2016-03-043:46:40 PM | 56.862 | 107.038 | 27.95 | 77.562 |
| 2016-03-043:46:44 PM | 56.862 | 107.038 | 27.838 | 77.562 |
| 2016-03-043:46:48 PM | 56.975 | 106.925 | 27.612 | 77.562 |
| 2016-03-043:46:52 PM | 57.088 | 106.925 | 27.5 | 77.562 |
| 2016-03-043:46:56 PM | 57.2 | 106.812 | 27.388 | 77.562 |
| 2016-03-043:47:00 PM | 57.2 | 106.812 | 27.275 | 77.562 |
| 2016-03-043:47:04 PM | 57.2 | 106.812 | 27.275 | 77.675 |
| 2016-03-043:47:08 PM | 57.2 | 106.812 | 27.388 | 77.675 |
| 2016-03-043:47:13 PM | 57.2 | 106.7 | 27.388 | 77.675 |
| 2016-03-043:47:17 PM | 57.2 | 106.7 | 27.388 | 77.675 |
| 2016-03-043:47:21 PM | 57.2 | 106.7 | 27.5 | 77.675 |
| 2016-03-043:47:25 PM | 57.2 | 106.7 | 27.388 | 77.675 |
| 2016-03-043:47:29 PM | 57.2 | 106.588 | 27.388 | 77.675 |
| 2016-03-043:47:33 PM | 57.088 | 106.588 | 27.388 | 77.788 |
| 2016-03-043:47:37 PM | 56.975 | 106.588 | 27.275 | 77.788 |
| 2016-03-043:47:41 PM | 56.862 | 106.475 | 27.275 | 77.788 |
| 2016-03-043:47:45 PM | 56.862 | 106.475 | 27.275 | 77.788 |
| 2016-03-043:47:49 PM | 56.75 | 106.362 | 27.162 | 77.788 |
| 2016-03-043:47:53 PM | 56.638 | 106.362 | 27.162 | 77.788 |
| 2016-03-043:47:57 PM | 56.525 | 106.25 | 27.162 | 77.788 |
| 2016-03-043:48:01 PM | 56.412 | 106.25 | 27.05 | 77.788 |
| 2016-03-043:48:05 PM | 56.412 | 106.25 | 26.938 | 77.9 |
| 2016-03-043:48:09 PM | 56.3 | 106.138 | 27.05 | 77.788 |
| 2016-03-043:48:13 PM | 56.3 | 106.138 | 27.05 | 77.9 |
| 2016-03-043:48:17 PM | 56.3 | 106.025 | 27.162 | 77.9 |
| 2016-03-043:48:21 PM | 56.3 | 106.025 | 27.162 | 77.9 |
| 2016-03-043:48:25 PM | 56.3 | 105.913 | 27.275 | 77.9 |
| 2016-03-043:48:29 PM | 56.3 | 105.913 | 27.388 | 77.9 |
| 2016-03-043:48:33 PM | 56.3 | 105.8 | 27.5 | 77.9 |
| 2016-03-043:48:37 PM | 56.3 | 105.8 | 27.612 | 77.9 |
| 2016-03-043:48:41 PM | 56.3 | 105.688 | 27.612 | 77.9 |
| 2016-03-043:48:46 PM | 56.188 | 105.688 | 27.725 | 77.9 |
| 2016-03-043:48:50 PM | 56.3 | 105.688 | 27.838 | 77.9 |
| 2016-03-043:48:54 PM | 56.3 | 105.575 | 27.95 | 78.012 |
| 2016-03-043:48:58 PM | 56.3 | 105.575 | 27.838 | 78.012 |
| 2016-03-043:49:02 PM | 56.188 | 105.462 | 28.062 | 78.012 |
| 2016-03-043:49:06 PM | 56.188 | 105.462 | 28.062 | 77.9 |
| 2016-03-043:49:10 PM | 56.188 | 105.462 | 28.175 | 78.012 |
| 2016-03-043:49:14 PM | 56.188 | 105.35 | 28.175 | 78.012 |
| 2016-03-043:49:18 PM | 56.075 | 105.35 | 28.175 | 78.012 |
| 2016-03-043:49:22 PM | 56.075 | 105.35 | 28.175 | 78.012 |
| 2016-03-043:49:26 PM | 56.075 | 105.238 | 28.175 | 78.012 |
| 2016-03-043:49:30 PM | 55.962 | 105.238 | 28.062 | 78.012 |
| 2016-03-043:49:34 PM | 55.962 | 105.238 | 27.95 | 78.012 |
| 2016-03-043:49:38 PM | 55.85 | 105.125 | 27.95 | 78.012 |
| 2016-03-043:49:42 PM | 55.85 | 105.125 | 27.838 | 78.012 |
| 2016-03-043:49:46 PM | 55.738 | 105.125 | 27.838 | 78.012 |
| 2016-03-043:49:50 PM | 55.738 | 105.012 | 27.838 | 78.012 |
| 2016-03-043:49:54 PM | 55.738 | 105.012 | 27.838 | 78.012 |
| 2016-03-043:49:58 PM | 55.738 | 105.012 | 27.838 | 78.012 |
| 2016-03-043:50:03 PM | 55.738 | 105.012 | 27.725 | 78.012 |
| 2016-03-043:50:07 PM | 55.625 | 104.9 | 27.725 | 78.125 |
| 2016-03-043:50:11 PM | 55.625 | 104.9 | 27.612 | 78.125 |
| 2016-03-043:50:15 PM | 55.625 | 104.788 | 27.612 | 78.125 |
| 2016-03-043:50:19 PM | 55.625 | 104.788 | 27.725 | 78.125 |
| 2016-03-043:50:23 PM | 55.625 | 104.675 | 27.725 | 78.125 |
| 2016-03-043:50:27 PM | 55.625 | 104.675 | 27.725 | 78.125 |
| 2016-03-043:50:31 PM | 55.625 | 104.675 | 27.838 | 78.125 |
| 2016-03-043:50:35 PM | 55.625 | 104.675 | 27.838 | 78.125 |
| 2016-03-043:50:39 PM | 55.625 | 104.562 | 27.95 | 78.125 |
| 2016-03-043:50:43 PM | 55.625 | 104.562 | 27.838 | 78.125 |
| 2016-03-043:50:47 PM | 55.738 | 104.45 | 27.95 | 78.125 |
| 2016-03-043:50:51 PM | 55.738 | 104.45 | 27.838 | 78.125 |
| 2016-03-043:50:55 PM | 55.85 | 104.45 | 27.725 | 78.125 |
| 2016-03-043:50:59 PM | 55.85 | 104.45 | 27.838 | 78.238 |
| 2016-03-043:51:03 PM | 55.85 | 104.338 | 27.838 | 78.125 |
| 2016-03-043:51:07 PM | 55.738 | 104.338 | 27.95 | 78.238 |
| 2016-03-043:51:11 PM | 55.85 | 104.338 | 28.062 | 78.238 |
| 2016-03-043:51:15 PM | 55.85 | 104.225 | 27.95 | 78.238 |
| 2016-03-043:51:19 PM | 55.85 | 104.338 | 27.95 | 78.238 |
| 2016-03-043:51:23 PM | 55.85 | 104.225 | 27.95 | 78.238 |
| 2016-03-043:51:28 PM | 55.962 | 104.225 | 27.95 | 78.238 |
| 2016-03-043:51:32 PM | 55.962 | 104.225 | 28.062 | 78.238 |
| 2016-03-043:51:36 PM | 56.075 | 104.225 | 28.062 | 78.35 |
| 2016-03-043:51:40 PM | 56.188 | 104.112 | 28.175 | 78.238 |
| 2016-03-043:51:44 PM | 56.188 | 104.112 | 28.288 | 78.35 |
| 2016-03-043:51:48 PM | 56.188 | 104.112 | 28.288 | 78.35 |
| 2016-03-043:51:52 PM | 56.188 | 104.112 | 28.4 | 78.35 |
| 2016-03-043:51:56 PM | 56.188 | 104.112 | 28.4 | 78.35 |
| 2016-03-043:52:00 PM | 56.188 | 104 | 28.4 | 78.35 |
| 2016-03-043:52:04 PM | 56.188 | 104 | 28.512 | 78.35 |
| 2016-03-043:52:08 PM | 56.188 | 103.888 | 28.512 | 78.35 |
| 2016-03-043:52:12 PM | 56.188 | 103.888 | 28.625 | 78.35 |
| 2016-03-043:52:16 PM | 56.188 | 103.888 | 28.625 | 78.35 |
| 2016-03-043:52:20 PM | 56.188 | 103.775 | 28.625 | 78.35 |
| 2016-03-043:52:24 PM | 56.188 | 103.888 | 28.625 | 78.35 |
| 2016-03-043:52:29 PM | 56.188 | 103.775 | 28.512 | 78.35 |
| 2016-03-043:52:33 PM | 56.188 | 103.775 | 28.512 | 78.462 |
| 2016-03-043:52:37 PM | 56.188 | 103.775 | 28.512 | 78.35 |
| 2016-03-043:52:41 PM | 56.188 | 103.775 | 28.4 | 78.462 |
| 2016-03-043:52:45 PM | 56.188 | 103.663 | 28.175 | 78.462 |
| 2016-03-043:52:49 PM | 56.188 | 103.663 | 28.062 | 78.35 |
| 2016-03-043:52:53 PM | 56.188 | 103.663 | 27.95 | 78.35 |
| 2016-03-043:52:57 PM | 56.188 | 103.55 | 27.838 | 78.35 |
| 2016-03-043:53:01 PM | 56.188 | 103.55 | 27.725 | 78.35 |
| 2016-03-043:53:05 PM | 56.075 | 103.55 | 27.5 | 78.35 |
| 2016-03-043:53:09 PM | 56.075 | 103.55 | 27.388 | 78.462 |
| 2016-03-043:53:13 PM | 55.962 | 103.438 | 27.275 | 78.35 |
| 2016-03-043:53:17 PM | 55.962 | 103.438 | 27.275 | 78.462 |
| 2016-03-043:53:21 PM | 55.962 | 103.438 | 27.275 | 78.35 |
| 2016-03-043:53:25 PM | 55.962 | 103.325 | 27.275 | 78.35 |
| 2016-03-043:53:29 PM | 55.962 | 103.325 | 27.275 | 78.462 |
| 2016-03-043:53:33 PM | 55.85 | 103.325 | 27.162 | 78.462 |
| 2016-03-043:53:37 PM | 55.85 | 103.325 | 27.275 | 78.462 |
| 2016-03-043:53:42 PM | 55.738 | 103.212 | 27.275 | 78.462 |
| 2016-03-043:53:46 PM | 55.85 | 103.1 | 27.162 | 78.462 |
| 2016-03-043:53:50 PM | 55.85 | 103.1 | 27.05 | 78.462 |
| 2016-03-043:53:54 PM | 55.962 | 102.988 | 26.938 | 78.575 |
| 2016-03-043:53:58 PM | 55.85 | 102.988 | 26.712 | 78.575 |
| 2016-03-043:54:02 PM | 55.85 | 102.988 | 26.488 | 78.462 |
| 2016-03-043:54:10 PM | 55.738 | 102.988 | 26.262 | 78.575 |
| 2016-03-043:54:14 PM | 55.738 | 102.875 | 26.262 | 78.575 |
| 2016-03-043:54:18 PM | 55.625 | 102.762 | 26.15 | 78.575 |
| 2016-03-043:54:22 PM | 55.625 | 102.762 | 26.15 | 78.575 |
| 2016-03-043:54:26 PM | 55.625 | 102.762 | 26.15 | 78.575 |
| 2016-03-043:54:30 PM | 55.625 | 102.65 | 26.262 | 78.575 |
| 2016-03-043:54:34 PM | 55.625 | 102.65 | 26.375 | 78.575 |
| 2016-03-043:54:38 PM | 55.512 | 102.538 | 26.375 | 78.575 |
| 2016-03-043:54:42 PM | 55.512 | 102.538 | 26.375 | 78.462 |
| 2016-03-043:54:46 PM | 55.512 | 102.538 | 26.375 | 78.575 |
| 2016-03-043:54:50 PM | 55.512 | 102.425 | 26.488 | 78.575 |
| 2016-03-043:54:54 PM | 55.512 | 102.312 | 26.488 | 78.575 |
| 2016-03-043:54:58 PM | 55.512 | 102.312 | 26.488 | 78.575 |
| 2016-03-043:55:03 PM | 55.512 | 102.2 | 26.375 | 78.575 |
| 2016-03-043:55:07 PM | 55.4 | 102.2 | 26.375 | 78.575 |
| 2016-03-043:55:11 PM | 55.4 | 102.2 | 26.262 | 78.575 |
| 2016-03-043:55:15 PM | 55.4 | 102.088 | 26.262 | 78.575 |
| 2016-03-043:55:19 PM | 55.512 | 101.975 | 26.375 | 78.575 |
| 2016-03-043:55:23 PM | 55.4 | 101.975 | 26.375 | 78.575 |
| 2016-03-043:55:27 PM | 55.4 | 101.862 | 26.375 | 78.575 |
| 2016-03-043:55:31 PM | 55.4 | 101.75 | 26.488 | 78.575 |
| 2016-03-043:55:35 PM | 55.4 | 101.75 | 26.375 | 78.575 |
| 2016-03-043:55:39 PM | 55.4 | 101.638 | 26.488 | 78.575 |
| 2016-03-043:55:43 PM | 55.288 | 101.638 | 26.6 | 78.575 |
| 2016-03-043:55:47 PM | 55.4 | 101.525 | 26.6 | 78.575 |
| 2016-03-043:55:51 PM | 55.288 | 101.413 | 26.712 | 78.575 |
| 2016-03-043:55:55 PM | 55.288 | 101.413 | 26.712 | 78.575 |
| 2016-03-043:55:59 PM | 55.288 | 101.3 | 26.825 | 78.575 |
| 2016-03-043:56:03 PM | 55.4 | 101.188 | 26.825 | 78.575 |
| 2016-03-043:56:07 PM | 55.4 | 101.188 | 26.825 | 78.575 |
| 2016-03-043:56:11 PM | 55.4 | 101.075 | 26.938 | 78.575 |
| 2016-03-043:56:15 PM | 55.288 | 101.075 | 26.938 | 78.575 |
| 2016-03-043:56:19 PM | 55.288 | 100.962 | 27.05 | 78.575 |
| 2016-03-043:56:24 PM | 55.4 | 100.85 | 27.05 | 78.575 |
| 2016-03-043:56:28 PM | 55.4 | 100.85 | 26.938 | 78.688 |
| 2016-03-043:56:32 PM | 55.4 | 100.738 | 26.825 | 78.575 |
| 2016-03-043:56:36 PM | 55.512 | 100.738 | 26.712 | 78.688 |
| 2016-03-043:56:40 PM | 55.512 | 100.625 | 26.6 | 78.575 |
| 2016-03-043:56:44 PM | 55.512 | 100.512 | 26.6 | 78.688 |
| 2016-03-043:56:48 PM | 55.625 | 100.4 | 26.6 | 78.688 |
| 2016-03-043:56:52 PM | 55.512 | 100.4 | 26.6 | 78.688 |
| 2016-03-043:56:56 PM | 55.512 | 100.288 | 26.712 | 78.688 |
| 2016-03-043:57:00 PM | 55.512 | 100.175 | 26.712 | 78.688 |
| 2016-03-043:57:04 PM | 55.625 | 100.062 | 26.712 | 78.688 |
| 2016-03-043:57:08 PM | 55.625 | 100.062 | 26.825 | 78.688 |
| 2016-03-043:57:12 PM | 55.738 | 99.95 | 26.938 | 78.688 |
| 2016-03-043:57:16 PM | 55.738 | 99.838 | 26.938 | 78.688 |
| 2016-03-043:57:20 PM | 55.85 | 99.838 | 26.938 | 78.688 |
| 2016-03-043:57:24 PM | 55.85 | 99.725 | 26.938 | 78.688 |
| 2016-03-043:57:29 PM | 55.85 | 99.612 | 27.05 | 78.8 |
| 2016-03-043:57:33 PM | 55.962 | 99.612 | 27.05 | 78.688 |
| 2016-03-043:57:37 PM | 55.962 | 99.5 | 27.162 | 78.688 |
| 2016-03-043:57:41 PM | 55.962 | 99.5 | 27.162 | 78.8 |
| 2016-03-043:57:45 PM | 55.962 | 99.388 | 27.162 | 78.8 |
| 2016-03-043:57:49 PM | 55.962 | 99.275 | 27.275 | 78.8 |
| 2016-03-043:57:53 PM | 55.85 | 99.275 | 27.275 | 78.688 |
| 2016-03-043:57:57 PM | 55.85 | 99.163 | 27.275 | 78.688 |
| 2016-03-043:58:01 PM | 55.85 | 99.05 | 27.275 | 78.8 |
| 2016-03-043:58:05 PM | 55.738 | 98.938 | 27.162 | 78.688 |
| 2016-03-043:58:09 PM | 55.738 | 98.938 | 27.162 | 78.688 |
| 2016-03-043:58:13 PM | 55.738 | 98.825 | 27.275 | 78.688 |
| 2016-03-043:58:17 PM | 55.738 | 98.825 | 27.275 | 78.688 |
| 2016-03-043:58:21 PM | 55.738 | 98.825 | 27.388 | 78.8 |
| 2016-03-043:58:25 PM | 55.625 | 98.6 | 27.275 | 78.688 |
| 2016-03-043:58:29 PM | 55.625 | 98.6 | 27.275 | 78.688 |
| 2016-03-043:58:33 PM | 55.625 | 98.488 | 27.162 | 78.8 |
| 2016-03-043:58:37 PM | 55.625 | 98.488 | 27.162 | 78.8 |
| 2016-03-043:58:41 PM | 55.625 | 98.375 | 27.05 | 78.8 |
| 2016-03-043:58:46 PM | 55.625 | 98.375 | 27.05 | 78.8 |
| 2016-03-043:58:50 PM | 55.625 | 98.262 | 27.05 | 78.8 |
| 2016-03-043:58:54 PM | 55.625 | 98.15 | 27.05 | 78.8 |
| 2016-03-043:58:58 PM | 55.625 | 98.038 | 27.05 | 78.8 |
| 2016-03-043:59:02 PM | 55.625 | 97.925 | 27.05 | 78.8 |
| 2016-03-043:59:06 PM | 55.512 | 97.925 | 27.05 | 78.8 |
| 2016-03-043:59:10 PM | 55.512 | 97.812 | 27.05 | 78.8 |
| 2016-03-043:59:14 PM | 55.512 | 97.7 | 27.162 | 78.8 |
| 2016-03-043:59:18 PM | 55.512 | 97.7 | 27.275 | 78.8 |
| 2016-03-043:59:22 PM | 55.512 | 97.588 | 27.275 | 78.8 |
| 2016-03-043:59:26 PM | 55.512 | 97.475 | 27.388 | 78.8 |
| 2016-03-043:59:30 PM | 55.512 | 97.362 | 27.388 | 78.8 |
| 2016-03-043:59:34 PM | 55.512 | 97.25 | 27.388 | 78.8 |
| 2016-03-043:59:38 PM | 55.512 | 97.138 | 27.388 | 78.8 |
| 2016-03-043:59:42 PM | 55.512 | 97.025 | 27.388 | 78.8 |
| 2016-03-043:59:46 PM | 55.4 | 97.025 | 27.388 | 78.8 |
| 2016-03-043:59:50 PM | 55.512 | 96.8 | 27.275 | 78.8 |
| 2016-03-043:59:54 PM | 55.512 | 96.688 | 27.275 | 78.8 |
| 2016-03-043:59:59 PM | 55.625 | 96.575 | 27.162 | 78.8 |
| 2016-03-044:00:03 PM | 55.625 | 96.462 | 27.162 | 78.8 |
| 2016-03-044:00:07 PM | 55.512 | 96.35 | 27.162 | 78.8 |
| 2016-03-044:00:11 PM | 55.512 | 96.238 | 27.05 | 78.8 |
| 2016-03-044:00:15 PM | 55.512 | 96.125 | 27.05 | 78.8 |
| 2016-03-044:00:19 PM | 55.4 | 96.012 | 27.05 | 78.8 |
| 2016-03-044:00:23 PM | 55.288 | 95.9 | 27.05 | 78.8 |
| 2016-03-044:00:27 PM | 55.288 | 95.675 | 27.05 | 78.8 |
| 2016-03-044:00:31 PM | 55.288 | 95.562 | 27.05 | 78.8 |
| 2016-03-044:00:35 PM | 55.288 | 95.45 | 27.05 | 78.8 |
| 2016-03-044:00:39 PM | 55.288 | 95.338 | 27.05 | 78.8 |
| 2016-03-044:00:43 PM | 55.4 | 95.112 | 27.162 | 78.8 |
| 2016-03-044:00:47 PM | 55.4 | 95 | 27.162 | 78.8 |
| 2016-03-044:00:51 PM | 55.4 | 94.888 | 27.162 | 78.8 |
| 2016-03-044:00:55 PM | 55.4 | 94.775 | 27.162 | 78.8 |
| 2016-03-044:00:59 PM | 55.4 | 94.663 | 27.275 | 78.8 |
| 2016-03-044:01:03 PM | 55.4 | 94.55 | 27.162 | 78.8 |
| 2016-03-044:01:07 PM | 55.512 | 94.325 | 27.162 | 78.8 |
| 2016-03-044:01:11 PM | 55.512 | 94.212 | 27.275 | 78.8 |
| 2016-03-044:01:15 PM | 55.512 | 93.988 | 27.275 | 78.8 |
| 2016-03-044:01:20 PM | 55.512 | 93.875 | 27.388 | 78.8 |
| 2016-03-044:01:24 PM | 55.512 | 93.762 | 27.388 | 78.8 |
| 2016-03-044:01:28 PM | 55.625 | 93.538 | 27.388 | 78.8 |
| 2016-03-044:01:32 PM | 55.625 | 93.425 | 27.5 | 78.8 |
| 2016-03-044:01:36 PM | 55.625 | 93.2 | 27.5 | 78.8 |
| 2016-03-044:01:40 PM | 55.625 | 93.088 | 27.5 | 78.8 |
| 2016-03-044:01:44 PM | 55.625 | 92.862 | 27.5 | 78.8 |
| 2016-03-044:01:48 PM | 55.625 | 92.75 | 27.612 | 78.8 |
| 2016-03-044:01:52 PM | 55.625 | 92.638 | 27.612 | 78.8 |
| 2016-03-044:01:56 PM | 55.625 | 92.413 | 27.725 | 78.8 |
| 2016-03-044:02:00 PM | 55.738 | 92.3 | 27.725 | 78.8 |
| 2016-03-044:02:04 PM | 55.738 | 92.075 | 27.725 | 78.8 |
| 2016-03-044:02:08 PM | 55.85 | 91.962 | 27.725 | 78.8 |
| 2016-03-044:02:12 PM | 55.85 | 91.738 | 27.612 | 78.8 |
| 2016-03-044:02:16 PM | 55.85 | 91.512 | 27.612 | 78.8 |
| 2016-03-044:02:20 PM | 55.85 | 91.4 | 27.612 | 78.8 |
| 2016-03-044:02:24 PM | 55.962 | 91.175 | 27.612 | 78.8 |
| 2016-03-044:02:28 PM | 55.85 | 91.062 | 27.612 | 78.8 |
| 2016-03-044:02:32 PM | 55.85 | 90.838 | 27.612 | 78.8 |
| 2016-03-044:02:37 PM | 55.85 | 90.725 | 27.612 | 78.8 |
| 2016-03-044:02:41 PM | 55.85 | 90.5 | 27.725 | 78.8 |
| 2016-03-044:02:45 PM | 55.85 | 90.388 | 27.725 | 78.8 |
| 2016-03-044:02:49 PM | 55.85 | 90.163 | 27.725 | 78.8 |
| 2016-03-044:02:53 PM | 55.85 | 90.05 | 27.725 | 78.8 |
| 2016-03-044:02:57 PM | 55.85 | 89.825 | 27.725 | 78.8 |
| 2016-03-044:03:01 PM | 55.85 | 89.6 | 27.725 | 78.8 |
| 2016-03-044:03:05 PM | 55.85 | 89.488 | 27.838 | 78.8 |
| 2016-03-044:03:09 PM | 55.962 | 89.262 | 27.838 | 78.8 |
| 2016-03-044:03:13 PM | 55.962 | 89.038 | 27.95 | 78.8 |
| 2016-03-044:03:17 PM | 55.962 | 88.812 | 27.95 | 78.8 |
| 2016-03-044:03:21 PM | 55.85 | 88.7 | 27.95 | 78.8 |
| 2016-03-044:03:25 PM | 55.962 | 88.475 | 28.062 | 78.8 |
| 2016-03-044:03:29 PM | 55.85 | 88.25 | 28.062 | 78.8 |
| 2016-03-044:03:33 PM | 55.85 | 88.025 | 28.062 | 78.8 |
| 2016-03-044:03:37 PM | 55.85 | 87.8 | 27.95 | 78.8 |
| 2016-03-044:03:41 PM | 55.85 | 87.575 | 27.95 | 78.8 |
| 2016-03-044:03:45 PM | 55.85 | 87.35 | 27.95 | 78.8 |
| 2016-03-044:03:49 PM | 55.85 | 87.125 | 27.95 | 78.8 |
| 2016-03-044:03:54 PM | 55.85 | 86.9 | 28.062 | 78.8 |
| 2016-03-044:03:58 PM | 55.962 | 86.675 | 28.062 | 78.8 |
| 2016-03-044:04:02 PM | 55.85 | 86.45 | 27.95 | 78.8 |
| 2016-03-044:04:06 PM | 55.85 | 86.225 | 27.95 | 78.8 |
| 2016-03-044:04:10 PM | 55.85 | 85.888 | 27.95 | 78.8 |
| 2016-03-044:04:14 PM | 55.85 | 85.662 | 27.838 | 78.8 |
| 2016-03-044:04:18 PM | 55.738 | 85.325 | 27.838 | 78.8 |
| 2016-03-044:04:22 PM | 55.625 | 85.1 | 27.838 | 78.8 |
| 2016-03-044:04:26 PM | 55.625 | 84.875 | 27.838 | 78.8 |
| 2016-03-044:04:30 PM | 55.738 | 84.65 | 27.838 | 78.8 |
| 2016-03-044:04:34 PM | 55.738 | 84.312 | 27.725 | 78.8 |
| 2016-03-044:04:38 PM | 55.738 | 83.975 | 27.725 | 78.8 |
| 2016-03-044:04:42 PM | 55.738 | 83.75 | 27.838 | 78.8 |
| 2016-03-044:04:46 PM | 55.738 | 83.412 | 27.725 | 78.8 |
| 2016-03-044:04:50 PM | 55.625 | 83.188 | 27.725 | 78.8 |
| 2016-03-044:04:54 PM | 55.625 | 82.85 | 27.725 | 78.8 |
| 2016-03-044:04:58 PM | 55.625 | 82.512 | 27.5 | 78.8 |
| 2016-03-044:05:02 PM | 55.512 | 82.288 | 27.388 | 78.8 |
| 2016-03-044:05:06 PM | 55.512 | 81.95 | 27.275 | 78.8 |
| 2016-03-044:05:10 PM | 55.512 | 81.612 | 27.162 | 78.912 |
| 2016-03-044:05:15 PM | 55.512 | 81.275 | 27.162 | 78.8 |
| 2016-03-044:05:19 PM | 55.512 | 80.938 | 27.275 | 78.912 |
| 2016-03-044:05:23 PM | 55.4 | 80.712 | 27.162 | 78.8 |
| 2016-03-044:05:27 PM | 55.288 | 80.375 | 27.05 | 78.8 |
| 2016-03-044:05:31 PM | 55.288 | 80.038 | 26.938 | 78.8 |
| 2016-03-044:05:35 PM | 55.288 | 79.7 | 26.825 | 78.8 |
| 2016-03-044:05:39 PM | 55.288 | 79.362 | 26.712 | 78.8 |
| 2016-03-044:05:43 PM | 55.288 | 79.025 | 26.712 | 78.8 |
| 2016-03-044:05:47 PM | 55.4 | 78.8 | 26.712 | 78.912 |
| 2016-03-044:05:51 PM | 55.4 | 78.35 | 26.712 | 78.8 |
| 2016-03-044:05:55 PM | 55.4 | 78.125 | 26.712 | 78.8 |
| 2016-03-044:05:59 PM | 55.4 | 77.788 | 26.712 | 78.8 |
| 2016-03-044:06:03 PM | 55.288 | 77.45 | 26.712 | 78.8 |
| 2016-03-044:06:07 PM | 55.4 | 77.112 | 26.712 | 78.8 |
| 2016-03-044:06:11 PM | 55.4 | 76.775 | 26.825 | 78.8 |
| 2016-03-044:06:15 PM | 55.4 | 76.438 | 26.938 | 78.8 |
| 2016-03-044:06:19 PM | 55.4 | 76.1 | 27.05 | 78.8 |
| 2016-03-044:06:23 PM | 55.4 | 75.762 | 27.05 | 78.8 |
| 2016-03-044:06:28 PM | 55.288 | 75.538 | 27.05 | 78.8 |
| 2016-03-044:06:32 PM | 55.4 | 75.2 | 27.05 | 78.8 |
| 2016-03-044:06:36 PM | 55.512 | 74.975 | 27.05 | 78.8 |
| 2016-03-044:06:40 PM | 55.512 | 74.638 | 27.162 | 78.8 |
| 2016-03-044:06:44 PM | 55.625 | 74.3 | 27.162 | 78.8 |
| 2016-03-044:06:48 PM | 55.625 | 73.962 | 27.162 | 78.8 |
| 2016-03-044:06:52 PM | 55.738 | 73.738 | 27.275 | 78.8 |
| 2016-03-044:06:56 PM | 55.738 | 73.4 | 27.388 | 78.912 |
| 2016-03-044:07:00 PM | 55.738 | 73.175 | 27.388 | 78.8 |
| 2016-03-044:07:04 PM | 55.738 | 72.838 | 27.388 | 78.8 |
| 2016-03-044:07:08 PM | 55.85 | 72.612 | 27.5 | 78.912 |
| 2016-03-044:07:12 PM | 55.85 | 72.275 | 27.5 | 78.8 |
| 2016-03-044:07:16 PM | 55.85 | 71.938 | 27.5 | 78.8 |
| 2016-03-044:07:20 PM | 55.85 | 71.712 | 27.5 | 78.912 |
| 2016-03-044:07:24 PM | 55.85 | 71.488 | 27.5 | 78.912 |
| 2016-03-044:07:28 PM | 55.738 | 71.15 | 27.612 | 78.912 |
| 2016-03-044:07:33 PM | 55.85 | 70.925 | 27.612 | 78.912 |
| 2016-03-044:07:37 PM | 55.738 | 70.7 | 27.612 | 78.912 |
| 2016-03-044:07:41 PM | 55.738 | 70.362 | 27.612 | 78.912 |
| 2016-03-044:07:45 PM | 55.738 | 70.138 | 27.612 | 78.912 |
| 2016-03-044:07:49 PM | 55.738 | 69.912 | 27.612 | 78.912 |
| 2016-03-044:07:53 PM | 55.625 | 69.575 | 27.388 | 78.912 |
| 2016-03-044:07:57 PM | 55.625 | 69.35 | 27.275 | 78.912 |
| 2016-03-044:08:01 PM | 55.625 | 69.125 | 27.275 | 78.912 |
| 2016-03-044:08:05 PM | 55.625 | 68.9 | 27.162 | 78.912 |
| 2016-03-044:08:09 PM | 55.625 | 68.675 | 27.162 | 78.8 |
| 2016-03-044:08:13 PM | 55.625 | 68.45 | 27.162 | 78.912 |
| 2016-03-044:08:17 PM | 55.625 | 68.225 | 27.162 | 78.912 |
| 2016-03-044:08:21 PM | 55.625 | 68 | 27.162 | 78.912 |
| 2016-03-044:08:25 PM | 55.512 | 67.775 | 27.05 | 78.912 |
| 2016-03-044:08:29 PM | 55.512 | 67.55 | 26.938 | 78.912 |
| 2016-03-044:08:33 PM | 55.4 | 67.438 | 26.938 | 78.912 |
| 2016-03-044:08:37 PM | 55.4 | 67.212 | 26.825 | 78.912 |
| 2016-03-044:08:41 PM | 55.288 | 66.988 | 26.825 | 78.912 |
| 2016-03-044:08:46 PM | 55.288 | 66.875 | 26.712 | 78.912 |
| 2016-03-044:08:50 PM | 55.288 | 66.65 | 26.712 | 78.912 |
| 2016-03-044:08:54 PM | 55.175 | 66.65 | 26.712 | 78.912 |
| 2016-03-044:08:58 PM | 55.062 | 66.425 | 26.712 | 78.912 |